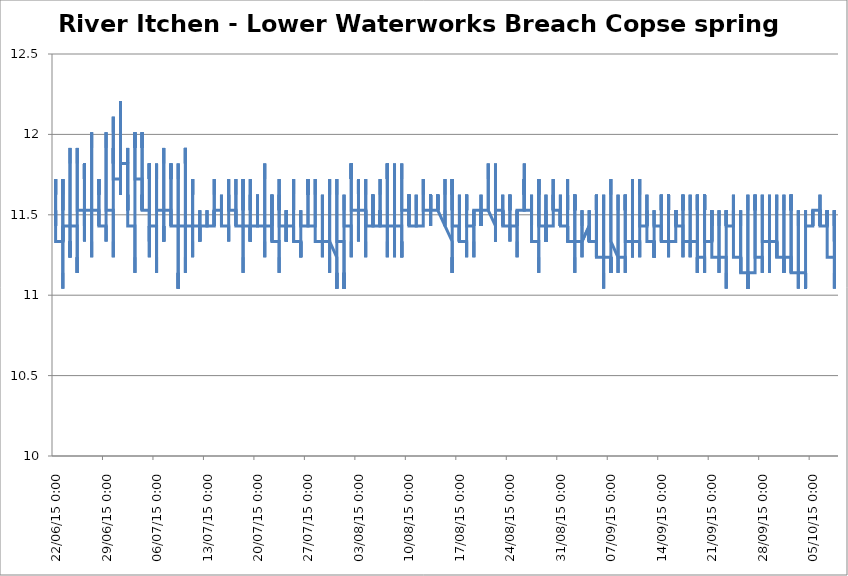
| Category | centigrade |
|---|---|
| 2015-06-22 12:00:00 | 11.431 |
| 2015-06-22 12:15:00 | 11.528 |
| 2015-06-22 12:30:00 | 11.431 |
| 2015-06-22 12:45:00 | 11.528 |
| 2015-06-22 13:00:00 | 11.528 |
| 2015-06-22 13:15:00 | 11.528 |
| 2015-06-22 13:30:00 | 11.625 |
| 2015-06-22 13:45:00 | 11.625 |
| 2015-06-22 14:00:00 | 11.625 |
| 2015-06-22 14:15:00 | 11.722 |
| 2015-06-22 14:30:00 | 11.625 |
| 2015-06-22 14:45:00 | 11.625 |
| 2015-06-22 15:00:00 | 11.625 |
| 2015-06-22 15:15:00 | 11.625 |
| 2015-06-22 15:30:00 | 11.722 |
| 2015-06-22 15:45:00 | 11.722 |
| 2015-06-22 16:00:00 | 11.722 |
| 2015-06-22 16:15:00 | 11.722 |
| 2015-06-22 16:30:00 | 11.722 |
| 2015-06-22 16:45:00 | 11.722 |
| 2015-06-22 17:00:00 | 11.722 |
| 2015-06-22 17:15:00 | 11.722 |
| 2015-06-22 17:30:00 | 11.722 |
| 2015-06-22 17:45:00 | 11.625 |
| 2015-06-22 18:00:00 | 11.625 |
| 2015-06-22 18:15:00 | 11.625 |
| 2015-06-22 18:30:00 | 11.625 |
| 2015-06-22 18:45:00 | 11.625 |
| 2015-06-22 19:00:00 | 11.528 |
| 2015-06-22 19:15:00 | 11.528 |
| 2015-06-22 19:30:00 | 11.528 |
| 2015-06-22 19:45:00 | 11.528 |
| 2015-06-22 20:00:00 | 11.528 |
| 2015-06-22 20:15:00 | 11.528 |
| 2015-06-22 20:30:00 | 11.528 |
| 2015-06-22 20:45:00 | 11.528 |
| 2015-06-22 21:00:00 | 11.528 |
| 2015-06-22 21:15:00 | 11.431 |
| 2015-06-22 21:30:00 | 11.431 |
| 2015-06-22 21:45:00 | 11.431 |
| 2015-06-22 22:00:00 | 11.431 |
| 2015-06-22 22:15:00 | 11.431 |
| 2015-06-22 22:30:00 | 11.431 |
| 2015-06-22 22:45:00 | 11.431 |
| 2015-06-22 23:00:00 | 11.334 |
| 2015-06-22 23:15:00 | 11.334 |
| 2015-06-22 23:30:00 | 11.334 |
| 2015-06-22 23:45:00 | 11.334 |
| 2015-06-23 | 11.334 |
| 2015-06-23 00:15:00 | 11.334 |
| 2015-06-23 00:30:00 | 11.334 |
| 2015-06-23 00:45:00 | 11.431 |
| 2015-06-23 01:00:00 | 11.334 |
| 2015-06-23 01:15:00 | 11.431 |
| 2015-06-23 01:30:00 | 11.334 |
| 2015-06-23 01:45:00 | 11.334 |
| 2015-06-23 02:00:00 | 11.334 |
| 2015-06-23 02:15:00 | 11.334 |
| 2015-06-23 02:30:00 | 11.236 |
| 2015-06-23 02:45:00 | 11.236 |
| 2015-06-23 03:00:00 | 11.236 |
| 2015-06-23 03:15:00 | 11.236 |
| 2015-06-23 03:30:00 | 11.236 |
| 2015-06-23 03:45:00 | 11.236 |
| 2015-06-23 04:00:00 | 11.139 |
| 2015-06-23 04:15:00 | 11.139 |
| 2015-06-23 04:30:00 | 11.139 |
| 2015-06-23 04:45:00 | 11.139 |
| 2015-06-23 05:00:00 | 11.139 |
| 2015-06-23 05:15:00 | 11.139 |
| 2015-06-23 05:30:00 | 11.139 |
| 2015-06-23 05:45:00 | 11.041 |
| 2015-06-23 06:00:00 | 11.041 |
| 2015-06-23 06:15:00 | 11.041 |
| 2015-06-23 06:30:00 | 11.041 |
| 2015-06-23 06:45:00 | 11.041 |
| 2015-06-23 07:00:00 | 11.139 |
| 2015-06-23 07:15:00 | 11.139 |
| 2015-06-23 07:30:00 | 11.139 |
| 2015-06-23 07:45:00 | 11.236 |
| 2015-06-23 08:00:00 | 11.236 |
| 2015-06-23 08:15:00 | 11.236 |
| 2015-06-23 08:30:00 | 11.236 |
| 2015-06-23 08:45:00 | 11.334 |
| 2015-06-23 09:00:00 | 11.334 |
| 2015-06-23 09:15:00 | 11.334 |
| 2015-06-23 09:30:00 | 11.334 |
| 2015-06-23 09:45:00 | 11.431 |
| 2015-06-23 10:00:00 | 11.431 |
| 2015-06-23 10:15:00 | 11.431 |
| 2015-06-23 10:30:00 | 11.431 |
| 2015-06-23 10:45:00 | 11.431 |
| 2015-06-23 11:00:00 | 11.528 |
| 2015-06-23 11:15:00 | 11.528 |
| 2015-06-23 11:30:00 | 11.528 |
| 2015-06-23 11:45:00 | 11.625 |
| 2015-06-23 12:00:00 | 11.625 |
| 2015-06-23 12:15:00 | 11.625 |
| 2015-06-23 12:30:00 | 11.625 |
| 2015-06-23 12:45:00 | 11.625 |
| 2015-06-23 13:00:00 | 11.625 |
| 2015-06-23 13:15:00 | 11.625 |
| 2015-06-23 13:30:00 | 11.625 |
| 2015-06-23 13:45:00 | 11.625 |
| 2015-06-23 14:00:00 | 11.625 |
| 2015-06-23 14:15:00 | 11.625 |
| 2015-06-23 14:30:00 | 11.722 |
| 2015-06-23 14:45:00 | 11.722 |
| 2015-06-23 15:00:00 | 11.722 |
| 2015-06-23 15:15:00 | 11.722 |
| 2015-06-23 15:30:00 | 11.722 |
| 2015-06-23 15:45:00 | 11.722 |
| 2015-06-23 16:00:00 | 11.722 |
| 2015-06-23 16:15:00 | 11.722 |
| 2015-06-23 16:30:00 | 11.722 |
| 2015-06-23 16:45:00 | 11.722 |
| 2015-06-23 17:00:00 | 11.722 |
| 2015-06-23 17:15:00 | 11.722 |
| 2015-06-23 17:30:00 | 11.722 |
| 2015-06-23 17:45:00 | 11.625 |
| 2015-06-23 18:00:00 | 11.722 |
| 2015-06-23 18:15:00 | 11.625 |
| 2015-06-23 18:30:00 | 11.625 |
| 2015-06-23 18:45:00 | 11.625 |
| 2015-06-23 19:00:00 | 11.625 |
| 2015-06-23 19:15:00 | 11.625 |
| 2015-06-23 19:30:00 | 11.625 |
| 2015-06-23 19:45:00 | 11.625 |
| 2015-06-23 20:00:00 | 11.625 |
| 2015-06-23 20:15:00 | 11.625 |
| 2015-06-23 20:30:00 | 11.625 |
| 2015-06-23 20:45:00 | 11.625 |
| 2015-06-23 21:00:00 | 11.528 |
| 2015-06-23 21:15:00 | 11.625 |
| 2015-06-23 21:30:00 | 11.528 |
| 2015-06-23 21:45:00 | 11.528 |
| 2015-06-23 22:00:00 | 11.528 |
| 2015-06-23 22:15:00 | 11.528 |
| 2015-06-23 22:30:00 | 11.528 |
| 2015-06-23 22:45:00 | 11.528 |
| 2015-06-23 23:00:00 | 11.431 |
| 2015-06-23 23:15:00 | 11.431 |
| 2015-06-23 23:30:00 | 11.431 |
| 2015-06-23 23:45:00 | 11.431 |
| 2015-06-24 | 11.431 |
| 2015-06-24 00:15:00 | 11.431 |
| 2015-06-24 00:30:00 | 11.431 |
| 2015-06-24 00:45:00 | 11.431 |
| 2015-06-24 01:00:00 | 11.431 |
| 2015-06-24 01:15:00 | 11.431 |
| 2015-06-24 01:30:00 | 11.431 |
| 2015-06-24 01:45:00 | 11.431 |
| 2015-06-24 02:00:00 | 11.334 |
| 2015-06-24 02:15:00 | 11.334 |
| 2015-06-24 02:30:00 | 11.334 |
| 2015-06-24 02:45:00 | 11.334 |
| 2015-06-24 03:00:00 | 11.334 |
| 2015-06-24 03:15:00 | 11.334 |
| 2015-06-24 03:30:00 | 11.334 |
| 2015-06-24 03:45:00 | 11.334 |
| 2015-06-24 04:00:00 | 11.334 |
| 2015-06-24 04:15:00 | 11.334 |
| 2015-06-24 04:30:00 | 11.236 |
| 2015-06-24 04:45:00 | 11.334 |
| 2015-06-24 05:00:00 | 11.334 |
| 2015-06-24 05:15:00 | 11.236 |
| 2015-06-24 05:30:00 | 11.236 |
| 2015-06-24 05:45:00 | 11.236 |
| 2015-06-24 06:00:00 | 11.334 |
| 2015-06-24 06:15:00 | 11.236 |
| 2015-06-24 06:30:00 | 11.334 |
| 2015-06-24 06:45:00 | 11.334 |
| 2015-06-24 07:00:00 | 11.334 |
| 2015-06-24 07:15:00 | 11.334 |
| 2015-06-24 07:30:00 | 11.334 |
| 2015-06-24 07:45:00 | 11.334 |
| 2015-06-24 08:00:00 | 11.334 |
| 2015-06-24 08:15:00 | 11.334 |
| 2015-06-24 08:30:00 | 11.334 |
| 2015-06-24 08:45:00 | 11.334 |
| 2015-06-24 09:00:00 | 11.334 |
| 2015-06-24 09:15:00 | 11.431 |
| 2015-06-24 09:30:00 | 11.431 |
| 2015-06-24 09:45:00 | 11.431 |
| 2015-06-24 10:00:00 | 11.431 |
| 2015-06-24 10:15:00 | 11.528 |
| 2015-06-24 10:30:00 | 11.528 |
| 2015-06-24 10:45:00 | 11.528 |
| 2015-06-24 11:00:00 | 11.625 |
| 2015-06-24 11:15:00 | 11.625 |
| 2015-06-24 11:30:00 | 11.625 |
| 2015-06-24 11:45:00 | 11.722 |
| 2015-06-24 12:00:00 | 11.722 |
| 2015-06-24 12:15:00 | 11.722 |
| 2015-06-24 12:30:00 | 11.722 |
| 2015-06-24 12:45:00 | 11.819 |
| 2015-06-24 13:00:00 | 11.819 |
| 2015-06-24 13:15:00 | 11.819 |
| 2015-06-24 13:30:00 | 11.916 |
| 2015-06-24 13:45:00 | 11.916 |
| 2015-06-24 14:00:00 | 11.916 |
| 2015-06-24 14:15:00 | 11.916 |
| 2015-06-24 14:30:00 | 11.916 |
| 2015-06-24 14:45:00 | 11.916 |
| 2015-06-24 15:00:00 | 11.916 |
| 2015-06-24 15:15:00 | 11.916 |
| 2015-06-24 15:30:00 | 11.916 |
| 2015-06-24 15:45:00 | 11.916 |
| 2015-06-24 16:00:00 | 11.916 |
| 2015-06-24 16:15:00 | 11.916 |
| 2015-06-24 16:30:00 | 11.916 |
| 2015-06-24 16:45:00 | 11.916 |
| 2015-06-24 17:00:00 | 11.819 |
| 2015-06-24 17:15:00 | 11.819 |
| 2015-06-24 17:30:00 | 11.819 |
| 2015-06-24 17:45:00 | 11.722 |
| 2015-06-24 18:00:00 | 11.722 |
| 2015-06-24 18:15:00 | 11.722 |
| 2015-06-24 18:30:00 | 11.722 |
| 2015-06-24 18:45:00 | 11.722 |
| 2015-06-24 19:00:00 | 11.722 |
| 2015-06-24 19:15:00 | 11.722 |
| 2015-06-24 19:30:00 | 11.722 |
| 2015-06-24 19:45:00 | 11.722 |
| 2015-06-24 20:00:00 | 11.722 |
| 2015-06-24 20:15:00 | 11.722 |
| 2015-06-24 20:30:00 | 11.625 |
| 2015-06-24 20:45:00 | 11.625 |
| 2015-06-24 21:00:00 | 11.625 |
| 2015-06-24 21:15:00 | 11.625 |
| 2015-06-24 21:30:00 | 11.625 |
| 2015-06-24 21:45:00 | 11.625 |
| 2015-06-24 22:00:00 | 11.528 |
| 2015-06-24 22:15:00 | 11.528 |
| 2015-06-24 22:30:00 | 11.528 |
| 2015-06-24 22:45:00 | 11.528 |
| 2015-06-24 23:00:00 | 11.528 |
| 2015-06-24 23:15:00 | 11.528 |
| 2015-06-24 23:30:00 | 11.431 |
| 2015-06-24 23:45:00 | 11.431 |
| 2015-06-25 | 11.431 |
| 2015-06-25 00:15:00 | 11.431 |
| 2015-06-25 00:30:00 | 11.431 |
| 2015-06-25 00:45:00 | 11.431 |
| 2015-06-25 01:00:00 | 11.431 |
| 2015-06-25 01:15:00 | 11.431 |
| 2015-06-25 01:30:00 | 11.431 |
| 2015-06-25 01:45:00 | 11.431 |
| 2015-06-25 02:00:00 | 11.334 |
| 2015-06-25 02:15:00 | 11.334 |
| 2015-06-25 02:30:00 | 11.334 |
| 2015-06-25 02:45:00 | 11.334 |
| 2015-06-25 03:00:00 | 11.334 |
| 2015-06-25 03:15:00 | 11.334 |
| 2015-06-25 03:30:00 | 11.334 |
| 2015-06-25 03:45:00 | 11.334 |
| 2015-06-25 04:00:00 | 11.236 |
| 2015-06-25 04:15:00 | 11.236 |
| 2015-06-25 04:30:00 | 11.236 |
| 2015-06-25 04:45:00 | 11.236 |
| 2015-06-25 05:00:00 | 11.236 |
| 2015-06-25 05:15:00 | 11.236 |
| 2015-06-25 05:30:00 | 11.236 |
| 2015-06-25 05:45:00 | 11.139 |
| 2015-06-25 06:00:00 | 11.236 |
| 2015-06-25 06:15:00 | 11.139 |
| 2015-06-25 06:30:00 | 11.139 |
| 2015-06-25 06:45:00 | 11.139 |
| 2015-06-25 07:00:00 | 11.236 |
| 2015-06-25 07:15:00 | 11.236 |
| 2015-06-25 07:30:00 | 11.236 |
| 2015-06-25 07:45:00 | 11.236 |
| 2015-06-25 08:00:00 | 11.236 |
| 2015-06-25 08:15:00 | 11.236 |
| 2015-06-25 08:30:00 | 11.334 |
| 2015-06-25 08:45:00 | 11.334 |
| 2015-06-25 09:00:00 | 11.334 |
| 2015-06-25 09:15:00 | 11.334 |
| 2015-06-25 09:30:00 | 11.334 |
| 2015-06-25 09:45:00 | 11.431 |
| 2015-06-25 10:00:00 | 11.431 |
| 2015-06-25 10:15:00 | 11.431 |
| 2015-06-25 10:30:00 | 11.528 |
| 2015-06-25 10:45:00 | 11.528 |
| 2015-06-25 11:00:00 | 11.528 |
| 2015-06-25 11:15:00 | 11.625 |
| 2015-06-25 11:30:00 | 11.625 |
| 2015-06-25 11:45:00 | 11.722 |
| 2015-06-25 12:00:00 | 11.722 |
| 2015-06-25 12:15:00 | 11.722 |
| 2015-06-25 12:30:00 | 11.819 |
| 2015-06-25 12:45:00 | 11.819 |
| 2015-06-25 13:00:00 | 11.819 |
| 2015-06-25 13:15:00 | 11.819 |
| 2015-06-25 13:30:00 | 11.819 |
| 2015-06-25 13:45:00 | 11.819 |
| 2015-06-25 14:00:00 | 11.916 |
| 2015-06-25 14:15:00 | 11.916 |
| 2015-06-25 14:30:00 | 11.916 |
| 2015-06-25 14:45:00 | 11.916 |
| 2015-06-25 15:00:00 | 11.916 |
| 2015-06-25 15:15:00 | 11.916 |
| 2015-06-25 15:30:00 | 11.916 |
| 2015-06-25 15:45:00 | 11.916 |
| 2015-06-25 16:00:00 | 11.916 |
| 2015-06-25 16:15:00 | 11.916 |
| 2015-06-25 16:30:00 | 11.916 |
| 2015-06-25 16:45:00 | 11.916 |
| 2015-06-25 17:00:00 | 11.916 |
| 2015-06-25 17:15:00 | 11.916 |
| 2015-06-25 17:30:00 | 11.819 |
| 2015-06-25 17:45:00 | 11.819 |
| 2015-06-25 18:00:00 | 11.819 |
| 2015-06-25 18:15:00 | 11.722 |
| 2015-06-25 18:30:00 | 11.722 |
| 2015-06-25 18:45:00 | 11.722 |
| 2015-06-25 19:00:00 | 11.722 |
| 2015-06-25 19:15:00 | 11.722 |
| 2015-06-25 19:30:00 | 11.722 |
| 2015-06-25 19:45:00 | 11.722 |
| 2015-06-25 20:00:00 | 11.722 |
| 2015-06-25 20:15:00 | 11.722 |
| 2015-06-25 20:30:00 | 11.625 |
| 2015-06-25 20:45:00 | 11.625 |
| 2015-06-25 21:00:00 | 11.625 |
| 2015-06-25 21:15:00 | 11.625 |
| 2015-06-25 21:30:00 | 11.625 |
| 2015-06-25 21:45:00 | 11.625 |
| 2015-06-25 22:00:00 | 11.625 |
| 2015-06-25 22:15:00 | 11.528 |
| 2015-06-25 22:30:00 | 11.528 |
| 2015-06-25 22:45:00 | 11.528 |
| 2015-06-25 23:00:00 | 11.528 |
| 2015-06-25 23:15:00 | 11.528 |
| 2015-06-25 23:30:00 | 11.528 |
| 2015-06-25 23:45:00 | 11.528 |
| 2015-06-26 | 11.528 |
| 2015-06-26 00:15:00 | 11.431 |
| 2015-06-26 00:30:00 | 11.528 |
| 2015-06-26 00:45:00 | 11.431 |
| 2015-06-26 01:00:00 | 11.431 |
| 2015-06-26 01:15:00 | 11.431 |
| 2015-06-26 01:30:00 | 11.431 |
| 2015-06-26 01:45:00 | 11.431 |
| 2015-06-26 02:00:00 | 11.431 |
| 2015-06-26 02:15:00 | 11.431 |
| 2015-06-26 02:30:00 | 11.431 |
| 2015-06-26 02:45:00 | 11.431 |
| 2015-06-26 03:00:00 | 11.334 |
| 2015-06-26 03:15:00 | 11.334 |
| 2015-06-26 03:30:00 | 11.334 |
| 2015-06-26 03:45:00 | 11.334 |
| 2015-06-26 04:00:00 | 11.334 |
| 2015-06-26 04:15:00 | 11.334 |
| 2015-06-26 04:30:00 | 11.334 |
| 2015-06-26 04:45:00 | 11.334 |
| 2015-06-26 05:00:00 | 11.334 |
| 2015-06-26 05:15:00 | 11.334 |
| 2015-06-26 05:30:00 | 11.334 |
| 2015-06-26 05:45:00 | 11.334 |
| 2015-06-26 06:00:00 | 11.334 |
| 2015-06-26 06:15:00 | 11.334 |
| 2015-06-26 06:30:00 | 11.334 |
| 2015-06-26 06:45:00 | 11.334 |
| 2015-06-26 07:00:00 | 11.334 |
| 2015-06-26 07:15:00 | 11.334 |
| 2015-06-26 07:30:00 | 11.334 |
| 2015-06-26 07:45:00 | 11.334 |
| 2015-06-26 08:00:00 | 11.334 |
| 2015-06-26 08:15:00 | 11.431 |
| 2015-06-26 08:30:00 | 11.431 |
| 2015-06-26 08:45:00 | 11.431 |
| 2015-06-26 09:00:00 | 11.431 |
| 2015-06-26 09:15:00 | 11.431 |
| 2015-06-26 09:30:00 | 11.431 |
| 2015-06-26 09:45:00 | 11.431 |
| 2015-06-26 10:00:00 | 11.528 |
| 2015-06-26 10:15:00 | 11.528 |
| 2015-06-26 10:30:00 | 11.528 |
| 2015-06-26 10:45:00 | 11.528 |
| 2015-06-26 11:00:00 | 11.625 |
| 2015-06-26 11:15:00 | 11.625 |
| 2015-06-26 11:30:00 | 11.625 |
| 2015-06-26 11:45:00 | 11.722 |
| 2015-06-26 12:00:00 | 11.722 |
| 2015-06-26 12:15:00 | 11.722 |
| 2015-06-26 12:30:00 | 11.819 |
| 2015-06-26 12:45:00 | 11.819 |
| 2015-06-26 13:00:00 | 11.819 |
| 2015-06-26 13:15:00 | 11.819 |
| 2015-06-26 13:30:00 | 11.722 |
| 2015-06-26 13:45:00 | 11.722 |
| 2015-06-26 14:00:00 | 11.722 |
| 2015-06-26 14:15:00 | 11.722 |
| 2015-06-26 14:30:00 | 11.722 |
| 2015-06-26 14:45:00 | 11.722 |
| 2015-06-26 15:00:00 | 11.722 |
| 2015-06-26 15:15:00 | 11.722 |
| 2015-06-26 15:30:00 | 11.819 |
| 2015-06-26 15:45:00 | 11.819 |
| 2015-06-26 16:00:00 | 11.819 |
| 2015-06-26 16:15:00 | 11.819 |
| 2015-06-26 16:30:00 | 11.819 |
| 2015-06-26 16:45:00 | 11.722 |
| 2015-06-26 17:00:00 | 11.819 |
| 2015-06-26 17:15:00 | 11.819 |
| 2015-06-26 17:30:00 | 11.819 |
| 2015-06-26 17:45:00 | 11.819 |
| 2015-06-26 18:00:00 | 11.722 |
| 2015-06-26 18:15:00 | 11.722 |
| 2015-06-26 18:30:00 | 11.722 |
| 2015-06-26 18:45:00 | 11.722 |
| 2015-06-26 19:00:00 | 11.722 |
| 2015-06-26 19:15:00 | 11.722 |
| 2015-06-26 19:30:00 | 11.722 |
| 2015-06-26 19:45:00 | 11.722 |
| 2015-06-26 20:00:00 | 11.722 |
| 2015-06-26 20:15:00 | 11.722 |
| 2015-06-26 20:30:00 | 11.625 |
| 2015-06-26 20:45:00 | 11.625 |
| 2015-06-26 21:00:00 | 11.625 |
| 2015-06-26 21:15:00 | 11.625 |
| 2015-06-26 21:30:00 | 11.625 |
| 2015-06-26 21:45:00 | 11.625 |
| 2015-06-26 22:00:00 | 11.625 |
| 2015-06-26 22:15:00 | 11.625 |
| 2015-06-26 22:30:00 | 11.528 |
| 2015-06-26 22:45:00 | 11.528 |
| 2015-06-26 23:00:00 | 11.528 |
| 2015-06-26 23:15:00 | 11.528 |
| 2015-06-26 23:30:00 | 11.528 |
| 2015-06-26 23:45:00 | 11.528 |
| 2015-06-27 | 11.528 |
| 2015-06-27 00:15:00 | 11.528 |
| 2015-06-27 00:30:00 | 11.528 |
| 2015-06-27 00:45:00 | 11.528 |
| 2015-06-27 01:00:00 | 11.431 |
| 2015-06-27 01:15:00 | 11.431 |
| 2015-06-27 01:30:00 | 11.431 |
| 2015-06-27 01:45:00 | 11.431 |
| 2015-06-27 02:00:00 | 11.431 |
| 2015-06-27 02:15:00 | 11.431 |
| 2015-06-27 02:30:00 | 11.431 |
| 2015-06-27 02:45:00 | 11.431 |
| 2015-06-27 03:00:00 | 11.431 |
| 2015-06-27 03:15:00 | 11.334 |
| 2015-06-27 03:30:00 | 11.334 |
| 2015-06-27 03:45:00 | 11.334 |
| 2015-06-27 04:00:00 | 11.334 |
| 2015-06-27 04:15:00 | 11.334 |
| 2015-06-27 04:30:00 | 11.236 |
| 2015-06-27 04:45:00 | 11.236 |
| 2015-06-27 05:00:00 | 11.236 |
| 2015-06-27 05:15:00 | 11.236 |
| 2015-06-27 05:30:00 | 11.236 |
| 2015-06-27 05:45:00 | 11.236 |
| 2015-06-27 06:00:00 | 11.236 |
| 2015-06-27 06:15:00 | 11.236 |
| 2015-06-27 06:30:00 | 11.236 |
| 2015-06-27 06:45:00 | 11.236 |
| 2015-06-27 07:00:00 | 11.236 |
| 2015-06-27 07:15:00 | 11.236 |
| 2015-06-27 07:30:00 | 11.236 |
| 2015-06-27 07:45:00 | 11.236 |
| 2015-06-27 08:00:00 | 11.236 |
| 2015-06-27 08:15:00 | 11.236 |
| 2015-06-27 08:30:00 | 11.334 |
| 2015-06-27 08:45:00 | 11.334 |
| 2015-06-27 09:00:00 | 11.334 |
| 2015-06-27 09:15:00 | 11.334 |
| 2015-06-27 09:30:00 | 11.334 |
| 2015-06-27 09:45:00 | 11.431 |
| 2015-06-27 10:00:00 | 11.431 |
| 2015-06-27 10:15:00 | 11.431 |
| 2015-06-27 10:30:00 | 11.528 |
| 2015-06-27 10:45:00 | 11.528 |
| 2015-06-27 11:00:00 | 11.528 |
| 2015-06-27 11:15:00 | 11.625 |
| 2015-06-27 11:30:00 | 11.722 |
| 2015-06-27 11:45:00 | 11.722 |
| 2015-06-27 12:00:00 | 11.722 |
| 2015-06-27 12:15:00 | 11.722 |
| 2015-06-27 12:30:00 | 11.722 |
| 2015-06-27 12:45:00 | 11.819 |
| 2015-06-27 13:00:00 | 11.819 |
| 2015-06-27 13:15:00 | 11.819 |
| 2015-06-27 13:30:00 | 11.819 |
| 2015-06-27 13:45:00 | 11.916 |
| 2015-06-27 14:00:00 | 11.916 |
| 2015-06-27 14:15:00 | 11.916 |
| 2015-06-27 14:30:00 | 11.916 |
| 2015-06-27 14:45:00 | 12.013 |
| 2015-06-27 15:00:00 | 12.013 |
| 2015-06-27 15:15:00 | 12.013 |
| 2015-06-27 15:30:00 | 11.916 |
| 2015-06-27 15:45:00 | 11.916 |
| 2015-06-27 16:00:00 | 11.916 |
| 2015-06-27 16:15:00 | 11.916 |
| 2015-06-27 16:30:00 | 11.916 |
| 2015-06-27 16:45:00 | 11.916 |
| 2015-06-27 17:00:00 | 11.819 |
| 2015-06-27 17:15:00 | 11.819 |
| 2015-06-27 17:30:00 | 11.819 |
| 2015-06-27 17:45:00 | 11.819 |
| 2015-06-27 18:00:00 | 11.819 |
| 2015-06-27 18:15:00 | 11.819 |
| 2015-06-27 18:30:00 | 11.819 |
| 2015-06-27 18:45:00 | 11.819 |
| 2015-06-27 19:00:00 | 11.819 |
| 2015-06-27 19:15:00 | 11.722 |
| 2015-06-27 19:30:00 | 11.722 |
| 2015-06-27 19:45:00 | 11.722 |
| 2015-06-27 20:00:00 | 11.722 |
| 2015-06-27 20:15:00 | 11.722 |
| 2015-06-27 20:30:00 | 11.722 |
| 2015-06-27 20:45:00 | 11.722 |
| 2015-06-27 21:00:00 | 11.722 |
| 2015-06-27 21:15:00 | 11.722 |
| 2015-06-27 21:30:00 | 11.625 |
| 2015-06-27 21:45:00 | 11.625 |
| 2015-06-27 22:00:00 | 11.625 |
| 2015-06-27 22:15:00 | 11.625 |
| 2015-06-27 22:30:00 | 11.625 |
| 2015-06-27 22:45:00 | 11.625 |
| 2015-06-27 23:00:00 | 11.528 |
| 2015-06-27 23:15:00 | 11.528 |
| 2015-06-27 23:30:00 | 11.528 |
| 2015-06-27 23:45:00 | 11.528 |
| 2015-06-28 | 11.528 |
| 2015-06-28 00:15:00 | 11.528 |
| 2015-06-28 00:30:00 | 11.528 |
| 2015-06-28 00:45:00 | 11.528 |
| 2015-06-28 01:00:00 | 11.528 |
| 2015-06-28 01:15:00 | 11.528 |
| 2015-06-28 01:30:00 | 11.528 |
| 2015-06-28 01:45:00 | 11.528 |
| 2015-06-28 02:00:00 | 11.431 |
| 2015-06-28 02:15:00 | 11.431 |
| 2015-06-28 02:30:00 | 11.431 |
| 2015-06-28 02:45:00 | 11.431 |
| 2015-06-28 03:00:00 | 11.431 |
| 2015-06-28 03:15:00 | 11.431 |
| 2015-06-28 03:30:00 | 11.431 |
| 2015-06-28 03:45:00 | 11.431 |
| 2015-06-28 04:00:00 | 11.431 |
| 2015-06-28 04:15:00 | 11.431 |
| 2015-06-28 04:30:00 | 11.431 |
| 2015-06-28 04:45:00 | 11.431 |
| 2015-06-28 05:00:00 | 11.431 |
| 2015-06-28 05:15:00 | 11.431 |
| 2015-06-28 05:30:00 | 11.431 |
| 2015-06-28 05:45:00 | 11.431 |
| 2015-06-28 06:00:00 | 11.431 |
| 2015-06-28 06:15:00 | 11.431 |
| 2015-06-28 06:30:00 | 11.431 |
| 2015-06-28 06:45:00 | 11.431 |
| 2015-06-28 07:00:00 | 11.431 |
| 2015-06-28 07:15:00 | 11.431 |
| 2015-06-28 07:30:00 | 11.528 |
| 2015-06-28 07:45:00 | 11.528 |
| 2015-06-28 08:00:00 | 11.528 |
| 2015-06-28 08:15:00 | 11.528 |
| 2015-06-28 08:30:00 | 11.528 |
| 2015-06-28 08:45:00 | 11.528 |
| 2015-06-28 09:00:00 | 11.528 |
| 2015-06-28 09:15:00 | 11.528 |
| 2015-06-28 09:30:00 | 11.625 |
| 2015-06-28 09:45:00 | 11.625 |
| 2015-06-28 10:00:00 | 11.625 |
| 2015-06-28 10:15:00 | 11.625 |
| 2015-06-28 10:30:00 | 11.625 |
| 2015-06-28 10:45:00 | 11.625 |
| 2015-06-28 11:00:00 | 11.625 |
| 2015-06-28 11:15:00 | 11.625 |
| 2015-06-28 11:30:00 | 11.625 |
| 2015-06-28 11:45:00 | 11.625 |
| 2015-06-28 12:00:00 | 11.625 |
| 2015-06-28 12:15:00 | 11.625 |
| 2015-06-28 12:30:00 | 11.625 |
| 2015-06-28 12:45:00 | 11.625 |
| 2015-06-28 13:00:00 | 11.625 |
| 2015-06-28 13:15:00 | 11.625 |
| 2015-06-28 13:30:00 | 11.625 |
| 2015-06-28 13:45:00 | 11.625 |
| 2015-06-28 14:00:00 | 11.625 |
| 2015-06-28 14:15:00 | 11.625 |
| 2015-06-28 14:30:00 | 11.625 |
| 2015-06-28 14:45:00 | 11.625 |
| 2015-06-28 15:00:00 | 11.625 |
| 2015-06-28 15:15:00 | 11.722 |
| 2015-06-28 15:30:00 | 11.722 |
| 2015-06-28 15:45:00 | 11.722 |
| 2015-06-28 16:00:00 | 11.722 |
| 2015-06-28 16:15:00 | 11.625 |
| 2015-06-28 16:30:00 | 11.625 |
| 2015-06-28 16:45:00 | 11.625 |
| 2015-06-28 17:00:00 | 11.625 |
| 2015-06-28 17:15:00 | 11.625 |
| 2015-06-28 17:30:00 | 11.625 |
| 2015-06-28 17:45:00 | 11.625 |
| 2015-06-28 18:00:00 | 11.625 |
| 2015-06-28 18:15:00 | 11.625 |
| 2015-06-28 18:30:00 | 11.625 |
| 2015-06-28 18:45:00 | 11.722 |
| 2015-06-28 19:00:00 | 11.625 |
| 2015-06-28 19:15:00 | 11.625 |
| 2015-06-28 19:30:00 | 11.625 |
| 2015-06-28 19:45:00 | 11.625 |
| 2015-06-28 20:00:00 | 11.625 |
| 2015-06-28 20:15:00 | 11.625 |
| 2015-06-28 20:30:00 | 11.625 |
| 2015-06-28 20:45:00 | 11.625 |
| 2015-06-28 21:00:00 | 11.625 |
| 2015-06-28 21:15:00 | 11.625 |
| 2015-06-28 21:30:00 | 11.528 |
| 2015-06-28 21:45:00 | 11.528 |
| 2015-06-28 22:00:00 | 11.528 |
| 2015-06-28 22:15:00 | 11.528 |
| 2015-06-28 22:30:00 | 11.528 |
| 2015-06-28 22:45:00 | 11.528 |
| 2015-06-28 23:00:00 | 11.528 |
| 2015-06-28 23:15:00 | 11.528 |
| 2015-06-28 23:30:00 | 11.528 |
| 2015-06-28 23:45:00 | 11.431 |
| 2015-06-29 | 11.431 |
| 2015-06-29 00:15:00 | 11.431 |
| 2015-06-29 00:30:00 | 11.431 |
| 2015-06-29 00:45:00 | 11.431 |
| 2015-06-29 01:00:00 | 11.431 |
| 2015-06-29 01:15:00 | 11.431 |
| 2015-06-29 01:30:00 | 11.431 |
| 2015-06-29 01:45:00 | 11.431 |
| 2015-06-29 02:00:00 | 11.431 |
| 2015-06-29 02:15:00 | 11.431 |
| 2015-06-29 02:30:00 | 11.431 |
| 2015-06-29 02:45:00 | 11.431 |
| 2015-06-29 03:00:00 | 11.431 |
| 2015-06-29 03:15:00 | 11.431 |
| 2015-06-29 03:30:00 | 11.431 |
| 2015-06-29 03:45:00 | 11.431 |
| 2015-06-29 04:00:00 | 11.431 |
| 2015-06-29 04:15:00 | 11.431 |
| 2015-06-29 04:30:00 | 11.334 |
| 2015-06-29 04:45:00 | 11.334 |
| 2015-06-29 05:00:00 | 11.334 |
| 2015-06-29 05:15:00 | 11.334 |
| 2015-06-29 05:30:00 | 11.334 |
| 2015-06-29 05:45:00 | 11.334 |
| 2015-06-29 06:00:00 | 11.334 |
| 2015-06-29 06:15:00 | 11.334 |
| 2015-06-29 06:30:00 | 11.334 |
| 2015-06-29 06:45:00 | 11.334 |
| 2015-06-29 07:00:00 | 11.334 |
| 2015-06-29 07:15:00 | 11.334 |
| 2015-06-29 07:30:00 | 11.334 |
| 2015-06-29 07:45:00 | 11.334 |
| 2015-06-29 08:00:00 | 11.334 |
| 2015-06-29 08:15:00 | 11.334 |
| 2015-06-29 08:30:00 | 11.334 |
| 2015-06-29 08:45:00 | 11.431 |
| 2015-06-29 09:00:00 | 11.431 |
| 2015-06-29 09:15:00 | 11.431 |
| 2015-06-29 09:30:00 | 11.431 |
| 2015-06-29 09:45:00 | 11.528 |
| 2015-06-29 10:00:00 | 11.528 |
| 2015-06-29 10:15:00 | 11.528 |
| 2015-06-29 10:30:00 | 11.528 |
| 2015-06-29 10:45:00 | 11.625 |
| 2015-06-29 11:00:00 | 11.625 |
| 2015-06-29 11:15:00 | 11.625 |
| 2015-06-29 11:30:00 | 11.625 |
| 2015-06-29 11:45:00 | 11.625 |
| 2015-06-29 12:00:00 | 11.722 |
| 2015-06-29 12:15:00 | 11.722 |
| 2015-06-29 12:30:00 | 11.722 |
| 2015-06-29 12:45:00 | 11.722 |
| 2015-06-29 13:00:00 | 11.819 |
| 2015-06-29 13:15:00 | 11.819 |
| 2015-06-29 13:30:00 | 11.819 |
| 2015-06-29 13:45:00 | 11.916 |
| 2015-06-29 14:00:00 | 11.916 |
| 2015-06-29 14:15:00 | 11.916 |
| 2015-06-29 14:30:00 | 12.013 |
| 2015-06-29 14:45:00 | 12.013 |
| 2015-06-29 15:00:00 | 12.013 |
| 2015-06-29 15:15:00 | 12.013 |
| 2015-06-29 15:30:00 | 12.013 |
| 2015-06-29 15:45:00 | 12.013 |
| 2015-06-29 16:00:00 | 12.013 |
| 2015-06-29 16:15:00 | 12.013 |
| 2015-06-29 16:30:00 | 12.013 |
| 2015-06-29 16:45:00 | 11.916 |
| 2015-06-29 17:00:00 | 11.916 |
| 2015-06-29 17:15:00 | 11.916 |
| 2015-06-29 17:30:00 | 11.916 |
| 2015-06-29 17:45:00 | 11.916 |
| 2015-06-29 18:00:00 | 11.819 |
| 2015-06-29 18:15:00 | 11.819 |
| 2015-06-29 18:30:00 | 11.819 |
| 2015-06-29 18:45:00 | 11.722 |
| 2015-06-29 19:00:00 | 11.722 |
| 2015-06-29 19:15:00 | 11.722 |
| 2015-06-29 19:30:00 | 11.722 |
| 2015-06-29 19:45:00 | 11.722 |
| 2015-06-29 20:00:00 | 11.722 |
| 2015-06-29 20:15:00 | 11.722 |
| 2015-06-29 20:30:00 | 11.722 |
| 2015-06-29 20:45:00 | 11.722 |
| 2015-06-29 21:00:00 | 11.722 |
| 2015-06-29 21:15:00 | 11.625 |
| 2015-06-29 21:30:00 | 11.625 |
| 2015-06-29 21:45:00 | 11.625 |
| 2015-06-29 22:00:00 | 11.625 |
| 2015-06-29 22:15:00 | 11.625 |
| 2015-06-29 22:30:00 | 11.625 |
| 2015-06-29 22:45:00 | 11.528 |
| 2015-06-29 23:00:00 | 11.528 |
| 2015-06-29 23:15:00 | 11.528 |
| 2015-06-29 23:30:00 | 11.528 |
| 2015-06-29 23:45:00 | 11.528 |
| 2015-06-30 | 11.528 |
| 2015-06-30 00:15:00 | 11.528 |
| 2015-06-30 00:30:00 | 11.528 |
| 2015-06-30 00:45:00 | 11.431 |
| 2015-06-30 01:00:00 | 11.431 |
| 2015-06-30 01:15:00 | 11.431 |
| 2015-06-30 01:30:00 | 11.431 |
| 2015-06-30 01:45:00 | 11.431 |
| 2015-06-30 02:00:00 | 11.431 |
| 2015-06-30 02:15:00 | 11.431 |
| 2015-06-30 02:30:00 | 11.431 |
| 2015-06-30 02:45:00 | 11.334 |
| 2015-06-30 03:00:00 | 11.334 |
| 2015-06-30 03:15:00 | 11.334 |
| 2015-06-30 03:30:00 | 11.334 |
| 2015-06-30 03:45:00 | 11.334 |
| 2015-06-30 04:00:00 | 11.334 |
| 2015-06-30 04:15:00 | 11.334 |
| 2015-06-30 04:30:00 | 11.236 |
| 2015-06-30 04:45:00 | 11.236 |
| 2015-06-30 05:00:00 | 11.236 |
| 2015-06-30 05:15:00 | 11.236 |
| 2015-06-30 05:30:00 | 11.236 |
| 2015-06-30 05:45:00 | 11.236 |
| 2015-06-30 06:00:00 | 11.236 |
| 2015-06-30 06:15:00 | 11.236 |
| 2015-06-30 06:30:00 | 11.236 |
| 2015-06-30 06:45:00 | 11.236 |
| 2015-06-30 07:00:00 | 11.236 |
| 2015-06-30 07:15:00 | 11.236 |
| 2015-06-30 07:30:00 | 11.236 |
| 2015-06-30 07:45:00 | 11.236 |
| 2015-06-30 08:00:00 | 11.236 |
| 2015-06-30 08:15:00 | 11.236 |
| 2015-06-30 08:30:00 | 11.334 |
| 2015-06-30 08:45:00 | 11.334 |
| 2015-06-30 09:00:00 | 11.334 |
| 2015-06-30 09:15:00 | 11.334 |
| 2015-06-30 09:30:00 | 11.431 |
| 2015-06-30 09:45:00 | 11.431 |
| 2015-06-30 10:00:00 | 11.431 |
| 2015-06-30 10:15:00 | 11.528 |
| 2015-06-30 10:30:00 | 11.528 |
| 2015-06-30 10:45:00 | 11.528 |
| 2015-06-30 11:00:00 | 11.625 |
| 2015-06-30 11:15:00 | 11.625 |
| 2015-06-30 11:30:00 | 11.722 |
| 2015-06-30 11:45:00 | 11.722 |
| 2015-06-30 12:00:00 | 11.819 |
| 2015-06-30 12:15:00 | 11.819 |
| 2015-06-30 12:30:00 | 11.819 |
| 2015-06-30 12:45:00 | 11.916 |
| 2015-06-30 13:00:00 | 11.916 |
| 2015-06-30 13:15:00 | 11.916 |
| 2015-06-30 13:30:00 | 11.916 |
| 2015-06-30 13:45:00 | 12.013 |
| 2015-06-30 14:00:00 | 12.013 |
| 2015-06-30 14:15:00 | 12.013 |
| 2015-06-30 14:30:00 | 12.11 |
| 2015-06-30 14:45:00 | 12.11 |
| 2015-06-30 15:00:00 | 12.11 |
| 2015-06-30 15:15:00 | 12.11 |
| 2015-06-30 15:30:00 | 12.11 |
| 2015-06-30 15:45:00 | 12.11 |
| 2015-06-30 16:00:00 | 12.11 |
| 2015-06-30 16:15:00 | 12.11 |
| 2015-06-30 16:30:00 | 12.11 |
| 2015-06-30 16:45:00 | 12.11 |
| 2015-06-30 17:00:00 | 12.013 |
| 2015-06-30 17:15:00 | 12.013 |
| 2015-06-30 17:30:00 | 12.013 |
| 2015-06-30 17:45:00 | 12.013 |
| 2015-06-30 18:00:00 | 11.916 |
| 2015-06-30 18:15:00 | 11.916 |
| 2015-06-30 18:30:00 | 11.916 |
| 2015-06-30 18:45:00 | 11.916 |
| 2015-06-30 19:00:00 | 11.819 |
| 2015-06-30 19:15:00 | 11.916 |
| 2015-06-30 19:30:00 | 11.819 |
| 2015-06-30 19:45:00 | 11.819 |
| 2015-06-30 20:00:00 | 11.819 |
| 2015-06-30 20:15:00 | 11.819 |
| 2015-06-30 20:30:00 | 11.819 |
| 2015-06-30 20:45:00 | 11.819 |
| 2015-06-30 21:00:00 | 11.819 |
| 2015-06-30 21:15:00 | 11.819 |
| 2015-06-30 21:30:00 | 11.819 |
| 2015-06-30 21:45:00 | 11.819 |
| 2015-06-30 22:00:00 | 11.722 |
| 2015-06-30 22:15:00 | 11.722 |
| 2015-06-30 22:30:00 | 11.722 |
| 2015-06-30 22:45:00 | 11.722 |
| 2015-06-30 23:00:00 | 11.722 |
| 2015-06-30 23:15:00 | 11.722 |
| 2015-06-30 23:30:00 | 11.722 |
| 2015-06-30 23:45:00 | 11.722 |
| 2015-07-01 | 11.722 |
| 2015-07-01 00:15:00 | 11.722 |
| 2015-07-01 00:30:00 | 11.722 |
| 2015-07-01 00:45:00 | 11.722 |
| 2015-07-01 01:00:00 | 11.625 |
| 2015-07-01 01:15:00 | 11.722 |
| 2015-07-01 01:30:00 | 11.625 |
| 2015-07-01 01:45:00 | 11.625 |
| 2015-07-01 02:00:00 | 11.625 |
| 2015-07-01 02:15:00 | 11.625 |
| 2015-07-01 02:30:00 | 11.625 |
| 2015-07-01 02:45:00 | 11.625 |
| 2015-07-01 03:00:00 | 11.625 |
| 2015-07-01 03:15:00 | 11.625 |
| 2015-07-01 03:30:00 | 11.625 |
| 2015-07-01 03:45:00 | 11.625 |
| 2015-07-01 04:00:00 | 11.625 |
| 2015-07-01 04:15:00 | 11.625 |
| 2015-07-01 04:30:00 | 11.625 |
| 2015-07-01 04:45:00 | 11.625 |
| 2015-07-01 05:00:00 | 11.625 |
| 2015-07-01 05:15:00 | 11.625 |
| 2015-07-01 05:30:00 | 11.625 |
| 2015-07-01 05:45:00 | 11.625 |
| 2015-07-01 06:00:00 | 11.625 |
| 2015-07-01 06:15:00 | 11.625 |
| 2015-07-01 06:30:00 | 11.625 |
| 2015-07-01 06:45:00 | 11.625 |
| 2015-07-01 07:00:00 | 11.625 |
| 2015-07-01 07:15:00 | 11.625 |
| 2015-07-01 07:30:00 | 11.722 |
| 2015-07-01 07:45:00 | 11.722 |
| 2015-07-01 08:00:00 | 11.722 |
| 2015-07-01 08:15:00 | 11.722 |
| 2015-07-01 08:30:00 | 11.722 |
| 2015-07-01 08:45:00 | 11.722 |
| 2015-07-01 09:00:00 | 11.722 |
| 2015-07-01 09:15:00 | 11.722 |
| 2015-07-01 09:30:00 | 11.722 |
| 2015-07-01 09:45:00 | 11.819 |
| 2015-07-01 10:00:00 | 11.819 |
| 2015-07-01 10:15:00 | 11.819 |
| 2015-07-01 10:30:00 | 11.819 |
| 2015-07-01 10:45:00 | 11.819 |
| 2015-07-01 11:00:00 | 11.819 |
| 2015-07-01 11:15:00 | 11.916 |
| 2015-07-01 11:30:00 | 11.916 |
| 2015-07-01 11:45:00 | 11.916 |
| 2015-07-01 12:00:00 | 11.916 |
| 2015-07-01 12:15:00 | 11.916 |
| 2015-07-01 12:30:00 | 11.916 |
| 2015-07-01 12:45:00 | 11.916 |
| 2015-07-01 13:00:00 | 12.013 |
| 2015-07-01 13:15:00 | 12.013 |
| 2015-07-01 13:30:00 | 12.11 |
| 2015-07-01 13:45:00 | 12.11 |
| 2015-07-01 14:00:00 | 12.11 |
| 2015-07-01 14:15:00 | 12.207 |
| 2015-07-01 14:30:00 | 12.207 |
| 2015-07-01 14:45:00 | 12.207 |
| 2015-07-01 15:00:00 | 12.207 |
| 2015-07-01 15:15:00 | 12.207 |
| 2015-07-01 15:30:00 | 12.207 |
| 2015-07-01 15:45:00 | 12.11 |
| 2015-07-01 16:00:00 | 12.11 |
| 2015-07-01 16:15:00 | 12.11 |
| 2015-07-01 16:30:00 | 12.11 |
| 2015-07-01 16:45:00 | 12.11 |
| 2015-07-01 17:00:00 | 12.11 |
| 2015-07-01 17:15:00 | 12.11 |
| 2015-07-01 17:30:00 | 12.11 |
| 2015-07-01 17:45:00 | 12.11 |
| 2015-07-01 18:00:00 | 12.013 |
| 2015-07-01 18:15:00 | 12.013 |
| 2015-07-01 18:30:00 | 12.013 |
| 2015-07-01 18:45:00 | 12.013 |
| 2015-07-01 19:00:00 | 12.013 |
| 2015-07-01 19:15:00 | 11.916 |
| 2015-07-01 19:30:00 | 12.013 |
| 2015-07-01 19:45:00 | 11.916 |
| 2015-07-01 20:00:00 | 11.916 |
| 2015-07-01 20:15:00 | 11.916 |
| 2015-07-01 20:30:00 | 11.916 |
| 2015-07-01 20:45:00 | 11.916 |
| 2015-07-01 21:00:00 | 11.916 |
| 2015-07-01 21:15:00 | 11.916 |
| 2015-07-01 21:30:00 | 11.916 |
| 2015-07-01 21:45:00 | 11.819 |
| 2015-07-01 22:00:00 | 11.819 |
| 2015-07-01 22:15:00 | 11.819 |
| 2015-07-01 22:30:00 | 11.916 |
| 2015-07-01 22:45:00 | 11.916 |
| 2015-07-01 23:00:00 | 11.916 |
| 2015-07-01 23:15:00 | 11.819 |
| 2015-07-01 23:30:00 | 11.819 |
| 2015-07-01 23:45:00 | 11.819 |
| 2015-07-02 | 11.819 |
| 2015-07-02 00:15:00 | 11.819 |
| 2015-07-02 00:30:00 | 11.722 |
| 2015-07-02 00:45:00 | 11.722 |
| 2015-07-02 01:00:00 | 11.722 |
| 2015-07-02 01:15:00 | 11.722 |
| 2015-07-02 01:30:00 | 11.625 |
| 2015-07-02 01:45:00 | 11.625 |
| 2015-07-02 02:00:00 | 11.625 |
| 2015-07-02 02:15:00 | 11.625 |
| 2015-07-02 02:30:00 | 11.625 |
| 2015-07-02 02:45:00 | 11.625 |
| 2015-07-02 03:00:00 | 11.625 |
| 2015-07-02 03:15:00 | 11.625 |
| 2015-07-02 03:30:00 | 11.625 |
| 2015-07-02 03:45:00 | 11.625 |
| 2015-07-02 04:00:00 | 11.625 |
| 2015-07-02 04:15:00 | 11.625 |
| 2015-07-02 04:30:00 | 11.625 |
| 2015-07-02 04:45:00 | 11.625 |
| 2015-07-02 05:00:00 | 11.625 |
| 2015-07-02 05:15:00 | 11.625 |
| 2015-07-02 05:30:00 | 11.625 |
| 2015-07-02 05:45:00 | 11.528 |
| 2015-07-02 06:00:00 | 11.528 |
| 2015-07-02 06:15:00 | 11.528 |
| 2015-07-02 06:30:00 | 11.528 |
| 2015-07-02 06:45:00 | 11.625 |
| 2015-07-02 07:00:00 | 11.528 |
| 2015-07-02 07:15:00 | 11.625 |
| 2015-07-02 07:30:00 | 11.625 |
| 2015-07-02 07:45:00 | 11.625 |
| 2015-07-02 08:00:00 | 11.625 |
| 2015-07-02 08:15:00 | 11.625 |
| 2015-07-02 08:30:00 | 11.625 |
| 2015-07-02 08:45:00 | 11.625 |
| 2015-07-02 09:00:00 | 11.625 |
| 2015-07-02 09:15:00 | 11.625 |
| 2015-07-02 09:30:00 | 11.625 |
| 2015-07-02 09:45:00 | 11.625 |
| 2015-07-02 10:00:00 | 11.625 |
| 2015-07-02 10:15:00 | 11.625 |
| 2015-07-02 10:30:00 | 11.625 |
| 2015-07-02 10:45:00 | 11.625 |
| 2015-07-02 11:00:00 | 11.625 |
| 2015-07-02 11:15:00 | 11.722 |
| 2015-07-02 11:30:00 | 11.722 |
| 2015-07-02 11:45:00 | 11.722 |
| 2015-07-02 12:00:00 | 11.722 |
| 2015-07-02 12:15:00 | 11.722 |
| 2015-07-02 12:30:00 | 11.722 |
| 2015-07-02 12:45:00 | 11.722 |
| 2015-07-02 13:00:00 | 11.722 |
| 2015-07-02 13:15:00 | 11.722 |
| 2015-07-02 13:30:00 | 11.722 |
| 2015-07-02 13:45:00 | 11.722 |
| 2015-07-02 14:00:00 | 11.722 |
| 2015-07-02 14:15:00 | 11.819 |
| 2015-07-02 14:30:00 | 11.916 |
| 2015-07-02 14:45:00 | 11.916 |
| 2015-07-02 15:00:00 | 11.916 |
| 2015-07-02 15:15:00 | 11.916 |
| 2015-07-02 15:30:00 | 11.916 |
| 2015-07-02 15:45:00 | 11.819 |
| 2015-07-02 16:00:00 | 11.819 |
| 2015-07-02 16:15:00 | 11.819 |
| 2015-07-02 16:30:00 | 11.819 |
| 2015-07-02 16:45:00 | 11.722 |
| 2015-07-02 17:00:00 | 11.722 |
| 2015-07-02 17:15:00 | 11.722 |
| 2015-07-02 17:30:00 | 11.722 |
| 2015-07-02 17:45:00 | 11.722 |
| 2015-07-02 18:00:00 | 11.722 |
| 2015-07-02 18:15:00 | 11.722 |
| 2015-07-02 18:30:00 | 11.722 |
| 2015-07-02 18:45:00 | 11.722 |
| 2015-07-02 19:00:00 | 11.722 |
| 2015-07-02 19:15:00 | 11.722 |
| 2015-07-02 19:30:00 | 11.722 |
| 2015-07-02 19:45:00 | 11.625 |
| 2015-07-02 20:00:00 | 11.625 |
| 2015-07-02 20:15:00 | 11.625 |
| 2015-07-02 20:30:00 | 11.625 |
| 2015-07-02 20:45:00 | 11.625 |
| 2015-07-02 21:00:00 | 11.625 |
| 2015-07-02 21:15:00 | 11.625 |
| 2015-07-02 21:30:00 | 11.625 |
| 2015-07-02 21:45:00 | 11.625 |
| 2015-07-02 22:00:00 | 11.528 |
| 2015-07-02 22:15:00 | 11.528 |
| 2015-07-02 22:30:00 | 11.528 |
| 2015-07-02 22:45:00 | 11.528 |
| 2015-07-02 23:00:00 | 11.528 |
| 2015-07-02 23:15:00 | 11.528 |
| 2015-07-02 23:30:00 | 11.431 |
| 2015-07-02 23:45:00 | 11.431 |
| 2015-07-03 | 11.431 |
| 2015-07-03 00:15:00 | 11.431 |
| 2015-07-03 00:30:00 | 11.431 |
| 2015-07-03 00:45:00 | 11.431 |
| 2015-07-03 01:00:00 | 11.431 |
| 2015-07-03 01:15:00 | 11.431 |
| 2015-07-03 01:30:00 | 11.334 |
| 2015-07-03 01:45:00 | 11.334 |
| 2015-07-03 02:00:00 | 11.334 |
| 2015-07-03 02:15:00 | 11.334 |
| 2015-07-03 02:30:00 | 11.334 |
| 2015-07-03 02:45:00 | 11.334 |
| 2015-07-03 03:00:00 | 11.236 |
| 2015-07-03 03:15:00 | 11.236 |
| 2015-07-03 03:30:00 | 11.236 |
| 2015-07-03 03:45:00 | 11.236 |
| 2015-07-03 04:00:00 | 11.236 |
| 2015-07-03 04:15:00 | 11.236 |
| 2015-07-03 04:30:00 | 11.139 |
| 2015-07-03 04:45:00 | 11.139 |
| 2015-07-03 05:00:00 | 11.139 |
| 2015-07-03 05:15:00 | 11.139 |
| 2015-07-03 05:30:00 | 11.139 |
| 2015-07-03 05:45:00 | 11.139 |
| 2015-07-03 06:00:00 | 11.139 |
| 2015-07-03 06:15:00 | 11.139 |
| 2015-07-03 06:30:00 | 11.139 |
| 2015-07-03 06:45:00 | 11.139 |
| 2015-07-03 07:00:00 | 11.139 |
| 2015-07-03 07:15:00 | 11.139 |
| 2015-07-03 07:30:00 | 11.139 |
| 2015-07-03 07:45:00 | 11.139 |
| 2015-07-03 08:00:00 | 11.236 |
| 2015-07-03 08:15:00 | 11.236 |
| 2015-07-03 08:30:00 | 11.236 |
| 2015-07-03 08:45:00 | 11.236 |
| 2015-07-03 09:00:00 | 11.334 |
| 2015-07-03 09:15:00 | 11.334 |
| 2015-07-03 09:30:00 | 11.334 |
| 2015-07-03 09:45:00 | 11.431 |
| 2015-07-03 10:00:00 | 11.431 |
| 2015-07-03 10:15:00 | 11.431 |
| 2015-07-03 10:30:00 | 11.528 |
| 2015-07-03 10:45:00 | 11.528 |
| 2015-07-03 11:00:00 | 11.528 |
| 2015-07-03 11:15:00 | 11.625 |
| 2015-07-03 11:30:00 | 11.625 |
| 2015-07-03 11:45:00 | 11.722 |
| 2015-07-03 12:00:00 | 11.722 |
| 2015-07-03 12:15:00 | 11.819 |
| 2015-07-03 12:30:00 | 11.819 |
| 2015-07-03 12:45:00 | 11.819 |
| 2015-07-03 13:00:00 | 11.819 |
| 2015-07-03 13:15:00 | 11.916 |
| 2015-07-03 13:30:00 | 11.916 |
| 2015-07-03 13:45:00 | 11.916 |
| 2015-07-03 14:00:00 | 11.916 |
| 2015-07-03 14:15:00 | 11.916 |
| 2015-07-03 14:30:00 | 11.916 |
| 2015-07-03 14:45:00 | 11.916 |
| 2015-07-03 15:00:00 | 11.916 |
| 2015-07-03 15:15:00 | 11.916 |
| 2015-07-03 15:30:00 | 12.013 |
| 2015-07-03 15:45:00 | 12.013 |
| 2015-07-03 16:00:00 | 12.013 |
| 2015-07-03 16:15:00 | 11.916 |
| 2015-07-03 16:30:00 | 11.916 |
| 2015-07-03 16:45:00 | 11.916 |
| 2015-07-03 17:00:00 | 12.013 |
| 2015-07-03 17:15:00 | 12.013 |
| 2015-07-03 17:30:00 | 12.013 |
| 2015-07-03 17:45:00 | 11.916 |
| 2015-07-03 18:00:00 | 11.916 |
| 2015-07-03 18:15:00 | 11.916 |
| 2015-07-03 18:30:00 | 11.916 |
| 2015-07-03 18:45:00 | 11.916 |
| 2015-07-03 19:00:00 | 11.916 |
| 2015-07-03 19:15:00 | 11.916 |
| 2015-07-03 19:30:00 | 11.916 |
| 2015-07-03 19:45:00 | 11.916 |
| 2015-07-03 20:00:00 | 11.819 |
| 2015-07-03 20:15:00 | 11.819 |
| 2015-07-03 20:30:00 | 11.819 |
| 2015-07-03 20:45:00 | 11.819 |
| 2015-07-03 21:00:00 | 11.819 |
| 2015-07-03 21:15:00 | 11.819 |
| 2015-07-03 21:30:00 | 11.819 |
| 2015-07-03 21:45:00 | 11.722 |
| 2015-07-03 22:00:00 | 11.722 |
| 2015-07-03 22:15:00 | 11.722 |
| 2015-07-03 22:30:00 | 11.722 |
| 2015-07-03 22:45:00 | 11.722 |
| 2015-07-03 23:00:00 | 11.722 |
| 2015-07-03 23:15:00 | 11.722 |
| 2015-07-03 23:30:00 | 11.722 |
| 2015-07-03 23:45:00 | 11.722 |
| 2015-07-04 | 11.722 |
| 2015-07-04 00:15:00 | 11.722 |
| 2015-07-04 00:30:00 | 11.722 |
| 2015-07-04 00:45:00 | 11.722 |
| 2015-07-04 01:00:00 | 11.722 |
| 2015-07-04 01:15:00 | 11.722 |
| 2015-07-04 01:30:00 | 11.722 |
| 2015-07-04 01:45:00 | 11.625 |
| 2015-07-04 02:00:00 | 11.625 |
| 2015-07-04 02:15:00 | 11.625 |
| 2015-07-04 02:30:00 | 11.625 |
| 2015-07-04 02:45:00 | 11.528 |
| 2015-07-04 03:00:00 | 11.625 |
| 2015-07-04 03:15:00 | 11.528 |
| 2015-07-04 03:30:00 | 11.528 |
| 2015-07-04 03:45:00 | 11.528 |
| 2015-07-04 04:00:00 | 11.528 |
| 2015-07-04 04:15:00 | 11.528 |
| 2015-07-04 04:30:00 | 11.528 |
| 2015-07-04 04:45:00 | 11.528 |
| 2015-07-04 05:00:00 | 11.528 |
| 2015-07-04 05:15:00 | 11.528 |
| 2015-07-04 05:30:00 | 11.528 |
| 2015-07-04 05:45:00 | 11.528 |
| 2015-07-04 06:00:00 | 11.528 |
| 2015-07-04 06:15:00 | 11.528 |
| 2015-07-04 06:30:00 | 11.528 |
| 2015-07-04 06:45:00 | 11.528 |
| 2015-07-04 07:00:00 | 11.528 |
| 2015-07-04 07:15:00 | 11.528 |
| 2015-07-04 07:30:00 | 11.528 |
| 2015-07-04 07:45:00 | 11.528 |
| 2015-07-04 08:00:00 | 11.528 |
| 2015-07-04 08:15:00 | 11.528 |
| 2015-07-04 08:30:00 | 11.528 |
| 2015-07-04 08:45:00 | 11.528 |
| 2015-07-04 09:00:00 | 11.528 |
| 2015-07-04 09:15:00 | 11.625 |
| 2015-07-04 09:30:00 | 11.625 |
| 2015-07-04 09:45:00 | 11.625 |
| 2015-07-04 10:00:00 | 11.625 |
| 2015-07-04 10:15:00 | 11.625 |
| 2015-07-04 10:30:00 | 11.625 |
| 2015-07-04 10:45:00 | 11.625 |
| 2015-07-04 11:00:00 | 11.722 |
| 2015-07-04 11:15:00 | 11.722 |
| 2015-07-04 11:30:00 | 11.722 |
| 2015-07-04 11:45:00 | 11.722 |
| 2015-07-04 12:00:00 | 11.722 |
| 2015-07-04 12:15:00 | 11.722 |
| 2015-07-04 12:30:00 | 11.819 |
| 2015-07-04 12:45:00 | 11.819 |
| 2015-07-04 13:00:00 | 11.916 |
| 2015-07-04 13:15:00 | 11.916 |
| 2015-07-04 13:30:00 | 12.013 |
| 2015-07-04 13:45:00 | 12.013 |
| 2015-07-04 14:00:00 | 12.013 |
| 2015-07-04 14:15:00 | 12.013 |
| 2015-07-04 14:30:00 | 12.013 |
| 2015-07-04 14:45:00 | 12.013 |
| 2015-07-04 15:00:00 | 11.916 |
| 2015-07-04 15:15:00 | 12.013 |
| 2015-07-04 15:30:00 | 11.916 |
| 2015-07-04 15:45:00 | 11.916 |
| 2015-07-04 16:00:00 | 11.916 |
| 2015-07-04 16:15:00 | 11.916 |
| 2015-07-04 16:30:00 | 11.916 |
| 2015-07-04 16:45:00 | 11.916 |
| 2015-07-04 17:00:00 | 11.916 |
| 2015-07-04 17:15:00 | 11.916 |
| 2015-07-04 17:30:00 | 11.916 |
| 2015-07-04 17:45:00 | 11.916 |
| 2015-07-04 18:00:00 | 11.819 |
| 2015-07-04 18:15:00 | 11.819 |
| 2015-07-04 18:30:00 | 11.819 |
| 2015-07-04 18:45:00 | 11.819 |
| 2015-07-04 19:00:00 | 11.819 |
| 2015-07-04 19:15:00 | 11.819 |
| 2015-07-04 19:30:00 | 11.819 |
| 2015-07-04 19:45:00 | 11.819 |
| 2015-07-04 20:00:00 | 11.722 |
| 2015-07-04 20:15:00 | 11.722 |
| 2015-07-04 20:30:00 | 11.722 |
| 2015-07-04 20:45:00 | 11.722 |
| 2015-07-04 21:00:00 | 11.722 |
| 2015-07-04 21:15:00 | 11.722 |
| 2015-07-04 21:30:00 | 11.625 |
| 2015-07-04 21:45:00 | 11.625 |
| 2015-07-04 22:00:00 | 11.625 |
| 2015-07-04 22:15:00 | 11.625 |
| 2015-07-04 22:30:00 | 11.625 |
| 2015-07-04 22:45:00 | 11.625 |
| 2015-07-04 23:00:00 | 11.528 |
| 2015-07-04 23:15:00 | 11.528 |
| 2015-07-04 23:30:00 | 11.528 |
| 2015-07-04 23:45:00 | 11.528 |
| 2015-07-05 | 11.528 |
| 2015-07-05 00:15:00 | 11.528 |
| 2015-07-05 00:30:00 | 11.528 |
| 2015-07-05 00:45:00 | 11.528 |
| 2015-07-05 01:00:00 | 11.528 |
| 2015-07-05 01:15:00 | 11.528 |
| 2015-07-05 01:30:00 | 11.431 |
| 2015-07-05 01:45:00 | 11.431 |
| 2015-07-05 02:00:00 | 11.431 |
| 2015-07-05 02:15:00 | 11.431 |
| 2015-07-05 02:30:00 | 11.431 |
| 2015-07-05 02:45:00 | 11.431 |
| 2015-07-05 03:00:00 | 11.431 |
| 2015-07-05 03:15:00 | 11.431 |
| 2015-07-05 03:30:00 | 11.334 |
| 2015-07-05 03:45:00 | 11.431 |
| 2015-07-05 04:00:00 | 11.334 |
| 2015-07-05 04:15:00 | 11.334 |
| 2015-07-05 04:30:00 | 11.334 |
| 2015-07-05 04:45:00 | 11.334 |
| 2015-07-05 05:00:00 | 11.334 |
| 2015-07-05 05:15:00 | 11.334 |
| 2015-07-05 05:30:00 | 11.334 |
| 2015-07-05 05:45:00 | 11.236 |
| 2015-07-05 06:00:00 | 11.334 |
| 2015-07-05 06:15:00 | 11.334 |
| 2015-07-05 06:30:00 | 11.334 |
| 2015-07-05 06:45:00 | 11.334 |
| 2015-07-05 07:00:00 | 11.334 |
| 2015-07-05 07:15:00 | 11.334 |
| 2015-07-05 07:30:00 | 11.334 |
| 2015-07-05 07:45:00 | 11.334 |
| 2015-07-05 08:00:00 | 11.334 |
| 2015-07-05 08:15:00 | 11.334 |
| 2015-07-05 08:30:00 | 11.334 |
| 2015-07-05 08:45:00 | 11.334 |
| 2015-07-05 09:00:00 | 11.334 |
| 2015-07-05 09:15:00 | 11.334 |
| 2015-07-05 09:30:00 | 11.334 |
| 2015-07-05 09:45:00 | 11.334 |
| 2015-07-05 10:00:00 | 11.431 |
| 2015-07-05 10:15:00 | 11.431 |
| 2015-07-05 10:30:00 | 11.431 |
| 2015-07-05 10:45:00 | 11.431 |
| 2015-07-05 11:00:00 | 11.431 |
| 2015-07-05 11:15:00 | 11.528 |
| 2015-07-05 11:30:00 | 11.528 |
| 2015-07-05 11:45:00 | 11.528 |
| 2015-07-05 12:00:00 | 11.528 |
| 2015-07-05 12:15:00 | 11.625 |
| 2015-07-05 12:30:00 | 11.625 |
| 2015-07-05 12:45:00 | 11.625 |
| 2015-07-05 13:00:00 | 11.625 |
| 2015-07-05 13:15:00 | 11.722 |
| 2015-07-05 13:30:00 | 11.722 |
| 2015-07-05 13:45:00 | 11.819 |
| 2015-07-05 14:00:00 | 11.819 |
| 2015-07-05 14:15:00 | 11.819 |
| 2015-07-05 14:30:00 | 11.722 |
| 2015-07-05 14:45:00 | 11.722 |
| 2015-07-05 15:00:00 | 11.722 |
| 2015-07-05 15:15:00 | 11.819 |
| 2015-07-05 15:30:00 | 11.722 |
| 2015-07-05 15:45:00 | 11.722 |
| 2015-07-05 16:00:00 | 11.819 |
| 2015-07-05 16:15:00 | 11.819 |
| 2015-07-05 16:30:00 | 11.819 |
| 2015-07-05 16:45:00 | 11.819 |
| 2015-07-05 17:00:00 | 11.819 |
| 2015-07-05 17:15:00 | 11.819 |
| 2015-07-05 17:30:00 | 11.819 |
| 2015-07-05 17:45:00 | 11.819 |
| 2015-07-05 18:00:00 | 11.722 |
| 2015-07-05 18:15:00 | 11.722 |
| 2015-07-05 18:30:00 | 11.722 |
| 2015-07-05 18:45:00 | 11.722 |
| 2015-07-05 19:00:00 | 11.722 |
| 2015-07-05 19:15:00 | 11.722 |
| 2015-07-05 19:30:00 | 11.625 |
| 2015-07-05 19:45:00 | 11.625 |
| 2015-07-05 20:00:00 | 11.625 |
| 2015-07-05 20:15:00 | 11.625 |
| 2015-07-05 20:30:00 | 11.625 |
| 2015-07-05 20:45:00 | 11.625 |
| 2015-07-05 21:00:00 | 11.625 |
| 2015-07-05 21:15:00 | 11.625 |
| 2015-07-05 21:30:00 | 11.625 |
| 2015-07-05 21:45:00 | 11.528 |
| 2015-07-05 22:00:00 | 11.528 |
| 2015-07-05 22:15:00 | 11.528 |
| 2015-07-05 22:30:00 | 11.528 |
| 2015-07-05 22:45:00 | 11.528 |
| 2015-07-05 23:00:00 | 11.528 |
| 2015-07-05 23:15:00 | 11.528 |
| 2015-07-05 23:30:00 | 11.431 |
| 2015-07-05 23:45:00 | 11.431 |
| 2015-07-06 | 11.431 |
| 2015-07-06 00:15:00 | 11.431 |
| 2015-07-06 00:30:00 | 11.431 |
| 2015-07-06 00:45:00 | 11.431 |
| 2015-07-06 01:00:00 | 11.431 |
| 2015-07-06 01:15:00 | 11.431 |
| 2015-07-06 01:30:00 | 11.431 |
| 2015-07-06 01:45:00 | 11.431 |
| 2015-07-06 02:00:00 | 11.431 |
| 2015-07-06 02:15:00 | 11.334 |
| 2015-07-06 02:30:00 | 11.334 |
| 2015-07-06 02:45:00 | 11.334 |
| 2015-07-06 03:00:00 | 11.334 |
| 2015-07-06 03:15:00 | 11.334 |
| 2015-07-06 03:30:00 | 11.334 |
| 2015-07-06 03:45:00 | 11.334 |
| 2015-07-06 04:00:00 | 11.236 |
| 2015-07-06 04:15:00 | 11.236 |
| 2015-07-06 04:30:00 | 11.236 |
| 2015-07-06 04:45:00 | 11.236 |
| 2015-07-06 05:00:00 | 11.236 |
| 2015-07-06 05:15:00 | 11.236 |
| 2015-07-06 05:30:00 | 11.139 |
| 2015-07-06 05:45:00 | 11.139 |
| 2015-07-06 06:00:00 | 11.139 |
| 2015-07-06 06:15:00 | 11.139 |
| 2015-07-06 06:30:00 | 11.139 |
| 2015-07-06 06:45:00 | 11.139 |
| 2015-07-06 07:00:00 | 11.139 |
| 2015-07-06 07:15:00 | 11.236 |
| 2015-07-06 07:30:00 | 11.236 |
| 2015-07-06 07:45:00 | 11.236 |
| 2015-07-06 08:00:00 | 11.236 |
| 2015-07-06 08:15:00 | 11.236 |
| 2015-07-06 08:30:00 | 11.334 |
| 2015-07-06 08:45:00 | 11.334 |
| 2015-07-06 09:00:00 | 11.334 |
| 2015-07-06 09:15:00 | 11.431 |
| 2015-07-06 09:30:00 | 11.431 |
| 2015-07-06 09:45:00 | 11.431 |
| 2015-07-06 10:00:00 | 11.431 |
| 2015-07-06 10:15:00 | 11.528 |
| 2015-07-06 10:30:00 | 11.528 |
| 2015-07-06 10:45:00 | 11.528 |
| 2015-07-06 11:00:00 | 11.528 |
| 2015-07-06 11:15:00 | 11.625 |
| 2015-07-06 11:30:00 | 11.625 |
| 2015-07-06 11:45:00 | 11.625 |
| 2015-07-06 12:00:00 | 11.625 |
| 2015-07-06 12:15:00 | 11.625 |
| 2015-07-06 12:30:00 | 11.625 |
| 2015-07-06 12:45:00 | 11.625 |
| 2015-07-06 13:00:00 | 11.625 |
| 2015-07-06 13:15:00 | 11.625 |
| 2015-07-06 13:30:00 | 11.722 |
| 2015-07-06 13:45:00 | 11.722 |
| 2015-07-06 14:00:00 | 11.722 |
| 2015-07-06 14:15:00 | 11.722 |
| 2015-07-06 14:30:00 | 11.722 |
| 2015-07-06 14:45:00 | 11.722 |
| 2015-07-06 15:00:00 | 11.722 |
| 2015-07-06 15:15:00 | 11.722 |
| 2015-07-06 15:30:00 | 11.722 |
| 2015-07-06 15:45:00 | 11.722 |
| 2015-07-06 16:00:00 | 11.819 |
| 2015-07-06 16:15:00 | 11.819 |
| 2015-07-06 16:30:00 | 11.819 |
| 2015-07-06 16:45:00 | 11.819 |
| 2015-07-06 17:00:00 | 11.819 |
| 2015-07-06 17:15:00 | 11.819 |
| 2015-07-06 17:30:00 | 11.819 |
| 2015-07-06 17:45:00 | 11.819 |
| 2015-07-06 18:00:00 | 11.722 |
| 2015-07-06 18:15:00 | 11.722 |
| 2015-07-06 18:30:00 | 11.722 |
| 2015-07-06 18:45:00 | 11.722 |
| 2015-07-06 19:00:00 | 11.722 |
| 2015-07-06 19:15:00 | 11.625 |
| 2015-07-06 19:30:00 | 11.625 |
| 2015-07-06 19:45:00 | 11.625 |
| 2015-07-06 20:00:00 | 11.625 |
| 2015-07-06 20:15:00 | 11.625 |
| 2015-07-06 20:30:00 | 11.625 |
| 2015-07-06 20:45:00 | 11.625 |
| 2015-07-06 21:00:00 | 11.625 |
| 2015-07-06 21:15:00 | 11.625 |
| 2015-07-06 21:30:00 | 11.625 |
| 2015-07-06 21:45:00 | 11.625 |
| 2015-07-06 22:00:00 | 11.625 |
| 2015-07-06 22:15:00 | 11.528 |
| 2015-07-06 22:30:00 | 11.528 |
| 2015-07-06 22:45:00 | 11.528 |
| 2015-07-06 23:00:00 | 11.528 |
| 2015-07-06 23:15:00 | 11.528 |
| 2015-07-06 23:30:00 | 11.528 |
| 2015-07-06 23:45:00 | 11.528 |
| 2015-07-07 | 11.528 |
| 2015-07-07 00:15:00 | 11.528 |
| 2015-07-07 00:30:00 | 11.528 |
| 2015-07-07 00:45:00 | 11.528 |
| 2015-07-07 01:00:00 | 11.431 |
| 2015-07-07 01:15:00 | 11.431 |
| 2015-07-07 01:30:00 | 11.431 |
| 2015-07-07 01:45:00 | 11.431 |
| 2015-07-07 02:00:00 | 11.431 |
| 2015-07-07 02:15:00 | 11.431 |
| 2015-07-07 02:30:00 | 11.431 |
| 2015-07-07 02:45:00 | 11.431 |
| 2015-07-07 03:00:00 | 11.431 |
| 2015-07-07 03:15:00 | 11.431 |
| 2015-07-07 03:30:00 | 11.431 |
| 2015-07-07 03:45:00 | 11.431 |
| 2015-07-07 04:00:00 | 11.431 |
| 2015-07-07 04:15:00 | 11.431 |
| 2015-07-07 04:30:00 | 11.431 |
| 2015-07-07 04:45:00 | 11.334 |
| 2015-07-07 05:00:00 | 11.431 |
| 2015-07-07 05:15:00 | 11.431 |
| 2015-07-07 05:30:00 | 11.334 |
| 2015-07-07 05:45:00 | 11.431 |
| 2015-07-07 06:00:00 | 11.431 |
| 2015-07-07 06:15:00 | 11.431 |
| 2015-07-07 06:30:00 | 11.431 |
| 2015-07-07 06:45:00 | 11.431 |
| 2015-07-07 07:00:00 | 11.431 |
| 2015-07-07 07:15:00 | 11.431 |
| 2015-07-07 07:30:00 | 11.431 |
| 2015-07-07 07:45:00 | 11.431 |
| 2015-07-07 08:00:00 | 11.431 |
| 2015-07-07 08:15:00 | 11.431 |
| 2015-07-07 08:30:00 | 11.431 |
| 2015-07-07 08:45:00 | 11.431 |
| 2015-07-07 09:00:00 | 11.528 |
| 2015-07-07 09:15:00 | 11.528 |
| 2015-07-07 09:30:00 | 11.528 |
| 2015-07-07 09:45:00 | 11.528 |
| 2015-07-07 10:00:00 | 11.528 |
| 2015-07-07 10:15:00 | 11.528 |
| 2015-07-07 10:30:00 | 11.528 |
| 2015-07-07 10:45:00 | 11.528 |
| 2015-07-07 11:00:00 | 11.528 |
| 2015-07-07 11:15:00 | 11.625 |
| 2015-07-07 11:30:00 | 11.625 |
| 2015-07-07 11:45:00 | 11.625 |
| 2015-07-07 12:00:00 | 11.722 |
| 2015-07-07 12:15:00 | 11.722 |
| 2015-07-07 12:30:00 | 11.722 |
| 2015-07-07 12:45:00 | 11.722 |
| 2015-07-07 13:00:00 | 11.722 |
| 2015-07-07 13:15:00 | 11.722 |
| 2015-07-07 13:30:00 | 11.819 |
| 2015-07-07 13:45:00 | 11.819 |
| 2015-07-07 14:00:00 | 11.819 |
| 2015-07-07 14:15:00 | 11.819 |
| 2015-07-07 14:30:00 | 11.819 |
| 2015-07-07 14:45:00 | 11.916 |
| 2015-07-07 15:00:00 | 11.819 |
| 2015-07-07 15:15:00 | 11.819 |
| 2015-07-07 15:30:00 | 11.722 |
| 2015-07-07 15:45:00 | 11.722 |
| 2015-07-07 16:00:00 | 11.722 |
| 2015-07-07 16:15:00 | 11.722 |
| 2015-07-07 16:30:00 | 11.722 |
| 2015-07-07 16:45:00 | 11.722 |
| 2015-07-07 17:00:00 | 11.722 |
| 2015-07-07 17:15:00 | 11.722 |
| 2015-07-07 17:30:00 | 11.722 |
| 2015-07-07 17:45:00 | 11.722 |
| 2015-07-07 18:00:00 | 11.722 |
| 2015-07-07 18:15:00 | 11.722 |
| 2015-07-07 18:30:00 | 11.722 |
| 2015-07-07 18:45:00 | 11.625 |
| 2015-07-07 19:00:00 | 11.625 |
| 2015-07-07 19:15:00 | 11.625 |
| 2015-07-07 19:30:00 | 11.625 |
| 2015-07-07 19:45:00 | 11.625 |
| 2015-07-07 20:00:00 | 11.625 |
| 2015-07-07 20:15:00 | 11.625 |
| 2015-07-07 20:30:00 | 11.625 |
| 2015-07-07 20:45:00 | 11.625 |
| 2015-07-07 21:00:00 | 11.625 |
| 2015-07-07 21:15:00 | 11.528 |
| 2015-07-07 21:30:00 | 11.528 |
| 2015-07-07 21:45:00 | 11.528 |
| 2015-07-07 22:00:00 | 11.528 |
| 2015-07-07 22:15:00 | 11.528 |
| 2015-07-07 22:30:00 | 11.528 |
| 2015-07-07 22:45:00 | 11.528 |
| 2015-07-07 23:00:00 | 11.528 |
| 2015-07-07 23:15:00 | 11.528 |
| 2015-07-07 23:30:00 | 11.528 |
| 2015-07-07 23:45:00 | 11.528 |
| 2015-07-08 | 11.528 |
| 2015-07-08 00:15:00 | 11.431 |
| 2015-07-08 00:30:00 | 11.431 |
| 2015-07-08 00:45:00 | 11.431 |
| 2015-07-08 01:00:00 | 11.431 |
| 2015-07-08 01:15:00 | 11.431 |
| 2015-07-08 01:30:00 | 11.431 |
| 2015-07-08 01:45:00 | 11.431 |
| 2015-07-08 02:00:00 | 11.431 |
| 2015-07-08 02:15:00 | 11.431 |
| 2015-07-08 02:30:00 | 11.431 |
| 2015-07-08 02:45:00 | 11.431 |
| 2015-07-08 03:00:00 | 11.431 |
| 2015-07-08 03:15:00 | 11.431 |
| 2015-07-08 03:30:00 | 11.431 |
| 2015-07-08 03:45:00 | 11.431 |
| 2015-07-08 04:00:00 | 11.431 |
| 2015-07-08 04:15:00 | 11.431 |
| 2015-07-08 04:30:00 | 11.431 |
| 2015-07-08 04:45:00 | 11.431 |
| 2015-07-08 05:00:00 | 11.431 |
| 2015-07-08 05:15:00 | 11.431 |
| 2015-07-08 05:30:00 | 11.431 |
| 2015-07-08 05:45:00 | 11.431 |
| 2015-07-08 06:00:00 | 11.431 |
| 2015-07-08 06:15:00 | 11.431 |
| 2015-07-08 06:30:00 | 11.431 |
| 2015-07-08 06:45:00 | 11.431 |
| 2015-07-08 07:00:00 | 11.431 |
| 2015-07-08 07:15:00 | 11.431 |
| 2015-07-08 07:30:00 | 11.431 |
| 2015-07-08 07:45:00 | 11.431 |
| 2015-07-08 08:00:00 | 11.431 |
| 2015-07-08 08:15:00 | 11.431 |
| 2015-07-08 08:30:00 | 11.431 |
| 2015-07-08 08:45:00 | 11.431 |
| 2015-07-08 09:00:00 | 11.431 |
| 2015-07-08 09:15:00 | 11.528 |
| 2015-07-08 09:30:00 | 11.528 |
| 2015-07-08 09:45:00 | 11.528 |
| 2015-07-08 10:00:00 | 11.528 |
| 2015-07-08 10:15:00 | 11.528 |
| 2015-07-08 10:30:00 | 11.528 |
| 2015-07-08 10:45:00 | 11.528 |
| 2015-07-08 11:00:00 | 11.528 |
| 2015-07-08 11:15:00 | 11.528 |
| 2015-07-08 11:30:00 | 11.528 |
| 2015-07-08 11:45:00 | 11.528 |
| 2015-07-08 12:00:00 | 11.625 |
| 2015-07-08 12:15:00 | 11.625 |
| 2015-07-08 12:30:00 | 11.625 |
| 2015-07-08 12:45:00 | 11.625 |
| 2015-07-08 13:00:00 | 11.625 |
| 2015-07-08 13:15:00 | 11.722 |
| 2015-07-08 13:30:00 | 11.722 |
| 2015-07-08 13:45:00 | 11.722 |
| 2015-07-08 14:00:00 | 11.722 |
| 2015-07-08 14:15:00 | 11.722 |
| 2015-07-08 14:30:00 | 11.722 |
| 2015-07-08 14:45:00 | 11.819 |
| 2015-07-08 15:00:00 | 11.722 |
| 2015-07-08 15:15:00 | 11.819 |
| 2015-07-08 15:30:00 | 11.819 |
| 2015-07-08 15:45:00 | 11.819 |
| 2015-07-08 16:00:00 | 11.819 |
| 2015-07-08 16:15:00 | 11.819 |
| 2015-07-08 16:30:00 | 11.722 |
| 2015-07-08 16:45:00 | 11.722 |
| 2015-07-08 17:00:00 | 11.722 |
| 2015-07-08 17:15:00 | 11.722 |
| 2015-07-08 17:30:00 | 11.722 |
| 2015-07-08 17:45:00 | 11.722 |
| 2015-07-08 18:00:00 | 11.722 |
| 2015-07-08 18:15:00 | 11.722 |
| 2015-07-08 18:30:00 | 11.722 |
| 2015-07-08 18:45:00 | 11.722 |
| 2015-07-08 19:00:00 | 11.625 |
| 2015-07-08 19:15:00 | 11.625 |
| 2015-07-08 19:30:00 | 11.625 |
| 2015-07-08 19:45:00 | 11.625 |
| 2015-07-08 20:00:00 | 11.625 |
| 2015-07-08 20:15:00 | 11.625 |
| 2015-07-08 20:30:00 | 11.625 |
| 2015-07-08 20:45:00 | 11.625 |
| 2015-07-08 21:00:00 | 11.625 |
| 2015-07-08 21:15:00 | 11.528 |
| 2015-07-08 21:30:00 | 11.528 |
| 2015-07-08 21:45:00 | 11.528 |
| 2015-07-08 22:00:00 | 11.528 |
| 2015-07-08 22:15:00 | 11.528 |
| 2015-07-08 22:30:00 | 11.528 |
| 2015-07-08 22:45:00 | 11.431 |
| 2015-07-08 23:00:00 | 11.431 |
| 2015-07-08 23:15:00 | 11.431 |
| 2015-07-08 23:30:00 | 11.431 |
| 2015-07-08 23:45:00 | 11.431 |
| 2015-07-09 | 11.431 |
| 2015-07-09 00:15:00 | 11.431 |
| 2015-07-09 00:30:00 | 11.334 |
| 2015-07-09 00:45:00 | 11.334 |
| 2015-07-09 01:00:00 | 11.334 |
| 2015-07-09 01:15:00 | 11.334 |
| 2015-07-09 01:30:00 | 11.334 |
| 2015-07-09 01:45:00 | 11.236 |
| 2015-07-09 02:00:00 | 11.236 |
| 2015-07-09 02:15:00 | 11.236 |
| 2015-07-09 02:30:00 | 11.236 |
| 2015-07-09 02:45:00 | 11.236 |
| 2015-07-09 03:00:00 | 11.236 |
| 2015-07-09 03:15:00 | 11.139 |
| 2015-07-09 03:30:00 | 11.139 |
| 2015-07-09 03:45:00 | 11.139 |
| 2015-07-09 04:00:00 | 11.139 |
| 2015-07-09 04:15:00 | 11.139 |
| 2015-07-09 04:30:00 | 11.139 |
| 2015-07-09 04:45:00 | 11.139 |
| 2015-07-09 05:00:00 | 11.139 |
| 2015-07-09 05:15:00 | 11.041 |
| 2015-07-09 05:30:00 | 11.041 |
| 2015-07-09 05:45:00 | 11.041 |
| 2015-07-09 06:00:00 | 11.041 |
| 2015-07-09 06:15:00 | 11.041 |
| 2015-07-09 06:30:00 | 11.139 |
| 2015-07-09 06:45:00 | 11.041 |
| 2015-07-09 07:00:00 | 11.139 |
| 2015-07-09 07:15:00 | 11.139 |
| 2015-07-09 07:30:00 | 11.139 |
| 2015-07-09 07:45:00 | 11.139 |
| 2015-07-09 08:00:00 | 11.139 |
| 2015-07-09 08:15:00 | 11.139 |
| 2015-07-09 08:30:00 | 11.236 |
| 2015-07-09 08:45:00 | 11.236 |
| 2015-07-09 09:00:00 | 11.236 |
| 2015-07-09 09:15:00 | 11.236 |
| 2015-07-09 09:30:00 | 11.334 |
| 2015-07-09 09:45:00 | 11.334 |
| 2015-07-09 10:00:00 | 11.334 |
| 2015-07-09 10:15:00 | 11.334 |
| 2015-07-09 10:30:00 | 11.431 |
| 2015-07-09 10:45:00 | 11.431 |
| 2015-07-09 11:00:00 | 11.431 |
| 2015-07-09 11:15:00 | 11.431 |
| 2015-07-09 11:30:00 | 11.528 |
| 2015-07-09 11:45:00 | 11.528 |
| 2015-07-09 12:00:00 | 11.528 |
| 2015-07-09 12:15:00 | 11.528 |
| 2015-07-09 12:30:00 | 11.528 |
| 2015-07-09 12:45:00 | 11.625 |
| 2015-07-09 13:00:00 | 11.625 |
| 2015-07-09 13:15:00 | 11.722 |
| 2015-07-09 13:30:00 | 11.722 |
| 2015-07-09 13:45:00 | 11.722 |
| 2015-07-09 14:00:00 | 11.722 |
| 2015-07-09 14:15:00 | 11.722 |
| 2015-07-09 14:30:00 | 11.722 |
| 2015-07-09 14:45:00 | 11.819 |
| 2015-07-09 15:00:00 | 11.819 |
| 2015-07-09 15:15:00 | 11.819 |
| 2015-07-09 15:30:00 | 11.819 |
| 2015-07-09 15:45:00 | 11.819 |
| 2015-07-09 16:00:00 | 11.819 |
| 2015-07-09 16:15:00 | 11.819 |
| 2015-07-09 16:30:00 | 11.819 |
| 2015-07-09 16:45:00 | 11.819 |
| 2015-07-09 17:00:00 | 11.819 |
| 2015-07-09 17:15:00 | 11.819 |
| 2015-07-09 17:30:00 | 11.819 |
| 2015-07-09 17:45:00 | 11.722 |
| 2015-07-09 18:00:00 | 11.722 |
| 2015-07-09 18:15:00 | 11.722 |
| 2015-07-09 18:30:00 | 11.722 |
| 2015-07-09 18:45:00 | 11.722 |
| 2015-07-09 19:00:00 | 11.625 |
| 2015-07-09 19:15:00 | 11.625 |
| 2015-07-09 19:30:00 | 11.625 |
| 2015-07-09 19:45:00 | 11.625 |
| 2015-07-09 20:00:00 | 11.625 |
| 2015-07-09 20:15:00 | 11.625 |
| 2015-07-09 20:30:00 | 11.625 |
| 2015-07-09 20:45:00 | 11.625 |
| 2015-07-09 21:00:00 | 11.625 |
| 2015-07-09 21:15:00 | 11.625 |
| 2015-07-09 21:30:00 | 11.625 |
| 2015-07-09 21:45:00 | 11.625 |
| 2015-07-09 22:00:00 | 11.625 |
| 2015-07-09 22:15:00 | 11.625 |
| 2015-07-09 22:30:00 | 11.528 |
| 2015-07-09 22:45:00 | 11.528 |
| 2015-07-09 23:00:00 | 11.528 |
| 2015-07-09 23:15:00 | 11.528 |
| 2015-07-09 23:30:00 | 11.431 |
| 2015-07-09 23:45:00 | 11.431 |
| 2015-07-10 | 11.431 |
| 2015-07-10 00:15:00 | 11.431 |
| 2015-07-10 00:30:00 | 11.431 |
| 2015-07-10 00:45:00 | 11.431 |
| 2015-07-10 01:00:00 | 11.431 |
| 2015-07-10 01:15:00 | 11.334 |
| 2015-07-10 01:30:00 | 11.334 |
| 2015-07-10 01:45:00 | 11.334 |
| 2015-07-10 02:00:00 | 11.334 |
| 2015-07-10 02:15:00 | 11.334 |
| 2015-07-10 02:30:00 | 11.334 |
| 2015-07-10 02:45:00 | 11.236 |
| 2015-07-10 03:00:00 | 11.236 |
| 2015-07-10 03:15:00 | 11.236 |
| 2015-07-10 03:30:00 | 11.236 |
| 2015-07-10 03:45:00 | 11.236 |
| 2015-07-10 04:00:00 | 11.236 |
| 2015-07-10 04:15:00 | 11.236 |
| 2015-07-10 04:30:00 | 11.236 |
| 2015-07-10 04:45:00 | 11.139 |
| 2015-07-10 05:00:00 | 11.139 |
| 2015-07-10 05:15:00 | 11.139 |
| 2015-07-10 05:30:00 | 11.139 |
| 2015-07-10 05:45:00 | 11.139 |
| 2015-07-10 06:00:00 | 11.139 |
| 2015-07-10 06:15:00 | 11.139 |
| 2015-07-10 06:30:00 | 11.139 |
| 2015-07-10 06:45:00 | 11.139 |
| 2015-07-10 07:00:00 | 11.139 |
| 2015-07-10 07:15:00 | 11.139 |
| 2015-07-10 07:30:00 | 11.236 |
| 2015-07-10 07:45:00 | 11.236 |
| 2015-07-10 08:00:00 | 11.236 |
| 2015-07-10 08:15:00 | 11.236 |
| 2015-07-10 08:30:00 | 11.236 |
| 2015-07-10 08:45:00 | 11.334 |
| 2015-07-10 09:00:00 | 11.334 |
| 2015-07-10 09:15:00 | 11.334 |
| 2015-07-10 09:30:00 | 11.334 |
| 2015-07-10 09:45:00 | 11.334 |
| 2015-07-10 10:00:00 | 11.431 |
| 2015-07-10 10:15:00 | 11.431 |
| 2015-07-10 10:30:00 | 11.528 |
| 2015-07-10 10:45:00 | 11.528 |
| 2015-07-10 11:00:00 | 11.528 |
| 2015-07-10 11:15:00 | 11.528 |
| 2015-07-10 11:30:00 | 11.625 |
| 2015-07-10 11:45:00 | 11.625 |
| 2015-07-10 12:00:00 | 11.625 |
| 2015-07-10 12:15:00 | 11.722 |
| 2015-07-10 12:30:00 | 11.722 |
| 2015-07-10 12:45:00 | 11.819 |
| 2015-07-10 13:00:00 | 11.916 |
| 2015-07-10 13:15:00 | 11.819 |
| 2015-07-10 13:30:00 | 11.916 |
| 2015-07-10 13:45:00 | 11.916 |
| 2015-07-10 14:00:00 | 11.916 |
| 2015-07-10 14:15:00 | 11.916 |
| 2015-07-10 14:30:00 | 11.916 |
| 2015-07-10 14:45:00 | 11.916 |
| 2015-07-10 15:00:00 | 11.916 |
| 2015-07-10 15:15:00 | 11.819 |
| 2015-07-10 15:30:00 | 11.819 |
| 2015-07-10 15:45:00 | 11.819 |
| 2015-07-10 16:00:00 | 11.819 |
| 2015-07-10 16:15:00 | 11.819 |
| 2015-07-10 16:30:00 | 11.819 |
| 2015-07-10 16:45:00 | 11.819 |
| 2015-07-10 17:00:00 | 11.722 |
| 2015-07-10 17:15:00 | 11.722 |
| 2015-07-10 17:30:00 | 11.722 |
| 2015-07-10 17:45:00 | 11.722 |
| 2015-07-10 18:00:00 | 11.722 |
| 2015-07-10 18:15:00 | 11.722 |
| 2015-07-10 18:30:00 | 11.722 |
| 2015-07-10 18:45:00 | 11.625 |
| 2015-07-10 19:00:00 | 11.625 |
| 2015-07-10 19:15:00 | 11.625 |
| 2015-07-10 19:30:00 | 11.625 |
| 2015-07-10 19:45:00 | 11.625 |
| 2015-07-10 20:00:00 | 11.625 |
| 2015-07-10 20:15:00 | 11.625 |
| 2015-07-10 20:30:00 | 11.625 |
| 2015-07-10 20:45:00 | 11.528 |
| 2015-07-10 21:00:00 | 11.528 |
| 2015-07-10 21:15:00 | 11.528 |
| 2015-07-10 21:30:00 | 11.528 |
| 2015-07-10 21:45:00 | 11.528 |
| 2015-07-10 22:00:00 | 11.528 |
| 2015-07-10 22:15:00 | 11.528 |
| 2015-07-10 22:30:00 | 11.528 |
| 2015-07-10 22:45:00 | 11.431 |
| 2015-07-10 23:00:00 | 11.431 |
| 2015-07-10 23:15:00 | 11.431 |
| 2015-07-10 23:30:00 | 11.431 |
| 2015-07-10 23:45:00 | 11.431 |
| 2015-07-11 | 11.431 |
| 2015-07-11 00:15:00 | 11.431 |
| 2015-07-11 00:30:00 | 11.431 |
| 2015-07-11 00:45:00 | 11.431 |
| 2015-07-11 01:00:00 | 11.431 |
| 2015-07-11 01:15:00 | 11.431 |
| 2015-07-11 01:30:00 | 11.334 |
| 2015-07-11 01:45:00 | 11.334 |
| 2015-07-11 02:00:00 | 11.334 |
| 2015-07-11 02:15:00 | 11.334 |
| 2015-07-11 02:30:00 | 11.334 |
| 2015-07-11 02:45:00 | 11.334 |
| 2015-07-11 03:00:00 | 11.334 |
| 2015-07-11 03:15:00 | 11.334 |
| 2015-07-11 03:30:00 | 11.334 |
| 2015-07-11 03:45:00 | 11.334 |
| 2015-07-11 04:00:00 | 11.334 |
| 2015-07-11 04:15:00 | 11.334 |
| 2015-07-11 04:30:00 | 11.236 |
| 2015-07-11 04:45:00 | 11.236 |
| 2015-07-11 05:00:00 | 11.236 |
| 2015-07-11 05:15:00 | 11.236 |
| 2015-07-11 05:30:00 | 11.236 |
| 2015-07-11 05:45:00 | 11.236 |
| 2015-07-11 06:00:00 | 11.236 |
| 2015-07-11 06:15:00 | 11.236 |
| 2015-07-11 06:30:00 | 11.236 |
| 2015-07-11 06:45:00 | 11.236 |
| 2015-07-11 07:00:00 | 11.236 |
| 2015-07-11 07:15:00 | 11.236 |
| 2015-07-11 07:30:00 | 11.236 |
| 2015-07-11 07:45:00 | 11.334 |
| 2015-07-11 08:00:00 | 11.334 |
| 2015-07-11 08:15:00 | 11.334 |
| 2015-07-11 08:30:00 | 11.334 |
| 2015-07-11 08:45:00 | 11.334 |
| 2015-07-11 09:00:00 | 11.334 |
| 2015-07-11 09:15:00 | 11.431 |
| 2015-07-11 09:30:00 | 11.431 |
| 2015-07-11 09:45:00 | 11.431 |
| 2015-07-11 10:00:00 | 11.431 |
| 2015-07-11 10:15:00 | 11.431 |
| 2015-07-11 10:30:00 | 11.431 |
| 2015-07-11 10:45:00 | 11.431 |
| 2015-07-11 11:00:00 | 11.431 |
| 2015-07-11 11:15:00 | 11.431 |
| 2015-07-11 11:30:00 | 11.528 |
| 2015-07-11 11:45:00 | 11.528 |
| 2015-07-11 12:00:00 | 11.528 |
| 2015-07-11 12:15:00 | 11.528 |
| 2015-07-11 12:30:00 | 11.625 |
| 2015-07-11 12:45:00 | 11.625 |
| 2015-07-11 13:00:00 | 11.625 |
| 2015-07-11 13:15:00 | 11.722 |
| 2015-07-11 13:30:00 | 11.722 |
| 2015-07-11 13:45:00 | 11.722 |
| 2015-07-11 14:00:00 | 11.722 |
| 2015-07-11 14:15:00 | 11.722 |
| 2015-07-11 14:30:00 | 11.722 |
| 2015-07-11 14:45:00 | 11.722 |
| 2015-07-11 15:00:00 | 11.722 |
| 2015-07-11 15:15:00 | 11.722 |
| 2015-07-11 15:30:00 | 11.722 |
| 2015-07-11 15:45:00 | 11.722 |
| 2015-07-11 16:00:00 | 11.722 |
| 2015-07-11 16:15:00 | 11.722 |
| 2015-07-11 16:30:00 | 11.722 |
| 2015-07-11 16:45:00 | 11.722 |
| 2015-07-11 17:00:00 | 11.722 |
| 2015-07-11 17:15:00 | 11.625 |
| 2015-07-11 17:30:00 | 11.722 |
| 2015-07-11 17:45:00 | 11.625 |
| 2015-07-11 18:00:00 | 11.625 |
| 2015-07-11 18:15:00 | 11.625 |
| 2015-07-11 18:30:00 | 11.625 |
| 2015-07-11 18:45:00 | 11.625 |
| 2015-07-11 19:00:00 | 11.625 |
| 2015-07-11 19:15:00 | 11.625 |
| 2015-07-11 19:30:00 | 11.625 |
| 2015-07-11 19:45:00 | 11.625 |
| 2015-07-11 20:00:00 | 11.528 |
| 2015-07-11 20:15:00 | 11.528 |
| 2015-07-11 20:30:00 | 11.528 |
| 2015-07-11 20:45:00 | 11.528 |
| 2015-07-11 21:00:00 | 11.528 |
| 2015-07-11 21:15:00 | 11.528 |
| 2015-07-11 21:30:00 | 11.528 |
| 2015-07-11 21:45:00 | 11.528 |
| 2015-07-11 22:00:00 | 11.431 |
| 2015-07-11 22:15:00 | 11.431 |
| 2015-07-11 22:30:00 | 11.431 |
| 2015-07-11 22:45:00 | 11.431 |
| 2015-07-11 23:00:00 | 11.431 |
| 2015-07-11 23:15:00 | 11.431 |
| 2015-07-11 23:30:00 | 11.431 |
| 2015-07-11 23:45:00 | 11.431 |
| 2015-07-12 | 11.431 |
| 2015-07-12 00:15:00 | 11.431 |
| 2015-07-12 00:30:00 | 11.431 |
| 2015-07-12 00:45:00 | 11.431 |
| 2015-07-12 01:00:00 | 11.431 |
| 2015-07-12 01:15:00 | 11.431 |
| 2015-07-12 01:30:00 | 11.431 |
| 2015-07-12 01:45:00 | 11.431 |
| 2015-07-12 02:00:00 | 11.431 |
| 2015-07-12 02:15:00 | 11.431 |
| 2015-07-12 02:30:00 | 11.431 |
| 2015-07-12 02:45:00 | 11.334 |
| 2015-07-12 03:00:00 | 11.334 |
| 2015-07-12 03:15:00 | 11.334 |
| 2015-07-12 03:30:00 | 11.431 |
| 2015-07-12 03:45:00 | 11.431 |
| 2015-07-12 04:00:00 | 11.431 |
| 2015-07-12 04:15:00 | 11.431 |
| 2015-07-12 04:30:00 | 11.334 |
| 2015-07-12 04:45:00 | 11.431 |
| 2015-07-12 05:00:00 | 11.431 |
| 2015-07-12 05:15:00 | 11.431 |
| 2015-07-12 05:30:00 | 11.431 |
| 2015-07-12 05:45:00 | 11.431 |
| 2015-07-12 06:00:00 | 11.431 |
| 2015-07-12 06:15:00 | 11.431 |
| 2015-07-12 06:30:00 | 11.431 |
| 2015-07-12 06:45:00 | 11.431 |
| 2015-07-12 07:00:00 | 11.431 |
| 2015-07-12 07:15:00 | 11.431 |
| 2015-07-12 07:30:00 | 11.431 |
| 2015-07-12 07:45:00 | 11.431 |
| 2015-07-12 08:00:00 | 11.431 |
| 2015-07-12 08:15:00 | 11.431 |
| 2015-07-12 08:30:00 | 11.431 |
| 2015-07-12 08:45:00 | 11.431 |
| 2015-07-12 09:00:00 | 11.431 |
| 2015-07-12 09:15:00 | 11.431 |
| 2015-07-12 09:30:00 | 11.431 |
| 2015-07-12 09:45:00 | 11.431 |
| 2015-07-12 10:00:00 | 11.431 |
| 2015-07-12 10:15:00 | 11.431 |
| 2015-07-12 10:30:00 | 11.431 |
| 2015-07-12 10:45:00 | 11.431 |
| 2015-07-12 11:00:00 | 11.431 |
| 2015-07-12 11:15:00 | 11.431 |
| 2015-07-12 11:30:00 | 11.431 |
| 2015-07-12 11:45:00 | 11.431 |
| 2015-07-12 12:00:00 | 11.528 |
| 2015-07-12 12:15:00 | 11.528 |
| 2015-07-12 12:30:00 | 11.528 |
| 2015-07-12 12:45:00 | 11.528 |
| 2015-07-12 13:00:00 | 11.528 |
| 2015-07-12 13:15:00 | 11.528 |
| 2015-07-12 13:30:00 | 11.528 |
| 2015-07-12 13:45:00 | 11.528 |
| 2015-07-12 14:00:00 | 11.528 |
| 2015-07-12 14:15:00 | 11.528 |
| 2015-07-12 14:30:00 | 11.528 |
| 2015-07-12 14:45:00 | 11.528 |
| 2015-07-12 15:00:00 | 11.528 |
| 2015-07-12 15:15:00 | 11.528 |
| 2015-07-12 15:30:00 | 11.528 |
| 2015-07-12 15:45:00 | 11.528 |
| 2015-07-12 16:00:00 | 11.528 |
| 2015-07-12 16:15:00 | 11.528 |
| 2015-07-12 16:30:00 | 11.528 |
| 2015-07-12 16:45:00 | 11.528 |
| 2015-07-12 17:00:00 | 11.528 |
| 2015-07-12 17:15:00 | 11.528 |
| 2015-07-12 17:30:00 | 11.528 |
| 2015-07-12 17:45:00 | 11.528 |
| 2015-07-12 18:00:00 | 11.528 |
| 2015-07-12 18:15:00 | 11.528 |
| 2015-07-12 18:30:00 | 11.528 |
| 2015-07-12 18:45:00 | 11.528 |
| 2015-07-12 19:00:00 | 11.528 |
| 2015-07-12 19:15:00 | 11.528 |
| 2015-07-12 19:30:00 | 11.528 |
| 2015-07-12 19:45:00 | 11.528 |
| 2015-07-12 20:00:00 | 11.431 |
| 2015-07-12 20:15:00 | 11.431 |
| 2015-07-12 20:30:00 | 11.431 |
| 2015-07-12 20:45:00 | 11.431 |
| 2015-07-12 21:00:00 | 11.431 |
| 2015-07-12 21:15:00 | 11.431 |
| 2015-07-12 21:30:00 | 11.431 |
| 2015-07-12 21:45:00 | 11.431 |
| 2015-07-12 22:00:00 | 11.431 |
| 2015-07-12 22:15:00 | 11.431 |
| 2015-07-12 22:30:00 | 11.431 |
| 2015-07-12 22:45:00 | 11.431 |
| 2015-07-12 23:00:00 | 11.431 |
| 2015-07-12 23:15:00 | 11.431 |
| 2015-07-12 23:30:00 | 11.431 |
| 2015-07-12 23:45:00 | 11.431 |
| 2015-07-13 | 11.431 |
| 2015-07-13 00:15:00 | 11.431 |
| 2015-07-13 00:30:00 | 11.431 |
| 2015-07-13 00:45:00 | 11.431 |
| 2015-07-13 01:00:00 | 11.431 |
| 2015-07-13 01:15:00 | 11.431 |
| 2015-07-13 01:30:00 | 11.431 |
| 2015-07-13 01:45:00 | 11.431 |
| 2015-07-13 02:00:00 | 11.431 |
| 2015-07-13 02:15:00 | 11.431 |
| 2015-07-13 02:30:00 | 11.431 |
| 2015-07-13 02:45:00 | 11.431 |
| 2015-07-13 03:00:00 | 11.431 |
| 2015-07-13 03:15:00 | 11.431 |
| 2015-07-13 03:30:00 | 11.431 |
| 2015-07-13 03:45:00 | 11.431 |
| 2015-07-13 04:00:00 | 11.431 |
| 2015-07-13 04:15:00 | 11.431 |
| 2015-07-13 04:30:00 | 11.431 |
| 2015-07-13 04:45:00 | 11.431 |
| 2015-07-13 05:00:00 | 11.431 |
| 2015-07-13 05:15:00 | 11.431 |
| 2015-07-13 05:30:00 | 11.431 |
| 2015-07-13 05:45:00 | 11.431 |
| 2015-07-13 06:00:00 | 11.431 |
| 2015-07-13 06:15:00 | 11.431 |
| 2015-07-13 06:30:00 | 11.431 |
| 2015-07-13 06:45:00 | 11.431 |
| 2015-07-13 07:00:00 | 11.431 |
| 2015-07-13 07:15:00 | 11.431 |
| 2015-07-13 07:30:00 | 11.431 |
| 2015-07-13 07:45:00 | 11.431 |
| 2015-07-13 08:00:00 | 11.431 |
| 2015-07-13 08:15:00 | 11.431 |
| 2015-07-13 08:30:00 | 11.431 |
| 2015-07-13 08:45:00 | 11.431 |
| 2015-07-13 09:00:00 | 11.431 |
| 2015-07-13 09:15:00 | 11.431 |
| 2015-07-13 09:30:00 | 11.431 |
| 2015-07-13 09:45:00 | 11.431 |
| 2015-07-13 10:00:00 | 11.431 |
| 2015-07-13 10:15:00 | 11.431 |
| 2015-07-13 10:30:00 | 11.431 |
| 2015-07-13 10:45:00 | 11.431 |
| 2015-07-13 11:00:00 | 11.431 |
| 2015-07-13 11:15:00 | 11.528 |
| 2015-07-13 11:30:00 | 11.528 |
| 2015-07-13 11:45:00 | 11.528 |
| 2015-07-13 12:00:00 | 11.528 |
| 2015-07-13 12:15:00 | 11.528 |
| 2015-07-13 12:30:00 | 11.528 |
| 2015-07-13 12:45:00 | 11.528 |
| 2015-07-13 13:00:00 | 11.528 |
| 2015-07-13 13:15:00 | 11.528 |
| 2015-07-13 13:30:00 | 11.528 |
| 2015-07-13 13:45:00 | 11.528 |
| 2015-07-13 14:00:00 | 11.528 |
| 2015-07-13 14:15:00 | 11.528 |
| 2015-07-13 14:30:00 | 11.528 |
| 2015-07-13 14:45:00 | 11.528 |
| 2015-07-13 15:00:00 | 11.528 |
| 2015-07-13 15:15:00 | 11.528 |
| 2015-07-13 15:30:00 | 11.528 |
| 2015-07-13 15:45:00 | 11.528 |
| 2015-07-13 16:00:00 | 11.528 |
| 2015-07-13 16:15:00 | 11.528 |
| 2015-07-13 16:30:00 | 11.528 |
| 2015-07-13 16:45:00 | 11.528 |
| 2015-07-13 17:00:00 | 11.528 |
| 2015-07-13 17:15:00 | 11.528 |
| 2015-07-13 17:30:00 | 11.528 |
| 2015-07-13 17:45:00 | 11.528 |
| 2015-07-13 18:00:00 | 11.528 |
| 2015-07-13 18:15:00 | 11.528 |
| 2015-07-13 18:30:00 | 11.528 |
| 2015-07-13 18:45:00 | 11.528 |
| 2015-07-13 19:00:00 | 11.528 |
| 2015-07-13 19:15:00 | 11.528 |
| 2015-07-13 19:30:00 | 11.528 |
| 2015-07-13 19:45:00 | 11.528 |
| 2015-07-13 20:00:00 | 11.528 |
| 2015-07-13 20:15:00 | 11.528 |
| 2015-07-13 20:30:00 | 11.528 |
| 2015-07-13 20:45:00 | 11.528 |
| 2015-07-13 21:00:00 | 11.528 |
| 2015-07-13 21:15:00 | 11.528 |
| 2015-07-13 21:30:00 | 11.528 |
| 2015-07-13 21:45:00 | 11.528 |
| 2015-07-13 22:00:00 | 11.431 |
| 2015-07-13 22:15:00 | 11.431 |
| 2015-07-13 22:30:00 | 11.431 |
| 2015-07-13 22:45:00 | 11.431 |
| 2015-07-13 23:00:00 | 11.431 |
| 2015-07-13 23:15:00 | 11.431 |
| 2015-07-13 23:30:00 | 11.431 |
| 2015-07-13 23:45:00 | 11.431 |
| 2015-07-14 | 11.431 |
| 2015-07-14 00:15:00 | 11.431 |
| 2015-07-14 00:30:00 | 11.431 |
| 2015-07-14 00:45:00 | 11.431 |
| 2015-07-14 01:00:00 | 11.431 |
| 2015-07-14 01:15:00 | 11.431 |
| 2015-07-14 01:30:00 | 11.431 |
| 2015-07-14 01:45:00 | 11.431 |
| 2015-07-14 02:00:00 | 11.431 |
| 2015-07-14 02:15:00 | 11.431 |
| 2015-07-14 02:30:00 | 11.431 |
| 2015-07-14 02:45:00 | 11.431 |
| 2015-07-14 03:00:00 | 11.431 |
| 2015-07-14 03:15:00 | 11.431 |
| 2015-07-14 03:30:00 | 11.431 |
| 2015-07-14 03:45:00 | 11.431 |
| 2015-07-14 04:00:00 | 11.431 |
| 2015-07-14 04:15:00 | 11.431 |
| 2015-07-14 04:30:00 | 11.431 |
| 2015-07-14 04:45:00 | 11.431 |
| 2015-07-14 05:00:00 | 11.431 |
| 2015-07-14 05:15:00 | 11.431 |
| 2015-07-14 05:30:00 | 11.431 |
| 2015-07-14 05:45:00 | 11.431 |
| 2015-07-14 06:00:00 | 11.431 |
| 2015-07-14 06:15:00 | 11.431 |
| 2015-07-14 06:30:00 | 11.431 |
| 2015-07-14 06:45:00 | 11.431 |
| 2015-07-14 07:00:00 | 11.431 |
| 2015-07-14 07:15:00 | 11.431 |
| 2015-07-14 07:30:00 | 11.431 |
| 2015-07-14 07:45:00 | 11.431 |
| 2015-07-14 08:00:00 | 11.431 |
| 2015-07-14 08:15:00 | 11.431 |
| 2015-07-14 08:30:00 | 11.431 |
| 2015-07-14 08:45:00 | 11.431 |
| 2015-07-14 09:00:00 | 11.431 |
| 2015-07-14 09:15:00 | 11.431 |
| 2015-07-14 09:30:00 | 11.528 |
| 2015-07-14 09:45:00 | 11.431 |
| 2015-07-14 10:00:00 | 11.528 |
| 2015-07-14 10:15:00 | 11.528 |
| 2015-07-14 10:30:00 | 11.528 |
| 2015-07-14 10:45:00 | 11.528 |
| 2015-07-14 11:00:00 | 11.528 |
| 2015-07-14 11:15:00 | 11.528 |
| 2015-07-14 11:30:00 | 11.528 |
| 2015-07-14 11:45:00 | 11.528 |
| 2015-07-14 12:00:00 | 11.528 |
| 2015-07-14 12:15:00 | 11.528 |
| 2015-07-14 12:30:00 | 11.528 |
| 2015-07-14 12:45:00 | 11.528 |
| 2015-07-14 13:00:00 | 11.528 |
| 2015-07-14 13:15:00 | 11.625 |
| 2015-07-14 13:30:00 | 11.625 |
| 2015-07-14 13:45:00 | 11.625 |
| 2015-07-14 14:00:00 | 11.625 |
| 2015-07-14 14:15:00 | 11.625 |
| 2015-07-14 14:30:00 | 11.722 |
| 2015-07-14 14:45:00 | 11.625 |
| 2015-07-14 15:00:00 | 11.625 |
| 2015-07-14 15:15:00 | 11.625 |
| 2015-07-14 15:30:00 | 11.625 |
| 2015-07-14 15:45:00 | 11.625 |
| 2015-07-14 16:00:00 | 11.625 |
| 2015-07-14 16:15:00 | 11.625 |
| 2015-07-14 16:30:00 | 11.625 |
| 2015-07-14 16:45:00 | 11.625 |
| 2015-07-14 17:00:00 | 11.625 |
| 2015-07-14 17:15:00 | 11.625 |
| 2015-07-14 17:30:00 | 11.625 |
| 2015-07-14 17:45:00 | 11.625 |
| 2015-07-14 18:00:00 | 11.625 |
| 2015-07-14 18:15:00 | 11.625 |
| 2015-07-14 18:30:00 | 11.625 |
| 2015-07-14 18:45:00 | 11.528 |
| 2015-07-14 19:00:00 | 11.528 |
| 2015-07-14 19:15:00 | 11.528 |
| 2015-07-14 19:30:00 | 11.528 |
| 2015-07-14 19:45:00 | 11.528 |
| 2015-07-14 20:00:00 | 11.528 |
| 2015-07-14 20:15:00 | 11.528 |
| 2015-07-14 20:30:00 | 11.528 |
| 2015-07-14 20:45:00 | 11.528 |
| 2015-07-14 21:00:00 | 11.528 |
| 2015-07-14 21:15:00 | 11.528 |
| 2015-07-14 21:30:00 | 11.528 |
| 2015-07-14 21:45:00 | 11.528 |
| 2015-07-14 22:00:00 | 11.528 |
| 2015-07-14 22:15:00 | 11.528 |
| 2015-07-14 22:30:00 | 11.528 |
| 2015-07-14 22:45:00 | 11.528 |
| 2015-07-14 23:00:00 | 11.528 |
| 2015-07-14 23:15:00 | 11.528 |
| 2015-07-14 23:30:00 | 11.431 |
| 2015-07-14 23:45:00 | 11.528 |
| 2015-07-15 | 11.528 |
| 2015-07-15 00:15:00 | 11.431 |
| 2015-07-15 00:30:00 | 11.431 |
| 2015-07-15 00:45:00 | 11.431 |
| 2015-07-15 01:00:00 | 11.431 |
| 2015-07-15 01:15:00 | 11.431 |
| 2015-07-15 01:30:00 | 11.431 |
| 2015-07-15 01:45:00 | 11.431 |
| 2015-07-15 02:00:00 | 11.431 |
| 2015-07-15 02:15:00 | 11.431 |
| 2015-07-15 02:30:00 | 11.431 |
| 2015-07-15 02:45:00 | 11.431 |
| 2015-07-15 03:00:00 | 11.431 |
| 2015-07-15 03:15:00 | 11.431 |
| 2015-07-15 03:30:00 | 11.431 |
| 2015-07-15 03:45:00 | 11.431 |
| 2015-07-15 04:00:00 | 11.431 |
| 2015-07-15 04:15:00 | 11.431 |
| 2015-07-15 04:30:00 | 11.431 |
| 2015-07-15 04:45:00 | 11.431 |
| 2015-07-15 05:00:00 | 11.431 |
| 2015-07-15 05:15:00 | 11.431 |
| 2015-07-15 05:30:00 | 11.431 |
| 2015-07-15 05:45:00 | 11.431 |
| 2015-07-15 06:00:00 | 11.431 |
| 2015-07-15 06:15:00 | 11.431 |
| 2015-07-15 06:30:00 | 11.431 |
| 2015-07-15 06:45:00 | 11.431 |
| 2015-07-15 07:00:00 | 11.431 |
| 2015-07-15 07:15:00 | 11.431 |
| 2015-07-15 07:30:00 | 11.431 |
| 2015-07-15 07:45:00 | 11.431 |
| 2015-07-15 08:00:00 | 11.431 |
| 2015-07-15 08:15:00 | 11.431 |
| 2015-07-15 08:30:00 | 11.431 |
| 2015-07-15 08:45:00 | 11.431 |
| 2015-07-15 09:00:00 | 11.528 |
| 2015-07-15 09:15:00 | 11.528 |
| 2015-07-15 09:30:00 | 11.528 |
| 2015-07-15 09:45:00 | 11.528 |
| 2015-07-15 10:00:00 | 11.528 |
| 2015-07-15 10:15:00 | 11.528 |
| 2015-07-15 10:30:00 | 11.528 |
| 2015-07-15 10:45:00 | 11.528 |
| 2015-07-15 11:00:00 | 11.528 |
| 2015-07-15 11:15:00 | 11.528 |
| 2015-07-15 11:30:00 | 11.528 |
| 2015-07-15 11:45:00 | 11.528 |
| 2015-07-15 12:00:00 | 11.528 |
| 2015-07-15 12:15:00 | 11.528 |
| 2015-07-15 12:30:00 | 11.528 |
| 2015-07-15 12:45:00 | 11.528 |
| 2015-07-15 13:00:00 | 11.625 |
| 2015-07-15 13:15:00 | 11.625 |
| 2015-07-15 13:30:00 | 11.625 |
| 2015-07-15 13:45:00 | 11.625 |
| 2015-07-15 14:00:00 | 11.625 |
| 2015-07-15 14:15:00 | 11.625 |
| 2015-07-15 14:30:00 | 11.625 |
| 2015-07-15 14:45:00 | 11.625 |
| 2015-07-15 15:00:00 | 11.625 |
| 2015-07-15 15:15:00 | 11.625 |
| 2015-07-15 15:30:00 | 11.625 |
| 2015-07-15 15:45:00 | 11.625 |
| 2015-07-15 16:00:00 | 11.625 |
| 2015-07-15 16:15:00 | 11.625 |
| 2015-07-15 16:30:00 | 11.625 |
| 2015-07-15 16:45:00 | 11.625 |
| 2015-07-15 17:00:00 | 11.625 |
| 2015-07-15 17:15:00 | 11.625 |
| 2015-07-15 17:30:00 | 11.625 |
| 2015-07-15 17:45:00 | 11.625 |
| 2015-07-15 18:00:00 | 11.625 |
| 2015-07-15 18:15:00 | 11.625 |
| 2015-07-15 18:30:00 | 11.625 |
| 2015-07-15 18:45:00 | 11.528 |
| 2015-07-15 19:00:00 | 11.528 |
| 2015-07-15 19:15:00 | 11.528 |
| 2015-07-15 19:30:00 | 11.528 |
| 2015-07-15 19:45:00 | 11.528 |
| 2015-07-15 20:00:00 | 11.528 |
| 2015-07-15 20:15:00 | 11.528 |
| 2015-07-15 20:30:00 | 11.528 |
| 2015-07-15 20:45:00 | 11.528 |
| 2015-07-15 21:00:00 | 11.528 |
| 2015-07-15 21:15:00 | 11.528 |
| 2015-07-15 21:30:00 | 11.528 |
| 2015-07-15 21:45:00 | 11.528 |
| 2015-07-15 22:00:00 | 11.528 |
| 2015-07-15 22:15:00 | 11.528 |
| 2015-07-15 22:30:00 | 11.431 |
| 2015-07-15 22:45:00 | 11.431 |
| 2015-07-15 23:00:00 | 11.431 |
| 2015-07-15 23:15:00 | 11.431 |
| 2015-07-15 23:30:00 | 11.431 |
| 2015-07-15 23:45:00 | 11.431 |
| 2015-07-16 | 11.431 |
| 2015-07-16 00:15:00 | 11.431 |
| 2015-07-16 00:30:00 | 11.431 |
| 2015-07-16 00:45:00 | 11.431 |
| 2015-07-16 01:00:00 | 11.431 |
| 2015-07-16 01:15:00 | 11.431 |
| 2015-07-16 01:30:00 | 11.431 |
| 2015-07-16 01:45:00 | 11.431 |
| 2015-07-16 02:00:00 | 11.431 |
| 2015-07-16 02:15:00 | 11.431 |
| 2015-07-16 02:30:00 | 11.431 |
| 2015-07-16 02:45:00 | 11.431 |
| 2015-07-16 03:00:00 | 11.431 |
| 2015-07-16 03:15:00 | 11.334 |
| 2015-07-16 03:30:00 | 11.334 |
| 2015-07-16 03:45:00 | 11.334 |
| 2015-07-16 04:00:00 | 11.334 |
| 2015-07-16 04:15:00 | 11.334 |
| 2015-07-16 04:30:00 | 11.334 |
| 2015-07-16 04:45:00 | 11.334 |
| 2015-07-16 05:00:00 | 11.334 |
| 2015-07-16 05:15:00 | 11.334 |
| 2015-07-16 05:30:00 | 11.334 |
| 2015-07-16 05:45:00 | 11.334 |
| 2015-07-16 06:00:00 | 11.334 |
| 2015-07-16 06:15:00 | 11.334 |
| 2015-07-16 06:30:00 | 11.334 |
| 2015-07-16 06:45:00 | 11.334 |
| 2015-07-16 07:00:00 | 11.334 |
| 2015-07-16 07:15:00 | 11.334 |
| 2015-07-16 07:30:00 | 11.334 |
| 2015-07-16 07:45:00 | 11.431 |
| 2015-07-16 08:00:00 | 11.431 |
| 2015-07-16 08:15:00 | 11.431 |
| 2015-07-16 08:30:00 | 11.431 |
| 2015-07-16 08:45:00 | 11.431 |
| 2015-07-16 09:00:00 | 11.431 |
| 2015-07-16 09:15:00 | 11.431 |
| 2015-07-16 09:30:00 | 11.431 |
| 2015-07-16 09:45:00 | 11.431 |
| 2015-07-16 10:00:00 | 11.431 |
| 2015-07-16 10:15:00 | 11.431 |
| 2015-07-16 10:30:00 | 11.431 |
| 2015-07-16 10:45:00 | 11.431 |
| 2015-07-16 11:00:00 | 11.431 |
| 2015-07-16 11:15:00 | 11.528 |
| 2015-07-16 11:30:00 | 11.528 |
| 2015-07-16 11:45:00 | 11.528 |
| 2015-07-16 12:00:00 | 11.528 |
| 2015-07-16 12:15:00 | 11.528 |
| 2015-07-16 12:30:00 | 11.528 |
| 2015-07-16 12:45:00 | 11.528 |
| 2015-07-16 13:00:00 | 11.528 |
| 2015-07-16 13:15:00 | 11.528 |
| 2015-07-16 13:30:00 | 11.528 |
| 2015-07-16 13:45:00 | 11.625 |
| 2015-07-16 14:00:00 | 11.625 |
| 2015-07-16 14:15:00 | 11.722 |
| 2015-07-16 14:30:00 | 11.722 |
| 2015-07-16 14:45:00 | 11.722 |
| 2015-07-16 15:00:00 | 11.722 |
| 2015-07-16 15:15:00 | 11.722 |
| 2015-07-16 15:30:00 | 11.722 |
| 2015-07-16 15:45:00 | 11.625 |
| 2015-07-16 16:00:00 | 11.625 |
| 2015-07-16 16:15:00 | 11.625 |
| 2015-07-16 16:30:00 | 11.625 |
| 2015-07-16 16:45:00 | 11.625 |
| 2015-07-16 17:00:00 | 11.625 |
| 2015-07-16 17:15:00 | 11.625 |
| 2015-07-16 17:30:00 | 11.625 |
| 2015-07-16 17:45:00 | 11.625 |
| 2015-07-16 18:00:00 | 11.625 |
| 2015-07-16 18:15:00 | 11.625 |
| 2015-07-16 18:30:00 | 11.625 |
| 2015-07-16 18:45:00 | 11.625 |
| 2015-07-16 19:00:00 | 11.625 |
| 2015-07-16 19:15:00 | 11.625 |
| 2015-07-16 19:30:00 | 11.625 |
| 2015-07-16 19:45:00 | 11.625 |
| 2015-07-16 20:00:00 | 11.625 |
| 2015-07-16 20:15:00 | 11.625 |
| 2015-07-16 20:30:00 | 11.625 |
| 2015-07-16 20:45:00 | 11.528 |
| 2015-07-16 21:00:00 | 11.528 |
| 2015-07-16 21:15:00 | 11.528 |
| 2015-07-16 21:30:00 | 11.528 |
| 2015-07-16 21:45:00 | 11.625 |
| 2015-07-16 22:00:00 | 11.625 |
| 2015-07-16 22:15:00 | 11.528 |
| 2015-07-16 22:30:00 | 11.528 |
| 2015-07-16 22:45:00 | 11.528 |
| 2015-07-16 23:00:00 | 11.528 |
| 2015-07-16 23:15:00 | 11.528 |
| 2015-07-16 23:30:00 | 11.528 |
| 2015-07-16 23:45:00 | 11.528 |
| 2015-07-17 | 11.528 |
| 2015-07-17 00:15:00 | 11.431 |
| 2015-07-17 00:30:00 | 11.431 |
| 2015-07-17 00:45:00 | 11.431 |
| 2015-07-17 01:00:00 | 11.431 |
| 2015-07-17 01:15:00 | 11.431 |
| 2015-07-17 01:30:00 | 11.431 |
| 2015-07-17 01:45:00 | 11.431 |
| 2015-07-17 02:00:00 | 11.431 |
| 2015-07-17 02:15:00 | 11.431 |
| 2015-07-17 02:30:00 | 11.431 |
| 2015-07-17 02:45:00 | 11.431 |
| 2015-07-17 03:00:00 | 11.431 |
| 2015-07-17 03:15:00 | 11.431 |
| 2015-07-17 03:30:00 | 11.431 |
| 2015-07-17 03:45:00 | 11.431 |
| 2015-07-17 04:00:00 | 11.431 |
| 2015-07-17 04:15:00 | 11.431 |
| 2015-07-17 04:30:00 | 11.431 |
| 2015-07-17 04:45:00 | 11.431 |
| 2015-07-17 05:00:00 | 11.431 |
| 2015-07-17 05:15:00 | 11.431 |
| 2015-07-17 05:30:00 | 11.431 |
| 2015-07-17 05:45:00 | 11.431 |
| 2015-07-17 06:00:00 | 11.431 |
| 2015-07-17 06:15:00 | 11.431 |
| 2015-07-17 06:30:00 | 11.431 |
| 2015-07-17 06:45:00 | 11.431 |
| 2015-07-17 07:00:00 | 11.431 |
| 2015-07-17 07:15:00 | 11.431 |
| 2015-07-17 07:30:00 | 11.431 |
| 2015-07-17 07:45:00 | 11.431 |
| 2015-07-17 08:00:00 | 11.431 |
| 2015-07-17 08:15:00 | 11.431 |
| 2015-07-17 08:30:00 | 11.431 |
| 2015-07-17 08:45:00 | 11.431 |
| 2015-07-17 09:00:00 | 11.431 |
| 2015-07-17 09:15:00 | 11.528 |
| 2015-07-17 09:30:00 | 11.528 |
| 2015-07-17 09:45:00 | 11.528 |
| 2015-07-17 10:00:00 | 11.528 |
| 2015-07-17 10:15:00 | 11.528 |
| 2015-07-17 10:30:00 | 11.528 |
| 2015-07-17 10:45:00 | 11.528 |
| 2015-07-17 11:00:00 | 11.528 |
| 2015-07-17 11:15:00 | 11.625 |
| 2015-07-17 11:30:00 | 11.625 |
| 2015-07-17 11:45:00 | 11.625 |
| 2015-07-17 12:00:00 | 11.625 |
| 2015-07-17 12:15:00 | 11.625 |
| 2015-07-17 12:30:00 | 11.625 |
| 2015-07-17 12:45:00 | 11.722 |
| 2015-07-17 13:00:00 | 11.722 |
| 2015-07-17 13:15:00 | 11.722 |
| 2015-07-17 13:30:00 | 11.722 |
| 2015-07-17 13:45:00 | 11.722 |
| 2015-07-17 14:00:00 | 11.722 |
| 2015-07-17 14:15:00 | 11.722 |
| 2015-07-17 14:30:00 | 11.722 |
| 2015-07-17 14:45:00 | 11.722 |
| 2015-07-17 15:00:00 | 11.722 |
| 2015-07-17 15:15:00 | 11.722 |
| 2015-07-17 15:30:00 | 11.722 |
| 2015-07-17 15:45:00 | 11.722 |
| 2015-07-17 16:00:00 | 11.722 |
| 2015-07-17 16:15:00 | 11.722 |
| 2015-07-17 16:30:00 | 11.722 |
| 2015-07-17 16:45:00 | 11.722 |
| 2015-07-17 17:00:00 | 11.722 |
| 2015-07-17 17:15:00 | 11.722 |
| 2015-07-17 17:30:00 | 11.722 |
| 2015-07-17 17:45:00 | 11.625 |
| 2015-07-17 18:00:00 | 11.625 |
| 2015-07-17 18:15:00 | 11.625 |
| 2015-07-17 18:30:00 | 11.625 |
| 2015-07-17 18:45:00 | 11.625 |
| 2015-07-17 19:00:00 | 11.625 |
| 2015-07-17 19:15:00 | 11.625 |
| 2015-07-17 19:30:00 | 11.625 |
| 2015-07-17 19:45:00 | 11.625 |
| 2015-07-17 20:00:00 | 11.625 |
| 2015-07-17 20:15:00 | 11.528 |
| 2015-07-17 20:30:00 | 11.528 |
| 2015-07-17 20:45:00 | 11.528 |
| 2015-07-17 21:00:00 | 11.528 |
| 2015-07-17 21:15:00 | 11.528 |
| 2015-07-17 21:30:00 | 11.528 |
| 2015-07-17 21:45:00 | 11.528 |
| 2015-07-17 22:00:00 | 11.431 |
| 2015-07-17 22:15:00 | 11.431 |
| 2015-07-17 22:30:00 | 11.431 |
| 2015-07-17 22:45:00 | 11.431 |
| 2015-07-17 23:00:00 | 11.431 |
| 2015-07-17 23:15:00 | 11.431 |
| 2015-07-17 23:30:00 | 11.431 |
| 2015-07-17 23:45:00 | 11.431 |
| 2015-07-18 | 11.431 |
| 2015-07-18 00:15:00 | 11.431 |
| 2015-07-18 00:30:00 | 11.431 |
| 2015-07-18 00:45:00 | 11.431 |
| 2015-07-18 01:00:00 | 11.334 |
| 2015-07-18 01:15:00 | 11.334 |
| 2015-07-18 01:30:00 | 11.334 |
| 2015-07-18 01:45:00 | 11.334 |
| 2015-07-18 02:00:00 | 11.334 |
| 2015-07-18 02:15:00 | 11.334 |
| 2015-07-18 02:30:00 | 11.334 |
| 2015-07-18 02:45:00 | 11.334 |
| 2015-07-18 03:00:00 | 11.334 |
| 2015-07-18 03:15:00 | 11.236 |
| 2015-07-18 03:30:00 | 11.236 |
| 2015-07-18 03:45:00 | 11.236 |
| 2015-07-18 04:00:00 | 11.236 |
| 2015-07-18 04:15:00 | 11.236 |
| 2015-07-18 04:30:00 | 11.236 |
| 2015-07-18 04:45:00 | 11.236 |
| 2015-07-18 05:00:00 | 11.236 |
| 2015-07-18 05:15:00 | 11.236 |
| 2015-07-18 05:30:00 | 11.139 |
| 2015-07-18 05:45:00 | 11.139 |
| 2015-07-18 06:00:00 | 11.139 |
| 2015-07-18 06:15:00 | 11.139 |
| 2015-07-18 06:30:00 | 11.139 |
| 2015-07-18 06:45:00 | 11.139 |
| 2015-07-18 07:00:00 | 11.139 |
| 2015-07-18 07:15:00 | 11.236 |
| 2015-07-18 07:30:00 | 11.236 |
| 2015-07-18 07:45:00 | 11.236 |
| 2015-07-18 08:00:00 | 11.236 |
| 2015-07-18 08:15:00 | 11.236 |
| 2015-07-18 08:30:00 | 11.236 |
| 2015-07-18 08:45:00 | 11.334 |
| 2015-07-18 09:00:00 | 11.334 |
| 2015-07-18 09:15:00 | 11.334 |
| 2015-07-18 09:30:00 | 11.334 |
| 2015-07-18 09:45:00 | 11.334 |
| 2015-07-18 10:00:00 | 11.431 |
| 2015-07-18 10:15:00 | 11.431 |
| 2015-07-18 10:30:00 | 11.431 |
| 2015-07-18 10:45:00 | 11.431 |
| 2015-07-18 11:00:00 | 11.431 |
| 2015-07-18 11:15:00 | 11.528 |
| 2015-07-18 11:30:00 | 11.528 |
| 2015-07-18 11:45:00 | 11.528 |
| 2015-07-18 12:00:00 | 11.528 |
| 2015-07-18 12:15:00 | 11.528 |
| 2015-07-18 12:30:00 | 11.625 |
| 2015-07-18 12:45:00 | 11.625 |
| 2015-07-18 13:00:00 | 11.625 |
| 2015-07-18 13:15:00 | 11.625 |
| 2015-07-18 13:30:00 | 11.722 |
| 2015-07-18 13:45:00 | 11.722 |
| 2015-07-18 14:00:00 | 11.625 |
| 2015-07-18 14:15:00 | 11.625 |
| 2015-07-18 14:30:00 | 11.722 |
| 2015-07-18 14:45:00 | 11.722 |
| 2015-07-18 15:00:00 | 11.722 |
| 2015-07-18 15:15:00 | 11.722 |
| 2015-07-18 15:30:00 | 11.722 |
| 2015-07-18 15:45:00 | 11.722 |
| 2015-07-18 16:00:00 | 11.722 |
| 2015-07-18 16:15:00 | 11.722 |
| 2015-07-18 16:30:00 | 11.625 |
| 2015-07-18 16:45:00 | 11.625 |
| 2015-07-18 17:00:00 | 11.625 |
| 2015-07-18 17:15:00 | 11.625 |
| 2015-07-18 17:30:00 | 11.625 |
| 2015-07-18 17:45:00 | 11.625 |
| 2015-07-18 18:00:00 | 11.625 |
| 2015-07-18 18:15:00 | 11.625 |
| 2015-07-18 18:30:00 | 11.528 |
| 2015-07-18 18:45:00 | 11.625 |
| 2015-07-18 19:00:00 | 11.528 |
| 2015-07-18 19:15:00 | 11.528 |
| 2015-07-18 19:30:00 | 11.528 |
| 2015-07-18 19:45:00 | 11.528 |
| 2015-07-18 20:00:00 | 11.528 |
| 2015-07-18 20:15:00 | 11.528 |
| 2015-07-18 20:30:00 | 11.528 |
| 2015-07-18 20:45:00 | 11.528 |
| 2015-07-18 21:00:00 | 11.528 |
| 2015-07-18 21:15:00 | 11.528 |
| 2015-07-18 21:30:00 | 11.528 |
| 2015-07-18 21:45:00 | 11.431 |
| 2015-07-18 22:00:00 | 11.431 |
| 2015-07-18 22:15:00 | 11.431 |
| 2015-07-18 22:30:00 | 11.431 |
| 2015-07-18 22:45:00 | 11.431 |
| 2015-07-18 23:00:00 | 11.431 |
| 2015-07-18 23:15:00 | 11.431 |
| 2015-07-18 23:30:00 | 11.431 |
| 2015-07-18 23:45:00 | 11.431 |
| 2015-07-19 | 11.431 |
| 2015-07-19 00:15:00 | 11.431 |
| 2015-07-19 00:30:00 | 11.431 |
| 2015-07-19 00:45:00 | 11.431 |
| 2015-07-19 01:00:00 | 11.431 |
| 2015-07-19 01:15:00 | 11.431 |
| 2015-07-19 01:30:00 | 11.431 |
| 2015-07-19 01:45:00 | 11.431 |
| 2015-07-19 02:00:00 | 11.431 |
| 2015-07-19 02:15:00 | 11.431 |
| 2015-07-19 02:30:00 | 11.334 |
| 2015-07-19 02:45:00 | 11.334 |
| 2015-07-19 03:00:00 | 11.334 |
| 2015-07-19 03:15:00 | 11.431 |
| 2015-07-19 03:30:00 | 11.334 |
| 2015-07-19 03:45:00 | 11.334 |
| 2015-07-19 04:00:00 | 11.334 |
| 2015-07-19 04:15:00 | 11.334 |
| 2015-07-19 04:30:00 | 11.334 |
| 2015-07-19 04:45:00 | 11.334 |
| 2015-07-19 05:00:00 | 11.334 |
| 2015-07-19 05:15:00 | 11.334 |
| 2015-07-19 05:30:00 | 11.334 |
| 2015-07-19 05:45:00 | 11.334 |
| 2015-07-19 06:00:00 | 11.334 |
| 2015-07-19 06:15:00 | 11.334 |
| 2015-07-19 06:30:00 | 11.334 |
| 2015-07-19 06:45:00 | 11.334 |
| 2015-07-19 07:00:00 | 11.334 |
| 2015-07-19 07:15:00 | 11.334 |
| 2015-07-19 07:30:00 | 11.431 |
| 2015-07-19 07:45:00 | 11.431 |
| 2015-07-19 08:00:00 | 11.431 |
| 2015-07-19 08:15:00 | 11.334 |
| 2015-07-19 08:30:00 | 11.431 |
| 2015-07-19 08:45:00 | 11.431 |
| 2015-07-19 09:00:00 | 11.431 |
| 2015-07-19 09:15:00 | 11.431 |
| 2015-07-19 09:30:00 | 11.431 |
| 2015-07-19 09:45:00 | 11.431 |
| 2015-07-19 10:00:00 | 11.431 |
| 2015-07-19 10:15:00 | 11.431 |
| 2015-07-19 10:30:00 | 11.528 |
| 2015-07-19 10:45:00 | 11.528 |
| 2015-07-19 11:00:00 | 11.528 |
| 2015-07-19 11:15:00 | 11.528 |
| 2015-07-19 11:30:00 | 11.528 |
| 2015-07-19 11:45:00 | 11.625 |
| 2015-07-19 12:00:00 | 11.625 |
| 2015-07-19 12:15:00 | 11.625 |
| 2015-07-19 12:30:00 | 11.625 |
| 2015-07-19 12:45:00 | 11.625 |
| 2015-07-19 13:00:00 | 11.722 |
| 2015-07-19 13:15:00 | 11.722 |
| 2015-07-19 13:30:00 | 11.722 |
| 2015-07-19 13:45:00 | 11.722 |
| 2015-07-19 14:00:00 | 11.722 |
| 2015-07-19 14:15:00 | 11.722 |
| 2015-07-19 14:30:00 | 11.722 |
| 2015-07-19 14:45:00 | 11.722 |
| 2015-07-19 15:00:00 | 11.722 |
| 2015-07-19 15:15:00 | 11.722 |
| 2015-07-19 15:30:00 | 11.722 |
| 2015-07-19 15:45:00 | 11.722 |
| 2015-07-19 16:00:00 | 11.722 |
| 2015-07-19 16:15:00 | 11.722 |
| 2015-07-19 16:30:00 | 11.722 |
| 2015-07-19 16:45:00 | 11.722 |
| 2015-07-19 17:00:00 | 11.722 |
| 2015-07-19 17:15:00 | 11.722 |
| 2015-07-19 17:30:00 | 11.722 |
| 2015-07-19 17:45:00 | 11.722 |
| 2015-07-19 18:00:00 | 11.722 |
| 2015-07-19 18:15:00 | 11.625 |
| 2015-07-19 18:30:00 | 11.625 |
| 2015-07-19 18:45:00 | 11.625 |
| 2015-07-19 19:00:00 | 11.625 |
| 2015-07-19 19:15:00 | 11.625 |
| 2015-07-19 19:30:00 | 11.625 |
| 2015-07-19 19:45:00 | 11.625 |
| 2015-07-19 20:00:00 | 11.625 |
| 2015-07-19 20:15:00 | 11.625 |
| 2015-07-19 20:30:00 | 11.625 |
| 2015-07-19 20:45:00 | 11.625 |
| 2015-07-19 21:00:00 | 11.528 |
| 2015-07-19 21:15:00 | 11.528 |
| 2015-07-19 21:30:00 | 11.528 |
| 2015-07-19 21:45:00 | 11.528 |
| 2015-07-19 22:00:00 | 11.528 |
| 2015-07-19 22:15:00 | 11.625 |
| 2015-07-19 22:30:00 | 11.528 |
| 2015-07-19 22:45:00 | 11.528 |
| 2015-07-19 23:00:00 | 11.528 |
| 2015-07-19 23:15:00 | 11.528 |
| 2015-07-19 23:30:00 | 11.431 |
| 2015-07-19 23:45:00 | 11.431 |
| 2015-07-20 | 11.431 |
| 2015-07-20 00:15:00 | 11.431 |
| 2015-07-20 00:30:00 | 11.431 |
| 2015-07-20 00:45:00 | 11.431 |
| 2015-07-20 01:00:00 | 11.431 |
| 2015-07-20 01:15:00 | 11.431 |
| 2015-07-20 01:30:00 | 11.431 |
| 2015-07-20 01:45:00 | 11.431 |
| 2015-07-20 02:00:00 | 11.431 |
| 2015-07-20 02:15:00 | 11.431 |
| 2015-07-20 02:30:00 | 11.431 |
| 2015-07-20 02:45:00 | 11.431 |
| 2015-07-20 03:00:00 | 11.431 |
| 2015-07-20 03:15:00 | 11.431 |
| 2015-07-20 03:30:00 | 11.431 |
| 2015-07-20 03:45:00 | 11.431 |
| 2015-07-20 04:00:00 | 11.431 |
| 2015-07-20 04:15:00 | 11.431 |
| 2015-07-20 04:30:00 | 11.431 |
| 2015-07-20 04:45:00 | 11.431 |
| 2015-07-20 05:00:00 | 11.431 |
| 2015-07-20 05:15:00 | 11.431 |
| 2015-07-20 05:30:00 | 11.431 |
| 2015-07-20 05:45:00 | 11.431 |
| 2015-07-20 06:00:00 | 11.431 |
| 2015-07-20 06:15:00 | 11.431 |
| 2015-07-20 06:30:00 | 11.431 |
| 2015-07-20 06:45:00 | 11.431 |
| 2015-07-20 07:00:00 | 11.431 |
| 2015-07-20 07:15:00 | 11.431 |
| 2015-07-20 07:30:00 | 11.431 |
| 2015-07-20 07:45:00 | 11.431 |
| 2015-07-20 08:00:00 | 11.431 |
| 2015-07-20 08:15:00 | 11.431 |
| 2015-07-20 08:30:00 | 11.431 |
| 2015-07-20 08:45:00 | 11.431 |
| 2015-07-20 09:00:00 | 11.431 |
| 2015-07-20 09:15:00 | 11.431 |
| 2015-07-20 09:30:00 | 11.431 |
| 2015-07-20 09:45:00 | 11.431 |
| 2015-07-20 10:00:00 | 11.528 |
| 2015-07-20 10:15:00 | 11.528 |
| 2015-07-20 10:30:00 | 11.528 |
| 2015-07-20 10:45:00 | 11.528 |
| 2015-07-20 11:00:00 | 11.528 |
| 2015-07-20 11:15:00 | 11.528 |
| 2015-07-20 11:30:00 | 11.528 |
| 2015-07-20 11:45:00 | 11.528 |
| 2015-07-20 12:00:00 | 11.528 |
| 2015-07-20 12:15:00 | 11.528 |
| 2015-07-20 12:30:00 | 11.528 |
| 2015-07-20 12:45:00 | 11.528 |
| 2015-07-20 13:00:00 | 11.528 |
| 2015-07-20 13:15:00 | 11.528 |
| 2015-07-20 13:30:00 | 11.528 |
| 2015-07-20 13:45:00 | 11.625 |
| 2015-07-20 14:00:00 | 11.528 |
| 2015-07-20 14:15:00 | 11.625 |
| 2015-07-20 14:30:00 | 11.625 |
| 2015-07-20 14:45:00 | 11.625 |
| 2015-07-20 15:00:00 | 11.625 |
| 2015-07-20 15:15:00 | 11.625 |
| 2015-07-20 15:30:00 | 11.625 |
| 2015-07-20 15:45:00 | 11.625 |
| 2015-07-20 16:00:00 | 11.625 |
| 2015-07-20 16:15:00 | 11.625 |
| 2015-07-20 16:30:00 | 11.625 |
| 2015-07-20 16:45:00 | 11.625 |
| 2015-07-20 17:00:00 | 11.625 |
| 2015-07-20 17:15:00 | 11.625 |
| 2015-07-20 17:30:00 | 11.625 |
| 2015-07-20 17:45:00 | 11.625 |
| 2015-07-20 18:00:00 | 11.625 |
| 2015-07-20 18:15:00 | 11.625 |
| 2015-07-20 18:30:00 | 11.625 |
| 2015-07-20 18:45:00 | 11.625 |
| 2015-07-20 19:00:00 | 11.625 |
| 2015-07-20 19:15:00 | 11.625 |
| 2015-07-20 19:30:00 | 11.625 |
| 2015-07-20 19:45:00 | 11.625 |
| 2015-07-20 20:00:00 | 11.625 |
| 2015-07-20 20:15:00 | 11.528 |
| 2015-07-20 20:30:00 | 11.528 |
| 2015-07-20 20:45:00 | 11.528 |
| 2015-07-20 21:00:00 | 11.528 |
| 2015-07-20 21:15:00 | 11.528 |
| 2015-07-20 21:30:00 | 11.528 |
| 2015-07-20 21:45:00 | 11.528 |
| 2015-07-20 22:00:00 | 11.528 |
| 2015-07-20 22:15:00 | 11.528 |
| 2015-07-20 22:30:00 | 11.528 |
| 2015-07-20 22:45:00 | 11.528 |
| 2015-07-20 23:00:00 | 11.528 |
| 2015-07-20 23:15:00 | 11.528 |
| 2015-07-20 23:30:00 | 11.431 |
| 2015-07-20 23:45:00 | 11.431 |
| 2015-07-21 | 11.431 |
| 2015-07-21 00:15:00 | 11.431 |
| 2015-07-21 00:30:00 | 11.431 |
| 2015-07-21 00:45:00 | 11.431 |
| 2015-07-21 01:00:00 | 11.431 |
| 2015-07-21 01:15:00 | 11.431 |
| 2015-07-21 01:30:00 | 11.431 |
| 2015-07-21 01:45:00 | 11.431 |
| 2015-07-21 02:00:00 | 11.431 |
| 2015-07-21 02:15:00 | 11.334 |
| 2015-07-21 02:30:00 | 11.334 |
| 2015-07-21 02:45:00 | 11.334 |
| 2015-07-21 03:00:00 | 11.334 |
| 2015-07-21 03:15:00 | 11.334 |
| 2015-07-21 03:30:00 | 11.334 |
| 2015-07-21 03:45:00 | 11.334 |
| 2015-07-21 04:00:00 | 11.334 |
| 2015-07-21 04:15:00 | 11.236 |
| 2015-07-21 04:30:00 | 11.236 |
| 2015-07-21 04:45:00 | 11.236 |
| 2015-07-21 05:00:00 | 11.236 |
| 2015-07-21 05:15:00 | 11.236 |
| 2015-07-21 05:30:00 | 11.236 |
| 2015-07-21 05:45:00 | 11.236 |
| 2015-07-21 06:00:00 | 11.236 |
| 2015-07-21 06:15:00 | 11.236 |
| 2015-07-21 06:30:00 | 11.236 |
| 2015-07-21 06:45:00 | 11.236 |
| 2015-07-21 07:00:00 | 11.236 |
| 2015-07-21 07:15:00 | 11.334 |
| 2015-07-21 07:30:00 | 11.334 |
| 2015-07-21 07:45:00 | 11.334 |
| 2015-07-21 08:00:00 | 11.334 |
| 2015-07-21 08:15:00 | 11.334 |
| 2015-07-21 08:30:00 | 11.334 |
| 2015-07-21 08:45:00 | 11.431 |
| 2015-07-21 09:00:00 | 11.431 |
| 2015-07-21 09:15:00 | 11.431 |
| 2015-07-21 09:30:00 | 11.431 |
| 2015-07-21 09:45:00 | 11.431 |
| 2015-07-21 10:00:00 | 11.431 |
| 2015-07-21 10:15:00 | 11.431 |
| 2015-07-21 10:30:00 | 11.528 |
| 2015-07-21 10:45:00 | 11.528 |
| 2015-07-21 11:00:00 | 11.528 |
| 2015-07-21 11:15:00 | 11.528 |
| 2015-07-21 11:30:00 | 11.528 |
| 2015-07-21 11:45:00 | 11.625 |
| 2015-07-21 12:00:00 | 11.625 |
| 2015-07-21 12:15:00 | 11.625 |
| 2015-07-21 12:30:00 | 11.625 |
| 2015-07-21 12:45:00 | 11.722 |
| 2015-07-21 13:00:00 | 11.722 |
| 2015-07-21 13:15:00 | 11.722 |
| 2015-07-21 13:30:00 | 11.722 |
| 2015-07-21 13:45:00 | 11.722 |
| 2015-07-21 14:00:00 | 11.722 |
| 2015-07-21 14:15:00 | 11.819 |
| 2015-07-21 14:30:00 | 11.819 |
| 2015-07-21 14:45:00 | 11.819 |
| 2015-07-21 15:00:00 | 11.819 |
| 2015-07-21 15:15:00 | 11.819 |
| 2015-07-21 15:30:00 | 11.819 |
| 2015-07-21 15:45:00 | 11.819 |
| 2015-07-21 16:00:00 | 11.819 |
| 2015-07-21 16:15:00 | 11.819 |
| 2015-07-21 16:30:00 | 11.819 |
| 2015-07-21 16:45:00 | 11.819 |
| 2015-07-21 17:00:00 | 11.819 |
| 2015-07-21 17:15:00 | 11.819 |
| 2015-07-21 17:30:00 | 11.722 |
| 2015-07-21 17:45:00 | 11.722 |
| 2015-07-21 18:00:00 | 11.722 |
| 2015-07-21 18:15:00 | 11.722 |
| 2015-07-21 18:30:00 | 11.722 |
| 2015-07-21 18:45:00 | 11.722 |
| 2015-07-21 19:00:00 | 11.722 |
| 2015-07-21 19:15:00 | 11.625 |
| 2015-07-21 19:30:00 | 11.625 |
| 2015-07-21 19:45:00 | 11.625 |
| 2015-07-21 20:00:00 | 11.625 |
| 2015-07-21 20:15:00 | 11.625 |
| 2015-07-21 20:30:00 | 11.625 |
| 2015-07-21 20:45:00 | 11.625 |
| 2015-07-21 21:00:00 | 11.625 |
| 2015-07-21 21:15:00 | 11.528 |
| 2015-07-21 21:30:00 | 11.528 |
| 2015-07-21 21:45:00 | 11.528 |
| 2015-07-21 22:00:00 | 11.528 |
| 2015-07-21 22:15:00 | 11.528 |
| 2015-07-21 22:30:00 | 11.528 |
| 2015-07-21 22:45:00 | 11.528 |
| 2015-07-21 23:00:00 | 11.528 |
| 2015-07-21 23:15:00 | 11.431 |
| 2015-07-21 23:30:00 | 11.431 |
| 2015-07-21 23:45:00 | 11.431 |
| 2015-07-22 | 11.431 |
| 2015-07-22 00:15:00 | 11.431 |
| 2015-07-22 00:30:00 | 11.431 |
| 2015-07-22 00:45:00 | 11.431 |
| 2015-07-22 01:00:00 | 11.431 |
| 2015-07-22 01:15:00 | 11.431 |
| 2015-07-22 01:30:00 | 11.431 |
| 2015-07-22 01:45:00 | 11.431 |
| 2015-07-22 02:00:00 | 11.431 |
| 2015-07-22 02:15:00 | 11.431 |
| 2015-07-22 02:30:00 | 11.334 |
| 2015-07-22 02:45:00 | 11.334 |
| 2015-07-22 03:00:00 | 11.334 |
| 2015-07-22 03:15:00 | 11.334 |
| 2015-07-22 03:30:00 | 11.334 |
| 2015-07-22 03:45:00 | 11.334 |
| 2015-07-22 04:00:00 | 11.334 |
| 2015-07-22 04:15:00 | 11.334 |
| 2015-07-22 04:30:00 | 11.334 |
| 2015-07-22 04:45:00 | 11.334 |
| 2015-07-22 05:00:00 | 11.334 |
| 2015-07-22 05:15:00 | 11.334 |
| 2015-07-22 05:30:00 | 11.334 |
| 2015-07-22 05:45:00 | 11.334 |
| 2015-07-22 06:00:00 | 11.334 |
| 2015-07-22 06:15:00 | 11.334 |
| 2015-07-22 06:30:00 | 11.334 |
| 2015-07-22 06:45:00 | 11.334 |
| 2015-07-22 07:00:00 | 11.334 |
| 2015-07-22 07:15:00 | 11.334 |
| 2015-07-22 07:30:00 | 11.334 |
| 2015-07-22 07:45:00 | 11.334 |
| 2015-07-22 08:00:00 | 11.334 |
| 2015-07-22 08:15:00 | 11.431 |
| 2015-07-22 08:30:00 | 11.431 |
| 2015-07-22 08:45:00 | 11.431 |
| 2015-07-22 09:00:00 | 11.431 |
| 2015-07-22 09:15:00 | 11.431 |
| 2015-07-22 09:30:00 | 11.431 |
| 2015-07-22 09:45:00 | 11.528 |
| 2015-07-22 10:00:00 | 11.431 |
| 2015-07-22 10:15:00 | 11.528 |
| 2015-07-22 10:30:00 | 11.528 |
| 2015-07-22 10:45:00 | 11.528 |
| 2015-07-22 11:00:00 | 11.528 |
| 2015-07-22 11:15:00 | 11.528 |
| 2015-07-22 11:30:00 | 11.528 |
| 2015-07-22 11:45:00 | 11.528 |
| 2015-07-22 12:00:00 | 11.528 |
| 2015-07-22 12:15:00 | 11.528 |
| 2015-07-22 12:30:00 | 11.528 |
| 2015-07-22 12:45:00 | 11.625 |
| 2015-07-22 13:00:00 | 11.625 |
| 2015-07-22 13:15:00 | 11.625 |
| 2015-07-22 13:30:00 | 11.528 |
| 2015-07-22 13:45:00 | 11.528 |
| 2015-07-22 14:00:00 | 11.625 |
| 2015-07-22 14:15:00 | 11.625 |
| 2015-07-22 14:30:00 | 11.625 |
| 2015-07-22 14:45:00 | 11.625 |
| 2015-07-22 15:00:00 | 11.625 |
| 2015-07-22 15:15:00 | 11.625 |
| 2015-07-22 15:30:00 | 11.625 |
| 2015-07-22 15:45:00 | 11.625 |
| 2015-07-22 16:00:00 | 11.625 |
| 2015-07-22 16:15:00 | 11.625 |
| 2015-07-22 16:30:00 | 11.625 |
| 2015-07-22 16:45:00 | 11.625 |
| 2015-07-22 17:00:00 | 11.528 |
| 2015-07-22 17:15:00 | 11.528 |
| 2015-07-22 17:30:00 | 11.528 |
| 2015-07-22 17:45:00 | 11.528 |
| 2015-07-22 18:00:00 | 11.528 |
| 2015-07-22 18:15:00 | 11.528 |
| 2015-07-22 18:30:00 | 11.528 |
| 2015-07-22 18:45:00 | 11.528 |
| 2015-07-22 19:00:00 | 11.528 |
| 2015-07-22 19:15:00 | 11.528 |
| 2015-07-22 19:30:00 | 11.528 |
| 2015-07-22 19:45:00 | 11.528 |
| 2015-07-22 20:00:00 | 11.528 |
| 2015-07-22 20:15:00 | 11.528 |
| 2015-07-22 20:30:00 | 11.528 |
| 2015-07-22 20:45:00 | 11.528 |
| 2015-07-22 21:00:00 | 11.528 |
| 2015-07-22 21:15:00 | 11.528 |
| 2015-07-22 21:30:00 | 11.528 |
| 2015-07-22 21:45:00 | 11.431 |
| 2015-07-22 22:00:00 | 11.431 |
| 2015-07-22 22:15:00 | 11.431 |
| 2015-07-22 22:30:00 | 11.431 |
| 2015-07-22 22:45:00 | 11.431 |
| 2015-07-22 23:00:00 | 11.334 |
| 2015-07-22 23:15:00 | 11.334 |
| 2015-07-22 23:30:00 | 11.334 |
| 2015-07-22 23:45:00 | 11.334 |
| 2015-07-23 | 11.334 |
| 2015-07-23 00:15:00 | 11.334 |
| 2015-07-23 00:30:00 | 11.334 |
| 2015-07-23 00:45:00 | 11.334 |
| 2015-07-23 01:00:00 | 11.334 |
| 2015-07-23 01:15:00 | 11.236 |
| 2015-07-23 01:30:00 | 11.236 |
| 2015-07-23 01:45:00 | 11.236 |
| 2015-07-23 02:00:00 | 11.236 |
| 2015-07-23 02:15:00 | 11.236 |
| 2015-07-23 02:30:00 | 11.236 |
| 2015-07-23 02:45:00 | 11.236 |
| 2015-07-23 03:00:00 | 11.236 |
| 2015-07-23 03:15:00 | 11.236 |
| 2015-07-23 03:30:00 | 11.236 |
| 2015-07-23 03:45:00 | 11.236 |
| 2015-07-23 04:00:00 | 11.236 |
| 2015-07-23 04:15:00 | 11.139 |
| 2015-07-23 04:30:00 | 11.139 |
| 2015-07-23 04:45:00 | 11.139 |
| 2015-07-23 05:00:00 | 11.139 |
| 2015-07-23 05:15:00 | 11.139 |
| 2015-07-23 05:30:00 | 11.139 |
| 2015-07-23 05:45:00 | 11.139 |
| 2015-07-23 06:00:00 | 11.139 |
| 2015-07-23 06:15:00 | 11.139 |
| 2015-07-23 06:30:00 | 11.139 |
| 2015-07-23 06:45:00 | 11.139 |
| 2015-07-23 07:00:00 | 11.236 |
| 2015-07-23 07:15:00 | 11.236 |
| 2015-07-23 07:30:00 | 11.236 |
| 2015-07-23 07:45:00 | 11.236 |
| 2015-07-23 08:00:00 | 11.236 |
| 2015-07-23 08:15:00 | 11.334 |
| 2015-07-23 08:30:00 | 11.334 |
| 2015-07-23 08:45:00 | 11.334 |
| 2015-07-23 09:00:00 | 11.334 |
| 2015-07-23 09:15:00 | 11.334 |
| 2015-07-23 09:30:00 | 11.334 |
| 2015-07-23 09:45:00 | 11.431 |
| 2015-07-23 10:00:00 | 11.431 |
| 2015-07-23 10:15:00 | 11.431 |
| 2015-07-23 10:30:00 | 11.431 |
| 2015-07-23 10:45:00 | 11.431 |
| 2015-07-23 11:00:00 | 11.528 |
| 2015-07-23 11:15:00 | 11.528 |
| 2015-07-23 11:30:00 | 11.528 |
| 2015-07-23 11:45:00 | 11.528 |
| 2015-07-23 12:00:00 | 11.528 |
| 2015-07-23 12:15:00 | 11.528 |
| 2015-07-23 12:30:00 | 11.528 |
| 2015-07-23 12:45:00 | 11.625 |
| 2015-07-23 13:00:00 | 11.528 |
| 2015-07-23 13:15:00 | 11.625 |
| 2015-07-23 13:30:00 | 11.625 |
| 2015-07-23 13:45:00 | 11.625 |
| 2015-07-23 14:00:00 | 11.625 |
| 2015-07-23 14:15:00 | 11.625 |
| 2015-07-23 14:30:00 | 11.722 |
| 2015-07-23 14:45:00 | 11.722 |
| 2015-07-23 15:00:00 | 11.722 |
| 2015-07-23 15:15:00 | 11.722 |
| 2015-07-23 15:30:00 | 11.625 |
| 2015-07-23 15:45:00 | 11.625 |
| 2015-07-23 16:00:00 | 11.625 |
| 2015-07-23 16:15:00 | 11.625 |
| 2015-07-23 16:30:00 | 11.625 |
| 2015-07-23 16:45:00 | 11.625 |
| 2015-07-23 17:00:00 | 11.625 |
| 2015-07-23 17:15:00 | 11.625 |
| 2015-07-23 17:30:00 | 11.625 |
| 2015-07-23 17:45:00 | 11.625 |
| 2015-07-23 18:00:00 | 11.625 |
| 2015-07-23 18:15:00 | 11.625 |
| 2015-07-23 18:30:00 | 11.625 |
| 2015-07-23 18:45:00 | 11.625 |
| 2015-07-23 19:00:00 | 11.625 |
| 2015-07-23 19:15:00 | 11.625 |
| 2015-07-23 19:30:00 | 11.625 |
| 2015-07-23 19:45:00 | 11.528 |
| 2015-07-23 20:00:00 | 11.528 |
| 2015-07-23 20:15:00 | 11.528 |
| 2015-07-23 20:30:00 | 11.528 |
| 2015-07-23 20:45:00 | 11.528 |
| 2015-07-23 21:00:00 | 11.528 |
| 2015-07-23 21:15:00 | 11.528 |
| 2015-07-23 21:30:00 | 11.528 |
| 2015-07-23 21:45:00 | 11.528 |
| 2015-07-23 22:00:00 | 11.528 |
| 2015-07-23 22:15:00 | 11.431 |
| 2015-07-23 22:30:00 | 11.431 |
| 2015-07-23 22:45:00 | 11.431 |
| 2015-07-23 23:00:00 | 11.431 |
| 2015-07-23 23:15:00 | 11.431 |
| 2015-07-23 23:30:00 | 11.431 |
| 2015-07-23 23:45:00 | 11.431 |
| 2015-07-24 | 11.431 |
| 2015-07-24 00:15:00 | 11.431 |
| 2015-07-24 00:30:00 | 11.431 |
| 2015-07-24 00:45:00 | 11.431 |
| 2015-07-24 01:00:00 | 11.431 |
| 2015-07-24 01:15:00 | 11.431 |
| 2015-07-24 01:30:00 | 11.431 |
| 2015-07-24 01:45:00 | 11.431 |
| 2015-07-24 02:00:00 | 11.431 |
| 2015-07-24 02:15:00 | 11.431 |
| 2015-07-24 02:30:00 | 11.431 |
| 2015-07-24 02:45:00 | 11.431 |
| 2015-07-24 03:00:00 | 11.431 |
| 2015-07-24 03:15:00 | 11.431 |
| 2015-07-24 03:30:00 | 11.431 |
| 2015-07-24 03:45:00 | 11.431 |
| 2015-07-24 04:00:00 | 11.334 |
| 2015-07-24 04:15:00 | 11.334 |
| 2015-07-24 04:30:00 | 11.431 |
| 2015-07-24 04:45:00 | 11.334 |
| 2015-07-24 05:00:00 | 11.334 |
| 2015-07-24 05:15:00 | 11.334 |
| 2015-07-24 05:30:00 | 11.334 |
| 2015-07-24 05:45:00 | 11.431 |
| 2015-07-24 06:00:00 | 11.334 |
| 2015-07-24 06:15:00 | 11.334 |
| 2015-07-24 06:30:00 | 11.334 |
| 2015-07-24 06:45:00 | 11.334 |
| 2015-07-24 07:00:00 | 11.431 |
| 2015-07-24 07:15:00 | 11.431 |
| 2015-07-24 07:30:00 | 11.334 |
| 2015-07-24 07:45:00 | 11.431 |
| 2015-07-24 08:00:00 | 11.431 |
| 2015-07-24 08:15:00 | 11.431 |
| 2015-07-24 08:30:00 | 11.431 |
| 2015-07-24 08:45:00 | 11.431 |
| 2015-07-24 09:00:00 | 11.431 |
| 2015-07-24 09:15:00 | 11.431 |
| 2015-07-24 09:30:00 | 11.431 |
| 2015-07-24 09:45:00 | 11.431 |
| 2015-07-24 10:00:00 | 11.431 |
| 2015-07-24 10:15:00 | 11.431 |
| 2015-07-24 10:30:00 | 11.431 |
| 2015-07-24 10:45:00 | 11.431 |
| 2015-07-24 11:00:00 | 11.431 |
| 2015-07-24 11:15:00 | 11.431 |
| 2015-07-24 11:30:00 | 11.431 |
| 2015-07-24 11:45:00 | 11.431 |
| 2015-07-24 12:00:00 | 11.431 |
| 2015-07-24 12:15:00 | 11.431 |
| 2015-07-24 12:30:00 | 11.431 |
| 2015-07-24 12:45:00 | 11.431 |
| 2015-07-24 13:00:00 | 11.431 |
| 2015-07-24 13:15:00 | 11.431 |
| 2015-07-24 13:30:00 | 11.431 |
| 2015-07-24 13:45:00 | 11.431 |
| 2015-07-24 14:00:00 | 11.431 |
| 2015-07-24 14:15:00 | 11.431 |
| 2015-07-24 14:30:00 | 11.431 |
| 2015-07-24 14:45:00 | 11.431 |
| 2015-07-24 15:00:00 | 11.431 |
| 2015-07-24 15:15:00 | 11.431 |
| 2015-07-24 15:30:00 | 11.431 |
| 2015-07-24 15:45:00 | 11.431 |
| 2015-07-24 16:00:00 | 11.431 |
| 2015-07-24 16:15:00 | 11.431 |
| 2015-07-24 16:30:00 | 11.528 |
| 2015-07-24 16:45:00 | 11.528 |
| 2015-07-24 17:00:00 | 11.528 |
| 2015-07-24 17:15:00 | 11.528 |
| 2015-07-24 17:30:00 | 11.528 |
| 2015-07-24 17:45:00 | 11.431 |
| 2015-07-24 18:00:00 | 11.431 |
| 2015-07-24 18:15:00 | 11.431 |
| 2015-07-24 18:30:00 | 11.431 |
| 2015-07-24 18:45:00 | 11.528 |
| 2015-07-24 19:00:00 | 11.431 |
| 2015-07-24 19:15:00 | 11.528 |
| 2015-07-24 19:30:00 | 11.528 |
| 2015-07-24 19:45:00 | 11.528 |
| 2015-07-24 20:00:00 | 11.431 |
| 2015-07-24 20:15:00 | 11.431 |
| 2015-07-24 20:30:00 | 11.431 |
| 2015-07-24 20:45:00 | 11.431 |
| 2015-07-24 21:00:00 | 11.431 |
| 2015-07-24 21:15:00 | 11.431 |
| 2015-07-24 21:30:00 | 11.431 |
| 2015-07-24 21:45:00 | 11.431 |
| 2015-07-24 22:00:00 | 11.431 |
| 2015-07-24 22:15:00 | 11.431 |
| 2015-07-24 22:30:00 | 11.431 |
| 2015-07-24 22:45:00 | 11.431 |
| 2015-07-24 23:00:00 | 11.431 |
| 2015-07-24 23:15:00 | 11.431 |
| 2015-07-24 23:30:00 | 11.431 |
| 2015-07-24 23:45:00 | 11.431 |
| 2015-07-25 | 11.431 |
| 2015-07-25 00:15:00 | 11.431 |
| 2015-07-25 00:30:00 | 11.431 |
| 2015-07-25 00:45:00 | 11.431 |
| 2015-07-25 01:00:00 | 11.431 |
| 2015-07-25 01:15:00 | 11.431 |
| 2015-07-25 01:30:00 | 11.431 |
| 2015-07-25 01:45:00 | 11.431 |
| 2015-07-25 02:00:00 | 11.431 |
| 2015-07-25 02:15:00 | 11.431 |
| 2015-07-25 02:30:00 | 11.431 |
| 2015-07-25 02:45:00 | 11.334 |
| 2015-07-25 03:00:00 | 11.334 |
| 2015-07-25 03:15:00 | 11.334 |
| 2015-07-25 03:30:00 | 11.334 |
| 2015-07-25 03:45:00 | 11.334 |
| 2015-07-25 04:00:00 | 11.334 |
| 2015-07-25 04:15:00 | 11.334 |
| 2015-07-25 04:30:00 | 11.334 |
| 2015-07-25 04:45:00 | 11.334 |
| 2015-07-25 05:00:00 | 11.334 |
| 2015-07-25 05:15:00 | 11.334 |
| 2015-07-25 05:30:00 | 11.334 |
| 2015-07-25 05:45:00 | 11.334 |
| 2015-07-25 06:00:00 | 11.334 |
| 2015-07-25 06:15:00 | 11.334 |
| 2015-07-25 06:30:00 | 11.334 |
| 2015-07-25 06:45:00 | 11.334 |
| 2015-07-25 07:00:00 | 11.334 |
| 2015-07-25 07:15:00 | 11.334 |
| 2015-07-25 07:30:00 | 11.334 |
| 2015-07-25 07:45:00 | 11.334 |
| 2015-07-25 08:00:00 | 11.334 |
| 2015-07-25 08:15:00 | 11.334 |
| 2015-07-25 08:30:00 | 11.334 |
| 2015-07-25 08:45:00 | 11.334 |
| 2015-07-25 09:00:00 | 11.431 |
| 2015-07-25 09:15:00 | 11.431 |
| 2015-07-25 09:30:00 | 11.431 |
| 2015-07-25 09:45:00 | 11.431 |
| 2015-07-25 10:00:00 | 11.431 |
| 2015-07-25 10:15:00 | 11.431 |
| 2015-07-25 10:30:00 | 11.431 |
| 2015-07-25 10:45:00 | 11.431 |
| 2015-07-25 11:00:00 | 11.528 |
| 2015-07-25 11:15:00 | 11.528 |
| 2015-07-25 11:30:00 | 11.528 |
| 2015-07-25 11:45:00 | 11.528 |
| 2015-07-25 12:00:00 | 11.528 |
| 2015-07-25 12:15:00 | 11.528 |
| 2015-07-25 12:30:00 | 11.528 |
| 2015-07-25 12:45:00 | 11.528 |
| 2015-07-25 13:00:00 | 11.528 |
| 2015-07-25 13:15:00 | 11.528 |
| 2015-07-25 13:30:00 | 11.625 |
| 2015-07-25 13:45:00 | 11.625 |
| 2015-07-25 14:00:00 | 11.625 |
| 2015-07-25 14:15:00 | 11.625 |
| 2015-07-25 14:30:00 | 11.625 |
| 2015-07-25 14:45:00 | 11.625 |
| 2015-07-25 15:00:00 | 11.625 |
| 2015-07-25 15:15:00 | 11.722 |
| 2015-07-25 15:30:00 | 11.625 |
| 2015-07-25 15:45:00 | 11.625 |
| 2015-07-25 16:00:00 | 11.722 |
| 2015-07-25 16:15:00 | 11.722 |
| 2015-07-25 16:30:00 | 11.722 |
| 2015-07-25 16:45:00 | 11.722 |
| 2015-07-25 17:00:00 | 11.722 |
| 2015-07-25 17:15:00 | 11.625 |
| 2015-07-25 17:30:00 | 11.625 |
| 2015-07-25 17:45:00 | 11.625 |
| 2015-07-25 18:00:00 | 11.625 |
| 2015-07-25 18:15:00 | 11.625 |
| 2015-07-25 18:30:00 | 11.625 |
| 2015-07-25 18:45:00 | 11.625 |
| 2015-07-25 19:00:00 | 11.528 |
| 2015-07-25 19:15:00 | 11.625 |
| 2015-07-25 19:30:00 | 11.528 |
| 2015-07-25 19:45:00 | 11.528 |
| 2015-07-25 20:00:00 | 11.528 |
| 2015-07-25 20:15:00 | 11.528 |
| 2015-07-25 20:30:00 | 11.528 |
| 2015-07-25 20:45:00 | 11.528 |
| 2015-07-25 21:00:00 | 11.528 |
| 2015-07-25 21:15:00 | 11.431 |
| 2015-07-25 21:30:00 | 11.431 |
| 2015-07-25 21:45:00 | 11.431 |
| 2015-07-25 22:00:00 | 11.431 |
| 2015-07-25 22:15:00 | 11.431 |
| 2015-07-25 22:30:00 | 11.431 |
| 2015-07-25 22:45:00 | 11.431 |
| 2015-07-25 23:00:00 | 11.431 |
| 2015-07-25 23:15:00 | 11.431 |
| 2015-07-25 23:30:00 | 11.334 |
| 2015-07-25 23:45:00 | 11.334 |
| 2015-07-26 | 11.334 |
| 2015-07-26 00:15:00 | 11.334 |
| 2015-07-26 00:30:00 | 11.334 |
| 2015-07-26 00:45:00 | 11.334 |
| 2015-07-26 01:00:00 | 11.334 |
| 2015-07-26 01:15:00 | 11.334 |
| 2015-07-26 01:30:00 | 11.334 |
| 2015-07-26 01:45:00 | 11.334 |
| 2015-07-26 02:00:00 | 11.334 |
| 2015-07-26 02:15:00 | 11.236 |
| 2015-07-26 02:30:00 | 11.236 |
| 2015-07-26 02:45:00 | 11.236 |
| 2015-07-26 03:00:00 | 11.236 |
| 2015-07-26 03:15:00 | 11.236 |
| 2015-07-26 03:30:00 | 11.236 |
| 2015-07-26 03:45:00 | 11.236 |
| 2015-07-26 04:00:00 | 11.236 |
| 2015-07-26 04:15:00 | 11.236 |
| 2015-07-26 04:30:00 | 11.236 |
| 2015-07-26 04:45:00 | 11.236 |
| 2015-07-26 05:00:00 | 11.334 |
| 2015-07-26 05:15:00 | 11.236 |
| 2015-07-26 05:30:00 | 11.334 |
| 2015-07-26 05:45:00 | 11.334 |
| 2015-07-26 06:00:00 | 11.334 |
| 2015-07-26 06:15:00 | 11.334 |
| 2015-07-26 06:30:00 | 11.334 |
| 2015-07-26 06:45:00 | 11.334 |
| 2015-07-26 07:00:00 | 11.334 |
| 2015-07-26 07:15:00 | 11.334 |
| 2015-07-26 07:30:00 | 11.334 |
| 2015-07-26 07:45:00 | 11.334 |
| 2015-07-26 08:00:00 | 11.334 |
| 2015-07-26 08:15:00 | 11.334 |
| 2015-07-26 08:30:00 | 11.334 |
| 2015-07-26 08:45:00 | 11.334 |
| 2015-07-26 09:00:00 | 11.334 |
| 2015-07-26 09:15:00 | 11.334 |
| 2015-07-26 09:30:00 | 11.334 |
| 2015-07-26 09:45:00 | 11.431 |
| 2015-07-26 10:00:00 | 11.431 |
| 2015-07-26 10:15:00 | 11.431 |
| 2015-07-26 10:30:00 | 11.431 |
| 2015-07-26 10:45:00 | 11.431 |
| 2015-07-26 11:00:00 | 11.431 |
| 2015-07-26 11:15:00 | 11.431 |
| 2015-07-26 11:30:00 | 11.431 |
| 2015-07-26 11:45:00 | 11.431 |
| 2015-07-26 12:00:00 | 11.431 |
| 2015-07-26 12:15:00 | 11.431 |
| 2015-07-26 12:30:00 | 11.431 |
| 2015-07-26 12:45:00 | 11.431 |
| 2015-07-26 13:00:00 | 11.431 |
| 2015-07-26 13:15:00 | 11.431 |
| 2015-07-26 13:30:00 | 11.431 |
| 2015-07-26 13:45:00 | 11.431 |
| 2015-07-26 14:00:00 | 11.431 |
| 2015-07-26 14:15:00 | 11.431 |
| 2015-07-26 14:30:00 | 11.431 |
| 2015-07-26 14:45:00 | 11.431 |
| 2015-07-26 15:00:00 | 11.431 |
| 2015-07-26 15:15:00 | 11.431 |
| 2015-07-26 15:30:00 | 11.431 |
| 2015-07-26 15:45:00 | 11.431 |
| 2015-07-26 16:00:00 | 11.431 |
| 2015-07-26 16:15:00 | 11.528 |
| 2015-07-26 16:30:00 | 11.528 |
| 2015-07-26 16:45:00 | 11.528 |
| 2015-07-26 17:00:00 | 11.528 |
| 2015-07-26 17:15:00 | 11.528 |
| 2015-07-26 17:30:00 | 11.528 |
| 2015-07-26 17:45:00 | 11.528 |
| 2015-07-26 18:00:00 | 11.528 |
| 2015-07-26 18:15:00 | 11.528 |
| 2015-07-26 18:30:00 | 11.528 |
| 2015-07-26 18:45:00 | 11.528 |
| 2015-07-26 19:00:00 | 11.528 |
| 2015-07-26 19:15:00 | 11.528 |
| 2015-07-26 19:30:00 | 11.528 |
| 2015-07-26 19:45:00 | 11.528 |
| 2015-07-26 20:00:00 | 11.528 |
| 2015-07-26 20:15:00 | 11.528 |
| 2015-07-26 20:30:00 | 11.528 |
| 2015-07-26 20:45:00 | 11.528 |
| 2015-07-26 21:00:00 | 11.528 |
| 2015-07-26 21:15:00 | 11.431 |
| 2015-07-26 21:30:00 | 11.431 |
| 2015-07-26 21:45:00 | 11.431 |
| 2015-07-26 22:00:00 | 11.431 |
| 2015-07-26 22:15:00 | 11.431 |
| 2015-07-26 22:30:00 | 11.431 |
| 2015-07-26 22:45:00 | 11.431 |
| 2015-07-26 23:00:00 | 11.431 |
| 2015-07-26 23:15:00 | 11.431 |
| 2015-07-26 23:30:00 | 11.431 |
| 2015-07-26 23:45:00 | 11.431 |
| 2015-07-27 | 11.431 |
| 2015-07-27 00:15:00 | 11.431 |
| 2015-07-27 00:30:00 | 11.431 |
| 2015-07-27 00:45:00 | 11.431 |
| 2015-07-27 01:00:00 | 11.431 |
| 2015-07-27 01:15:00 | 11.431 |
| 2015-07-27 01:30:00 | 11.431 |
| 2015-07-27 01:45:00 | 11.431 |
| 2015-07-27 02:00:00 | 11.431 |
| 2015-07-27 02:15:00 | 11.431 |
| 2015-07-27 02:30:00 | 11.431 |
| 2015-07-27 02:45:00 | 11.431 |
| 2015-07-27 03:00:00 | 11.431 |
| 2015-07-27 03:15:00 | 11.431 |
| 2015-07-27 03:30:00 | 11.431 |
| 2015-07-27 03:45:00 | 11.431 |
| 2015-07-27 04:00:00 | 11.431 |
| 2015-07-27 04:15:00 | 11.431 |
| 2015-07-27 04:30:00 | 11.431 |
| 2015-07-27 04:45:00 | 11.431 |
| 2015-07-27 05:00:00 | 11.431 |
| 2015-07-27 05:15:00 | 11.431 |
| 2015-07-27 05:30:00 | 11.431 |
| 2015-07-27 05:45:00 | 11.431 |
| 2015-07-27 06:00:00 | 11.431 |
| 2015-07-27 06:15:00 | 11.431 |
| 2015-07-27 06:30:00 | 11.431 |
| 2015-07-27 06:45:00 | 11.431 |
| 2015-07-27 07:00:00 | 11.431 |
| 2015-07-27 07:15:00 | 11.431 |
| 2015-07-27 07:30:00 | 11.431 |
| 2015-07-27 07:45:00 | 11.431 |
| 2015-07-27 08:00:00 | 11.431 |
| 2015-07-27 08:15:00 | 11.431 |
| 2015-07-27 08:30:00 | 11.431 |
| 2015-07-27 08:45:00 | 11.431 |
| 2015-07-27 09:00:00 | 11.431 |
| 2015-07-27 09:15:00 | 11.431 |
| 2015-07-27 09:30:00 | 11.431 |
| 2015-07-27 09:45:00 | 11.528 |
| 2015-07-27 10:00:00 | 11.528 |
| 2015-07-27 10:15:00 | 11.528 |
| 2015-07-27 10:30:00 | 11.528 |
| 2015-07-27 10:45:00 | 11.528 |
| 2015-07-27 11:00:00 | 11.528 |
| 2015-07-27 11:15:00 | 11.528 |
| 2015-07-27 11:30:00 | 11.528 |
| 2015-07-27 11:45:00 | 11.528 |
| 2015-07-27 12:00:00 | 11.625 |
| 2015-07-27 12:15:00 | 11.625 |
| 2015-07-27 12:30:00 | 11.625 |
| 2015-07-27 12:45:00 | 11.625 |
| 2015-07-27 13:00:00 | 11.625 |
| 2015-07-27 13:15:00 | 11.625 |
| 2015-07-27 13:30:00 | 11.722 |
| 2015-07-27 13:45:00 | 11.722 |
| 2015-07-27 14:00:00 | 11.625 |
| 2015-07-27 14:15:00 | 11.722 |
| 2015-07-27 14:30:00 | 11.625 |
| 2015-07-27 14:45:00 | 11.625 |
| 2015-07-27 15:00:00 | 11.722 |
| 2015-07-27 15:15:00 | 11.722 |
| 2015-07-27 15:30:00 | 11.625 |
| 2015-07-27 15:45:00 | 11.722 |
| 2015-07-27 16:00:00 | 11.625 |
| 2015-07-27 16:15:00 | 11.625 |
| 2015-07-27 16:30:00 | 11.625 |
| 2015-07-27 16:45:00 | 11.625 |
| 2015-07-27 17:00:00 | 11.625 |
| 2015-07-27 17:15:00 | 11.625 |
| 2015-07-27 17:30:00 | 11.625 |
| 2015-07-27 17:45:00 | 11.625 |
| 2015-07-27 18:00:00 | 11.625 |
| 2015-07-27 18:15:00 | 11.625 |
| 2015-07-27 18:30:00 | 11.625 |
| 2015-07-27 18:45:00 | 11.625 |
| 2015-07-27 19:00:00 | 11.625 |
| 2015-07-27 19:15:00 | 11.625 |
| 2015-07-27 19:30:00 | 11.528 |
| 2015-07-27 19:45:00 | 11.528 |
| 2015-07-27 20:00:00 | 11.528 |
| 2015-07-27 20:15:00 | 11.528 |
| 2015-07-27 20:30:00 | 11.528 |
| 2015-07-27 20:45:00 | 11.528 |
| 2015-07-27 21:00:00 | 11.528 |
| 2015-07-27 21:15:00 | 11.528 |
| 2015-07-27 21:30:00 | 11.528 |
| 2015-07-27 21:45:00 | 11.528 |
| 2015-07-27 22:00:00 | 11.528 |
| 2015-07-27 22:15:00 | 11.431 |
| 2015-07-27 22:30:00 | 11.431 |
| 2015-07-27 22:45:00 | 11.431 |
| 2015-07-27 23:00:00 | 11.431 |
| 2015-07-27 23:15:00 | 11.431 |
| 2015-07-27 23:30:00 | 11.431 |
| 2015-07-27 23:45:00 | 11.431 |
| 2015-07-28 | 11.431 |
| 2015-07-28 00:15:00 | 11.431 |
| 2015-07-28 00:30:00 | 11.431 |
| 2015-07-28 00:45:00 | 11.431 |
| 2015-07-28 01:00:00 | 11.431 |
| 2015-07-28 01:15:00 | 11.431 |
| 2015-07-28 01:30:00 | 11.431 |
| 2015-07-28 01:45:00 | 11.431 |
| 2015-07-28 02:00:00 | 11.431 |
| 2015-07-28 02:15:00 | 11.431 |
| 2015-07-28 02:30:00 | 11.431 |
| 2015-07-28 02:45:00 | 11.431 |
| 2015-07-28 03:00:00 | 11.431 |
| 2015-07-28 03:15:00 | 11.431 |
| 2015-07-28 03:30:00 | 11.431 |
| 2015-07-28 03:45:00 | 11.431 |
| 2015-07-28 04:00:00 | 11.431 |
| 2015-07-28 04:15:00 | 11.431 |
| 2015-07-28 04:30:00 | 11.431 |
| 2015-07-28 04:45:00 | 11.431 |
| 2015-07-28 05:00:00 | 11.431 |
| 2015-07-28 05:15:00 | 11.431 |
| 2015-07-28 05:30:00 | 11.431 |
| 2015-07-28 05:45:00 | 11.431 |
| 2015-07-28 06:00:00 | 11.431 |
| 2015-07-28 06:15:00 | 11.431 |
| 2015-07-28 06:30:00 | 11.431 |
| 2015-07-28 06:45:00 | 11.431 |
| 2015-07-28 07:00:00 | 11.431 |
| 2015-07-28 07:15:00 | 11.431 |
| 2015-07-28 07:30:00 | 11.431 |
| 2015-07-28 07:45:00 | 11.431 |
| 2015-07-28 08:00:00 | 11.431 |
| 2015-07-28 08:15:00 | 11.431 |
| 2015-07-28 08:30:00 | 11.431 |
| 2015-07-28 08:45:00 | 11.431 |
| 2015-07-28 09:00:00 | 11.431 |
| 2015-07-28 09:15:00 | 11.431 |
| 2015-07-28 09:30:00 | 11.431 |
| 2015-07-28 09:45:00 | 11.431 |
| 2015-07-28 10:00:00 | 11.431 |
| 2015-07-28 10:15:00 | 11.431 |
| 2015-07-28 10:30:00 | 11.528 |
| 2015-07-28 10:45:00 | 11.528 |
| 2015-07-28 11:00:00 | 11.528 |
| 2015-07-28 11:15:00 | 11.528 |
| 2015-07-28 11:30:00 | 11.528 |
| 2015-07-28 11:45:00 | 11.528 |
| 2015-07-28 12:00:00 | 11.528 |
| 2015-07-28 12:15:00 | 11.528 |
| 2015-07-28 12:30:00 | 11.528 |
| 2015-07-28 12:45:00 | 11.528 |
| 2015-07-28 13:00:00 | 11.528 |
| 2015-07-28 13:15:00 | 11.528 |
| 2015-07-28 13:30:00 | 11.528 |
| 2015-07-28 13:45:00 | 11.625 |
| 2015-07-28 14:00:00 | 11.625 |
| 2015-07-28 14:15:00 | 11.625 |
| 2015-07-28 14:30:00 | 11.625 |
| 2015-07-28 14:45:00 | 11.625 |
| 2015-07-28 15:00:00 | 11.625 |
| 2015-07-28 15:15:00 | 11.625 |
| 2015-07-28 15:30:00 | 11.625 |
| 2015-07-28 15:45:00 | 11.625 |
| 2015-07-28 16:00:00 | 11.625 |
| 2015-07-28 16:15:00 | 11.625 |
| 2015-07-28 16:30:00 | 11.722 |
| 2015-07-28 16:45:00 | 11.625 |
| 2015-07-28 17:00:00 | 11.625 |
| 2015-07-28 17:15:00 | 11.625 |
| 2015-07-28 17:30:00 | 11.625 |
| 2015-07-28 17:45:00 | 11.625 |
| 2015-07-28 18:00:00 | 11.625 |
| 2015-07-28 18:15:00 | 11.625 |
| 2015-07-28 18:30:00 | 11.625 |
| 2015-07-28 18:45:00 | 11.625 |
| 2015-07-28 19:00:00 | 11.625 |
| 2015-07-28 19:15:00 | 11.528 |
| 2015-07-28 19:30:00 | 11.528 |
| 2015-07-28 19:45:00 | 11.528 |
| 2015-07-28 20:00:00 | 11.528 |
| 2015-07-28 20:15:00 | 11.528 |
| 2015-07-28 20:30:00 | 11.528 |
| 2015-07-28 20:45:00 | 11.528 |
| 2015-07-28 21:00:00 | 11.528 |
| 2015-07-28 21:15:00 | 11.528 |
| 2015-07-28 21:30:00 | 11.431 |
| 2015-07-28 21:45:00 | 11.431 |
| 2015-07-28 22:00:00 | 11.431 |
| 2015-07-28 22:15:00 | 11.431 |
| 2015-07-28 22:30:00 | 11.431 |
| 2015-07-28 22:45:00 | 11.431 |
| 2015-07-28 23:00:00 | 11.334 |
| 2015-07-28 23:15:00 | 11.334 |
| 2015-07-28 23:30:00 | 11.334 |
| 2015-07-28 23:45:00 | 11.334 |
| 2015-07-29 | 11.334 |
| 2015-07-29 00:15:00 | 11.334 |
| 2015-07-29 00:30:00 | 11.334 |
| 2015-07-29 00:45:00 | 11.236 |
| 2015-07-29 01:00:00 | 11.236 |
| 2015-07-29 01:15:00 | 11.236 |
| 2015-07-29 01:30:00 | 11.236 |
| 2015-07-29 01:45:00 | 11.236 |
| 2015-07-29 02:00:00 | 11.236 |
| 2015-07-29 02:15:00 | 11.236 |
| 2015-07-29 02:30:00 | 11.236 |
| 2015-07-29 02:45:00 | 11.236 |
| 2015-07-29 03:00:00 | 11.236 |
| 2015-07-29 03:15:00 | 11.236 |
| 2015-07-29 03:30:00 | 11.236 |
| 2015-07-29 03:45:00 | 11.236 |
| 2015-07-29 04:00:00 | 11.236 |
| 2015-07-29 04:15:00 | 11.236 |
| 2015-07-29 04:30:00 | 11.236 |
| 2015-07-29 04:45:00 | 11.236 |
| 2015-07-29 05:00:00 | 11.236 |
| 2015-07-29 05:15:00 | 11.236 |
| 2015-07-29 05:30:00 | 11.236 |
| 2015-07-29 05:45:00 | 11.236 |
| 2015-07-29 06:00:00 | 11.236 |
| 2015-07-29 06:15:00 | 11.236 |
| 2015-07-29 06:30:00 | 11.236 |
| 2015-07-29 06:45:00 | 11.236 |
| 2015-07-29 07:00:00 | 11.236 |
| 2015-07-29 07:15:00 | 11.236 |
| 2015-07-29 07:30:00 | 11.236 |
| 2015-07-29 07:45:00 | 11.236 |
| 2015-07-29 08:00:00 | 11.236 |
| 2015-07-29 08:15:00 | 11.236 |
| 2015-07-29 08:30:00 | 11.334 |
| 2015-07-29 08:45:00 | 11.334 |
| 2015-07-29 09:00:00 | 11.334 |
| 2015-07-29 09:15:00 | 11.334 |
| 2015-07-29 09:30:00 | 11.334 |
| 2015-07-29 09:45:00 | 11.334 |
| 2015-07-29 10:00:00 | 11.431 |
| 2015-07-29 10:15:00 | 11.431 |
| 2015-07-29 10:30:00 | 11.431 |
| 2015-07-29 10:45:00 | 11.431 |
| 2015-07-29 11:00:00 | 11.528 |
| 2015-07-29 11:15:00 | 11.528 |
| 2015-07-29 11:30:00 | 11.528 |
| 2015-07-29 11:45:00 | 11.528 |
| 2015-07-29 12:00:00 | 11.528 |
| 2015-07-29 12:15:00 | 11.528 |
| 2015-07-29 12:30:00 | 11.528 |
| 2015-07-29 12:45:00 | 11.528 |
| 2015-07-29 13:00:00 | 11.528 |
| 2015-07-29 13:15:00 | 11.528 |
| 2015-07-29 13:30:00 | 11.528 |
| 2015-07-29 13:45:00 | 11.528 |
| 2015-07-29 14:00:00 | 11.528 |
| 2015-07-29 14:15:00 | 11.528 |
| 2015-07-29 14:30:00 | 11.528 |
| 2015-07-29 14:45:00 | 11.528 |
| 2015-07-29 15:00:00 | 11.625 |
| 2015-07-29 15:15:00 | 11.625 |
| 2015-07-29 15:30:00 | 11.625 |
| 2015-07-29 15:45:00 | 11.528 |
| 2015-07-29 16:00:00 | 11.528 |
| 2015-07-29 16:15:00 | 11.528 |
| 2015-07-29 16:30:00 | 11.528 |
| 2015-07-29 16:45:00 | 11.528 |
| 2015-07-29 17:00:00 | 11.528 |
| 2015-07-29 17:15:00 | 11.528 |
| 2015-07-29 17:30:00 | 11.528 |
| 2015-07-29 17:45:00 | 11.528 |
| 2015-07-29 18:00:00 | 11.528 |
| 2015-07-29 18:15:00 | 11.528 |
| 2015-07-29 18:30:00 | 11.528 |
| 2015-07-29 18:45:00 | 11.528 |
| 2015-07-29 19:00:00 | 11.528 |
| 2015-07-29 19:15:00 | 11.528 |
| 2015-07-29 19:30:00 | 11.528 |
| 2015-07-29 19:45:00 | 11.528 |
| 2015-07-29 20:00:00 | 11.528 |
| 2015-07-29 20:15:00 | 11.528 |
| 2015-07-29 20:30:00 | 11.431 |
| 2015-07-29 20:45:00 | 11.431 |
| 2015-07-29 21:00:00 | 11.431 |
| 2015-07-29 21:15:00 | 11.431 |
| 2015-07-29 21:30:00 | 11.431 |
| 2015-07-29 21:45:00 | 11.431 |
| 2015-07-29 22:00:00 | 11.431 |
| 2015-07-29 22:15:00 | 11.431 |
| 2015-07-29 22:30:00 | 11.431 |
| 2015-07-29 22:45:00 | 11.334 |
| 2015-07-29 23:00:00 | 11.334 |
| 2015-07-29 23:15:00 | 11.334 |
| 2015-07-29 23:30:00 | 11.334 |
| 2015-07-29 23:45:00 | 11.334 |
| 2015-07-30 | 11.334 |
| 2015-07-30 00:15:00 | 11.334 |
| 2015-07-30 00:30:00 | 11.236 |
| 2015-07-30 00:45:00 | 11.236 |
| 2015-07-30 01:00:00 | 11.236 |
| 2015-07-30 01:15:00 | 11.236 |
| 2015-07-30 01:30:00 | 11.236 |
| 2015-07-30 01:45:00 | 11.236 |
| 2015-07-30 02:00:00 | 11.236 |
| 2015-07-30 02:15:00 | 11.236 |
| 2015-07-30 02:30:00 | 11.236 |
| 2015-07-30 02:45:00 | 11.139 |
| 2015-07-30 03:00:00 | 11.139 |
| 2015-07-30 03:15:00 | 11.139 |
| 2015-07-30 03:30:00 | 11.139 |
| 2015-07-30 03:45:00 | 11.139 |
| 2015-07-30 04:00:00 | 11.139 |
| 2015-07-30 04:15:00 | 11.139 |
| 2015-07-30 04:30:00 | 11.139 |
| 2015-07-30 04:45:00 | 11.139 |
| 2015-07-30 05:00:00 | 11.139 |
| 2015-07-30 05:15:00 | 11.139 |
| 2015-07-30 05:30:00 | 11.139 |
| 2015-07-30 05:45:00 | 11.139 |
| 2015-07-30 06:00:00 | 11.139 |
| 2015-07-30 06:15:00 | 11.139 |
| 2015-07-30 06:30:00 | 11.139 |
| 2015-07-30 06:45:00 | 11.139 |
| 2015-07-30 07:00:00 | 11.139 |
| 2015-07-30 07:15:00 | 11.139 |
| 2015-07-30 07:30:00 | 11.139 |
| 2015-07-30 07:45:00 | 11.139 |
| 2015-07-30 08:00:00 | 11.236 |
| 2015-07-30 08:15:00 | 11.236 |
| 2015-07-30 08:30:00 | 11.236 |
| 2015-07-30 08:45:00 | 11.236 |
| 2015-07-30 09:00:00 | 11.236 |
| 2015-07-30 09:15:00 | 11.334 |
| 2015-07-30 09:30:00 | 11.334 |
| 2015-07-30 09:45:00 | 11.334 |
| 2015-07-30 10:00:00 | 11.334 |
| 2015-07-30 10:15:00 | 11.334 |
| 2015-07-30 10:30:00 | 11.431 |
| 2015-07-30 10:45:00 | 11.431 |
| 2015-07-30 11:00:00 | 11.431 |
| 2015-07-30 11:15:00 | 11.431 |
| 2015-07-30 11:30:00 | 11.528 |
| 2015-07-30 11:45:00 | 11.528 |
| 2015-07-30 12:00:00 | 11.528 |
| 2015-07-30 12:15:00 | 11.528 |
| 2015-07-30 12:30:00 | 11.528 |
| 2015-07-30 12:45:00 | 11.528 |
| 2015-07-30 13:00:00 | 11.528 |
| 2015-07-30 13:15:00 | 11.625 |
| 2015-07-30 13:30:00 | 11.625 |
| 2015-07-30 13:45:00 | 11.625 |
| 2015-07-30 14:00:00 | 11.625 |
| 2015-07-30 14:15:00 | 11.625 |
| 2015-07-30 14:30:00 | 11.625 |
| 2015-07-30 14:45:00 | 11.625 |
| 2015-07-30 15:00:00 | 11.625 |
| 2015-07-30 15:15:00 | 11.625 |
| 2015-07-30 15:30:00 | 11.625 |
| 2015-07-30 15:45:00 | 11.722 |
| 2015-07-30 16:00:00 | 11.722 |
| 2015-07-30 16:15:00 | 11.722 |
| 2015-07-30 16:30:00 | 11.722 |
| 2015-07-30 16:45:00 | 11.722 |
| 2015-07-30 17:00:00 | 11.625 |
| 2015-07-30 17:15:00 | 11.625 |
| 2015-07-30 17:30:00 | 11.625 |
| 2015-07-30 17:45:00 | 11.625 |
| 2015-07-30 18:00:00 | 11.625 |
| 2015-07-30 18:15:00 | 11.625 |
| 2015-07-30 18:30:00 | 11.625 |
| 2015-07-30 18:45:00 | 11.528 |
| 2015-07-30 19:00:00 | 11.528 |
| 2015-07-30 19:15:00 | 11.528 |
| 2015-07-30 19:30:00 | 11.528 |
| 2015-07-30 19:45:00 | 11.528 |
| 2015-07-30 20:00:00 | 11.528 |
| 2015-07-30 20:15:00 | 11.528 |
| 2015-07-30 20:30:00 | 11.528 |
| 2015-07-30 20:45:00 | 11.528 |
| 2015-07-30 21:00:00 | 11.528 |
| 2015-07-30 21:15:00 | 11.431 |
| 2015-07-30 21:30:00 | 11.431 |
| 2015-07-30 21:45:00 | 11.431 |
| 2015-07-30 22:00:00 | 11.431 |
| 2015-07-30 22:15:00 | 11.431 |
| 2015-07-30 22:30:00 | 11.334 |
| 2015-07-30 22:45:00 | 11.334 |
| 2015-07-30 23:00:00 | 11.334 |
| 2015-07-30 23:15:00 | 11.334 |
| 2015-07-30 23:30:00 | 11.334 |
| 2015-07-30 23:45:00 | 11.334 |
| 2015-07-31 | 11.236 |
| 2015-07-31 00:15:00 | 11.236 |
| 2015-07-31 00:30:00 | 11.236 |
| 2015-07-31 00:45:00 | 11.236 |
| 2015-07-31 01:00:00 | 11.236 |
| 2015-07-31 01:15:00 | 11.236 |
| 2015-07-31 01:30:00 | 11.236 |
| 2015-07-31 01:45:00 | 11.139 |
| 2015-07-31 02:00:00 | 11.139 |
| 2015-07-31 02:15:00 | 11.139 |
| 2015-07-31 02:30:00 | 11.139 |
| 2015-07-31 02:45:00 | 11.139 |
| 2015-07-31 03:00:00 | 11.139 |
| 2015-07-31 03:15:00 | 11.139 |
| 2015-07-31 03:30:00 | 11.139 |
| 2015-07-31 03:45:00 | 11.139 |
| 2015-07-31 04:00:00 | 11.139 |
| 2015-07-31 04:15:00 | 11.139 |
| 2015-07-31 04:30:00 | 11.139 |
| 2015-07-31 04:45:00 | 11.139 |
| 2015-07-31 05:00:00 | 11.139 |
| 2015-07-31 05:15:00 | 11.139 |
| 2015-07-31 05:30:00 | 11.041 |
| 2015-07-31 05:45:00 | 11.041 |
| 2015-07-31 06:00:00 | 11.041 |
| 2015-07-31 06:15:00 | 11.041 |
| 2015-07-31 06:30:00 | 11.139 |
| 2015-07-31 06:45:00 | 11.041 |
| 2015-07-31 07:00:00 | 11.139 |
| 2015-07-31 07:15:00 | 11.139 |
| 2015-07-31 07:30:00 | 11.139 |
| 2015-07-31 07:45:00 | 11.139 |
| 2015-07-31 08:00:00 | 11.139 |
| 2015-07-31 08:15:00 | 11.236 |
| 2015-07-31 08:30:00 | 11.236 |
| 2015-07-31 08:45:00 | 11.236 |
| 2015-07-31 09:00:00 | 11.236 |
| 2015-07-31 09:15:00 | 11.334 |
| 2015-07-31 09:30:00 | 11.334 |
| 2015-07-31 09:45:00 | 11.334 |
| 2015-07-31 10:00:00 | 11.334 |
| 2015-07-31 10:15:00 | 11.431 |
| 2015-07-31 10:30:00 | 11.431 |
| 2015-07-31 10:45:00 | 11.431 |
| 2015-07-31 11:00:00 | 11.431 |
| 2015-07-31 11:15:00 | 11.528 |
| 2015-07-31 11:30:00 | 11.528 |
| 2015-07-31 11:45:00 | 11.528 |
| 2015-07-31 12:00:00 | 11.528 |
| 2015-07-31 12:15:00 | 11.528 |
| 2015-07-31 12:30:00 | 11.528 |
| 2015-07-31 12:45:00 | 11.528 |
| 2015-07-31 13:00:00 | 11.528 |
| 2015-07-31 13:15:00 | 11.625 |
| 2015-07-31 13:30:00 | 11.625 |
| 2015-07-31 13:45:00 | 11.625 |
| 2015-07-31 14:00:00 | 11.625 |
| 2015-07-31 14:15:00 | 11.625 |
| 2015-07-31 14:30:00 | 11.625 |
| 2015-07-31 14:45:00 | 11.625 |
| 2015-07-31 15:00:00 | 11.625 |
| 2015-07-31 15:15:00 | 11.625 |
| 2015-07-31 15:30:00 | 11.722 |
| 2015-07-31 15:45:00 | 11.722 |
| 2015-07-31 16:00:00 | 11.722 |
| 2015-07-31 16:15:00 | 11.722 |
| 2015-07-31 16:30:00 | 11.722 |
| 2015-07-31 16:45:00 | 11.722 |
| 2015-07-31 17:00:00 | 11.722 |
| 2015-07-31 17:15:00 | 11.625 |
| 2015-07-31 17:30:00 | 11.625 |
| 2015-07-31 17:45:00 | 11.625 |
| 2015-07-31 18:00:00 | 11.625 |
| 2015-07-31 18:15:00 | 11.625 |
| 2015-07-31 18:30:00 | 11.625 |
| 2015-07-31 18:45:00 | 11.625 |
| 2015-07-31 19:00:00 | 11.625 |
| 2015-07-31 19:15:00 | 11.625 |
| 2015-07-31 19:30:00 | 11.528 |
| 2015-07-31 19:45:00 | 11.528 |
| 2015-07-31 20:00:00 | 11.528 |
| 2015-07-31 20:15:00 | 11.528 |
| 2015-07-31 20:30:00 | 11.528 |
| 2015-07-31 20:45:00 | 11.528 |
| 2015-07-31 21:00:00 | 11.528 |
| 2015-07-31 21:15:00 | 11.431 |
| 2015-07-31 21:30:00 | 11.431 |
| 2015-07-31 21:45:00 | 11.431 |
| 2015-07-31 22:00:00 | 11.431 |
| 2015-07-31 22:15:00 | 11.431 |
| 2015-07-31 22:30:00 | 11.431 |
| 2015-07-31 22:45:00 | 11.334 |
| 2015-07-31 23:00:00 | 11.334 |
| 2015-07-31 23:15:00 | 11.334 |
| 2015-07-31 23:30:00 | 11.334 |
| 2015-07-31 23:45:00 | 11.334 |
| 2015-08-01 | 11.334 |
| 2015-08-01 00:15:00 | 11.236 |
| 2015-08-01 00:30:00 | 11.236 |
| 2015-08-01 00:45:00 | 11.236 |
| 2015-08-01 01:00:00 | 11.236 |
| 2015-08-01 01:15:00 | 11.236 |
| 2015-08-01 01:30:00 | 11.236 |
| 2015-08-01 01:45:00 | 11.236 |
| 2015-08-01 02:00:00 | 11.139 |
| 2015-08-01 02:15:00 | 11.139 |
| 2015-08-01 02:30:00 | 11.139 |
| 2015-08-01 02:45:00 | 11.139 |
| 2015-08-01 03:00:00 | 11.139 |
| 2015-08-01 03:15:00 | 11.139 |
| 2015-08-01 03:30:00 | 11.139 |
| 2015-08-01 03:45:00 | 11.139 |
| 2015-08-01 04:00:00 | 11.139 |
| 2015-08-01 04:15:00 | 11.139 |
| 2015-08-01 04:30:00 | 11.139 |
| 2015-08-01 04:45:00 | 11.139 |
| 2015-08-01 05:00:00 | 11.139 |
| 2015-08-01 05:15:00 | 11.041 |
| 2015-08-01 05:30:00 | 11.139 |
| 2015-08-01 05:45:00 | 11.041 |
| 2015-08-01 06:00:00 | 11.139 |
| 2015-08-01 06:15:00 | 11.041 |
| 2015-08-01 06:30:00 | 11.041 |
| 2015-08-01 06:45:00 | 11.041 |
| 2015-08-01 07:00:00 | 11.139 |
| 2015-08-01 07:15:00 | 11.139 |
| 2015-08-01 07:30:00 | 11.139 |
| 2015-08-01 07:45:00 | 11.139 |
| 2015-08-01 08:00:00 | 11.236 |
| 2015-08-01 08:15:00 | 11.236 |
| 2015-08-01 08:30:00 | 11.236 |
| 2015-08-01 08:45:00 | 11.236 |
| 2015-08-01 09:00:00 | 11.236 |
| 2015-08-01 09:15:00 | 11.334 |
| 2015-08-01 09:30:00 | 11.334 |
| 2015-08-01 09:45:00 | 11.334 |
| 2015-08-01 10:00:00 | 11.334 |
| 2015-08-01 10:15:00 | 11.431 |
| 2015-08-01 10:30:00 | 11.431 |
| 2015-08-01 10:45:00 | 11.431 |
| 2015-08-01 11:00:00 | 11.431 |
| 2015-08-01 11:15:00 | 11.431 |
| 2015-08-01 11:30:00 | 11.528 |
| 2015-08-01 11:45:00 | 11.528 |
| 2015-08-01 12:00:00 | 11.528 |
| 2015-08-01 12:15:00 | 11.528 |
| 2015-08-01 12:30:00 | 11.625 |
| 2015-08-01 12:45:00 | 11.625 |
| 2015-08-01 13:00:00 | 11.625 |
| 2015-08-01 13:15:00 | 11.625 |
| 2015-08-01 13:30:00 | 11.625 |
| 2015-08-01 13:45:00 | 11.625 |
| 2015-08-01 14:00:00 | 11.625 |
| 2015-08-01 14:15:00 | 11.625 |
| 2015-08-01 14:30:00 | 11.625 |
| 2015-08-01 14:45:00 | 11.625 |
| 2015-08-01 15:00:00 | 11.625 |
| 2015-08-01 15:15:00 | 11.625 |
| 2015-08-01 15:30:00 | 11.625 |
| 2015-08-01 15:45:00 | 11.625 |
| 2015-08-01 16:00:00 | 11.625 |
| 2015-08-01 16:15:00 | 11.625 |
| 2015-08-01 16:30:00 | 11.625 |
| 2015-08-01 16:45:00 | 11.625 |
| 2015-08-01 17:00:00 | 11.625 |
| 2015-08-01 17:15:00 | 11.625 |
| 2015-08-01 17:30:00 | 11.625 |
| 2015-08-01 17:45:00 | 11.625 |
| 2015-08-01 18:00:00 | 11.625 |
| 2015-08-01 18:15:00 | 11.625 |
| 2015-08-01 18:30:00 | 11.625 |
| 2015-08-01 18:45:00 | 11.625 |
| 2015-08-01 19:00:00 | 11.625 |
| 2015-08-01 19:15:00 | 11.528 |
| 2015-08-01 19:30:00 | 11.528 |
| 2015-08-01 19:45:00 | 11.528 |
| 2015-08-01 20:00:00 | 11.528 |
| 2015-08-01 20:15:00 | 11.528 |
| 2015-08-01 20:30:00 | 11.528 |
| 2015-08-01 20:45:00 | 11.528 |
| 2015-08-01 21:00:00 | 11.528 |
| 2015-08-01 21:15:00 | 11.528 |
| 2015-08-01 21:30:00 | 11.528 |
| 2015-08-01 21:45:00 | 11.528 |
| 2015-08-01 22:00:00 | 11.431 |
| 2015-08-01 22:15:00 | 11.431 |
| 2015-08-01 22:30:00 | 11.431 |
| 2015-08-01 22:45:00 | 11.431 |
| 2015-08-01 23:00:00 | 11.431 |
| 2015-08-01 23:15:00 | 11.431 |
| 2015-08-01 23:30:00 | 11.431 |
| 2015-08-01 23:45:00 | 11.431 |
| 2015-08-02 | 11.431 |
| 2015-08-02 00:15:00 | 11.334 |
| 2015-08-02 00:30:00 | 11.334 |
| 2015-08-02 00:45:00 | 11.334 |
| 2015-08-02 01:00:00 | 11.334 |
| 2015-08-02 01:15:00 | 11.334 |
| 2015-08-02 01:30:00 | 11.334 |
| 2015-08-02 01:45:00 | 11.334 |
| 2015-08-02 02:00:00 | 11.334 |
| 2015-08-02 02:15:00 | 11.334 |
| 2015-08-02 02:30:00 | 11.334 |
| 2015-08-02 02:45:00 | 11.236 |
| 2015-08-02 03:00:00 | 11.236 |
| 2015-08-02 03:15:00 | 11.236 |
| 2015-08-02 03:30:00 | 11.236 |
| 2015-08-02 03:45:00 | 11.236 |
| 2015-08-02 04:00:00 | 11.236 |
| 2015-08-02 04:15:00 | 11.236 |
| 2015-08-02 04:30:00 | 11.236 |
| 2015-08-02 04:45:00 | 11.236 |
| 2015-08-02 05:00:00 | 11.236 |
| 2015-08-02 05:15:00 | 11.236 |
| 2015-08-02 05:30:00 | 11.236 |
| 2015-08-02 05:45:00 | 11.236 |
| 2015-08-02 06:00:00 | 11.236 |
| 2015-08-02 06:15:00 | 11.236 |
| 2015-08-02 06:30:00 | 11.236 |
| 2015-08-02 06:45:00 | 11.236 |
| 2015-08-02 07:00:00 | 11.236 |
| 2015-08-02 07:15:00 | 11.236 |
| 2015-08-02 07:30:00 | 11.334 |
| 2015-08-02 07:45:00 | 11.334 |
| 2015-08-02 08:00:00 | 11.334 |
| 2015-08-02 08:15:00 | 11.334 |
| 2015-08-02 08:30:00 | 11.334 |
| 2015-08-02 08:45:00 | 11.334 |
| 2015-08-02 09:00:00 | 11.431 |
| 2015-08-02 09:15:00 | 11.431 |
| 2015-08-02 09:30:00 | 11.431 |
| 2015-08-02 09:45:00 | 11.431 |
| 2015-08-02 10:00:00 | 11.431 |
| 2015-08-02 10:15:00 | 11.431 |
| 2015-08-02 10:30:00 | 11.528 |
| 2015-08-02 10:45:00 | 11.528 |
| 2015-08-02 11:00:00 | 11.528 |
| 2015-08-02 11:15:00 | 11.528 |
| 2015-08-02 11:30:00 | 11.528 |
| 2015-08-02 11:45:00 | 11.528 |
| 2015-08-02 12:00:00 | 11.625 |
| 2015-08-02 12:15:00 | 11.625 |
| 2015-08-02 12:30:00 | 11.625 |
| 2015-08-02 12:45:00 | 11.625 |
| 2015-08-02 13:00:00 | 11.625 |
| 2015-08-02 13:15:00 | 11.625 |
| 2015-08-02 13:30:00 | 11.722 |
| 2015-08-02 13:45:00 | 11.722 |
| 2015-08-02 14:00:00 | 11.722 |
| 2015-08-02 14:15:00 | 11.722 |
| 2015-08-02 14:30:00 | 11.722 |
| 2015-08-02 14:45:00 | 11.722 |
| 2015-08-02 15:00:00 | 11.722 |
| 2015-08-02 15:15:00 | 11.819 |
| 2015-08-02 15:30:00 | 11.722 |
| 2015-08-02 15:45:00 | 11.819 |
| 2015-08-02 16:00:00 | 11.819 |
| 2015-08-02 16:15:00 | 11.722 |
| 2015-08-02 16:30:00 | 11.819 |
| 2015-08-02 16:45:00 | 11.722 |
| 2015-08-02 17:00:00 | 11.722 |
| 2015-08-02 17:15:00 | 11.722 |
| 2015-08-02 17:30:00 | 11.722 |
| 2015-08-02 17:45:00 | 11.722 |
| 2015-08-02 18:00:00 | 11.722 |
| 2015-08-02 18:15:00 | 11.722 |
| 2015-08-02 18:30:00 | 11.625 |
| 2015-08-02 18:45:00 | 11.625 |
| 2015-08-02 19:00:00 | 11.625 |
| 2015-08-02 19:15:00 | 11.625 |
| 2015-08-02 19:30:00 | 11.625 |
| 2015-08-02 19:45:00 | 11.625 |
| 2015-08-02 20:00:00 | 11.625 |
| 2015-08-02 20:15:00 | 11.625 |
| 2015-08-02 20:30:00 | 11.625 |
| 2015-08-02 20:45:00 | 11.625 |
| 2015-08-02 21:00:00 | 11.528 |
| 2015-08-02 21:15:00 | 11.528 |
| 2015-08-02 21:30:00 | 11.528 |
| 2015-08-02 21:45:00 | 11.528 |
| 2015-08-02 22:00:00 | 11.528 |
| 2015-08-02 22:15:00 | 11.528 |
| 2015-08-02 22:30:00 | 11.528 |
| 2015-08-02 22:45:00 | 11.528 |
| 2015-08-02 23:00:00 | 11.528 |
| 2015-08-02 23:15:00 | 11.528 |
| 2015-08-02 23:30:00 | 11.528 |
| 2015-08-02 23:45:00 | 11.528 |
| 2015-08-03 | 11.528 |
| 2015-08-03 00:15:00 | 11.431 |
| 2015-08-03 00:30:00 | 11.431 |
| 2015-08-03 00:45:00 | 11.431 |
| 2015-08-03 01:00:00 | 11.431 |
| 2015-08-03 01:15:00 | 11.431 |
| 2015-08-03 01:30:00 | 11.431 |
| 2015-08-03 01:45:00 | 11.431 |
| 2015-08-03 02:00:00 | 11.431 |
| 2015-08-03 02:15:00 | 11.431 |
| 2015-08-03 02:30:00 | 11.431 |
| 2015-08-03 02:45:00 | 11.431 |
| 2015-08-03 03:00:00 | 11.431 |
| 2015-08-03 03:15:00 | 11.334 |
| 2015-08-03 03:30:00 | 11.334 |
| 2015-08-03 03:45:00 | 11.334 |
| 2015-08-03 04:00:00 | 11.334 |
| 2015-08-03 04:15:00 | 11.334 |
| 2015-08-03 04:30:00 | 11.334 |
| 2015-08-03 04:45:00 | 11.334 |
| 2015-08-03 05:00:00 | 11.334 |
| 2015-08-03 05:15:00 | 11.334 |
| 2015-08-03 05:30:00 | 11.334 |
| 2015-08-03 05:45:00 | 11.334 |
| 2015-08-03 06:00:00 | 11.431 |
| 2015-08-03 06:15:00 | 11.431 |
| 2015-08-03 06:30:00 | 11.431 |
| 2015-08-03 06:45:00 | 11.431 |
| 2015-08-03 07:00:00 | 11.431 |
| 2015-08-03 07:15:00 | 11.431 |
| 2015-08-03 07:30:00 | 11.431 |
| 2015-08-03 07:45:00 | 11.431 |
| 2015-08-03 08:00:00 | 11.431 |
| 2015-08-03 08:15:00 | 11.431 |
| 2015-08-03 08:30:00 | 11.528 |
| 2015-08-03 08:45:00 | 11.528 |
| 2015-08-03 09:00:00 | 11.528 |
| 2015-08-03 09:15:00 | 11.528 |
| 2015-08-03 09:30:00 | 11.528 |
| 2015-08-03 09:45:00 | 11.528 |
| 2015-08-03 10:00:00 | 11.528 |
| 2015-08-03 10:15:00 | 11.528 |
| 2015-08-03 10:30:00 | 11.528 |
| 2015-08-03 10:45:00 | 11.528 |
| 2015-08-03 11:00:00 | 11.528 |
| 2015-08-03 11:15:00 | 11.625 |
| 2015-08-03 11:30:00 | 11.625 |
| 2015-08-03 11:45:00 | 11.625 |
| 2015-08-03 12:00:00 | 11.625 |
| 2015-08-03 12:15:00 | 11.625 |
| 2015-08-03 12:30:00 | 11.625 |
| 2015-08-03 12:45:00 | 11.625 |
| 2015-08-03 13:00:00 | 11.625 |
| 2015-08-03 13:15:00 | 11.625 |
| 2015-08-03 13:30:00 | 11.722 |
| 2015-08-03 13:45:00 | 11.722 |
| 2015-08-03 14:00:00 | 11.722 |
| 2015-08-03 14:15:00 | 11.722 |
| 2015-08-03 14:30:00 | 11.722 |
| 2015-08-03 14:45:00 | 11.722 |
| 2015-08-03 15:00:00 | 11.722 |
| 2015-08-03 15:15:00 | 11.722 |
| 2015-08-03 15:30:00 | 11.722 |
| 2015-08-03 15:45:00 | 11.722 |
| 2015-08-03 16:00:00 | 11.722 |
| 2015-08-03 16:15:00 | 11.722 |
| 2015-08-03 16:30:00 | 11.722 |
| 2015-08-03 16:45:00 | 11.722 |
| 2015-08-03 17:00:00 | 11.722 |
| 2015-08-03 17:15:00 | 11.722 |
| 2015-08-03 17:30:00 | 11.722 |
| 2015-08-03 17:45:00 | 11.722 |
| 2015-08-03 18:00:00 | 11.722 |
| 2015-08-03 18:15:00 | 11.625 |
| 2015-08-03 18:30:00 | 11.722 |
| 2015-08-03 18:45:00 | 11.625 |
| 2015-08-03 19:00:00 | 11.625 |
| 2015-08-03 19:15:00 | 11.625 |
| 2015-08-03 19:30:00 | 11.625 |
| 2015-08-03 19:45:00 | 11.625 |
| 2015-08-03 20:00:00 | 11.625 |
| 2015-08-03 20:15:00 | 11.625 |
| 2015-08-03 20:30:00 | 11.625 |
| 2015-08-03 20:45:00 | 11.625 |
| 2015-08-03 21:00:00 | 11.625 |
| 2015-08-03 21:15:00 | 11.625 |
| 2015-08-03 21:30:00 | 11.625 |
| 2015-08-03 21:45:00 | 11.528 |
| 2015-08-03 22:00:00 | 11.528 |
| 2015-08-03 22:15:00 | 11.528 |
| 2015-08-03 22:30:00 | 11.528 |
| 2015-08-03 22:45:00 | 11.528 |
| 2015-08-03 23:00:00 | 11.528 |
| 2015-08-03 23:15:00 | 11.528 |
| 2015-08-03 23:30:00 | 11.528 |
| 2015-08-03 23:45:00 | 11.528 |
| 2015-08-04 | 11.528 |
| 2015-08-04 00:15:00 | 11.528 |
| 2015-08-04 00:30:00 | 11.528 |
| 2015-08-04 00:45:00 | 11.528 |
| 2015-08-04 01:00:00 | 11.431 |
| 2015-08-04 01:15:00 | 11.528 |
| 2015-08-04 01:30:00 | 11.431 |
| 2015-08-04 01:45:00 | 11.431 |
| 2015-08-04 02:00:00 | 11.431 |
| 2015-08-04 02:15:00 | 11.431 |
| 2015-08-04 02:30:00 | 11.431 |
| 2015-08-04 02:45:00 | 11.431 |
| 2015-08-04 03:00:00 | 11.431 |
| 2015-08-04 03:15:00 | 11.431 |
| 2015-08-04 03:30:00 | 11.431 |
| 2015-08-04 03:45:00 | 11.334 |
| 2015-08-04 04:00:00 | 11.334 |
| 2015-08-04 04:15:00 | 11.334 |
| 2015-08-04 04:30:00 | 11.334 |
| 2015-08-04 04:45:00 | 11.334 |
| 2015-08-04 05:00:00 | 11.334 |
| 2015-08-04 05:15:00 | 11.334 |
| 2015-08-04 05:30:00 | 11.236 |
| 2015-08-04 05:45:00 | 11.236 |
| 2015-08-04 06:00:00 | 11.236 |
| 2015-08-04 06:15:00 | 11.236 |
| 2015-08-04 06:30:00 | 11.236 |
| 2015-08-04 06:45:00 | 11.236 |
| 2015-08-04 07:00:00 | 11.236 |
| 2015-08-04 07:15:00 | 11.334 |
| 2015-08-04 07:30:00 | 11.334 |
| 2015-08-04 07:45:00 | 11.334 |
| 2015-08-04 08:00:00 | 11.334 |
| 2015-08-04 08:15:00 | 11.334 |
| 2015-08-04 08:30:00 | 11.334 |
| 2015-08-04 08:45:00 | 11.334 |
| 2015-08-04 09:00:00 | 11.431 |
| 2015-08-04 09:15:00 | 11.431 |
| 2015-08-04 09:30:00 | 11.431 |
| 2015-08-04 09:45:00 | 11.431 |
| 2015-08-04 10:00:00 | 11.431 |
| 2015-08-04 10:15:00 | 11.431 |
| 2015-08-04 10:30:00 | 11.528 |
| 2015-08-04 10:45:00 | 11.528 |
| 2015-08-04 11:00:00 | 11.528 |
| 2015-08-04 11:15:00 | 11.528 |
| 2015-08-04 11:30:00 | 11.528 |
| 2015-08-04 11:45:00 | 11.528 |
| 2015-08-04 12:00:00 | 11.528 |
| 2015-08-04 12:15:00 | 11.528 |
| 2015-08-04 12:30:00 | 11.625 |
| 2015-08-04 12:45:00 | 11.625 |
| 2015-08-04 13:00:00 | 11.625 |
| 2015-08-04 13:15:00 | 11.625 |
| 2015-08-04 13:30:00 | 11.625 |
| 2015-08-04 13:45:00 | 11.625 |
| 2015-08-04 14:00:00 | 11.625 |
| 2015-08-04 14:15:00 | 11.625 |
| 2015-08-04 14:30:00 | 11.625 |
| 2015-08-04 14:45:00 | 11.625 |
| 2015-08-04 15:00:00 | 11.625 |
| 2015-08-04 15:15:00 | 11.722 |
| 2015-08-04 15:30:00 | 11.722 |
| 2015-08-04 15:45:00 | 11.722 |
| 2015-08-04 16:00:00 | 11.722 |
| 2015-08-04 16:15:00 | 11.722 |
| 2015-08-04 16:30:00 | 11.722 |
| 2015-08-04 16:45:00 | 11.722 |
| 2015-08-04 17:00:00 | 11.722 |
| 2015-08-04 17:15:00 | 11.625 |
| 2015-08-04 17:30:00 | 11.625 |
| 2015-08-04 17:45:00 | 11.625 |
| 2015-08-04 18:00:00 | 11.625 |
| 2015-08-04 18:15:00 | 11.625 |
| 2015-08-04 18:30:00 | 11.625 |
| 2015-08-04 18:45:00 | 11.625 |
| 2015-08-04 19:00:00 | 11.625 |
| 2015-08-04 19:15:00 | 11.625 |
| 2015-08-04 19:30:00 | 11.625 |
| 2015-08-04 19:45:00 | 11.625 |
| 2015-08-04 20:00:00 | 11.625 |
| 2015-08-04 20:15:00 | 11.528 |
| 2015-08-04 20:30:00 | 11.528 |
| 2015-08-04 20:45:00 | 11.528 |
| 2015-08-04 21:00:00 | 11.528 |
| 2015-08-04 21:15:00 | 11.528 |
| 2015-08-04 21:30:00 | 11.528 |
| 2015-08-04 21:45:00 | 11.528 |
| 2015-08-04 22:00:00 | 11.528 |
| 2015-08-04 22:15:00 | 11.528 |
| 2015-08-04 22:30:00 | 11.431 |
| 2015-08-04 22:45:00 | 11.431 |
| 2015-08-04 23:00:00 | 11.431 |
| 2015-08-04 23:15:00 | 11.431 |
| 2015-08-04 23:30:00 | 11.431 |
| 2015-08-04 23:45:00 | 11.431 |
| 2015-08-05 | 11.431 |
| 2015-08-05 00:15:00 | 11.431 |
| 2015-08-05 00:30:00 | 11.431 |
| 2015-08-05 00:45:00 | 11.431 |
| 2015-08-05 01:00:00 | 11.431 |
| 2015-08-05 01:15:00 | 11.431 |
| 2015-08-05 01:30:00 | 11.431 |
| 2015-08-05 01:45:00 | 11.431 |
| 2015-08-05 02:00:00 | 11.431 |
| 2015-08-05 02:15:00 | 11.431 |
| 2015-08-05 02:30:00 | 11.431 |
| 2015-08-05 02:45:00 | 11.431 |
| 2015-08-05 03:00:00 | 11.431 |
| 2015-08-05 03:15:00 | 11.431 |
| 2015-08-05 03:30:00 | 11.431 |
| 2015-08-05 03:45:00 | 11.431 |
| 2015-08-05 04:00:00 | 11.431 |
| 2015-08-05 04:15:00 | 11.431 |
| 2015-08-05 04:30:00 | 11.431 |
| 2015-08-05 04:45:00 | 11.431 |
| 2015-08-05 05:00:00 | 11.431 |
| 2015-08-05 05:15:00 | 11.431 |
| 2015-08-05 05:30:00 | 11.431 |
| 2015-08-05 05:45:00 | 11.431 |
| 2015-08-05 06:00:00 | 11.431 |
| 2015-08-05 06:15:00 | 11.431 |
| 2015-08-05 06:30:00 | 11.431 |
| 2015-08-05 06:45:00 | 11.431 |
| 2015-08-05 07:00:00 | 11.431 |
| 2015-08-05 07:15:00 | 11.431 |
| 2015-08-05 07:30:00 | 11.431 |
| 2015-08-05 07:45:00 | 11.431 |
| 2015-08-05 08:00:00 | 11.431 |
| 2015-08-05 08:15:00 | 11.431 |
| 2015-08-05 08:30:00 | 11.431 |
| 2015-08-05 08:45:00 | 11.431 |
| 2015-08-05 09:00:00 | 11.431 |
| 2015-08-05 09:15:00 | 11.431 |
| 2015-08-05 09:30:00 | 11.528 |
| 2015-08-05 09:45:00 | 11.528 |
| 2015-08-05 10:00:00 | 11.528 |
| 2015-08-05 10:15:00 | 11.528 |
| 2015-08-05 10:30:00 | 11.528 |
| 2015-08-05 10:45:00 | 11.528 |
| 2015-08-05 11:00:00 | 11.528 |
| 2015-08-05 11:15:00 | 11.528 |
| 2015-08-05 11:30:00 | 11.528 |
| 2015-08-05 11:45:00 | 11.528 |
| 2015-08-05 12:00:00 | 11.528 |
| 2015-08-05 12:15:00 | 11.528 |
| 2015-08-05 12:30:00 | 11.528 |
| 2015-08-05 12:45:00 | 11.625 |
| 2015-08-05 13:00:00 | 11.625 |
| 2015-08-05 13:15:00 | 11.625 |
| 2015-08-05 13:30:00 | 11.625 |
| 2015-08-05 13:45:00 | 11.625 |
| 2015-08-05 14:00:00 | 11.625 |
| 2015-08-05 14:15:00 | 11.625 |
| 2015-08-05 14:30:00 | 11.625 |
| 2015-08-05 14:45:00 | 11.625 |
| 2015-08-05 15:00:00 | 11.625 |
| 2015-08-05 15:15:00 | 11.625 |
| 2015-08-05 15:30:00 | 11.625 |
| 2015-08-05 15:45:00 | 11.528 |
| 2015-08-05 16:00:00 | 11.625 |
| 2015-08-05 16:15:00 | 11.625 |
| 2015-08-05 16:30:00 | 11.625 |
| 2015-08-05 16:45:00 | 11.528 |
| 2015-08-05 17:00:00 | 11.625 |
| 2015-08-05 17:15:00 | 11.528 |
| 2015-08-05 17:30:00 | 11.528 |
| 2015-08-05 17:45:00 | 11.528 |
| 2015-08-05 18:00:00 | 11.528 |
| 2015-08-05 18:15:00 | 11.528 |
| 2015-08-05 18:30:00 | 11.528 |
| 2015-08-05 18:45:00 | 11.528 |
| 2015-08-05 19:00:00 | 11.528 |
| 2015-08-05 19:15:00 | 11.528 |
| 2015-08-05 19:30:00 | 11.528 |
| 2015-08-05 19:45:00 | 11.528 |
| 2015-08-05 20:00:00 | 11.528 |
| 2015-08-05 20:15:00 | 11.528 |
| 2015-08-05 20:30:00 | 11.528 |
| 2015-08-05 20:45:00 | 11.528 |
| 2015-08-05 21:00:00 | 11.528 |
| 2015-08-05 21:15:00 | 11.528 |
| 2015-08-05 21:30:00 | 11.528 |
| 2015-08-05 21:45:00 | 11.528 |
| 2015-08-05 22:00:00 | 11.528 |
| 2015-08-05 22:15:00 | 11.528 |
| 2015-08-05 22:30:00 | 11.528 |
| 2015-08-05 22:45:00 | 11.431 |
| 2015-08-05 23:00:00 | 11.528 |
| 2015-08-05 23:15:00 | 11.431 |
| 2015-08-05 23:30:00 | 11.431 |
| 2015-08-05 23:45:00 | 11.431 |
| 2015-08-06 | 11.431 |
| 2015-08-06 00:15:00 | 11.431 |
| 2015-08-06 00:30:00 | 11.431 |
| 2015-08-06 00:45:00 | 11.431 |
| 2015-08-06 01:00:00 | 11.431 |
| 2015-08-06 01:15:00 | 11.431 |
| 2015-08-06 01:30:00 | 11.431 |
| 2015-08-06 01:45:00 | 11.431 |
| 2015-08-06 02:00:00 | 11.431 |
| 2015-08-06 02:15:00 | 11.431 |
| 2015-08-06 02:30:00 | 11.431 |
| 2015-08-06 02:45:00 | 11.431 |
| 2015-08-06 03:00:00 | 11.431 |
| 2015-08-06 03:15:00 | 11.431 |
| 2015-08-06 03:30:00 | 11.431 |
| 2015-08-06 03:45:00 | 11.431 |
| 2015-08-06 04:00:00 | 11.431 |
| 2015-08-06 04:15:00 | 11.431 |
| 2015-08-06 04:30:00 | 11.431 |
| 2015-08-06 04:45:00 | 11.431 |
| 2015-08-06 05:00:00 | 11.431 |
| 2015-08-06 05:15:00 | 11.431 |
| 2015-08-06 05:30:00 | 11.431 |
| 2015-08-06 05:45:00 | 11.528 |
| 2015-08-06 06:00:00 | 11.431 |
| 2015-08-06 06:15:00 | 11.528 |
| 2015-08-06 06:30:00 | 11.431 |
| 2015-08-06 06:45:00 | 11.431 |
| 2015-08-06 07:00:00 | 11.431 |
| 2015-08-06 07:15:00 | 11.528 |
| 2015-08-06 07:30:00 | 11.528 |
| 2015-08-06 07:45:00 | 11.528 |
| 2015-08-06 08:00:00 | 11.528 |
| 2015-08-06 08:15:00 | 11.528 |
| 2015-08-06 08:30:00 | 11.528 |
| 2015-08-06 08:45:00 | 11.528 |
| 2015-08-06 09:00:00 | 11.528 |
| 2015-08-06 09:15:00 | 11.528 |
| 2015-08-06 09:30:00 | 11.528 |
| 2015-08-06 09:45:00 | 11.528 |
| 2015-08-06 10:00:00 | 11.528 |
| 2015-08-06 10:15:00 | 11.528 |
| 2015-08-06 10:30:00 | 11.528 |
| 2015-08-06 10:45:00 | 11.528 |
| 2015-08-06 11:00:00 | 11.528 |
| 2015-08-06 11:15:00 | 11.625 |
| 2015-08-06 11:30:00 | 11.625 |
| 2015-08-06 11:45:00 | 11.625 |
| 2015-08-06 12:00:00 | 11.625 |
| 2015-08-06 12:15:00 | 11.625 |
| 2015-08-06 12:30:00 | 11.625 |
| 2015-08-06 12:45:00 | 11.625 |
| 2015-08-06 13:00:00 | 11.625 |
| 2015-08-06 13:15:00 | 11.625 |
| 2015-08-06 13:30:00 | 11.625 |
| 2015-08-06 13:45:00 | 11.625 |
| 2015-08-06 14:00:00 | 11.625 |
| 2015-08-06 14:15:00 | 11.722 |
| 2015-08-06 14:30:00 | 11.722 |
| 2015-08-06 14:45:00 | 11.722 |
| 2015-08-06 15:00:00 | 11.722 |
| 2015-08-06 15:15:00 | 11.722 |
| 2015-08-06 15:30:00 | 11.722 |
| 2015-08-06 15:45:00 | 11.722 |
| 2015-08-06 16:00:00 | 11.722 |
| 2015-08-06 16:15:00 | 11.722 |
| 2015-08-06 16:30:00 | 11.722 |
| 2015-08-06 16:45:00 | 11.722 |
| 2015-08-06 17:00:00 | 11.722 |
| 2015-08-06 17:15:00 | 11.722 |
| 2015-08-06 17:30:00 | 11.722 |
| 2015-08-06 17:45:00 | 11.722 |
| 2015-08-06 18:00:00 | 11.722 |
| 2015-08-06 18:15:00 | 11.722 |
| 2015-08-06 18:30:00 | 11.722 |
| 2015-08-06 18:45:00 | 11.625 |
| 2015-08-06 19:00:00 | 11.625 |
| 2015-08-06 19:15:00 | 11.625 |
| 2015-08-06 19:30:00 | 11.625 |
| 2015-08-06 19:45:00 | 11.625 |
| 2015-08-06 20:00:00 | 11.625 |
| 2015-08-06 20:15:00 | 11.625 |
| 2015-08-06 20:30:00 | 11.625 |
| 2015-08-06 20:45:00 | 11.625 |
| 2015-08-06 21:00:00 | 11.625 |
| 2015-08-06 21:15:00 | 11.528 |
| 2015-08-06 21:30:00 | 11.528 |
| 2015-08-06 21:45:00 | 11.528 |
| 2015-08-06 22:00:00 | 11.528 |
| 2015-08-06 22:15:00 | 11.528 |
| 2015-08-06 22:30:00 | 11.528 |
| 2015-08-06 22:45:00 | 11.528 |
| 2015-08-06 23:00:00 | 11.431 |
| 2015-08-06 23:15:00 | 11.431 |
| 2015-08-06 23:30:00 | 11.431 |
| 2015-08-06 23:45:00 | 11.431 |
| 2015-08-07 | 11.431 |
| 2015-08-07 00:15:00 | 11.431 |
| 2015-08-07 00:30:00 | 11.431 |
| 2015-08-07 00:45:00 | 11.431 |
| 2015-08-07 01:00:00 | 11.431 |
| 2015-08-07 01:15:00 | 11.431 |
| 2015-08-07 01:30:00 | 11.334 |
| 2015-08-07 01:45:00 | 11.334 |
| 2015-08-07 02:00:00 | 11.334 |
| 2015-08-07 02:15:00 | 11.334 |
| 2015-08-07 02:30:00 | 11.334 |
| 2015-08-07 02:45:00 | 11.334 |
| 2015-08-07 03:00:00 | 11.334 |
| 2015-08-07 03:15:00 | 11.334 |
| 2015-08-07 03:30:00 | 11.334 |
| 2015-08-07 03:45:00 | 11.236 |
| 2015-08-07 04:00:00 | 11.236 |
| 2015-08-07 04:15:00 | 11.236 |
| 2015-08-07 04:30:00 | 11.236 |
| 2015-08-07 04:45:00 | 11.236 |
| 2015-08-07 05:00:00 | 11.236 |
| 2015-08-07 05:15:00 | 11.236 |
| 2015-08-07 05:30:00 | 11.236 |
| 2015-08-07 05:45:00 | 11.236 |
| 2015-08-07 06:00:00 | 11.236 |
| 2015-08-07 06:15:00 | 11.236 |
| 2015-08-07 06:30:00 | 11.236 |
| 2015-08-07 06:45:00 | 11.236 |
| 2015-08-07 07:00:00 | 11.236 |
| 2015-08-07 07:15:00 | 11.236 |
| 2015-08-07 07:30:00 | 11.334 |
| 2015-08-07 07:45:00 | 11.334 |
| 2015-08-07 08:00:00 | 11.334 |
| 2015-08-07 08:15:00 | 11.334 |
| 2015-08-07 08:30:00 | 11.334 |
| 2015-08-07 08:45:00 | 11.334 |
| 2015-08-07 09:00:00 | 11.334 |
| 2015-08-07 09:15:00 | 11.334 |
| 2015-08-07 09:30:00 | 11.431 |
| 2015-08-07 09:45:00 | 11.431 |
| 2015-08-07 10:00:00 | 11.431 |
| 2015-08-07 10:15:00 | 11.431 |
| 2015-08-07 10:30:00 | 11.431 |
| 2015-08-07 10:45:00 | 11.431 |
| 2015-08-07 11:00:00 | 11.528 |
| 2015-08-07 11:15:00 | 11.528 |
| 2015-08-07 11:30:00 | 11.528 |
| 2015-08-07 11:45:00 | 11.528 |
| 2015-08-07 12:00:00 | 11.625 |
| 2015-08-07 12:15:00 | 11.625 |
| 2015-08-07 12:30:00 | 11.625 |
| 2015-08-07 12:45:00 | 11.625 |
| 2015-08-07 13:00:00 | 11.625 |
| 2015-08-07 13:15:00 | 11.625 |
| 2015-08-07 13:30:00 | 11.722 |
| 2015-08-07 13:45:00 | 11.722 |
| 2015-08-07 14:00:00 | 11.722 |
| 2015-08-07 14:15:00 | 11.722 |
| 2015-08-07 14:30:00 | 11.722 |
| 2015-08-07 14:45:00 | 11.819 |
| 2015-08-07 15:00:00 | 11.819 |
| 2015-08-07 15:15:00 | 11.722 |
| 2015-08-07 15:30:00 | 11.722 |
| 2015-08-07 15:45:00 | 11.722 |
| 2015-08-07 16:00:00 | 11.722 |
| 2015-08-07 16:15:00 | 11.722 |
| 2015-08-07 16:30:00 | 11.819 |
| 2015-08-07 16:45:00 | 11.819 |
| 2015-08-07 17:00:00 | 11.819 |
| 2015-08-07 17:15:00 | 11.722 |
| 2015-08-07 17:30:00 | 11.722 |
| 2015-08-07 17:45:00 | 11.722 |
| 2015-08-07 18:00:00 | 11.722 |
| 2015-08-07 18:15:00 | 11.722 |
| 2015-08-07 18:30:00 | 11.722 |
| 2015-08-07 18:45:00 | 11.722 |
| 2015-08-07 19:00:00 | 11.625 |
| 2015-08-07 19:15:00 | 11.625 |
| 2015-08-07 19:30:00 | 11.625 |
| 2015-08-07 19:45:00 | 11.625 |
| 2015-08-07 20:00:00 | 11.625 |
| 2015-08-07 20:15:00 | 11.625 |
| 2015-08-07 20:30:00 | 11.625 |
| 2015-08-07 20:45:00 | 11.625 |
| 2015-08-07 21:00:00 | 11.625 |
| 2015-08-07 21:15:00 | 11.528 |
| 2015-08-07 21:30:00 | 11.528 |
| 2015-08-07 21:45:00 | 11.528 |
| 2015-08-07 22:00:00 | 11.528 |
| 2015-08-07 22:15:00 | 11.528 |
| 2015-08-07 22:30:00 | 11.528 |
| 2015-08-07 22:45:00 | 11.528 |
| 2015-08-07 23:00:00 | 11.528 |
| 2015-08-07 23:15:00 | 11.528 |
| 2015-08-07 23:30:00 | 11.431 |
| 2015-08-07 23:45:00 | 11.431 |
| 2015-08-08 | 11.431 |
| 2015-08-08 00:15:00 | 11.431 |
| 2015-08-08 00:30:00 | 11.431 |
| 2015-08-08 00:45:00 | 11.431 |
| 2015-08-08 01:00:00 | 11.431 |
| 2015-08-08 01:15:00 | 11.431 |
| 2015-08-08 01:30:00 | 11.431 |
| 2015-08-08 01:45:00 | 11.334 |
| 2015-08-08 02:00:00 | 11.334 |
| 2015-08-08 02:15:00 | 11.334 |
| 2015-08-08 02:30:00 | 11.334 |
| 2015-08-08 02:45:00 | 11.334 |
| 2015-08-08 03:00:00 | 11.334 |
| 2015-08-08 03:15:00 | 11.334 |
| 2015-08-08 03:30:00 | 11.334 |
| 2015-08-08 03:45:00 | 11.334 |
| 2015-08-08 04:00:00 | 11.334 |
| 2015-08-08 04:15:00 | 11.236 |
| 2015-08-08 04:30:00 | 11.236 |
| 2015-08-08 04:45:00 | 11.236 |
| 2015-08-08 05:00:00 | 11.236 |
| 2015-08-08 05:15:00 | 11.236 |
| 2015-08-08 05:30:00 | 11.236 |
| 2015-08-08 05:45:00 | 11.236 |
| 2015-08-08 06:00:00 | 11.236 |
| 2015-08-08 06:15:00 | 11.236 |
| 2015-08-08 06:30:00 | 11.236 |
| 2015-08-08 06:45:00 | 11.236 |
| 2015-08-08 07:00:00 | 11.236 |
| 2015-08-08 07:15:00 | 11.236 |
| 2015-08-08 07:30:00 | 11.236 |
| 2015-08-08 07:45:00 | 11.334 |
| 2015-08-08 08:00:00 | 11.334 |
| 2015-08-08 08:15:00 | 11.334 |
| 2015-08-08 08:30:00 | 11.334 |
| 2015-08-08 08:45:00 | 11.334 |
| 2015-08-08 09:00:00 | 11.431 |
| 2015-08-08 09:15:00 | 11.431 |
| 2015-08-08 09:30:00 | 11.431 |
| 2015-08-08 09:45:00 | 11.431 |
| 2015-08-08 10:00:00 | 11.431 |
| 2015-08-08 10:15:00 | 11.431 |
| 2015-08-08 10:30:00 | 11.431 |
| 2015-08-08 10:45:00 | 11.528 |
| 2015-08-08 11:00:00 | 11.528 |
| 2015-08-08 11:15:00 | 11.528 |
| 2015-08-08 11:30:00 | 11.528 |
| 2015-08-08 11:45:00 | 11.528 |
| 2015-08-08 12:00:00 | 11.625 |
| 2015-08-08 12:15:00 | 11.625 |
| 2015-08-08 12:30:00 | 11.625 |
| 2015-08-08 12:45:00 | 11.722 |
| 2015-08-08 13:00:00 | 11.722 |
| 2015-08-08 13:15:00 | 11.722 |
| 2015-08-08 13:30:00 | 11.722 |
| 2015-08-08 13:45:00 | 11.722 |
| 2015-08-08 14:00:00 | 11.722 |
| 2015-08-08 14:15:00 | 11.722 |
| 2015-08-08 14:30:00 | 11.722 |
| 2015-08-08 14:45:00 | 11.819 |
| 2015-08-08 15:00:00 | 11.819 |
| 2015-08-08 15:15:00 | 11.819 |
| 2015-08-08 15:30:00 | 11.819 |
| 2015-08-08 15:45:00 | 11.819 |
| 2015-08-08 16:00:00 | 11.819 |
| 2015-08-08 16:15:00 | 11.819 |
| 2015-08-08 16:30:00 | 11.819 |
| 2015-08-08 16:45:00 | 11.819 |
| 2015-08-08 17:00:00 | 11.819 |
| 2015-08-08 17:15:00 | 11.819 |
| 2015-08-08 17:30:00 | 11.722 |
| 2015-08-08 17:45:00 | 11.722 |
| 2015-08-08 18:00:00 | 11.722 |
| 2015-08-08 18:15:00 | 11.722 |
| 2015-08-08 18:30:00 | 11.722 |
| 2015-08-08 18:45:00 | 11.722 |
| 2015-08-08 19:00:00 | 11.722 |
| 2015-08-08 19:15:00 | 11.722 |
| 2015-08-08 19:30:00 | 11.625 |
| 2015-08-08 19:45:00 | 11.625 |
| 2015-08-08 20:00:00 | 11.625 |
| 2015-08-08 20:15:00 | 11.625 |
| 2015-08-08 20:30:00 | 11.625 |
| 2015-08-08 20:45:00 | 11.625 |
| 2015-08-08 21:00:00 | 11.625 |
| 2015-08-08 21:15:00 | 11.625 |
| 2015-08-08 21:30:00 | 11.528 |
| 2015-08-08 21:45:00 | 11.528 |
| 2015-08-08 22:00:00 | 11.528 |
| 2015-08-08 22:15:00 | 11.528 |
| 2015-08-08 22:30:00 | 11.528 |
| 2015-08-08 22:45:00 | 11.528 |
| 2015-08-08 23:00:00 | 11.528 |
| 2015-08-08 23:15:00 | 11.431 |
| 2015-08-08 23:30:00 | 11.431 |
| 2015-08-08 23:45:00 | 11.431 |
| 2015-08-09 | 11.431 |
| 2015-08-09 00:15:00 | 11.431 |
| 2015-08-09 00:30:00 | 11.431 |
| 2015-08-09 00:45:00 | 11.431 |
| 2015-08-09 01:00:00 | 11.334 |
| 2015-08-09 01:15:00 | 11.334 |
| 2015-08-09 01:30:00 | 11.334 |
| 2015-08-09 01:45:00 | 11.334 |
| 2015-08-09 02:00:00 | 11.334 |
| 2015-08-09 02:15:00 | 11.334 |
| 2015-08-09 02:30:00 | 11.334 |
| 2015-08-09 02:45:00 | 11.334 |
| 2015-08-09 03:00:00 | 11.236 |
| 2015-08-09 03:15:00 | 11.334 |
| 2015-08-09 03:30:00 | 11.236 |
| 2015-08-09 03:45:00 | 11.236 |
| 2015-08-09 04:00:00 | 11.236 |
| 2015-08-09 04:15:00 | 11.236 |
| 2015-08-09 04:30:00 | 11.236 |
| 2015-08-09 04:45:00 | 11.236 |
| 2015-08-09 05:00:00 | 11.236 |
| 2015-08-09 05:15:00 | 11.236 |
| 2015-08-09 05:30:00 | 11.236 |
| 2015-08-09 05:45:00 | 11.236 |
| 2015-08-09 06:00:00 | 11.236 |
| 2015-08-09 06:15:00 | 11.236 |
| 2015-08-09 06:30:00 | 11.236 |
| 2015-08-09 06:45:00 | 11.236 |
| 2015-08-09 07:00:00 | 11.236 |
| 2015-08-09 07:15:00 | 11.236 |
| 2015-08-09 07:30:00 | 11.236 |
| 2015-08-09 07:45:00 | 11.236 |
| 2015-08-09 08:00:00 | 11.236 |
| 2015-08-09 08:15:00 | 11.236 |
| 2015-08-09 08:30:00 | 11.334 |
| 2015-08-09 08:45:00 | 11.334 |
| 2015-08-09 09:00:00 | 11.334 |
| 2015-08-09 09:15:00 | 11.431 |
| 2015-08-09 09:30:00 | 11.431 |
| 2015-08-09 09:45:00 | 11.431 |
| 2015-08-09 10:00:00 | 11.431 |
| 2015-08-09 10:15:00 | 11.431 |
| 2015-08-09 10:30:00 | 11.431 |
| 2015-08-09 10:45:00 | 11.528 |
| 2015-08-09 11:00:00 | 11.528 |
| 2015-08-09 11:15:00 | 11.528 |
| 2015-08-09 11:30:00 | 11.528 |
| 2015-08-09 11:45:00 | 11.625 |
| 2015-08-09 12:00:00 | 11.625 |
| 2015-08-09 12:15:00 | 11.625 |
| 2015-08-09 12:30:00 | 11.625 |
| 2015-08-09 12:45:00 | 11.625 |
| 2015-08-09 13:00:00 | 11.625 |
| 2015-08-09 13:15:00 | 11.722 |
| 2015-08-09 13:30:00 | 11.722 |
| 2015-08-09 13:45:00 | 11.722 |
| 2015-08-09 14:00:00 | 11.722 |
| 2015-08-09 14:15:00 | 11.722 |
| 2015-08-09 14:30:00 | 11.722 |
| 2015-08-09 14:45:00 | 11.819 |
| 2015-08-09 15:00:00 | 11.819 |
| 2015-08-09 15:15:00 | 11.819 |
| 2015-08-09 15:30:00 | 11.819 |
| 2015-08-09 15:45:00 | 11.722 |
| 2015-08-09 16:00:00 | 11.722 |
| 2015-08-09 16:15:00 | 11.722 |
| 2015-08-09 16:30:00 | 11.722 |
| 2015-08-09 16:45:00 | 11.722 |
| 2015-08-09 17:00:00 | 11.722 |
| 2015-08-09 17:15:00 | 11.722 |
| 2015-08-09 17:30:00 | 11.722 |
| 2015-08-09 17:45:00 | 11.722 |
| 2015-08-09 18:00:00 | 11.722 |
| 2015-08-09 18:15:00 | 11.722 |
| 2015-08-09 18:30:00 | 11.722 |
| 2015-08-09 18:45:00 | 11.722 |
| 2015-08-09 19:00:00 | 11.722 |
| 2015-08-09 19:15:00 | 11.722 |
| 2015-08-09 19:30:00 | 11.625 |
| 2015-08-09 19:45:00 | 11.625 |
| 2015-08-09 20:00:00 | 11.625 |
| 2015-08-09 20:15:00 | 11.625 |
| 2015-08-09 20:30:00 | 11.625 |
| 2015-08-09 20:45:00 | 11.625 |
| 2015-08-09 21:00:00 | 11.625 |
| 2015-08-09 21:15:00 | 11.625 |
| 2015-08-09 21:30:00 | 11.625 |
| 2015-08-09 21:45:00 | 11.625 |
| 2015-08-09 22:00:00 | 11.625 |
| 2015-08-09 22:15:00 | 11.528 |
| 2015-08-09 22:30:00 | 11.528 |
| 2015-08-09 22:45:00 | 11.528 |
| 2015-08-09 23:00:00 | 11.528 |
| 2015-08-09 23:15:00 | 11.528 |
| 2015-08-09 23:30:00 | 11.528 |
| 2015-08-09 23:45:00 | 11.528 |
| 2015-08-10 | 11.528 |
| 2015-08-10 00:15:00 | 11.528 |
| 2015-08-10 00:30:00 | 11.528 |
| 2015-08-10 00:45:00 | 11.528 |
| 2015-08-10 01:00:00 | 11.528 |
| 2015-08-10 01:15:00 | 11.528 |
| 2015-08-10 01:30:00 | 11.528 |
| 2015-08-10 01:45:00 | 11.528 |
| 2015-08-10 02:00:00 | 11.528 |
| 2015-08-10 02:15:00 | 11.528 |
| 2015-08-10 02:30:00 | 11.528 |
| 2015-08-10 02:45:00 | 11.528 |
| 2015-08-10 03:00:00 | 11.528 |
| 2015-08-10 03:15:00 | 11.528 |
| 2015-08-10 03:30:00 | 11.528 |
| 2015-08-10 03:45:00 | 11.528 |
| 2015-08-10 04:00:00 | 11.528 |
| 2015-08-10 04:15:00 | 11.528 |
| 2015-08-10 04:30:00 | 11.528 |
| 2015-08-10 04:45:00 | 11.528 |
| 2015-08-10 05:00:00 | 11.528 |
| 2015-08-10 05:15:00 | 11.528 |
| 2015-08-10 05:30:00 | 11.528 |
| 2015-08-10 05:45:00 | 11.528 |
| 2015-08-10 06:00:00 | 11.528 |
| 2015-08-10 06:15:00 | 11.528 |
| 2015-08-10 06:30:00 | 11.528 |
| 2015-08-10 06:45:00 | 11.528 |
| 2015-08-10 07:00:00 | 11.528 |
| 2015-08-10 07:15:00 | 11.528 |
| 2015-08-10 07:30:00 | 11.528 |
| 2015-08-10 07:45:00 | 11.528 |
| 2015-08-10 08:00:00 | 11.528 |
| 2015-08-10 08:15:00 | 11.528 |
| 2015-08-10 08:30:00 | 11.528 |
| 2015-08-10 08:45:00 | 11.528 |
| 2015-08-10 09:00:00 | 11.528 |
| 2015-08-10 09:15:00 | 11.528 |
| 2015-08-10 09:30:00 | 11.528 |
| 2015-08-10 09:45:00 | 11.528 |
| 2015-08-10 10:00:00 | 11.528 |
| 2015-08-10 10:15:00 | 11.528 |
| 2015-08-10 10:30:00 | 11.528 |
| 2015-08-10 10:45:00 | 11.528 |
| 2015-08-10 11:00:00 | 11.528 |
| 2015-08-10 11:15:00 | 11.528 |
| 2015-08-10 11:30:00 | 11.528 |
| 2015-08-10 11:45:00 | 11.528 |
| 2015-08-10 12:00:00 | 11.528 |
| 2015-08-10 12:15:00 | 11.528 |
| 2015-08-10 12:30:00 | 11.528 |
| 2015-08-10 12:45:00 | 11.528 |
| 2015-08-10 13:00:00 | 11.528 |
| 2015-08-10 13:15:00 | 11.528 |
| 2015-08-10 13:30:00 | 11.625 |
| 2015-08-10 13:45:00 | 11.528 |
| 2015-08-10 14:00:00 | 11.528 |
| 2015-08-10 14:15:00 | 11.625 |
| 2015-08-10 14:30:00 | 11.625 |
| 2015-08-10 14:45:00 | 11.625 |
| 2015-08-10 15:00:00 | 11.625 |
| 2015-08-10 15:15:00 | 11.625 |
| 2015-08-10 15:30:00 | 11.528 |
| 2015-08-10 15:45:00 | 11.625 |
| 2015-08-10 16:00:00 | 11.625 |
| 2015-08-10 16:15:00 | 11.625 |
| 2015-08-10 16:30:00 | 11.625 |
| 2015-08-10 16:45:00 | 11.625 |
| 2015-08-10 17:00:00 | 11.625 |
| 2015-08-10 17:15:00 | 11.625 |
| 2015-08-10 17:30:00 | 11.625 |
| 2015-08-10 17:45:00 | 11.625 |
| 2015-08-10 18:00:00 | 11.625 |
| 2015-08-10 18:15:00 | 11.625 |
| 2015-08-10 18:30:00 | 11.625 |
| 2015-08-10 18:45:00 | 11.625 |
| 2015-08-10 19:00:00 | 11.625 |
| 2015-08-10 19:15:00 | 11.625 |
| 2015-08-10 19:30:00 | 11.528 |
| 2015-08-10 19:45:00 | 11.625 |
| 2015-08-10 20:00:00 | 11.625 |
| 2015-08-10 20:15:00 | 11.528 |
| 2015-08-10 20:30:00 | 11.528 |
| 2015-08-10 20:45:00 | 11.528 |
| 2015-08-10 21:00:00 | 11.528 |
| 2015-08-10 21:15:00 | 11.528 |
| 2015-08-10 21:30:00 | 11.528 |
| 2015-08-10 21:45:00 | 11.528 |
| 2015-08-10 22:00:00 | 11.528 |
| 2015-08-10 22:15:00 | 11.528 |
| 2015-08-10 22:30:00 | 11.528 |
| 2015-08-10 22:45:00 | 11.528 |
| 2015-08-10 23:00:00 | 11.528 |
| 2015-08-10 23:15:00 | 11.431 |
| 2015-08-10 23:30:00 | 11.528 |
| 2015-08-10 23:45:00 | 11.431 |
| 2015-08-11 | 11.431 |
| 2015-08-11 00:15:00 | 11.431 |
| 2015-08-11 00:30:00 | 11.431 |
| 2015-08-11 00:45:00 | 11.431 |
| 2015-08-11 01:00:00 | 11.431 |
| 2015-08-11 01:15:00 | 11.431 |
| 2015-08-11 01:30:00 | 11.431 |
| 2015-08-11 01:45:00 | 11.431 |
| 2015-08-11 02:00:00 | 11.431 |
| 2015-08-11 02:15:00 | 11.431 |
| 2015-08-11 02:30:00 | 11.431 |
| 2015-08-11 02:45:00 | 11.431 |
| 2015-08-11 03:00:00 | 11.431 |
| 2015-08-11 03:15:00 | 11.431 |
| 2015-08-11 03:30:00 | 11.431 |
| 2015-08-11 03:45:00 | 11.431 |
| 2015-08-11 04:00:00 | 11.431 |
| 2015-08-11 04:15:00 | 11.431 |
| 2015-08-11 04:30:00 | 11.431 |
| 2015-08-11 04:45:00 | 11.431 |
| 2015-08-11 05:00:00 | 11.431 |
| 2015-08-11 05:15:00 | 11.431 |
| 2015-08-11 05:30:00 | 11.431 |
| 2015-08-11 05:45:00 | 11.431 |
| 2015-08-11 06:00:00 | 11.431 |
| 2015-08-11 06:15:00 | 11.431 |
| 2015-08-11 06:30:00 | 11.431 |
| 2015-08-11 06:45:00 | 11.431 |
| 2015-08-11 07:00:00 | 11.431 |
| 2015-08-11 07:15:00 | 11.431 |
| 2015-08-11 07:30:00 | 11.431 |
| 2015-08-11 07:45:00 | 11.431 |
| 2015-08-11 08:00:00 | 11.431 |
| 2015-08-11 08:15:00 | 11.431 |
| 2015-08-11 08:30:00 | 11.431 |
| 2015-08-11 08:45:00 | 11.431 |
| 2015-08-11 09:00:00 | 11.431 |
| 2015-08-11 09:15:00 | 11.431 |
| 2015-08-11 09:30:00 | 11.431 |
| 2015-08-11 09:45:00 | 11.431 |
| 2015-08-11 10:00:00 | 11.528 |
| 2015-08-11 10:15:00 | 11.528 |
| 2015-08-11 10:30:00 | 11.528 |
| 2015-08-11 10:45:00 | 11.528 |
| 2015-08-11 11:00:00 | 11.528 |
| 2015-08-11 11:15:00 | 11.528 |
| 2015-08-11 11:30:00 | 11.528 |
| 2015-08-11 11:45:00 | 11.528 |
| 2015-08-11 12:00:00 | 11.528 |
| 2015-08-11 12:15:00 | 11.528 |
| 2015-08-11 12:30:00 | 11.625 |
| 2015-08-11 12:45:00 | 11.625 |
| 2015-08-11 13:00:00 | 11.625 |
| 2015-08-11 13:15:00 | 11.625 |
| 2015-08-11 13:30:00 | 11.625 |
| 2015-08-11 13:45:00 | 11.625 |
| 2015-08-11 14:00:00 | 11.625 |
| 2015-08-11 14:15:00 | 11.625 |
| 2015-08-11 14:30:00 | 11.625 |
| 2015-08-11 14:45:00 | 11.625 |
| 2015-08-11 15:00:00 | 11.625 |
| 2015-08-11 15:15:00 | 11.625 |
| 2015-08-11 15:30:00 | 11.625 |
| 2015-08-11 15:45:00 | 11.625 |
| 2015-08-11 16:00:00 | 11.625 |
| 2015-08-11 16:15:00 | 11.625 |
| 2015-08-11 16:30:00 | 11.625 |
| 2015-08-11 16:45:00 | 11.625 |
| 2015-08-11 17:00:00 | 11.625 |
| 2015-08-11 17:15:00 | 11.625 |
| 2015-08-11 17:30:00 | 11.625 |
| 2015-08-11 17:45:00 | 11.625 |
| 2015-08-11 18:00:00 | 11.625 |
| 2015-08-11 18:15:00 | 11.625 |
| 2015-08-11 18:30:00 | 11.528 |
| 2015-08-11 18:45:00 | 11.528 |
| 2015-08-11 19:00:00 | 11.528 |
| 2015-08-11 19:15:00 | 11.528 |
| 2015-08-11 19:30:00 | 11.528 |
| 2015-08-11 19:45:00 | 11.528 |
| 2015-08-11 20:00:00 | 11.528 |
| 2015-08-11 20:15:00 | 11.528 |
| 2015-08-11 20:30:00 | 11.528 |
| 2015-08-11 20:45:00 | 11.528 |
| 2015-08-11 21:00:00 | 11.528 |
| 2015-08-11 21:15:00 | 11.528 |
| 2015-08-11 21:30:00 | 11.528 |
| 2015-08-11 21:45:00 | 11.528 |
| 2015-08-11 22:00:00 | 11.528 |
| 2015-08-11 22:15:00 | 11.528 |
| 2015-08-11 22:30:00 | 11.528 |
| 2015-08-11 22:45:00 | 11.528 |
| 2015-08-11 23:00:00 | 11.528 |
| 2015-08-11 23:15:00 | 11.528 |
| 2015-08-11 23:30:00 | 11.528 |
| 2015-08-11 23:45:00 | 11.431 |
| 2015-08-12 | 11.431 |
| 2015-08-12 00:15:00 | 11.431 |
| 2015-08-12 00:30:00 | 11.431 |
| 2015-08-12 00:45:00 | 11.431 |
| 2015-08-12 01:00:00 | 11.431 |
| 2015-08-12 01:15:00 | 11.431 |
| 2015-08-12 01:30:00 | 11.431 |
| 2015-08-12 01:45:00 | 11.431 |
| 2015-08-12 02:00:00 | 11.431 |
| 2015-08-12 02:15:00 | 11.431 |
| 2015-08-12 02:30:00 | 11.431 |
| 2015-08-12 02:45:00 | 11.431 |
| 2015-08-12 03:00:00 | 11.431 |
| 2015-08-12 03:15:00 | 11.431 |
| 2015-08-12 03:30:00 | 11.431 |
| 2015-08-12 03:45:00 | 11.431 |
| 2015-08-12 04:00:00 | 11.431 |
| 2015-08-12 04:15:00 | 11.431 |
| 2015-08-12 04:30:00 | 11.431 |
| 2015-08-12 04:45:00 | 11.431 |
| 2015-08-12 05:00:00 | 11.431 |
| 2015-08-12 05:15:00 | 11.431 |
| 2015-08-12 05:30:00 | 11.431 |
| 2015-08-12 05:45:00 | 11.431 |
| 2015-08-12 06:00:00 | 11.431 |
| 2015-08-12 06:15:00 | 11.431 |
| 2015-08-12 06:30:00 | 11.431 |
| 2015-08-12 06:45:00 | 11.431 |
| 2015-08-12 07:00:00 | 11.431 |
| 2015-08-12 07:15:00 | 11.431 |
| 2015-08-12 07:30:00 | 11.431 |
| 2015-08-12 07:45:00 | 11.431 |
| 2015-08-12 08:00:00 | 11.431 |
| 2015-08-12 08:15:00 | 11.431 |
| 2015-08-12 08:30:00 | 11.431 |
| 2015-08-12 08:45:00 | 11.431 |
| 2015-08-12 09:00:00 | 11.528 |
| 2015-08-12 09:15:00 | 11.528 |
| 2015-08-12 09:30:00 | 11.528 |
| 2015-08-12 09:45:00 | 11.528 |
| 2015-08-12 10:00:00 | 11.528 |
| 2015-08-12 10:15:00 | 11.528 |
| 2015-08-12 10:30:00 | 11.528 |
| 2015-08-12 10:45:00 | 11.528 |
| 2015-08-12 11:00:00 | 11.528 |
| 2015-08-12 11:15:00 | 11.528 |
| 2015-08-12 11:30:00 | 11.625 |
| 2015-08-12 11:45:00 | 11.625 |
| 2015-08-12 12:00:00 | 11.625 |
| 2015-08-12 12:15:00 | 11.625 |
| 2015-08-12 12:30:00 | 11.625 |
| 2015-08-12 12:45:00 | 11.625 |
| 2015-08-12 13:00:00 | 11.722 |
| 2015-08-12 13:15:00 | 11.722 |
| 2015-08-12 13:30:00 | 11.722 |
| 2015-08-12 13:45:00 | 11.722 |
| 2015-08-12 14:00:00 | 11.722 |
| 2015-08-12 14:15:00 | 11.722 |
| 2015-08-12 14:30:00 | 11.722 |
| 2015-08-12 14:45:00 | 11.722 |
| 2015-08-12 15:00:00 | 11.722 |
| 2015-08-12 15:15:00 | 11.722 |
| 2015-08-12 15:30:00 | 11.722 |
| 2015-08-12 15:45:00 | 11.722 |
| 2015-08-12 16:00:00 | 11.722 |
| 2015-08-12 16:15:00 | 11.722 |
| 2015-08-12 16:30:00 | 11.722 |
| 2015-08-12 16:45:00 | 11.722 |
| 2015-08-12 17:00:00 | 11.722 |
| 2015-08-12 17:15:00 | 11.722 |
| 2015-08-12 17:30:00 | 11.722 |
| 2015-08-12 17:45:00 | 11.722 |
| 2015-08-12 18:00:00 | 11.722 |
| 2015-08-12 18:15:00 | 11.722 |
| 2015-08-12 18:30:00 | 11.722 |
| 2015-08-12 18:45:00 | 11.722 |
| 2015-08-12 19:00:00 | 11.625 |
| 2015-08-12 19:15:00 | 11.625 |
| 2015-08-12 19:30:00 | 11.625 |
| 2015-08-12 19:45:00 | 11.625 |
| 2015-08-12 20:00:00 | 11.625 |
| 2015-08-12 20:15:00 | 11.625 |
| 2015-08-12 20:30:00 | 11.625 |
| 2015-08-12 20:45:00 | 11.625 |
| 2015-08-12 21:00:00 | 11.625 |
| 2015-08-12 21:15:00 | 11.625 |
| 2015-08-12 21:30:00 | 11.528 |
| 2015-08-12 21:45:00 | 11.528 |
| 2015-08-12 22:00:00 | 11.528 |
| 2015-08-12 22:15:00 | 11.528 |
| 2015-08-12 22:30:00 | 11.528 |
| 2015-08-12 22:45:00 | 11.528 |
| 2015-08-12 23:00:00 | 11.528 |
| 2015-08-12 23:15:00 | 11.528 |
| 2015-08-12 23:30:00 | 11.528 |
| 2015-08-12 23:45:00 | 11.528 |
| 2015-08-13 | 11.528 |
| 2015-08-13 00:15:00 | 11.528 |
| 2015-08-13 00:30:00 | 11.528 |
| 2015-08-13 00:45:00 | 11.528 |
| 2015-08-13 01:00:00 | 11.528 |
| 2015-08-13 01:15:00 | 11.528 |
| 2015-08-13 01:30:00 | 11.528 |
| 2015-08-13 01:45:00 | 11.528 |
| 2015-08-13 02:00:00 | 11.528 |
| 2015-08-13 02:15:00 | 11.528 |
| 2015-08-13 02:30:00 | 11.528 |
| 2015-08-13 02:45:00 | 11.528 |
| 2015-08-13 03:00:00 | 11.528 |
| 2015-08-13 03:15:00 | 11.431 |
| 2015-08-13 03:30:00 | 11.431 |
| 2015-08-13 03:45:00 | 11.528 |
| 2015-08-13 04:00:00 | 11.431 |
| 2015-08-13 04:15:00 | 11.528 |
| 2015-08-13 04:30:00 | 11.528 |
| 2015-08-13 04:45:00 | 11.528 |
| 2015-08-13 05:00:00 | 11.528 |
| 2015-08-13 05:15:00 | 11.528 |
| 2015-08-13 05:30:00 | 11.528 |
| 2015-08-13 05:45:00 | 11.528 |
| 2015-08-13 06:00:00 | 11.528 |
| 2015-08-13 06:15:00 | 11.528 |
| 2015-08-13 06:30:00 | 11.528 |
| 2015-08-13 06:45:00 | 11.528 |
| 2015-08-13 07:00:00 | 11.528 |
| 2015-08-13 07:15:00 | 11.528 |
| 2015-08-13 07:30:00 | 11.528 |
| 2015-08-13 07:45:00 | 11.528 |
| 2015-08-13 08:00:00 | 11.528 |
| 2015-08-13 08:15:00 | 11.528 |
| 2015-08-13 08:30:00 | 11.528 |
| 2015-08-13 08:45:00 | 11.528 |
| 2015-08-13 09:00:00 | 11.528 |
| 2015-08-13 09:15:00 | 11.528 |
| 2015-08-13 09:30:00 | 11.528 |
| 2015-08-13 09:45:00 | 11.528 |
| 2015-08-13 10:00:00 | 11.528 |
| 2015-08-13 10:15:00 | 11.528 |
| 2015-08-13 10:30:00 | 11.528 |
| 2015-08-13 10:45:00 | 11.528 |
| 2015-08-13 11:00:00 | 11.528 |
| 2015-08-13 11:15:00 | 11.528 |
| 2015-08-13 11:30:00 | 11.528 |
| 2015-08-13 11:45:00 | 11.528 |
| 2015-08-13 12:00:00 | 11.528 |
| 2015-08-13 12:15:00 | 11.625 |
| 2015-08-13 12:30:00 | 11.528 |
| 2015-08-13 12:45:00 | 11.625 |
| 2015-08-13 13:00:00 | 11.528 |
| 2015-08-13 13:15:00 | 11.528 |
| 2015-08-13 13:30:00 | 11.625 |
| 2015-08-13 13:45:00 | 11.625 |
| 2015-08-13 14:00:00 | 11.625 |
| 2015-08-13 14:15:00 | 11.625 |
| 2015-08-13 14:30:00 | 11.625 |
| 2015-08-13 14:45:00 | 11.625 |
| 2015-08-13 15:00:00 | 11.625 |
| 2015-08-13 15:15:00 | 11.625 |
| 2015-08-13 15:30:00 | 11.625 |
| 2015-08-13 15:45:00 | 11.625 |
| 2015-08-13 16:00:00 | 11.625 |
| 2015-08-13 16:15:00 | 11.625 |
| 2015-08-13 16:30:00 | 11.625 |
| 2015-08-13 16:45:00 | 11.625 |
| 2015-08-13 17:00:00 | 11.625 |
| 2015-08-13 17:15:00 | 11.625 |
| 2015-08-13 17:30:00 | 11.625 |
| 2015-08-13 17:45:00 | 11.625 |
| 2015-08-13 18:00:00 | 11.625 |
| 2015-08-13 18:15:00 | 11.625 |
| 2015-08-13 18:30:00 | 11.625 |
| 2015-08-13 18:45:00 | 11.625 |
| 2015-08-13 19:00:00 | 11.625 |
| 2015-08-13 19:15:00 | 11.625 |
| 2015-08-13 19:30:00 | 11.625 |
| 2015-08-13 19:45:00 | 11.625 |
| 2015-08-13 20:00:00 | 11.625 |
| 2015-08-13 20:15:00 | 11.625 |
| 2015-08-13 20:30:00 | 11.625 |
| 2015-08-13 20:45:00 | 11.625 |
| 2015-08-13 21:00:00 | 11.625 |
| 2015-08-13 21:15:00 | 11.625 |
| 2015-08-13 21:30:00 | 11.528 |
| 2015-08-13 21:45:00 | 11.625 |
| 2015-08-13 22:00:00 | 11.625 |
| 2015-08-13 22:15:00 | 11.625 |
| 2015-08-13 22:30:00 | 11.528 |
| 2015-08-13 22:45:00 | 11.528 |
| 2015-08-13 23:00:00 | 11.528 |
| 2015-08-13 23:15:00 | 11.528 |
| 2015-08-13 23:30:00 | 11.528 |
| 2015-08-13 23:45:00 | 11.528 |
| 2015-08-14 | 11.528 |
| 2015-08-14 00:15:00 | 11.528 |
| 2015-08-14 00:30:00 | 11.528 |
| 2015-08-14 00:45:00 | 11.528 |
| 2015-08-14 01:00:00 | 11.528 |
| 2015-08-14 01:15:00 | 11.528 |
| 2015-08-14 01:30:00 | 11.528 |
| 2015-08-14 01:45:00 | 11.528 |
| 2015-08-14 02:00:00 | 11.528 |
| 2015-08-14 02:15:00 | 11.528 |
| 2015-08-14 02:30:00 | 11.528 |
| 2015-08-14 02:45:00 | 11.528 |
| 2015-08-14 03:00:00 | 11.528 |
| 2015-08-14 03:15:00 | 11.625 |
| 2015-08-14 03:30:00 | 11.625 |
| 2015-08-14 03:45:00 | 11.625 |
| 2015-08-14 04:00:00 | 11.625 |
| 2015-08-14 04:15:00 | 11.625 |
| 2015-08-14 04:30:00 | 11.625 |
| 2015-08-14 04:45:00 | 11.625 |
| 2015-08-14 05:00:00 | 11.528 |
| 2015-08-14 05:15:00 | 11.528 |
| 2015-08-14 05:30:00 | 11.528 |
| 2015-08-14 05:45:00 | 11.528 |
| 2015-08-14 06:00:00 | 11.528 |
| 2015-08-14 06:15:00 | 11.528 |
| 2015-08-14 06:30:00 | 11.528 |
| 2015-08-14 06:45:00 | 11.528 |
| 2015-08-14 07:00:00 | 11.528 |
| 2015-08-14 07:15:00 | 11.528 |
| 2015-08-14 07:30:00 | 11.528 |
| 2015-08-14 07:45:00 | 11.528 |
| 2015-08-14 08:00:00 | 11.528 |
| 2015-08-14 08:15:00 | 11.528 |
| 2015-08-14 08:30:00 | 11.528 |
| 2015-08-14 08:45:00 | 11.528 |
| 2015-08-14 09:00:00 | 11.528 |
| 2015-08-14 09:15:00 | 11.528 |
| 2015-08-14 09:30:00 | 11.528 |
| 2015-08-14 09:45:00 | 11.528 |
| 2015-08-14 10:00:00 | 11.528 |
| 2015-08-14 10:15:00 | 11.528 |
| 2015-08-14 10:30:00 | 11.528 |
| 2015-08-14 10:45:00 | 11.528 |
| 2015-08-14 11:00:00 | 11.528 |
| 2015-08-14 11:15:00 | 11.528 |
| 2015-08-14 11:30:00 | 11.528 |
| 2015-08-14 11:45:00 | 11.528 |
| 2015-08-14 12:00:00 | 11.528 |
| 2015-08-14 12:15:00 | 11.528 |
| 2015-08-14 12:30:00 | 11.528 |
| 2015-08-14 12:45:00 | 11.528 |
| 2015-08-14 13:00:00 | 11.528 |
| 2015-08-14 13:15:00 | 11.528 |
| 2015-08-14 13:30:00 | 11.528 |
| 2015-08-14 13:45:00 | 11.528 |
| 2015-08-14 14:00:00 | 11.528 |
| 2015-08-14 14:15:00 | 11.528 |
| 2015-08-14 14:30:00 | 11.625 |
| 2015-08-14 14:45:00 | 11.528 |
| 2015-08-14 15:00:00 | 11.528 |
| 2015-08-14 15:15:00 | 11.528 |
| 2015-08-14 15:30:00 | 11.528 |
| 2015-08-14 15:45:00 | 11.625 |
| 2015-08-14 16:00:00 | 11.625 |
| 2015-08-14 16:15:00 | 11.528 |
| 2015-08-14 16:30:00 | 11.528 |
| 2015-08-14 16:45:00 | 11.528 |
| 2015-08-14 17:00:00 | 11.528 |
| 2015-08-14 17:15:00 | 11.528 |
| 2015-08-14 17:30:00 | 11.528 |
| 2015-08-14 17:45:00 | 11.528 |
| 2015-08-14 18:00:00 | 11.528 |
| 2015-08-14 18:15:00 | 11.528 |
| 2015-08-14 18:30:00 | 11.528 |
| 2015-08-14 18:45:00 | 11.528 |
| 2015-08-14 19:00:00 | 11.528 |
| 2015-08-14 19:15:00 | 11.528 |
| 2015-08-14 19:30:00 | 11.528 |
| 2015-08-14 19:45:00 | 11.528 |
| 2015-08-14 20:00:00 | 11.528 |
| 2015-08-14 20:15:00 | 11.528 |
| 2015-08-14 20:30:00 | 11.528 |
| 2015-08-14 20:45:00 | 11.528 |
| 2015-08-14 21:00:00 | 11.528 |
| 2015-08-14 21:15:00 | 11.528 |
| 2015-08-14 21:30:00 | 11.528 |
| 2015-08-14 21:45:00 | 11.528 |
| 2015-08-14 22:00:00 | 11.528 |
| 2015-08-14 22:15:00 | 11.528 |
| 2015-08-14 22:30:00 | 11.528 |
| 2015-08-14 22:45:00 | 11.528 |
| 2015-08-14 23:00:00 | 11.528 |
| 2015-08-14 23:15:00 | 11.528 |
| 2015-08-14 23:30:00 | 11.528 |
| 2015-08-14 23:45:00 | 11.528 |
| 2015-08-15 | 11.431 |
| 2015-08-15 00:15:00 | 11.431 |
| 2015-08-15 00:30:00 | 11.431 |
| 2015-08-15 00:45:00 | 11.431 |
| 2015-08-15 01:00:00 | 11.431 |
| 2015-08-15 01:15:00 | 11.431 |
| 2015-08-15 01:30:00 | 11.431 |
| 2015-08-15 01:45:00 | 11.431 |
| 2015-08-15 02:00:00 | 11.431 |
| 2015-08-15 02:15:00 | 11.431 |
| 2015-08-15 02:30:00 | 11.431 |
| 2015-08-15 02:45:00 | 11.431 |
| 2015-08-15 03:00:00 | 11.431 |
| 2015-08-15 03:15:00 | 11.431 |
| 2015-08-15 03:30:00 | 11.431 |
| 2015-08-15 03:45:00 | 11.431 |
| 2015-08-15 04:00:00 | 11.431 |
| 2015-08-15 04:15:00 | 11.431 |
| 2015-08-15 04:30:00 | 11.431 |
| 2015-08-15 04:45:00 | 11.431 |
| 2015-08-15 05:00:00 | 11.431 |
| 2015-08-15 05:15:00 | 11.431 |
| 2015-08-15 05:30:00 | 11.431 |
| 2015-08-15 05:45:00 | 11.431 |
| 2015-08-15 06:00:00 | 11.431 |
| 2015-08-15 06:15:00 | 11.431 |
| 2015-08-15 06:30:00 | 11.431 |
| 2015-08-15 06:45:00 | 11.431 |
| 2015-08-15 07:00:00 | 11.431 |
| 2015-08-15 07:15:00 | 11.431 |
| 2015-08-15 07:30:00 | 11.431 |
| 2015-08-15 07:45:00 | 11.431 |
| 2015-08-15 08:00:00 | 11.431 |
| 2015-08-15 08:15:00 | 11.431 |
| 2015-08-15 08:30:00 | 11.431 |
| 2015-08-15 08:45:00 | 11.431 |
| 2015-08-15 09:00:00 | 11.431 |
| 2015-08-15 09:15:00 | 11.431 |
| 2015-08-15 09:30:00 | 11.431 |
| 2015-08-15 09:45:00 | 11.431 |
| 2015-08-15 10:00:00 | 11.431 |
| 2015-08-15 10:15:00 | 11.431 |
| 2015-08-15 10:30:00 | 11.431 |
| 2015-08-15 10:45:00 | 11.528 |
| 2015-08-15 11:00:00 | 11.528 |
| 2015-08-15 11:15:00 | 11.528 |
| 2015-08-15 11:30:00 | 11.528 |
| 2015-08-15 11:45:00 | 11.528 |
| 2015-08-15 12:00:00 | 11.528 |
| 2015-08-15 12:15:00 | 11.625 |
| 2015-08-15 12:30:00 | 11.625 |
| 2015-08-15 12:45:00 | 11.625 |
| 2015-08-15 13:00:00 | 11.625 |
| 2015-08-15 13:15:00 | 11.625 |
| 2015-08-15 13:30:00 | 11.625 |
| 2015-08-15 13:45:00 | 11.625 |
| 2015-08-15 14:00:00 | 11.625 |
| 2015-08-15 14:15:00 | 11.625 |
| 2015-08-15 14:30:00 | 11.625 |
| 2015-08-15 14:45:00 | 11.625 |
| 2015-08-15 15:00:00 | 11.625 |
| 2015-08-15 15:15:00 | 11.625 |
| 2015-08-15 15:30:00 | 11.625 |
| 2015-08-15 15:45:00 | 11.625 |
| 2015-08-15 16:00:00 | 11.625 |
| 2015-08-15 16:15:00 | 11.722 |
| 2015-08-15 16:30:00 | 11.722 |
| 2015-08-15 16:45:00 | 11.625 |
| 2015-08-15 17:00:00 | 11.625 |
| 2015-08-15 17:15:00 | 11.625 |
| 2015-08-15 17:30:00 | 11.625 |
| 2015-08-15 17:45:00 | 11.625 |
| 2015-08-15 18:00:00 | 11.625 |
| 2015-08-15 18:15:00 | 11.625 |
| 2015-08-15 18:30:00 | 11.625 |
| 2015-08-15 18:45:00 | 11.625 |
| 2015-08-15 19:00:00 | 11.625 |
| 2015-08-15 19:15:00 | 11.625 |
| 2015-08-15 19:30:00 | 11.625 |
| 2015-08-15 19:45:00 | 11.528 |
| 2015-08-15 20:00:00 | 11.528 |
| 2015-08-15 20:15:00 | 11.528 |
| 2015-08-15 20:30:00 | 11.528 |
| 2015-08-15 20:45:00 | 11.528 |
| 2015-08-15 21:00:00 | 11.528 |
| 2015-08-15 21:15:00 | 11.528 |
| 2015-08-15 21:30:00 | 11.528 |
| 2015-08-15 21:45:00 | 11.528 |
| 2015-08-15 22:00:00 | 11.431 |
| 2015-08-15 22:15:00 | 11.431 |
| 2015-08-15 22:30:00 | 11.431 |
| 2015-08-15 22:45:00 | 11.431 |
| 2015-08-15 23:00:00 | 11.431 |
| 2015-08-15 23:15:00 | 11.431 |
| 2015-08-15 23:30:00 | 11.431 |
| 2015-08-15 23:45:00 | 11.431 |
| 2015-08-16 | 11.334 |
| 2015-08-16 00:15:00 | 11.334 |
| 2015-08-16 00:30:00 | 11.334 |
| 2015-08-16 00:45:00 | 11.334 |
| 2015-08-16 01:00:00 | 11.334 |
| 2015-08-16 01:15:00 | 11.334 |
| 2015-08-16 01:30:00 | 11.334 |
| 2015-08-16 01:45:00 | 11.236 |
| 2015-08-16 02:00:00 | 11.236 |
| 2015-08-16 02:15:00 | 11.236 |
| 2015-08-16 02:30:00 | 11.236 |
| 2015-08-16 02:45:00 | 11.236 |
| 2015-08-16 03:00:00 | 11.236 |
| 2015-08-16 03:15:00 | 11.236 |
| 2015-08-16 03:30:00 | 11.236 |
| 2015-08-16 03:45:00 | 11.236 |
| 2015-08-16 04:00:00 | 11.236 |
| 2015-08-16 04:15:00 | 11.236 |
| 2015-08-16 04:30:00 | 11.236 |
| 2015-08-16 04:45:00 | 11.236 |
| 2015-08-16 05:00:00 | 11.139 |
| 2015-08-16 05:15:00 | 11.236 |
| 2015-08-16 05:30:00 | 11.236 |
| 2015-08-16 05:45:00 | 11.139 |
| 2015-08-16 06:00:00 | 11.139 |
| 2015-08-16 06:15:00 | 11.139 |
| 2015-08-16 06:30:00 | 11.139 |
| 2015-08-16 06:45:00 | 11.139 |
| 2015-08-16 07:00:00 | 11.139 |
| 2015-08-16 07:15:00 | 11.139 |
| 2015-08-16 07:30:00 | 11.139 |
| 2015-08-16 07:45:00 | 11.236 |
| 2015-08-16 08:00:00 | 11.236 |
| 2015-08-16 08:15:00 | 11.236 |
| 2015-08-16 08:30:00 | 11.236 |
| 2015-08-16 08:45:00 | 11.236 |
| 2015-08-16 09:00:00 | 11.334 |
| 2015-08-16 09:15:00 | 11.334 |
| 2015-08-16 09:30:00 | 11.334 |
| 2015-08-16 09:45:00 | 11.334 |
| 2015-08-16 10:00:00 | 11.431 |
| 2015-08-16 10:15:00 | 11.431 |
| 2015-08-16 10:30:00 | 11.431 |
| 2015-08-16 10:45:00 | 11.431 |
| 2015-08-16 11:00:00 | 11.431 |
| 2015-08-16 11:15:00 | 11.528 |
| 2015-08-16 11:30:00 | 11.528 |
| 2015-08-16 11:45:00 | 11.528 |
| 2015-08-16 12:00:00 | 11.528 |
| 2015-08-16 12:15:00 | 11.528 |
| 2015-08-16 12:30:00 | 11.528 |
| 2015-08-16 12:45:00 | 11.625 |
| 2015-08-16 13:00:00 | 11.625 |
| 2015-08-16 13:15:00 | 11.625 |
| 2015-08-16 13:30:00 | 11.625 |
| 2015-08-16 13:45:00 | 11.625 |
| 2015-08-16 14:00:00 | 11.722 |
| 2015-08-16 14:15:00 | 11.722 |
| 2015-08-16 14:30:00 | 11.722 |
| 2015-08-16 14:45:00 | 11.625 |
| 2015-08-16 15:00:00 | 11.625 |
| 2015-08-16 15:15:00 | 11.625 |
| 2015-08-16 15:30:00 | 11.625 |
| 2015-08-16 15:45:00 | 11.722 |
| 2015-08-16 16:00:00 | 11.625 |
| 2015-08-16 16:15:00 | 11.722 |
| 2015-08-16 16:30:00 | 11.625 |
| 2015-08-16 16:45:00 | 11.625 |
| 2015-08-16 17:00:00 | 11.625 |
| 2015-08-16 17:15:00 | 11.625 |
| 2015-08-16 17:30:00 | 11.625 |
| 2015-08-16 17:45:00 | 11.625 |
| 2015-08-16 18:00:00 | 11.625 |
| 2015-08-16 18:15:00 | 11.625 |
| 2015-08-16 18:30:00 | 11.625 |
| 2015-08-16 18:45:00 | 11.625 |
| 2015-08-16 19:00:00 | 11.625 |
| 2015-08-16 19:15:00 | 11.625 |
| 2015-08-16 19:30:00 | 11.528 |
| 2015-08-16 19:45:00 | 11.625 |
| 2015-08-16 20:00:00 | 11.528 |
| 2015-08-16 20:15:00 | 11.528 |
| 2015-08-16 20:30:00 | 11.528 |
| 2015-08-16 20:45:00 | 11.528 |
| 2015-08-16 21:00:00 | 11.528 |
| 2015-08-16 21:15:00 | 11.528 |
| 2015-08-16 21:30:00 | 11.528 |
| 2015-08-16 21:45:00 | 11.528 |
| 2015-08-16 22:00:00 | 11.528 |
| 2015-08-16 22:15:00 | 11.431 |
| 2015-08-16 22:30:00 | 11.431 |
| 2015-08-16 22:45:00 | 11.431 |
| 2015-08-16 23:00:00 | 11.431 |
| 2015-08-16 23:15:00 | 11.431 |
| 2015-08-16 23:30:00 | 11.431 |
| 2015-08-16 23:45:00 | 11.431 |
| 2015-08-17 | 11.431 |
| 2015-08-17 00:15:00 | 11.431 |
| 2015-08-17 00:30:00 | 11.431 |
| 2015-08-17 00:45:00 | 11.431 |
| 2015-08-17 01:00:00 | 11.431 |
| 2015-08-17 01:15:00 | 11.431 |
| 2015-08-17 01:30:00 | 11.334 |
| 2015-08-17 01:45:00 | 11.431 |
| 2015-08-17 02:00:00 | 11.431 |
| 2015-08-17 02:15:00 | 11.334 |
| 2015-08-17 02:30:00 | 11.334 |
| 2015-08-17 02:45:00 | 11.431 |
| 2015-08-17 03:00:00 | 11.431 |
| 2015-08-17 03:15:00 | 11.431 |
| 2015-08-17 03:30:00 | 11.431 |
| 2015-08-17 03:45:00 | 11.431 |
| 2015-08-17 04:00:00 | 11.334 |
| 2015-08-17 04:15:00 | 11.431 |
| 2015-08-17 04:30:00 | 11.431 |
| 2015-08-17 04:45:00 | 11.334 |
| 2015-08-17 05:00:00 | 11.431 |
| 2015-08-17 05:15:00 | 11.431 |
| 2015-08-17 05:30:00 | 11.334 |
| 2015-08-17 05:45:00 | 11.334 |
| 2015-08-17 06:00:00 | 11.334 |
| 2015-08-17 06:15:00 | 11.334 |
| 2015-08-17 06:30:00 | 11.334 |
| 2015-08-17 06:45:00 | 11.334 |
| 2015-08-17 07:00:00 | 11.334 |
| 2015-08-17 07:15:00 | 11.334 |
| 2015-08-17 07:30:00 | 11.334 |
| 2015-08-17 07:45:00 | 11.334 |
| 2015-08-17 08:00:00 | 11.334 |
| 2015-08-17 08:15:00 | 11.334 |
| 2015-08-17 08:30:00 | 11.431 |
| 2015-08-17 08:45:00 | 11.431 |
| 2015-08-17 09:00:00 | 11.431 |
| 2015-08-17 09:15:00 | 11.431 |
| 2015-08-17 09:30:00 | 11.431 |
| 2015-08-17 09:45:00 | 11.431 |
| 2015-08-17 10:00:00 | 11.431 |
| 2015-08-17 10:15:00 | 11.528 |
| 2015-08-17 10:30:00 | 11.528 |
| 2015-08-17 10:45:00 | 11.528 |
| 2015-08-17 11:00:00 | 11.528 |
| 2015-08-17 11:15:00 | 11.528 |
| 2015-08-17 11:30:00 | 11.528 |
| 2015-08-17 11:45:00 | 11.528 |
| 2015-08-17 12:00:00 | 11.625 |
| 2015-08-17 12:15:00 | 11.625 |
| 2015-08-17 12:30:00 | 11.625 |
| 2015-08-17 12:45:00 | 11.625 |
| 2015-08-17 13:00:00 | 11.625 |
| 2015-08-17 13:15:00 | 11.625 |
| 2015-08-17 13:30:00 | 11.625 |
| 2015-08-17 13:45:00 | 11.625 |
| 2015-08-17 14:00:00 | 11.625 |
| 2015-08-17 14:15:00 | 11.625 |
| 2015-08-17 14:30:00 | 11.625 |
| 2015-08-17 14:45:00 | 11.625 |
| 2015-08-17 15:00:00 | 11.625 |
| 2015-08-17 15:15:00 | 11.625 |
| 2015-08-17 15:30:00 | 11.625 |
| 2015-08-17 15:45:00 | 11.625 |
| 2015-08-17 16:00:00 | 11.625 |
| 2015-08-17 16:15:00 | 11.625 |
| 2015-08-17 16:30:00 | 11.625 |
| 2015-08-17 16:45:00 | 11.625 |
| 2015-08-17 17:00:00 | 11.625 |
| 2015-08-17 17:15:00 | 11.625 |
| 2015-08-17 17:30:00 | 11.625 |
| 2015-08-17 17:45:00 | 11.625 |
| 2015-08-17 18:00:00 | 11.625 |
| 2015-08-17 18:15:00 | 11.625 |
| 2015-08-17 18:30:00 | 11.625 |
| 2015-08-17 18:45:00 | 11.625 |
| 2015-08-17 19:00:00 | 11.625 |
| 2015-08-17 19:15:00 | 11.625 |
| 2015-08-17 19:30:00 | 11.528 |
| 2015-08-17 19:45:00 | 11.528 |
| 2015-08-17 20:00:00 | 11.528 |
| 2015-08-17 20:15:00 | 11.528 |
| 2015-08-17 20:30:00 | 11.528 |
| 2015-08-17 20:45:00 | 11.528 |
| 2015-08-17 21:00:00 | 11.528 |
| 2015-08-17 21:15:00 | 11.528 |
| 2015-08-17 21:30:00 | 11.528 |
| 2015-08-17 21:45:00 | 11.528 |
| 2015-08-17 22:00:00 | 11.431 |
| 2015-08-17 22:15:00 | 11.431 |
| 2015-08-17 22:30:00 | 11.431 |
| 2015-08-17 22:45:00 | 11.431 |
| 2015-08-17 23:00:00 | 11.431 |
| 2015-08-17 23:15:00 | 11.431 |
| 2015-08-17 23:30:00 | 11.431 |
| 2015-08-17 23:45:00 | 11.334 |
| 2015-08-18 | 11.334 |
| 2015-08-18 00:15:00 | 11.334 |
| 2015-08-18 00:30:00 | 11.334 |
| 2015-08-18 00:45:00 | 11.334 |
| 2015-08-18 01:00:00 | 11.334 |
| 2015-08-18 01:15:00 | 11.334 |
| 2015-08-18 01:30:00 | 11.334 |
| 2015-08-18 01:45:00 | 11.334 |
| 2015-08-18 02:00:00 | 11.334 |
| 2015-08-18 02:15:00 | 11.334 |
| 2015-08-18 02:30:00 | 11.334 |
| 2015-08-18 02:45:00 | 11.334 |
| 2015-08-18 03:00:00 | 11.334 |
| 2015-08-18 03:15:00 | 11.334 |
| 2015-08-18 03:30:00 | 11.334 |
| 2015-08-18 03:45:00 | 11.334 |
| 2015-08-18 04:00:00 | 11.334 |
| 2015-08-18 04:15:00 | 11.334 |
| 2015-08-18 04:30:00 | 11.334 |
| 2015-08-18 04:45:00 | 11.334 |
| 2015-08-18 05:00:00 | 11.236 |
| 2015-08-18 05:15:00 | 11.236 |
| 2015-08-18 05:30:00 | 11.236 |
| 2015-08-18 05:45:00 | 11.236 |
| 2015-08-18 06:00:00 | 11.236 |
| 2015-08-18 06:15:00 | 11.236 |
| 2015-08-18 06:30:00 | 11.236 |
| 2015-08-18 06:45:00 | 11.236 |
| 2015-08-18 07:00:00 | 11.236 |
| 2015-08-18 07:15:00 | 11.236 |
| 2015-08-18 07:30:00 | 11.236 |
| 2015-08-18 07:45:00 | 11.334 |
| 2015-08-18 08:00:00 | 11.334 |
| 2015-08-18 08:15:00 | 11.334 |
| 2015-08-18 08:30:00 | 11.334 |
| 2015-08-18 08:45:00 | 11.334 |
| 2015-08-18 09:00:00 | 11.334 |
| 2015-08-18 09:15:00 | 11.334 |
| 2015-08-18 09:30:00 | 11.334 |
| 2015-08-18 09:45:00 | 11.431 |
| 2015-08-18 10:00:00 | 11.431 |
| 2015-08-18 10:15:00 | 11.431 |
| 2015-08-18 10:30:00 | 11.431 |
| 2015-08-18 10:45:00 | 11.431 |
| 2015-08-18 11:00:00 | 11.431 |
| 2015-08-18 11:15:00 | 11.431 |
| 2015-08-18 11:30:00 | 11.431 |
| 2015-08-18 11:45:00 | 11.528 |
| 2015-08-18 12:00:00 | 11.528 |
| 2015-08-18 12:15:00 | 11.528 |
| 2015-08-18 12:30:00 | 11.528 |
| 2015-08-18 12:45:00 | 11.528 |
| 2015-08-18 13:00:00 | 11.528 |
| 2015-08-18 13:15:00 | 11.528 |
| 2015-08-18 13:30:00 | 11.528 |
| 2015-08-18 13:45:00 | 11.528 |
| 2015-08-18 14:00:00 | 11.528 |
| 2015-08-18 14:15:00 | 11.528 |
| 2015-08-18 14:30:00 | 11.625 |
| 2015-08-18 14:45:00 | 11.625 |
| 2015-08-18 15:00:00 | 11.625 |
| 2015-08-18 15:15:00 | 11.528 |
| 2015-08-18 15:30:00 | 11.528 |
| 2015-08-18 15:45:00 | 11.528 |
| 2015-08-18 16:00:00 | 11.625 |
| 2015-08-18 16:15:00 | 11.625 |
| 2015-08-18 16:30:00 | 11.528 |
| 2015-08-18 16:45:00 | 11.528 |
| 2015-08-18 17:00:00 | 11.528 |
| 2015-08-18 17:15:00 | 11.528 |
| 2015-08-18 17:30:00 | 11.528 |
| 2015-08-18 17:45:00 | 11.528 |
| 2015-08-18 18:00:00 | 11.528 |
| 2015-08-18 18:15:00 | 11.528 |
| 2015-08-18 18:30:00 | 11.528 |
| 2015-08-18 18:45:00 | 11.528 |
| 2015-08-18 19:00:00 | 11.528 |
| 2015-08-18 19:15:00 | 11.528 |
| 2015-08-18 19:30:00 | 11.528 |
| 2015-08-18 19:45:00 | 11.528 |
| 2015-08-18 20:00:00 | 11.528 |
| 2015-08-18 20:15:00 | 11.528 |
| 2015-08-18 20:30:00 | 11.528 |
| 2015-08-18 20:45:00 | 11.528 |
| 2015-08-18 21:00:00 | 11.528 |
| 2015-08-18 21:15:00 | 11.528 |
| 2015-08-18 21:30:00 | 11.528 |
| 2015-08-18 21:45:00 | 11.528 |
| 2015-08-18 22:00:00 | 11.431 |
| 2015-08-18 22:15:00 | 11.431 |
| 2015-08-18 22:30:00 | 11.431 |
| 2015-08-18 22:45:00 | 11.431 |
| 2015-08-18 23:00:00 | 11.431 |
| 2015-08-18 23:15:00 | 11.431 |
| 2015-08-18 23:30:00 | 11.431 |
| 2015-08-18 23:45:00 | 11.431 |
| 2015-08-19 | 11.431 |
| 2015-08-19 00:15:00 | 11.431 |
| 2015-08-19 00:30:00 | 11.431 |
| 2015-08-19 00:45:00 | 11.431 |
| 2015-08-19 01:00:00 | 11.431 |
| 2015-08-19 01:15:00 | 11.431 |
| 2015-08-19 01:30:00 | 11.431 |
| 2015-08-19 01:45:00 | 11.431 |
| 2015-08-19 02:00:00 | 11.431 |
| 2015-08-19 02:15:00 | 11.431 |
| 2015-08-19 02:30:00 | 11.431 |
| 2015-08-19 02:45:00 | 11.431 |
| 2015-08-19 03:00:00 | 11.431 |
| 2015-08-19 03:15:00 | 11.334 |
| 2015-08-19 03:30:00 | 11.334 |
| 2015-08-19 03:45:00 | 11.334 |
| 2015-08-19 04:00:00 | 11.334 |
| 2015-08-19 04:15:00 | 11.334 |
| 2015-08-19 04:30:00 | 11.334 |
| 2015-08-19 04:45:00 | 11.334 |
| 2015-08-19 05:00:00 | 11.334 |
| 2015-08-19 05:15:00 | 11.334 |
| 2015-08-19 05:30:00 | 11.334 |
| 2015-08-19 05:45:00 | 11.334 |
| 2015-08-19 06:00:00 | 11.334 |
| 2015-08-19 06:15:00 | 11.236 |
| 2015-08-19 06:30:00 | 11.236 |
| 2015-08-19 06:45:00 | 11.236 |
| 2015-08-19 07:00:00 | 11.236 |
| 2015-08-19 07:15:00 | 11.236 |
| 2015-08-19 07:30:00 | 11.236 |
| 2015-08-19 07:45:00 | 11.236 |
| 2015-08-19 08:00:00 | 11.334 |
| 2015-08-19 08:15:00 | 11.334 |
| 2015-08-19 08:30:00 | 11.334 |
| 2015-08-19 08:45:00 | 11.334 |
| 2015-08-19 09:00:00 | 11.334 |
| 2015-08-19 09:15:00 | 11.431 |
| 2015-08-19 09:30:00 | 11.431 |
| 2015-08-19 09:45:00 | 11.431 |
| 2015-08-19 10:00:00 | 11.431 |
| 2015-08-19 10:15:00 | 11.431 |
| 2015-08-19 10:30:00 | 11.431 |
| 2015-08-19 10:45:00 | 11.431 |
| 2015-08-19 11:00:00 | 11.431 |
| 2015-08-19 11:15:00 | 11.528 |
| 2015-08-19 11:30:00 | 11.528 |
| 2015-08-19 11:45:00 | 11.528 |
| 2015-08-19 12:00:00 | 11.528 |
| 2015-08-19 12:15:00 | 11.528 |
| 2015-08-19 12:30:00 | 11.528 |
| 2015-08-19 12:45:00 | 11.528 |
| 2015-08-19 13:00:00 | 11.528 |
| 2015-08-19 13:15:00 | 11.528 |
| 2015-08-19 13:30:00 | 11.528 |
| 2015-08-19 13:45:00 | 11.528 |
| 2015-08-19 14:00:00 | 11.528 |
| 2015-08-19 14:15:00 | 11.528 |
| 2015-08-19 14:30:00 | 11.528 |
| 2015-08-19 14:45:00 | 11.528 |
| 2015-08-19 15:00:00 | 11.528 |
| 2015-08-19 15:15:00 | 11.528 |
| 2015-08-19 15:30:00 | 11.528 |
| 2015-08-19 15:45:00 | 11.528 |
| 2015-08-19 16:00:00 | 11.528 |
| 2015-08-19 16:15:00 | 11.528 |
| 2015-08-19 16:30:00 | 11.528 |
| 2015-08-19 16:45:00 | 11.528 |
| 2015-08-19 17:00:00 | 11.528 |
| 2015-08-19 17:15:00 | 11.528 |
| 2015-08-19 17:30:00 | 11.528 |
| 2015-08-19 17:45:00 | 11.528 |
| 2015-08-19 18:00:00 | 11.528 |
| 2015-08-19 18:15:00 | 11.528 |
| 2015-08-19 18:30:00 | 11.528 |
| 2015-08-19 18:45:00 | 11.528 |
| 2015-08-19 19:00:00 | 11.528 |
| 2015-08-19 19:15:00 | 11.528 |
| 2015-08-19 19:30:00 | 11.528 |
| 2015-08-19 19:45:00 | 11.528 |
| 2015-08-19 20:00:00 | 11.528 |
| 2015-08-19 20:15:00 | 11.528 |
| 2015-08-19 20:30:00 | 11.528 |
| 2015-08-19 20:45:00 | 11.528 |
| 2015-08-19 21:00:00 | 11.528 |
| 2015-08-19 21:15:00 | 11.528 |
| 2015-08-19 21:30:00 | 11.528 |
| 2015-08-19 21:45:00 | 11.528 |
| 2015-08-19 22:00:00 | 11.528 |
| 2015-08-19 22:15:00 | 11.528 |
| 2015-08-19 22:30:00 | 11.528 |
| 2015-08-19 22:45:00 | 11.528 |
| 2015-08-19 23:00:00 | 11.528 |
| 2015-08-19 23:15:00 | 11.528 |
| 2015-08-19 23:30:00 | 11.431 |
| 2015-08-19 23:45:00 | 11.528 |
| 2015-08-20 | 11.528 |
| 2015-08-20 00:15:00 | 11.528 |
| 2015-08-20 00:30:00 | 11.528 |
| 2015-08-20 00:45:00 | 11.528 |
| 2015-08-20 01:00:00 | 11.528 |
| 2015-08-20 01:15:00 | 11.528 |
| 2015-08-20 01:30:00 | 11.528 |
| 2015-08-20 01:45:00 | 11.528 |
| 2015-08-20 02:00:00 | 11.528 |
| 2015-08-20 02:15:00 | 11.528 |
| 2015-08-20 02:30:00 | 11.528 |
| 2015-08-20 02:45:00 | 11.528 |
| 2015-08-20 03:00:00 | 11.528 |
| 2015-08-20 03:15:00 | 11.528 |
| 2015-08-20 03:30:00 | 11.528 |
| 2015-08-20 03:45:00 | 11.528 |
| 2015-08-20 04:00:00 | 11.431 |
| 2015-08-20 04:15:00 | 11.431 |
| 2015-08-20 04:30:00 | 11.528 |
| 2015-08-20 04:45:00 | 11.528 |
| 2015-08-20 05:00:00 | 11.528 |
| 2015-08-20 05:15:00 | 11.528 |
| 2015-08-20 05:30:00 | 11.431 |
| 2015-08-20 05:45:00 | 11.528 |
| 2015-08-20 06:00:00 | 11.431 |
| 2015-08-20 06:15:00 | 11.431 |
| 2015-08-20 06:30:00 | 11.431 |
| 2015-08-20 06:45:00 | 11.431 |
| 2015-08-20 07:00:00 | 11.431 |
| 2015-08-20 07:15:00 | 11.431 |
| 2015-08-20 07:30:00 | 11.431 |
| 2015-08-20 07:45:00 | 11.431 |
| 2015-08-20 08:00:00 | 11.528 |
| 2015-08-20 08:15:00 | 11.431 |
| 2015-08-20 08:30:00 | 11.528 |
| 2015-08-20 08:45:00 | 11.528 |
| 2015-08-20 09:00:00 | 11.528 |
| 2015-08-20 09:15:00 | 11.528 |
| 2015-08-20 09:30:00 | 11.528 |
| 2015-08-20 09:45:00 | 11.528 |
| 2015-08-20 10:00:00 | 11.528 |
| 2015-08-20 10:15:00 | 11.528 |
| 2015-08-20 10:30:00 | 11.528 |
| 2015-08-20 10:45:00 | 11.528 |
| 2015-08-20 11:00:00 | 11.528 |
| 2015-08-20 11:15:00 | 11.528 |
| 2015-08-20 11:30:00 | 11.528 |
| 2015-08-20 11:45:00 | 11.528 |
| 2015-08-20 12:00:00 | 11.528 |
| 2015-08-20 12:15:00 | 11.528 |
| 2015-08-20 12:30:00 | 11.625 |
| 2015-08-20 12:45:00 | 11.625 |
| 2015-08-20 13:00:00 | 11.625 |
| 2015-08-20 13:15:00 | 11.625 |
| 2015-08-20 13:30:00 | 11.625 |
| 2015-08-20 13:45:00 | 11.625 |
| 2015-08-20 14:00:00 | 11.625 |
| 2015-08-20 14:15:00 | 11.625 |
| 2015-08-20 14:30:00 | 11.625 |
| 2015-08-20 14:45:00 | 11.625 |
| 2015-08-20 15:00:00 | 11.625 |
| 2015-08-20 15:15:00 | 11.625 |
| 2015-08-20 15:30:00 | 11.625 |
| 2015-08-20 15:45:00 | 11.625 |
| 2015-08-20 16:00:00 | 11.625 |
| 2015-08-20 16:15:00 | 11.625 |
| 2015-08-20 16:30:00 | 11.625 |
| 2015-08-20 16:45:00 | 11.625 |
| 2015-08-20 17:00:00 | 11.625 |
| 2015-08-20 17:15:00 | 11.625 |
| 2015-08-20 17:30:00 | 11.625 |
| 2015-08-20 17:45:00 | 11.625 |
| 2015-08-20 18:00:00 | 11.625 |
| 2015-08-20 18:15:00 | 11.625 |
| 2015-08-20 18:30:00 | 11.625 |
| 2015-08-20 18:45:00 | 11.625 |
| 2015-08-20 19:00:00 | 11.625 |
| 2015-08-20 19:15:00 | 11.528 |
| 2015-08-20 19:30:00 | 11.528 |
| 2015-08-20 19:45:00 | 11.528 |
| 2015-08-20 20:00:00 | 11.528 |
| 2015-08-20 20:15:00 | 11.528 |
| 2015-08-20 20:30:00 | 11.528 |
| 2015-08-20 20:45:00 | 11.528 |
| 2015-08-20 21:00:00 | 11.528 |
| 2015-08-20 21:15:00 | 11.528 |
| 2015-08-20 21:30:00 | 11.528 |
| 2015-08-20 21:45:00 | 11.528 |
| 2015-08-20 22:00:00 | 11.528 |
| 2015-08-20 22:15:00 | 11.528 |
| 2015-08-20 22:30:00 | 11.528 |
| 2015-08-20 22:45:00 | 11.528 |
| 2015-08-20 23:00:00 | 11.528 |
| 2015-08-20 23:15:00 | 11.528 |
| 2015-08-20 23:30:00 | 11.528 |
| 2015-08-20 23:45:00 | 11.528 |
| 2015-08-21 | 11.528 |
| 2015-08-21 00:15:00 | 11.528 |
| 2015-08-21 00:30:00 | 11.528 |
| 2015-08-21 00:45:00 | 11.528 |
| 2015-08-21 01:00:00 | 11.528 |
| 2015-08-21 01:15:00 | 11.528 |
| 2015-08-21 01:30:00 | 11.528 |
| 2015-08-21 01:45:00 | 11.528 |
| 2015-08-21 02:00:00 | 11.528 |
| 2015-08-21 02:15:00 | 11.528 |
| 2015-08-21 02:30:00 | 11.528 |
| 2015-08-21 02:45:00 | 11.528 |
| 2015-08-21 03:00:00 | 11.528 |
| 2015-08-21 03:15:00 | 11.528 |
| 2015-08-21 03:30:00 | 11.528 |
| 2015-08-21 03:45:00 | 11.528 |
| 2015-08-21 04:00:00 | 11.528 |
| 2015-08-21 04:15:00 | 11.528 |
| 2015-08-21 04:30:00 | 11.528 |
| 2015-08-21 04:45:00 | 11.528 |
| 2015-08-21 05:00:00 | 11.528 |
| 2015-08-21 05:15:00 | 11.528 |
| 2015-08-21 05:30:00 | 11.528 |
| 2015-08-21 05:45:00 | 11.528 |
| 2015-08-21 06:00:00 | 11.528 |
| 2015-08-21 06:15:00 | 11.528 |
| 2015-08-21 06:30:00 | 11.528 |
| 2015-08-21 06:45:00 | 11.528 |
| 2015-08-21 07:00:00 | 11.528 |
| 2015-08-21 07:15:00 | 11.528 |
| 2015-08-21 07:30:00 | 11.528 |
| 2015-08-21 07:45:00 | 11.528 |
| 2015-08-21 08:00:00 | 11.528 |
| 2015-08-21 08:15:00 | 11.528 |
| 2015-08-21 08:30:00 | 11.528 |
| 2015-08-21 08:45:00 | 11.528 |
| 2015-08-21 09:00:00 | 11.528 |
| 2015-08-21 09:15:00 | 11.528 |
| 2015-08-21 09:30:00 | 11.528 |
| 2015-08-21 09:45:00 | 11.528 |
| 2015-08-21 10:00:00 | 11.528 |
| 2015-08-21 10:15:00 | 11.528 |
| 2015-08-21 10:30:00 | 11.528 |
| 2015-08-21 10:45:00 | 11.528 |
| 2015-08-21 11:00:00 | 11.625 |
| 2015-08-21 11:15:00 | 11.625 |
| 2015-08-21 11:30:00 | 11.625 |
| 2015-08-21 11:45:00 | 11.625 |
| 2015-08-21 12:00:00 | 11.625 |
| 2015-08-21 12:15:00 | 11.625 |
| 2015-08-21 12:30:00 | 11.625 |
| 2015-08-21 12:45:00 | 11.722 |
| 2015-08-21 13:00:00 | 11.722 |
| 2015-08-21 13:15:00 | 11.722 |
| 2015-08-21 13:30:00 | 11.722 |
| 2015-08-21 13:45:00 | 11.722 |
| 2015-08-21 14:00:00 | 11.722 |
| 2015-08-21 14:15:00 | 11.722 |
| 2015-08-21 14:30:00 | 11.722 |
| 2015-08-21 14:45:00 | 11.819 |
| 2015-08-21 15:00:00 | 11.819 |
| 2015-08-21 15:15:00 | 11.819 |
| 2015-08-21 15:30:00 | 11.819 |
| 2015-08-21 15:45:00 | 11.819 |
| 2015-08-21 16:00:00 | 11.819 |
| 2015-08-21 16:15:00 | 11.819 |
| 2015-08-21 16:30:00 | 11.819 |
| 2015-08-21 16:45:00 | 11.819 |
| 2015-08-21 17:00:00 | 11.819 |
| 2015-08-21 17:15:00 | 11.722 |
| 2015-08-21 17:30:00 | 11.722 |
| 2015-08-21 17:45:00 | 11.722 |
| 2015-08-21 18:00:00 | 11.722 |
| 2015-08-21 18:15:00 | 11.722 |
| 2015-08-21 18:30:00 | 11.722 |
| 2015-08-21 18:45:00 | 11.722 |
| 2015-08-21 19:00:00 | 11.722 |
| 2015-08-21 19:15:00 | 11.722 |
| 2015-08-21 19:30:00 | 11.722 |
| 2015-08-21 19:45:00 | 11.722 |
| 2015-08-21 20:00:00 | 11.625 |
| 2015-08-21 20:15:00 | 11.625 |
| 2015-08-21 20:30:00 | 11.625 |
| 2015-08-21 20:45:00 | 11.625 |
| 2015-08-21 21:00:00 | 11.625 |
| 2015-08-21 21:15:00 | 11.625 |
| 2015-08-21 21:30:00 | 11.528 |
| 2015-08-21 21:45:00 | 11.528 |
| 2015-08-21 22:00:00 | 11.528 |
| 2015-08-21 22:15:00 | 11.528 |
| 2015-08-21 22:30:00 | 11.528 |
| 2015-08-21 22:45:00 | 11.528 |
| 2015-08-21 23:00:00 | 11.528 |
| 2015-08-21 23:15:00 | 11.528 |
| 2015-08-21 23:30:00 | 11.528 |
| 2015-08-21 23:45:00 | 11.528 |
| 2015-08-22 | 11.431 |
| 2015-08-22 00:15:00 | 11.431 |
| 2015-08-22 00:30:00 | 11.431 |
| 2015-08-22 00:45:00 | 11.431 |
| 2015-08-22 01:00:00 | 11.431 |
| 2015-08-22 01:15:00 | 11.431 |
| 2015-08-22 01:30:00 | 11.431 |
| 2015-08-22 01:45:00 | 11.431 |
| 2015-08-22 02:00:00 | 11.431 |
| 2015-08-22 02:15:00 | 11.431 |
| 2015-08-22 02:30:00 | 11.431 |
| 2015-08-22 02:45:00 | 11.431 |
| 2015-08-22 03:00:00 | 11.431 |
| 2015-08-22 03:15:00 | 11.431 |
| 2015-08-22 03:30:00 | 11.334 |
| 2015-08-22 03:45:00 | 11.334 |
| 2015-08-22 04:00:00 | 11.334 |
| 2015-08-22 04:15:00 | 11.334 |
| 2015-08-22 04:30:00 | 11.334 |
| 2015-08-22 04:45:00 | 11.334 |
| 2015-08-22 05:00:00 | 11.431 |
| 2015-08-22 05:15:00 | 11.334 |
| 2015-08-22 05:30:00 | 11.431 |
| 2015-08-22 05:45:00 | 11.431 |
| 2015-08-22 06:00:00 | 11.431 |
| 2015-08-22 06:15:00 | 11.431 |
| 2015-08-22 06:30:00 | 11.431 |
| 2015-08-22 06:45:00 | 11.431 |
| 2015-08-22 07:00:00 | 11.334 |
| 2015-08-22 07:15:00 | 11.334 |
| 2015-08-22 07:30:00 | 11.334 |
| 2015-08-22 07:45:00 | 11.431 |
| 2015-08-22 08:00:00 | 11.431 |
| 2015-08-22 08:15:00 | 11.431 |
| 2015-08-22 08:30:00 | 11.431 |
| 2015-08-22 08:45:00 | 11.431 |
| 2015-08-22 09:00:00 | 11.431 |
| 2015-08-22 09:15:00 | 11.431 |
| 2015-08-22 09:30:00 | 11.431 |
| 2015-08-22 09:45:00 | 11.431 |
| 2015-08-22 10:00:00 | 11.528 |
| 2015-08-22 10:15:00 | 11.528 |
| 2015-08-22 10:30:00 | 11.528 |
| 2015-08-22 10:45:00 | 11.528 |
| 2015-08-22 11:00:00 | 11.528 |
| 2015-08-22 11:15:00 | 11.528 |
| 2015-08-22 11:30:00 | 11.625 |
| 2015-08-22 11:45:00 | 11.625 |
| 2015-08-22 12:00:00 | 11.625 |
| 2015-08-22 12:15:00 | 11.625 |
| 2015-08-22 12:30:00 | 11.722 |
| 2015-08-22 12:45:00 | 11.722 |
| 2015-08-22 13:00:00 | 11.722 |
| 2015-08-22 13:15:00 | 11.722 |
| 2015-08-22 13:30:00 | 11.722 |
| 2015-08-22 13:45:00 | 11.722 |
| 2015-08-22 14:00:00 | 11.819 |
| 2015-08-22 14:15:00 | 11.819 |
| 2015-08-22 14:30:00 | 11.819 |
| 2015-08-22 14:45:00 | 11.819 |
| 2015-08-22 15:00:00 | 11.819 |
| 2015-08-22 15:15:00 | 11.819 |
| 2015-08-22 15:30:00 | 11.819 |
| 2015-08-22 15:45:00 | 11.819 |
| 2015-08-22 16:00:00 | 11.819 |
| 2015-08-22 16:15:00 | 11.819 |
| 2015-08-22 16:30:00 | 11.819 |
| 2015-08-22 16:45:00 | 11.819 |
| 2015-08-22 17:00:00 | 11.722 |
| 2015-08-22 17:15:00 | 11.722 |
| 2015-08-22 17:30:00 | 11.722 |
| 2015-08-22 17:45:00 | 11.722 |
| 2015-08-22 18:00:00 | 11.722 |
| 2015-08-22 18:15:00 | 11.722 |
| 2015-08-22 18:30:00 | 11.722 |
| 2015-08-22 18:45:00 | 11.722 |
| 2015-08-22 19:00:00 | 11.722 |
| 2015-08-22 19:15:00 | 11.722 |
| 2015-08-22 19:30:00 | 11.722 |
| 2015-08-22 19:45:00 | 11.625 |
| 2015-08-22 20:00:00 | 11.625 |
| 2015-08-22 20:15:00 | 11.625 |
| 2015-08-22 20:30:00 | 11.625 |
| 2015-08-22 20:45:00 | 11.625 |
| 2015-08-22 21:00:00 | 11.625 |
| 2015-08-22 21:15:00 | 11.625 |
| 2015-08-22 21:30:00 | 11.625 |
| 2015-08-22 21:45:00 | 11.625 |
| 2015-08-22 22:00:00 | 11.625 |
| 2015-08-22 22:15:00 | 11.625 |
| 2015-08-22 22:30:00 | 11.625 |
| 2015-08-22 22:45:00 | 11.625 |
| 2015-08-22 23:00:00 | 11.625 |
| 2015-08-22 23:15:00 | 11.528 |
| 2015-08-22 23:30:00 | 11.528 |
| 2015-08-22 23:45:00 | 11.528 |
| 2015-08-23 | 11.528 |
| 2015-08-23 00:15:00 | 11.528 |
| 2015-08-23 00:30:00 | 11.528 |
| 2015-08-23 00:45:00 | 11.528 |
| 2015-08-23 01:00:00 | 11.528 |
| 2015-08-23 01:15:00 | 11.528 |
| 2015-08-23 01:30:00 | 11.528 |
| 2015-08-23 01:45:00 | 11.528 |
| 2015-08-23 02:00:00 | 11.528 |
| 2015-08-23 02:15:00 | 11.528 |
| 2015-08-23 02:30:00 | 11.528 |
| 2015-08-23 02:45:00 | 11.528 |
| 2015-08-23 03:00:00 | 11.528 |
| 2015-08-23 03:15:00 | 11.528 |
| 2015-08-23 03:30:00 | 11.528 |
| 2015-08-23 03:45:00 | 11.528 |
| 2015-08-23 04:00:00 | 11.528 |
| 2015-08-23 04:15:00 | 11.431 |
| 2015-08-23 04:30:00 | 11.431 |
| 2015-08-23 04:45:00 | 11.431 |
| 2015-08-23 05:00:00 | 11.431 |
| 2015-08-23 05:15:00 | 11.528 |
| 2015-08-23 05:30:00 | 11.431 |
| 2015-08-23 05:45:00 | 11.431 |
| 2015-08-23 06:00:00 | 11.431 |
| 2015-08-23 06:15:00 | 11.431 |
| 2015-08-23 06:30:00 | 11.431 |
| 2015-08-23 06:45:00 | 11.431 |
| 2015-08-23 07:00:00 | 11.431 |
| 2015-08-23 07:15:00 | 11.431 |
| 2015-08-23 07:30:00 | 11.431 |
| 2015-08-23 07:45:00 | 11.431 |
| 2015-08-23 08:00:00 | 11.431 |
| 2015-08-23 08:15:00 | 11.431 |
| 2015-08-23 08:30:00 | 11.528 |
| 2015-08-23 08:45:00 | 11.528 |
| 2015-08-23 09:00:00 | 11.528 |
| 2015-08-23 09:15:00 | 11.431 |
| 2015-08-23 09:30:00 | 11.528 |
| 2015-08-23 09:45:00 | 11.528 |
| 2015-08-23 10:00:00 | 11.528 |
| 2015-08-23 10:15:00 | 11.528 |
| 2015-08-23 10:30:00 | 11.528 |
| 2015-08-23 10:45:00 | 11.528 |
| 2015-08-23 11:00:00 | 11.528 |
| 2015-08-23 11:15:00 | 11.528 |
| 2015-08-23 11:30:00 | 11.528 |
| 2015-08-23 11:45:00 | 11.528 |
| 2015-08-23 12:00:00 | 11.528 |
| 2015-08-23 12:15:00 | 11.528 |
| 2015-08-23 12:30:00 | 11.528 |
| 2015-08-23 12:45:00 | 11.528 |
| 2015-08-23 13:00:00 | 11.528 |
| 2015-08-23 13:15:00 | 11.625 |
| 2015-08-23 13:30:00 | 11.625 |
| 2015-08-23 13:45:00 | 11.625 |
| 2015-08-23 14:00:00 | 11.625 |
| 2015-08-23 14:15:00 | 11.625 |
| 2015-08-23 14:30:00 | 11.625 |
| 2015-08-23 14:45:00 | 11.625 |
| 2015-08-23 15:00:00 | 11.625 |
| 2015-08-23 15:15:00 | 11.625 |
| 2015-08-23 15:30:00 | 11.625 |
| 2015-08-23 15:45:00 | 11.625 |
| 2015-08-23 16:00:00 | 11.625 |
| 2015-08-23 16:15:00 | 11.625 |
| 2015-08-23 16:30:00 | 11.625 |
| 2015-08-23 16:45:00 | 11.625 |
| 2015-08-23 17:00:00 | 11.625 |
| 2015-08-23 17:15:00 | 11.625 |
| 2015-08-23 17:30:00 | 11.625 |
| 2015-08-23 17:45:00 | 11.625 |
| 2015-08-23 18:00:00 | 11.625 |
| 2015-08-23 18:15:00 | 11.625 |
| 2015-08-23 18:30:00 | 11.625 |
| 2015-08-23 18:45:00 | 11.625 |
| 2015-08-23 19:00:00 | 11.625 |
| 2015-08-23 19:15:00 | 11.625 |
| 2015-08-23 19:30:00 | 11.625 |
| 2015-08-23 19:45:00 | 11.528 |
| 2015-08-23 20:00:00 | 11.528 |
| 2015-08-23 20:15:00 | 11.528 |
| 2015-08-23 20:30:00 | 11.528 |
| 2015-08-23 20:45:00 | 11.528 |
| 2015-08-23 21:00:00 | 11.528 |
| 2015-08-23 21:15:00 | 11.528 |
| 2015-08-23 21:30:00 | 11.528 |
| 2015-08-23 21:45:00 | 11.528 |
| 2015-08-23 22:00:00 | 11.431 |
| 2015-08-23 22:15:00 | 11.431 |
| 2015-08-23 22:30:00 | 11.431 |
| 2015-08-23 22:45:00 | 11.431 |
| 2015-08-23 23:00:00 | 11.431 |
| 2015-08-23 23:15:00 | 11.431 |
| 2015-08-23 23:30:00 | 11.431 |
| 2015-08-23 23:45:00 | 11.431 |
| 2015-08-24 | 11.431 |
| 2015-08-24 00:15:00 | 11.334 |
| 2015-08-24 00:30:00 | 11.334 |
| 2015-08-24 00:45:00 | 11.334 |
| 2015-08-24 01:00:00 | 11.334 |
| 2015-08-24 01:15:00 | 11.334 |
| 2015-08-24 01:30:00 | 11.334 |
| 2015-08-24 01:45:00 | 11.334 |
| 2015-08-24 02:00:00 | 11.334 |
| 2015-08-24 02:15:00 | 11.431 |
| 2015-08-24 02:30:00 | 11.431 |
| 2015-08-24 02:45:00 | 11.431 |
| 2015-08-24 03:00:00 | 11.431 |
| 2015-08-24 03:15:00 | 11.431 |
| 2015-08-24 03:30:00 | 11.431 |
| 2015-08-24 03:45:00 | 11.431 |
| 2015-08-24 04:00:00 | 11.431 |
| 2015-08-24 04:15:00 | 11.431 |
| 2015-08-24 04:30:00 | 11.431 |
| 2015-08-24 04:45:00 | 11.431 |
| 2015-08-24 05:00:00 | 11.431 |
| 2015-08-24 05:15:00 | 11.431 |
| 2015-08-24 05:30:00 | 11.431 |
| 2015-08-24 05:45:00 | 11.431 |
| 2015-08-24 06:00:00 | 11.431 |
| 2015-08-24 06:15:00 | 11.431 |
| 2015-08-24 06:30:00 | 11.431 |
| 2015-08-24 06:45:00 | 11.431 |
| 2015-08-24 07:00:00 | 11.431 |
| 2015-08-24 07:15:00 | 11.431 |
| 2015-08-24 07:30:00 | 11.431 |
| 2015-08-24 07:45:00 | 11.431 |
| 2015-08-24 08:00:00 | 11.431 |
| 2015-08-24 08:15:00 | 11.431 |
| 2015-08-24 08:30:00 | 11.431 |
| 2015-08-24 08:45:00 | 11.431 |
| 2015-08-24 09:00:00 | 11.431 |
| 2015-08-24 09:15:00 | 11.431 |
| 2015-08-24 09:30:00 | 11.528 |
| 2015-08-24 09:45:00 | 11.528 |
| 2015-08-24 10:00:00 | 11.528 |
| 2015-08-24 10:15:00 | 11.528 |
| 2015-08-24 10:30:00 | 11.528 |
| 2015-08-24 10:45:00 | 11.528 |
| 2015-08-24 11:00:00 | 11.528 |
| 2015-08-24 11:15:00 | 11.528 |
| 2015-08-24 11:30:00 | 11.528 |
| 2015-08-24 11:45:00 | 11.528 |
| 2015-08-24 12:00:00 | 11.528 |
| 2015-08-24 12:15:00 | 11.528 |
| 2015-08-24 12:30:00 | 11.528 |
| 2015-08-24 12:45:00 | 11.528 |
| 2015-08-24 13:00:00 | 11.528 |
| 2015-08-24 13:15:00 | 11.528 |
| 2015-08-24 13:30:00 | 11.528 |
| 2015-08-24 13:45:00 | 11.528 |
| 2015-08-24 14:00:00 | 11.528 |
| 2015-08-24 14:15:00 | 11.528 |
| 2015-08-24 14:30:00 | 11.528 |
| 2015-08-24 14:45:00 | 11.625 |
| 2015-08-24 15:00:00 | 11.625 |
| 2015-08-24 15:15:00 | 11.625 |
| 2015-08-24 15:30:00 | 11.528 |
| 2015-08-24 15:45:00 | 11.528 |
| 2015-08-24 16:00:00 | 11.528 |
| 2015-08-24 16:15:00 | 11.625 |
| 2015-08-24 16:30:00 | 11.625 |
| 2015-08-24 16:45:00 | 11.625 |
| 2015-08-24 17:00:00 | 11.528 |
| 2015-08-24 17:15:00 | 11.528 |
| 2015-08-24 17:30:00 | 11.528 |
| 2015-08-24 17:45:00 | 11.528 |
| 2015-08-24 18:00:00 | 11.528 |
| 2015-08-24 18:15:00 | 11.528 |
| 2015-08-24 18:30:00 | 11.528 |
| 2015-08-24 18:45:00 | 11.528 |
| 2015-08-24 19:00:00 | 11.528 |
| 2015-08-24 19:15:00 | 11.528 |
| 2015-08-24 19:30:00 | 11.528 |
| 2015-08-24 19:45:00 | 11.528 |
| 2015-08-24 20:00:00 | 11.528 |
| 2015-08-24 20:15:00 | 11.528 |
| 2015-08-24 20:30:00 | 11.528 |
| 2015-08-24 20:45:00 | 11.528 |
| 2015-08-24 21:00:00 | 11.528 |
| 2015-08-24 21:15:00 | 11.528 |
| 2015-08-24 21:30:00 | 11.528 |
| 2015-08-24 21:45:00 | 11.431 |
| 2015-08-24 22:00:00 | 11.431 |
| 2015-08-24 22:15:00 | 11.431 |
| 2015-08-24 22:30:00 | 11.431 |
| 2015-08-24 22:45:00 | 11.431 |
| 2015-08-24 23:00:00 | 11.431 |
| 2015-08-24 23:15:00 | 11.431 |
| 2015-08-24 23:30:00 | 11.431 |
| 2015-08-24 23:45:00 | 11.431 |
| 2015-08-25 | 11.431 |
| 2015-08-25 00:15:00 | 11.431 |
| 2015-08-25 00:30:00 | 11.431 |
| 2015-08-25 00:45:00 | 11.431 |
| 2015-08-25 01:00:00 | 11.431 |
| 2015-08-25 01:15:00 | 11.431 |
| 2015-08-25 01:30:00 | 11.431 |
| 2015-08-25 01:45:00 | 11.431 |
| 2015-08-25 02:00:00 | 11.431 |
| 2015-08-25 02:15:00 | 11.431 |
| 2015-08-25 02:30:00 | 11.431 |
| 2015-08-25 02:45:00 | 11.431 |
| 2015-08-25 03:00:00 | 11.334 |
| 2015-08-25 03:15:00 | 11.334 |
| 2015-08-25 03:30:00 | 11.334 |
| 2015-08-25 03:45:00 | 11.334 |
| 2015-08-25 04:00:00 | 11.334 |
| 2015-08-25 04:15:00 | 11.334 |
| 2015-08-25 04:30:00 | 11.334 |
| 2015-08-25 04:45:00 | 11.334 |
| 2015-08-25 05:00:00 | 11.334 |
| 2015-08-25 05:15:00 | 11.334 |
| 2015-08-25 05:30:00 | 11.236 |
| 2015-08-25 05:45:00 | 11.236 |
| 2015-08-25 06:00:00 | 11.236 |
| 2015-08-25 06:15:00 | 11.236 |
| 2015-08-25 06:30:00 | 11.236 |
| 2015-08-25 06:45:00 | 11.236 |
| 2015-08-25 07:00:00 | 11.236 |
| 2015-08-25 07:15:00 | 11.236 |
| 2015-08-25 07:30:00 | 11.236 |
| 2015-08-25 07:45:00 | 11.334 |
| 2015-08-25 08:00:00 | 11.334 |
| 2015-08-25 08:15:00 | 11.334 |
| 2015-08-25 08:30:00 | 11.334 |
| 2015-08-25 08:45:00 | 11.334 |
| 2015-08-25 09:00:00 | 11.334 |
| 2015-08-25 09:15:00 | 11.431 |
| 2015-08-25 09:30:00 | 11.431 |
| 2015-08-25 09:45:00 | 11.431 |
| 2015-08-25 10:00:00 | 11.431 |
| 2015-08-25 10:15:00 | 11.431 |
| 2015-08-25 10:30:00 | 11.431 |
| 2015-08-25 10:45:00 | 11.431 |
| 2015-08-25 11:00:00 | 11.431 |
| 2015-08-25 11:15:00 | 11.431 |
| 2015-08-25 11:30:00 | 11.431 |
| 2015-08-25 11:45:00 | 11.431 |
| 2015-08-25 12:00:00 | 11.528 |
| 2015-08-25 12:15:00 | 11.528 |
| 2015-08-25 12:30:00 | 11.528 |
| 2015-08-25 12:45:00 | 11.528 |
| 2015-08-25 13:00:00 | 11.528 |
| 2015-08-25 13:15:00 | 11.528 |
| 2015-08-25 13:30:00 | 11.528 |
| 2015-08-25 13:45:00 | 11.528 |
| 2015-08-25 14:00:00 | 11.528 |
| 2015-08-25 14:15:00 | 11.528 |
| 2015-08-25 14:30:00 | 11.528 |
| 2015-08-25 14:45:00 | 11.528 |
| 2015-08-25 15:00:00 | 11.528 |
| 2015-08-25 15:15:00 | 11.528 |
| 2015-08-25 15:30:00 | 11.528 |
| 2015-08-25 15:45:00 | 11.528 |
| 2015-08-25 16:00:00 | 11.528 |
| 2015-08-25 16:15:00 | 11.528 |
| 2015-08-25 16:30:00 | 11.528 |
| 2015-08-25 16:45:00 | 11.528 |
| 2015-08-25 17:00:00 | 11.528 |
| 2015-08-25 17:15:00 | 11.528 |
| 2015-08-25 17:30:00 | 11.528 |
| 2015-08-25 17:45:00 | 11.528 |
| 2015-08-25 18:00:00 | 11.528 |
| 2015-08-25 18:15:00 | 11.528 |
| 2015-08-25 18:30:00 | 11.528 |
| 2015-08-25 18:45:00 | 11.528 |
| 2015-08-25 19:00:00 | 11.528 |
| 2015-08-25 19:15:00 | 11.528 |
| 2015-08-25 19:30:00 | 11.528 |
| 2015-08-25 19:45:00 | 11.528 |
| 2015-08-25 20:00:00 | 11.528 |
| 2015-08-25 20:15:00 | 11.528 |
| 2015-08-25 20:30:00 | 11.528 |
| 2015-08-25 20:45:00 | 11.528 |
| 2015-08-25 21:00:00 | 11.528 |
| 2015-08-25 21:15:00 | 11.528 |
| 2015-08-25 21:30:00 | 11.528 |
| 2015-08-25 21:45:00 | 11.528 |
| 2015-08-25 22:00:00 | 11.528 |
| 2015-08-25 22:15:00 | 11.528 |
| 2015-08-25 22:30:00 | 11.528 |
| 2015-08-25 22:45:00 | 11.528 |
| 2015-08-25 23:00:00 | 11.528 |
| 2015-08-25 23:15:00 | 11.431 |
| 2015-08-25 23:30:00 | 11.528 |
| 2015-08-25 23:45:00 | 11.528 |
| 2015-08-26 | 11.528 |
| 2015-08-26 00:15:00 | 11.528 |
| 2015-08-26 00:30:00 | 11.528 |
| 2015-08-26 00:45:00 | 11.528 |
| 2015-08-26 01:00:00 | 11.528 |
| 2015-08-26 01:15:00 | 11.528 |
| 2015-08-26 01:30:00 | 11.528 |
| 2015-08-26 01:45:00 | 11.528 |
| 2015-08-26 02:00:00 | 11.528 |
| 2015-08-26 02:15:00 | 11.528 |
| 2015-08-26 02:30:00 | 11.528 |
| 2015-08-26 02:45:00 | 11.528 |
| 2015-08-26 03:00:00 | 11.528 |
| 2015-08-26 03:15:00 | 11.528 |
| 2015-08-26 03:30:00 | 11.528 |
| 2015-08-26 03:45:00 | 11.528 |
| 2015-08-26 04:00:00 | 11.528 |
| 2015-08-26 04:15:00 | 11.528 |
| 2015-08-26 04:30:00 | 11.528 |
| 2015-08-26 04:45:00 | 11.528 |
| 2015-08-26 05:00:00 | 11.528 |
| 2015-08-26 05:15:00 | 11.528 |
| 2015-08-26 05:30:00 | 11.528 |
| 2015-08-26 05:45:00 | 11.528 |
| 2015-08-26 06:00:00 | 11.528 |
| 2015-08-26 06:15:00 | 11.528 |
| 2015-08-26 06:30:00 | 11.528 |
| 2015-08-26 06:45:00 | 11.528 |
| 2015-08-26 07:00:00 | 11.528 |
| 2015-08-26 07:15:00 | 11.528 |
| 2015-08-26 07:30:00 | 11.625 |
| 2015-08-26 07:45:00 | 11.625 |
| 2015-08-26 08:00:00 | 11.625 |
| 2015-08-26 08:15:00 | 11.625 |
| 2015-08-26 08:30:00 | 11.528 |
| 2015-08-26 08:45:00 | 11.528 |
| 2015-08-26 09:00:00 | 11.528 |
| 2015-08-26 09:15:00 | 11.528 |
| 2015-08-26 09:30:00 | 11.528 |
| 2015-08-26 09:45:00 | 11.528 |
| 2015-08-26 10:00:00 | 11.528 |
| 2015-08-26 10:15:00 | 11.528 |
| 2015-08-26 10:30:00 | 11.528 |
| 2015-08-26 10:45:00 | 11.625 |
| 2015-08-26 11:00:00 | 11.722 |
| 2015-08-26 11:15:00 | 11.722 |
| 2015-08-26 11:30:00 | 11.625 |
| 2015-08-26 11:45:00 | 11.722 |
| 2015-08-26 12:00:00 | 11.819 |
| 2015-08-26 12:15:00 | 11.819 |
| 2015-08-26 12:30:00 | 11.722 |
| 2015-08-26 12:45:00 | 11.722 |
| 2015-08-26 13:00:00 | 11.625 |
| 2015-08-26 13:15:00 | 11.625 |
| 2015-08-26 13:30:00 | 11.625 |
| 2015-08-26 13:45:00 | 11.625 |
| 2015-08-26 14:00:00 | 11.625 |
| 2015-08-26 14:15:00 | 11.625 |
| 2015-08-26 14:30:00 | 11.722 |
| 2015-08-26 14:45:00 | 11.625 |
| 2015-08-26 15:00:00 | 11.722 |
| 2015-08-26 15:15:00 | 11.722 |
| 2015-08-26 15:30:00 | 11.722 |
| 2015-08-26 15:45:00 | 11.722 |
| 2015-08-26 16:00:00 | 11.722 |
| 2015-08-26 16:15:00 | 11.722 |
| 2015-08-26 16:30:00 | 11.625 |
| 2015-08-26 16:45:00 | 11.722 |
| 2015-08-26 17:00:00 | 11.722 |
| 2015-08-26 17:15:00 | 11.722 |
| 2015-08-26 17:30:00 | 11.722 |
| 2015-08-26 17:45:00 | 11.625 |
| 2015-08-26 18:00:00 | 11.625 |
| 2015-08-26 18:15:00 | 11.625 |
| 2015-08-26 18:30:00 | 11.625 |
| 2015-08-26 18:45:00 | 11.625 |
| 2015-08-26 19:00:00 | 11.625 |
| 2015-08-26 19:15:00 | 11.625 |
| 2015-08-26 19:30:00 | 11.625 |
| 2015-08-26 19:45:00 | 11.625 |
| 2015-08-26 20:00:00 | 11.625 |
| 2015-08-26 20:15:00 | 11.625 |
| 2015-08-26 20:30:00 | 11.528 |
| 2015-08-26 20:45:00 | 11.528 |
| 2015-08-26 21:00:00 | 11.528 |
| 2015-08-26 21:15:00 | 11.528 |
| 2015-08-26 21:30:00 | 11.528 |
| 2015-08-26 21:45:00 | 11.528 |
| 2015-08-26 22:00:00 | 11.528 |
| 2015-08-26 22:15:00 | 11.528 |
| 2015-08-26 22:30:00 | 11.528 |
| 2015-08-26 22:45:00 | 11.528 |
| 2015-08-26 23:00:00 | 11.528 |
| 2015-08-26 23:15:00 | 11.528 |
| 2015-08-26 23:30:00 | 11.528 |
| 2015-08-26 23:45:00 | 11.528 |
| 2015-08-27 | 11.528 |
| 2015-08-27 00:15:00 | 11.431 |
| 2015-08-27 00:30:00 | 11.431 |
| 2015-08-27 00:45:00 | 11.431 |
| 2015-08-27 01:00:00 | 11.431 |
| 2015-08-27 01:15:00 | 11.431 |
| 2015-08-27 01:30:00 | 11.431 |
| 2015-08-27 01:45:00 | 11.431 |
| 2015-08-27 02:00:00 | 11.431 |
| 2015-08-27 02:15:00 | 11.431 |
| 2015-08-27 02:30:00 | 11.431 |
| 2015-08-27 02:45:00 | 11.431 |
| 2015-08-27 03:00:00 | 11.431 |
| 2015-08-27 03:15:00 | 11.431 |
| 2015-08-27 03:30:00 | 11.431 |
| 2015-08-27 03:45:00 | 11.431 |
| 2015-08-27 04:00:00 | 11.431 |
| 2015-08-27 04:15:00 | 11.431 |
| 2015-08-27 04:30:00 | 11.431 |
| 2015-08-27 04:45:00 | 11.431 |
| 2015-08-27 05:00:00 | 11.431 |
| 2015-08-27 05:15:00 | 11.431 |
| 2015-08-27 05:30:00 | 11.431 |
| 2015-08-27 05:45:00 | 11.431 |
| 2015-08-27 06:00:00 | 11.431 |
| 2015-08-27 06:15:00 | 11.431 |
| 2015-08-27 06:30:00 | 11.431 |
| 2015-08-27 06:45:00 | 11.431 |
| 2015-08-27 07:00:00 | 11.431 |
| 2015-08-27 07:15:00 | 11.431 |
| 2015-08-27 07:30:00 | 11.431 |
| 2015-08-27 07:45:00 | 11.431 |
| 2015-08-27 08:00:00 | 11.431 |
| 2015-08-27 08:15:00 | 11.431 |
| 2015-08-27 08:30:00 | 11.431 |
| 2015-08-27 08:45:00 | 11.431 |
| 2015-08-27 09:00:00 | 11.431 |
| 2015-08-27 09:15:00 | 11.431 |
| 2015-08-27 09:30:00 | 11.431 |
| 2015-08-27 09:45:00 | 11.431 |
| 2015-08-27 10:00:00 | 11.431 |
| 2015-08-27 10:15:00 | 11.431 |
| 2015-08-27 10:30:00 | 11.528 |
| 2015-08-27 10:45:00 | 11.528 |
| 2015-08-27 11:00:00 | 11.528 |
| 2015-08-27 11:15:00 | 11.528 |
| 2015-08-27 11:30:00 | 11.528 |
| 2015-08-27 11:45:00 | 11.528 |
| 2015-08-27 12:00:00 | 11.528 |
| 2015-08-27 12:15:00 | 11.528 |
| 2015-08-27 12:30:00 | 11.528 |
| 2015-08-27 12:45:00 | 11.528 |
| 2015-08-27 13:00:00 | 11.528 |
| 2015-08-27 13:15:00 | 11.528 |
| 2015-08-27 13:30:00 | 11.528 |
| 2015-08-27 13:45:00 | 11.625 |
| 2015-08-27 14:00:00 | 11.625 |
| 2015-08-27 14:15:00 | 11.625 |
| 2015-08-27 14:30:00 | 11.625 |
| 2015-08-27 14:45:00 | 11.625 |
| 2015-08-27 15:00:00 | 11.625 |
| 2015-08-27 15:15:00 | 11.625 |
| 2015-08-27 15:30:00 | 11.625 |
| 2015-08-27 15:45:00 | 11.625 |
| 2015-08-27 16:00:00 | 11.625 |
| 2015-08-27 16:15:00 | 11.625 |
| 2015-08-27 16:30:00 | 11.625 |
| 2015-08-27 16:45:00 | 11.625 |
| 2015-08-27 17:00:00 | 11.625 |
| 2015-08-27 17:15:00 | 11.625 |
| 2015-08-27 17:30:00 | 11.625 |
| 2015-08-27 17:45:00 | 11.625 |
| 2015-08-27 18:00:00 | 11.625 |
| 2015-08-27 18:15:00 | 11.625 |
| 2015-08-27 18:30:00 | 11.625 |
| 2015-08-27 18:45:00 | 11.625 |
| 2015-08-27 19:00:00 | 11.528 |
| 2015-08-27 19:15:00 | 11.528 |
| 2015-08-27 19:30:00 | 11.528 |
| 2015-08-27 19:45:00 | 11.528 |
| 2015-08-27 20:00:00 | 11.528 |
| 2015-08-27 20:15:00 | 11.528 |
| 2015-08-27 20:30:00 | 11.528 |
| 2015-08-27 20:45:00 | 11.528 |
| 2015-08-27 21:00:00 | 11.528 |
| 2015-08-27 21:15:00 | 11.528 |
| 2015-08-27 21:30:00 | 11.431 |
| 2015-08-27 21:45:00 | 11.431 |
| 2015-08-27 22:00:00 | 11.431 |
| 2015-08-27 22:15:00 | 11.431 |
| 2015-08-27 22:30:00 | 11.431 |
| 2015-08-27 22:45:00 | 11.431 |
| 2015-08-27 23:00:00 | 11.431 |
| 2015-08-27 23:15:00 | 11.431 |
| 2015-08-27 23:30:00 | 11.334 |
| 2015-08-27 23:45:00 | 11.334 |
| 2015-08-28 | 11.334 |
| 2015-08-28 00:15:00 | 11.334 |
| 2015-08-28 00:30:00 | 11.334 |
| 2015-08-28 00:45:00 | 11.334 |
| 2015-08-28 01:00:00 | 11.334 |
| 2015-08-28 01:15:00 | 11.334 |
| 2015-08-28 01:30:00 | 11.334 |
| 2015-08-28 01:45:00 | 11.334 |
| 2015-08-28 02:00:00 | 11.334 |
| 2015-08-28 02:15:00 | 11.334 |
| 2015-08-28 02:30:00 | 11.236 |
| 2015-08-28 02:45:00 | 11.236 |
| 2015-08-28 03:00:00 | 11.236 |
| 2015-08-28 03:15:00 | 11.236 |
| 2015-08-28 03:30:00 | 11.236 |
| 2015-08-28 03:45:00 | 11.236 |
| 2015-08-28 04:00:00 | 11.236 |
| 2015-08-28 04:15:00 | 11.236 |
| 2015-08-28 04:30:00 | 11.236 |
| 2015-08-28 04:45:00 | 11.236 |
| 2015-08-28 05:00:00 | 11.236 |
| 2015-08-28 05:15:00 | 11.236 |
| 2015-08-28 05:30:00 | 11.236 |
| 2015-08-28 05:45:00 | 11.139 |
| 2015-08-28 06:00:00 | 11.236 |
| 2015-08-28 06:15:00 | 11.236 |
| 2015-08-28 06:30:00 | 11.236 |
| 2015-08-28 06:45:00 | 11.236 |
| 2015-08-28 07:00:00 | 11.236 |
| 2015-08-28 07:15:00 | 11.236 |
| 2015-08-28 07:30:00 | 11.236 |
| 2015-08-28 07:45:00 | 11.236 |
| 2015-08-28 08:00:00 | 11.236 |
| 2015-08-28 08:15:00 | 11.236 |
| 2015-08-28 08:30:00 | 11.236 |
| 2015-08-28 08:45:00 | 11.334 |
| 2015-08-28 09:00:00 | 11.334 |
| 2015-08-28 09:15:00 | 11.334 |
| 2015-08-28 09:30:00 | 11.334 |
| 2015-08-28 09:45:00 | 11.334 |
| 2015-08-28 10:00:00 | 11.431 |
| 2015-08-28 10:15:00 | 11.431 |
| 2015-08-28 10:30:00 | 11.431 |
| 2015-08-28 10:45:00 | 11.431 |
| 2015-08-28 11:00:00 | 11.431 |
| 2015-08-28 11:15:00 | 11.431 |
| 2015-08-28 11:30:00 | 11.528 |
| 2015-08-28 11:45:00 | 11.528 |
| 2015-08-28 12:00:00 | 11.528 |
| 2015-08-28 12:15:00 | 11.528 |
| 2015-08-28 12:30:00 | 11.528 |
| 2015-08-28 12:45:00 | 11.625 |
| 2015-08-28 13:00:00 | 11.625 |
| 2015-08-28 13:15:00 | 11.625 |
| 2015-08-28 13:30:00 | 11.625 |
| 2015-08-28 13:45:00 | 11.625 |
| 2015-08-28 14:00:00 | 11.625 |
| 2015-08-28 14:15:00 | 11.625 |
| 2015-08-28 14:30:00 | 11.625 |
| 2015-08-28 14:45:00 | 11.625 |
| 2015-08-28 15:00:00 | 11.722 |
| 2015-08-28 15:15:00 | 11.625 |
| 2015-08-28 15:30:00 | 11.722 |
| 2015-08-28 15:45:00 | 11.625 |
| 2015-08-28 16:00:00 | 11.722 |
| 2015-08-28 16:15:00 | 11.625 |
| 2015-08-28 16:30:00 | 11.625 |
| 2015-08-28 16:45:00 | 11.625 |
| 2015-08-28 17:00:00 | 11.625 |
| 2015-08-28 17:15:00 | 11.625 |
| 2015-08-28 17:30:00 | 11.625 |
| 2015-08-28 17:45:00 | 11.625 |
| 2015-08-28 18:00:00 | 11.625 |
| 2015-08-28 18:15:00 | 11.625 |
| 2015-08-28 18:30:00 | 11.625 |
| 2015-08-28 18:45:00 | 11.625 |
| 2015-08-28 19:00:00 | 11.528 |
| 2015-08-28 19:15:00 | 11.625 |
| 2015-08-28 19:30:00 | 11.528 |
| 2015-08-28 19:45:00 | 11.528 |
| 2015-08-28 20:00:00 | 11.528 |
| 2015-08-28 20:15:00 | 11.528 |
| 2015-08-28 20:30:00 | 11.528 |
| 2015-08-28 20:45:00 | 11.528 |
| 2015-08-28 21:00:00 | 11.528 |
| 2015-08-28 21:15:00 | 11.528 |
| 2015-08-28 21:30:00 | 11.431 |
| 2015-08-28 21:45:00 | 11.528 |
| 2015-08-28 22:00:00 | 11.431 |
| 2015-08-28 22:15:00 | 11.431 |
| 2015-08-28 22:30:00 | 11.431 |
| 2015-08-28 22:45:00 | 11.431 |
| 2015-08-28 23:00:00 | 11.431 |
| 2015-08-28 23:15:00 | 11.431 |
| 2015-08-28 23:30:00 | 11.431 |
| 2015-08-28 23:45:00 | 11.431 |
| 2015-08-29 | 11.431 |
| 2015-08-29 00:15:00 | 11.431 |
| 2015-08-29 00:30:00 | 11.431 |
| 2015-08-29 00:45:00 | 11.431 |
| 2015-08-29 01:00:00 | 11.431 |
| 2015-08-29 01:15:00 | 11.431 |
| 2015-08-29 01:30:00 | 11.431 |
| 2015-08-29 01:45:00 | 11.431 |
| 2015-08-29 02:00:00 | 11.431 |
| 2015-08-29 02:15:00 | 11.431 |
| 2015-08-29 02:30:00 | 11.334 |
| 2015-08-29 02:45:00 | 11.431 |
| 2015-08-29 03:00:00 | 11.334 |
| 2015-08-29 03:15:00 | 11.334 |
| 2015-08-29 03:30:00 | 11.334 |
| 2015-08-29 03:45:00 | 11.431 |
| 2015-08-29 04:00:00 | 11.431 |
| 2015-08-29 04:15:00 | 11.334 |
| 2015-08-29 04:30:00 | 11.431 |
| 2015-08-29 04:45:00 | 11.431 |
| 2015-08-29 05:00:00 | 11.334 |
| 2015-08-29 05:15:00 | 11.334 |
| 2015-08-29 05:30:00 | 11.334 |
| 2015-08-29 05:45:00 | 11.334 |
| 2015-08-29 06:00:00 | 11.334 |
| 2015-08-29 06:15:00 | 11.431 |
| 2015-08-29 06:30:00 | 11.334 |
| 2015-08-29 06:45:00 | 11.431 |
| 2015-08-29 07:00:00 | 11.334 |
| 2015-08-29 07:15:00 | 11.334 |
| 2015-08-29 07:30:00 | 11.334 |
| 2015-08-29 07:45:00 | 11.431 |
| 2015-08-29 08:00:00 | 11.431 |
| 2015-08-29 08:15:00 | 11.431 |
| 2015-08-29 08:30:00 | 11.431 |
| 2015-08-29 08:45:00 | 11.431 |
| 2015-08-29 09:00:00 | 11.431 |
| 2015-08-29 09:15:00 | 11.431 |
| 2015-08-29 09:30:00 | 11.431 |
| 2015-08-29 09:45:00 | 11.431 |
| 2015-08-29 10:00:00 | 11.528 |
| 2015-08-29 10:15:00 | 11.528 |
| 2015-08-29 10:30:00 | 11.528 |
| 2015-08-29 10:45:00 | 11.528 |
| 2015-08-29 11:00:00 | 11.528 |
| 2015-08-29 11:15:00 | 11.528 |
| 2015-08-29 11:30:00 | 11.528 |
| 2015-08-29 11:45:00 | 11.625 |
| 2015-08-29 12:00:00 | 11.625 |
| 2015-08-29 12:15:00 | 11.625 |
| 2015-08-29 12:30:00 | 11.625 |
| 2015-08-29 12:45:00 | 11.625 |
| 2015-08-29 13:00:00 | 11.625 |
| 2015-08-29 13:15:00 | 11.625 |
| 2015-08-29 13:30:00 | 11.625 |
| 2015-08-29 13:45:00 | 11.625 |
| 2015-08-29 14:00:00 | 11.625 |
| 2015-08-29 14:15:00 | 11.625 |
| 2015-08-29 14:30:00 | 11.625 |
| 2015-08-29 14:45:00 | 11.625 |
| 2015-08-29 15:00:00 | 11.625 |
| 2015-08-29 15:15:00 | 11.625 |
| 2015-08-29 15:30:00 | 11.625 |
| 2015-08-29 15:45:00 | 11.625 |
| 2015-08-29 16:00:00 | 11.625 |
| 2015-08-29 16:15:00 | 11.625 |
| 2015-08-29 16:30:00 | 11.625 |
| 2015-08-29 16:45:00 | 11.625 |
| 2015-08-29 17:00:00 | 11.625 |
| 2015-08-29 17:15:00 | 11.625 |
| 2015-08-29 17:30:00 | 11.625 |
| 2015-08-29 17:45:00 | 11.625 |
| 2015-08-29 18:00:00 | 11.528 |
| 2015-08-29 18:15:00 | 11.528 |
| 2015-08-29 18:30:00 | 11.528 |
| 2015-08-29 18:45:00 | 11.528 |
| 2015-08-29 19:00:00 | 11.528 |
| 2015-08-29 19:15:00 | 11.528 |
| 2015-08-29 19:30:00 | 11.528 |
| 2015-08-29 19:45:00 | 11.528 |
| 2015-08-29 20:00:00 | 11.528 |
| 2015-08-29 20:15:00 | 11.528 |
| 2015-08-29 20:30:00 | 11.528 |
| 2015-08-29 20:45:00 | 11.528 |
| 2015-08-29 21:00:00 | 11.528 |
| 2015-08-29 21:15:00 | 11.528 |
| 2015-08-29 21:30:00 | 11.528 |
| 2015-08-29 21:45:00 | 11.528 |
| 2015-08-29 22:00:00 | 11.528 |
| 2015-08-29 22:15:00 | 11.528 |
| 2015-08-29 22:30:00 | 11.528 |
| 2015-08-29 22:45:00 | 11.431 |
| 2015-08-29 23:00:00 | 11.431 |
| 2015-08-29 23:15:00 | 11.528 |
| 2015-08-29 23:30:00 | 11.528 |
| 2015-08-29 23:45:00 | 11.431 |
| 2015-08-30 | 11.431 |
| 2015-08-30 00:15:00 | 11.431 |
| 2015-08-30 00:30:00 | 11.431 |
| 2015-08-30 00:45:00 | 11.431 |
| 2015-08-30 01:00:00 | 11.431 |
| 2015-08-30 01:15:00 | 11.431 |
| 2015-08-30 01:30:00 | 11.431 |
| 2015-08-30 01:45:00 | 11.431 |
| 2015-08-30 02:00:00 | 11.431 |
| 2015-08-30 02:15:00 | 11.431 |
| 2015-08-30 02:30:00 | 11.431 |
| 2015-08-30 02:45:00 | 11.431 |
| 2015-08-30 03:00:00 | 11.431 |
| 2015-08-30 03:15:00 | 11.431 |
| 2015-08-30 03:30:00 | 11.431 |
| 2015-08-30 03:45:00 | 11.431 |
| 2015-08-30 04:00:00 | 11.431 |
| 2015-08-30 04:15:00 | 11.431 |
| 2015-08-30 04:30:00 | 11.431 |
| 2015-08-30 04:45:00 | 11.431 |
| 2015-08-30 05:00:00 | 11.431 |
| 2015-08-30 05:15:00 | 11.431 |
| 2015-08-30 05:30:00 | 11.431 |
| 2015-08-30 05:45:00 | 11.431 |
| 2015-08-30 06:00:00 | 11.431 |
| 2015-08-30 06:15:00 | 11.431 |
| 2015-08-30 06:30:00 | 11.431 |
| 2015-08-30 06:45:00 | 11.431 |
| 2015-08-30 07:00:00 | 11.431 |
| 2015-08-30 07:15:00 | 11.431 |
| 2015-08-30 07:30:00 | 11.431 |
| 2015-08-30 07:45:00 | 11.431 |
| 2015-08-30 08:00:00 | 11.431 |
| 2015-08-30 08:15:00 | 11.431 |
| 2015-08-30 08:30:00 | 11.431 |
| 2015-08-30 08:45:00 | 11.528 |
| 2015-08-30 09:00:00 | 11.528 |
| 2015-08-30 09:15:00 | 11.528 |
| 2015-08-30 09:30:00 | 11.528 |
| 2015-08-30 09:45:00 | 11.528 |
| 2015-08-30 10:00:00 | 11.528 |
| 2015-08-30 10:15:00 | 11.528 |
| 2015-08-30 10:30:00 | 11.528 |
| 2015-08-30 10:45:00 | 11.528 |
| 2015-08-30 11:00:00 | 11.528 |
| 2015-08-30 11:15:00 | 11.528 |
| 2015-08-30 11:30:00 | 11.625 |
| 2015-08-30 11:45:00 | 11.625 |
| 2015-08-30 12:00:00 | 11.625 |
| 2015-08-30 12:15:00 | 11.625 |
| 2015-08-30 12:30:00 | 11.625 |
| 2015-08-30 12:45:00 | 11.625 |
| 2015-08-30 13:00:00 | 11.625 |
| 2015-08-30 13:15:00 | 11.625 |
| 2015-08-30 13:30:00 | 11.625 |
| 2015-08-30 13:45:00 | 11.625 |
| 2015-08-30 14:00:00 | 11.625 |
| 2015-08-30 14:15:00 | 11.625 |
| 2015-08-30 14:30:00 | 11.625 |
| 2015-08-30 14:45:00 | 11.722 |
| 2015-08-30 15:00:00 | 11.625 |
| 2015-08-30 15:15:00 | 11.625 |
| 2015-08-30 15:30:00 | 11.625 |
| 2015-08-30 15:45:00 | 11.625 |
| 2015-08-30 16:00:00 | 11.625 |
| 2015-08-30 16:15:00 | 11.625 |
| 2015-08-30 16:30:00 | 11.625 |
| 2015-08-30 16:45:00 | 11.625 |
| 2015-08-30 17:00:00 | 11.625 |
| 2015-08-30 17:15:00 | 11.625 |
| 2015-08-30 17:30:00 | 11.625 |
| 2015-08-30 17:45:00 | 11.625 |
| 2015-08-30 18:00:00 | 11.625 |
| 2015-08-30 18:15:00 | 11.625 |
| 2015-08-30 18:30:00 | 11.625 |
| 2015-08-30 18:45:00 | 11.625 |
| 2015-08-30 19:00:00 | 11.625 |
| 2015-08-30 19:15:00 | 11.625 |
| 2015-08-30 19:30:00 | 11.528 |
| 2015-08-30 19:45:00 | 11.625 |
| 2015-08-30 20:00:00 | 11.625 |
| 2015-08-30 20:15:00 | 11.528 |
| 2015-08-30 20:30:00 | 11.528 |
| 2015-08-30 20:45:00 | 11.528 |
| 2015-08-30 21:00:00 | 11.528 |
| 2015-08-30 21:15:00 | 11.528 |
| 2015-08-30 21:30:00 | 11.528 |
| 2015-08-30 21:45:00 | 11.528 |
| 2015-08-30 22:00:00 | 11.528 |
| 2015-08-30 22:15:00 | 11.528 |
| 2015-08-30 22:30:00 | 11.528 |
| 2015-08-30 22:45:00 | 11.528 |
| 2015-08-30 23:00:00 | 11.528 |
| 2015-08-30 23:15:00 | 11.528 |
| 2015-08-30 23:30:00 | 11.528 |
| 2015-08-30 23:45:00 | 11.528 |
| 2015-08-31 | 11.528 |
| 2015-08-31 00:15:00 | 11.528 |
| 2015-08-31 00:30:00 | 11.528 |
| 2015-08-31 00:45:00 | 11.528 |
| 2015-08-31 01:00:00 | 11.431 |
| 2015-08-31 01:15:00 | 11.431 |
| 2015-08-31 01:30:00 | 11.528 |
| 2015-08-31 01:45:00 | 11.528 |
| 2015-08-31 02:00:00 | 11.528 |
| 2015-08-31 02:15:00 | 11.431 |
| 2015-08-31 02:30:00 | 11.431 |
| 2015-08-31 02:45:00 | 11.431 |
| 2015-08-31 03:00:00 | 11.431 |
| 2015-08-31 03:15:00 | 11.528 |
| 2015-08-31 03:30:00 | 11.431 |
| 2015-08-31 03:45:00 | 11.431 |
| 2015-08-31 04:00:00 | 11.431 |
| 2015-08-31 04:15:00 | 11.431 |
| 2015-08-31 04:30:00 | 11.431 |
| 2015-08-31 04:45:00 | 11.431 |
| 2015-08-31 05:00:00 | 11.528 |
| 2015-08-31 05:15:00 | 11.431 |
| 2015-08-31 05:30:00 | 11.431 |
| 2015-08-31 05:45:00 | 11.528 |
| 2015-08-31 06:00:00 | 11.528 |
| 2015-08-31 06:15:00 | 11.528 |
| 2015-08-31 06:30:00 | 11.528 |
| 2015-08-31 06:45:00 | 11.528 |
| 2015-08-31 07:00:00 | 11.528 |
| 2015-08-31 07:15:00 | 11.528 |
| 2015-08-31 07:30:00 | 11.528 |
| 2015-08-31 07:45:00 | 11.625 |
| 2015-08-31 08:00:00 | 11.528 |
| 2015-08-31 08:15:00 | 11.528 |
| 2015-08-31 08:30:00 | 11.528 |
| 2015-08-31 08:45:00 | 11.528 |
| 2015-08-31 09:00:00 | 11.528 |
| 2015-08-31 09:15:00 | 11.528 |
| 2015-08-31 09:30:00 | 11.528 |
| 2015-08-31 09:45:00 | 11.528 |
| 2015-08-31 10:00:00 | 11.528 |
| 2015-08-31 10:15:00 | 11.528 |
| 2015-08-31 10:30:00 | 11.528 |
| 2015-08-31 10:45:00 | 11.528 |
| 2015-08-31 11:00:00 | 11.528 |
| 2015-08-31 11:15:00 | 11.528 |
| 2015-08-31 11:30:00 | 11.528 |
| 2015-08-31 11:45:00 | 11.528 |
| 2015-08-31 12:00:00 | 11.528 |
| 2015-08-31 12:15:00 | 11.528 |
| 2015-08-31 12:30:00 | 11.528 |
| 2015-08-31 12:45:00 | 11.528 |
| 2015-08-31 13:00:00 | 11.528 |
| 2015-08-31 13:15:00 | 11.528 |
| 2015-08-31 13:30:00 | 11.528 |
| 2015-08-31 13:45:00 | 11.528 |
| 2015-08-31 14:00:00 | 11.528 |
| 2015-08-31 14:15:00 | 11.528 |
| 2015-08-31 14:30:00 | 11.528 |
| 2015-08-31 14:45:00 | 11.528 |
| 2015-08-31 15:00:00 | 11.528 |
| 2015-08-31 15:15:00 | 11.528 |
| 2015-08-31 15:30:00 | 11.528 |
| 2015-08-31 15:45:00 | 11.528 |
| 2015-08-31 16:00:00 | 11.528 |
| 2015-08-31 16:15:00 | 11.528 |
| 2015-08-31 16:30:00 | 11.528 |
| 2015-08-31 16:45:00 | 11.528 |
| 2015-08-31 17:00:00 | 11.528 |
| 2015-08-31 17:15:00 | 11.528 |
| 2015-08-31 17:30:00 | 11.528 |
| 2015-08-31 17:45:00 | 11.528 |
| 2015-08-31 18:00:00 | 11.528 |
| 2015-08-31 18:15:00 | 11.528 |
| 2015-08-31 18:30:00 | 11.528 |
| 2015-08-31 18:45:00 | 11.528 |
| 2015-08-31 19:00:00 | 11.528 |
| 2015-08-31 19:15:00 | 11.528 |
| 2015-08-31 19:30:00 | 11.528 |
| 2015-08-31 19:45:00 | 11.528 |
| 2015-08-31 20:00:00 | 11.528 |
| 2015-08-31 20:15:00 | 11.528 |
| 2015-08-31 20:30:00 | 11.528 |
| 2015-08-31 20:45:00 | 11.528 |
| 2015-08-31 21:00:00 | 11.528 |
| 2015-08-31 21:15:00 | 11.528 |
| 2015-08-31 21:30:00 | 11.528 |
| 2015-08-31 21:45:00 | 11.431 |
| 2015-08-31 22:00:00 | 11.431 |
| 2015-08-31 22:15:00 | 11.431 |
| 2015-08-31 22:30:00 | 11.431 |
| 2015-08-31 22:45:00 | 11.431 |
| 2015-08-31 23:00:00 | 11.431 |
| 2015-08-31 23:15:00 | 11.431 |
| 2015-08-31 23:30:00 | 11.431 |
| 2015-08-31 23:45:00 | 11.431 |
| 2015-09-01 | 11.431 |
| 2015-09-01 00:15:00 | 11.431 |
| 2015-09-01 00:30:00 | 11.431 |
| 2015-09-01 00:45:00 | 11.431 |
| 2015-09-01 01:00:00 | 11.431 |
| 2015-09-01 01:15:00 | 11.431 |
| 2015-09-01 01:30:00 | 11.431 |
| 2015-09-01 01:45:00 | 11.431 |
| 2015-09-01 02:00:00 | 11.431 |
| 2015-09-01 02:15:00 | 11.431 |
| 2015-09-01 02:30:00 | 11.431 |
| 2015-09-01 02:45:00 | 11.431 |
| 2015-09-01 03:00:00 | 11.431 |
| 2015-09-01 03:15:00 | 11.431 |
| 2015-09-01 03:30:00 | 11.431 |
| 2015-09-01 03:45:00 | 11.431 |
| 2015-09-01 04:00:00 | 11.431 |
| 2015-09-01 04:15:00 | 11.431 |
| 2015-09-01 04:30:00 | 11.431 |
| 2015-09-01 04:45:00 | 11.431 |
| 2015-09-01 05:00:00 | 11.431 |
| 2015-09-01 05:15:00 | 11.334 |
| 2015-09-01 05:30:00 | 11.431 |
| 2015-09-01 05:45:00 | 11.334 |
| 2015-09-01 06:00:00 | 11.334 |
| 2015-09-01 06:15:00 | 11.334 |
| 2015-09-01 06:30:00 | 11.334 |
| 2015-09-01 06:45:00 | 11.334 |
| 2015-09-01 07:00:00 | 11.334 |
| 2015-09-01 07:15:00 | 11.334 |
| 2015-09-01 07:30:00 | 11.334 |
| 2015-09-01 07:45:00 | 11.334 |
| 2015-09-01 08:00:00 | 11.334 |
| 2015-09-01 08:15:00 | 11.334 |
| 2015-09-01 08:30:00 | 11.334 |
| 2015-09-01 08:45:00 | 11.431 |
| 2015-09-01 09:00:00 | 11.431 |
| 2015-09-01 09:15:00 | 11.431 |
| 2015-09-01 09:30:00 | 11.431 |
| 2015-09-01 09:45:00 | 11.431 |
| 2015-09-01 10:00:00 | 11.431 |
| 2015-09-01 10:15:00 | 11.431 |
| 2015-09-01 10:30:00 | 11.431 |
| 2015-09-01 10:45:00 | 11.431 |
| 2015-09-01 11:00:00 | 11.528 |
| 2015-09-01 11:15:00 | 11.528 |
| 2015-09-01 11:30:00 | 11.528 |
| 2015-09-01 11:45:00 | 11.528 |
| 2015-09-01 12:00:00 | 11.528 |
| 2015-09-01 12:15:00 | 11.528 |
| 2015-09-01 12:30:00 | 11.528 |
| 2015-09-01 12:45:00 | 11.528 |
| 2015-09-01 13:00:00 | 11.625 |
| 2015-09-01 13:15:00 | 11.625 |
| 2015-09-01 13:30:00 | 11.528 |
| 2015-09-01 13:45:00 | 11.625 |
| 2015-09-01 14:00:00 | 11.625 |
| 2015-09-01 14:15:00 | 11.625 |
| 2015-09-01 14:30:00 | 11.625 |
| 2015-09-01 14:45:00 | 11.625 |
| 2015-09-01 15:00:00 | 11.625 |
| 2015-09-01 15:15:00 | 11.625 |
| 2015-09-01 15:30:00 | 11.722 |
| 2015-09-01 15:45:00 | 11.625 |
| 2015-09-01 16:00:00 | 11.625 |
| 2015-09-01 16:15:00 | 11.625 |
| 2015-09-01 16:30:00 | 11.625 |
| 2015-09-01 16:45:00 | 11.625 |
| 2015-09-01 17:00:00 | 11.625 |
| 2015-09-01 17:15:00 | 11.625 |
| 2015-09-01 17:30:00 | 11.625 |
| 2015-09-01 17:45:00 | 11.625 |
| 2015-09-01 18:00:00 | 11.625 |
| 2015-09-01 18:15:00 | 11.625 |
| 2015-09-01 18:30:00 | 11.625 |
| 2015-09-01 18:45:00 | 11.625 |
| 2015-09-01 19:00:00 | 11.625 |
| 2015-09-01 19:15:00 | 11.625 |
| 2015-09-01 19:30:00 | 11.528 |
| 2015-09-01 19:45:00 | 11.528 |
| 2015-09-01 20:00:00 | 11.528 |
| 2015-09-01 20:15:00 | 11.528 |
| 2015-09-01 20:30:00 | 11.528 |
| 2015-09-01 20:45:00 | 11.528 |
| 2015-09-01 21:00:00 | 11.528 |
| 2015-09-01 21:15:00 | 11.431 |
| 2015-09-01 21:30:00 | 11.431 |
| 2015-09-01 21:45:00 | 11.431 |
| 2015-09-01 22:00:00 | 11.431 |
| 2015-09-01 22:15:00 | 11.431 |
| 2015-09-01 22:30:00 | 11.431 |
| 2015-09-01 22:45:00 | 11.431 |
| 2015-09-01 23:00:00 | 11.334 |
| 2015-09-01 23:15:00 | 11.334 |
| 2015-09-01 23:30:00 | 11.334 |
| 2015-09-01 23:45:00 | 11.334 |
| 2015-09-02 | 11.334 |
| 2015-09-02 00:15:00 | 11.334 |
| 2015-09-02 00:30:00 | 11.334 |
| 2015-09-02 00:45:00 | 11.334 |
| 2015-09-02 01:00:00 | 11.334 |
| 2015-09-02 01:15:00 | 11.236 |
| 2015-09-02 01:30:00 | 11.236 |
| 2015-09-02 01:45:00 | 11.236 |
| 2015-09-02 02:00:00 | 11.236 |
| 2015-09-02 02:15:00 | 11.236 |
| 2015-09-02 02:30:00 | 11.236 |
| 2015-09-02 02:45:00 | 11.236 |
| 2015-09-02 03:00:00 | 11.236 |
| 2015-09-02 03:15:00 | 11.236 |
| 2015-09-02 03:30:00 | 11.236 |
| 2015-09-02 03:45:00 | 11.236 |
| 2015-09-02 04:00:00 | 11.236 |
| 2015-09-02 04:15:00 | 11.236 |
| 2015-09-02 04:30:00 | 11.236 |
| 2015-09-02 04:45:00 | 11.236 |
| 2015-09-02 05:00:00 | 11.236 |
| 2015-09-02 05:15:00 | 11.236 |
| 2015-09-02 05:30:00 | 11.236 |
| 2015-09-02 05:45:00 | 11.236 |
| 2015-09-02 06:00:00 | 11.236 |
| 2015-09-02 06:15:00 | 11.236 |
| 2015-09-02 06:30:00 | 11.139 |
| 2015-09-02 06:45:00 | 11.139 |
| 2015-09-02 07:00:00 | 11.139 |
| 2015-09-02 07:15:00 | 11.139 |
| 2015-09-02 07:30:00 | 11.139 |
| 2015-09-02 07:45:00 | 11.236 |
| 2015-09-02 08:00:00 | 11.236 |
| 2015-09-02 08:15:00 | 11.236 |
| 2015-09-02 08:30:00 | 11.236 |
| 2015-09-02 08:45:00 | 11.236 |
| 2015-09-02 09:00:00 | 11.236 |
| 2015-09-02 09:15:00 | 11.334 |
| 2015-09-02 09:30:00 | 11.334 |
| 2015-09-02 09:45:00 | 11.334 |
| 2015-09-02 10:00:00 | 11.334 |
| 2015-09-02 10:15:00 | 11.431 |
| 2015-09-02 10:30:00 | 11.431 |
| 2015-09-02 10:45:00 | 11.431 |
| 2015-09-02 11:00:00 | 11.431 |
| 2015-09-02 11:15:00 | 11.431 |
| 2015-09-02 11:30:00 | 11.431 |
| 2015-09-02 11:45:00 | 11.528 |
| 2015-09-02 12:00:00 | 11.528 |
| 2015-09-02 12:15:00 | 11.528 |
| 2015-09-02 12:30:00 | 11.528 |
| 2015-09-02 12:45:00 | 11.528 |
| 2015-09-02 13:00:00 | 11.528 |
| 2015-09-02 13:15:00 | 11.528 |
| 2015-09-02 13:30:00 | 11.528 |
| 2015-09-02 13:45:00 | 11.528 |
| 2015-09-02 14:00:00 | 11.528 |
| 2015-09-02 14:15:00 | 11.528 |
| 2015-09-02 14:30:00 | 11.528 |
| 2015-09-02 14:45:00 | 11.528 |
| 2015-09-02 15:00:00 | 11.528 |
| 2015-09-02 15:15:00 | 11.528 |
| 2015-09-02 15:30:00 | 11.528 |
| 2015-09-02 15:45:00 | 11.625 |
| 2015-09-02 16:00:00 | 11.528 |
| 2015-09-02 16:15:00 | 11.625 |
| 2015-09-02 16:30:00 | 11.625 |
| 2015-09-02 16:45:00 | 11.625 |
| 2015-09-02 17:00:00 | 11.625 |
| 2015-09-02 17:15:00 | 11.528 |
| 2015-09-02 17:30:00 | 11.625 |
| 2015-09-02 17:45:00 | 11.528 |
| 2015-09-02 18:00:00 | 11.528 |
| 2015-09-02 18:15:00 | 11.528 |
| 2015-09-02 18:30:00 | 11.528 |
| 2015-09-02 18:45:00 | 11.528 |
| 2015-09-02 19:00:00 | 11.528 |
| 2015-09-02 19:15:00 | 11.528 |
| 2015-09-02 19:30:00 | 11.528 |
| 2015-09-02 19:45:00 | 11.528 |
| 2015-09-02 20:00:00 | 11.528 |
| 2015-09-02 20:15:00 | 11.528 |
| 2015-09-02 20:30:00 | 11.528 |
| 2015-09-02 20:45:00 | 11.431 |
| 2015-09-02 21:00:00 | 11.431 |
| 2015-09-02 21:15:00 | 11.431 |
| 2015-09-02 21:30:00 | 11.431 |
| 2015-09-02 21:45:00 | 11.431 |
| 2015-09-02 22:00:00 | 11.431 |
| 2015-09-02 22:15:00 | 11.334 |
| 2015-09-02 22:30:00 | 11.334 |
| 2015-09-02 22:45:00 | 11.334 |
| 2015-09-02 23:00:00 | 11.334 |
| 2015-09-02 23:15:00 | 11.334 |
| 2015-09-02 23:30:00 | 11.334 |
| 2015-09-02 23:45:00 | 11.334 |
| 2015-09-03 | 11.334 |
| 2015-09-03 00:15:00 | 11.334 |
| 2015-09-03 00:30:00 | 11.334 |
| 2015-09-03 00:45:00 | 11.334 |
| 2015-09-03 01:00:00 | 11.334 |
| 2015-09-03 01:15:00 | 11.334 |
| 2015-09-03 01:30:00 | 11.334 |
| 2015-09-03 01:45:00 | 11.334 |
| 2015-09-03 02:00:00 | 11.334 |
| 2015-09-03 02:15:00 | 11.334 |
| 2015-09-03 02:30:00 | 11.334 |
| 2015-09-03 02:45:00 | 11.334 |
| 2015-09-03 03:00:00 | 11.334 |
| 2015-09-03 03:15:00 | 11.334 |
| 2015-09-03 03:30:00 | 11.334 |
| 2015-09-03 03:45:00 | 11.334 |
| 2015-09-03 04:00:00 | 11.334 |
| 2015-09-03 04:15:00 | 11.334 |
| 2015-09-03 04:30:00 | 11.334 |
| 2015-09-03 04:45:00 | 11.334 |
| 2015-09-03 05:00:00 | 11.334 |
| 2015-09-03 05:15:00 | 11.334 |
| 2015-09-03 05:30:00 | 11.334 |
| 2015-09-03 05:45:00 | 11.236 |
| 2015-09-03 06:00:00 | 11.236 |
| 2015-09-03 06:15:00 | 11.236 |
| 2015-09-03 06:30:00 | 11.236 |
| 2015-09-03 06:45:00 | 11.236 |
| 2015-09-03 07:00:00 | 11.236 |
| 2015-09-03 07:15:00 | 11.236 |
| 2015-09-03 07:30:00 | 11.236 |
| 2015-09-03 07:45:00 | 11.236 |
| 2015-09-03 08:00:00 | 11.334 |
| 2015-09-03 08:15:00 | 11.334 |
| 2015-09-03 08:30:00 | 11.334 |
| 2015-09-03 08:45:00 | 11.334 |
| 2015-09-03 09:00:00 | 11.334 |
| 2015-09-03 09:15:00 | 11.334 |
| 2015-09-03 09:30:00 | 11.334 |
| 2015-09-03 09:45:00 | 11.431 |
| 2015-09-03 10:00:00 | 11.431 |
| 2015-09-03 10:15:00 | 11.431 |
| 2015-09-03 10:30:00 | 11.431 |
| 2015-09-03 10:45:00 | 11.431 |
| 2015-09-03 11:00:00 | 11.431 |
| 2015-09-03 11:15:00 | 11.431 |
| 2015-09-03 11:30:00 | 11.431 |
| 2015-09-03 11:45:00 | 11.431 |
| 2015-09-03 12:00:00 | 11.528 |
| 2015-09-03 12:15:00 | 11.528 |
| 2015-09-03 12:30:00 | 11.528 |
| 2015-09-03 12:45:00 | 11.528 |
| 2015-09-03 13:00:00 | 11.528 |
| 2015-09-03 13:15:00 | 11.528 |
| 2015-09-03 13:30:00 | 11.528 |
| 2015-09-03 13:45:00 | 11.528 |
| 2015-09-03 14:00:00 | 11.528 |
| 2015-09-03 14:15:00 | 11.528 |
| 2015-09-03 14:30:00 | 11.528 |
| 2015-09-03 14:45:00 | 11.528 |
| 2015-09-03 15:00:00 | 11.528 |
| 2015-09-03 15:15:00 | 11.528 |
| 2015-09-03 15:30:00 | 11.528 |
| 2015-09-03 15:45:00 | 11.528 |
| 2015-09-03 16:00:00 | 11.528 |
| 2015-09-03 16:15:00 | 11.528 |
| 2015-09-03 16:30:00 | 11.528 |
| 2015-09-03 16:45:00 | 11.528 |
| 2015-09-03 17:00:00 | 11.528 |
| 2015-09-03 17:15:00 | 11.528 |
| 2015-09-03 17:30:00 | 11.528 |
| 2015-09-03 17:45:00 | 11.528 |
| 2015-09-03 18:00:00 | 11.528 |
| 2015-09-03 18:15:00 | 11.528 |
| 2015-09-03 18:30:00 | 11.528 |
| 2015-09-03 18:45:00 | 11.528 |
| 2015-09-03 19:00:00 | 11.528 |
| 2015-09-03 19:15:00 | 11.528 |
| 2015-09-03 19:30:00 | 11.431 |
| 2015-09-03 19:45:00 | 11.431 |
| 2015-09-03 20:00:00 | 11.431 |
| 2015-09-03 20:15:00 | 11.431 |
| 2015-09-03 20:30:00 | 11.431 |
| 2015-09-03 20:45:00 | 11.431 |
| 2015-09-03 21:00:00 | 11.431 |
| 2015-09-03 21:15:00 | 11.431 |
| 2015-09-03 21:30:00 | 11.431 |
| 2015-09-03 21:45:00 | 11.431 |
| 2015-09-03 22:00:00 | 11.431 |
| 2015-09-03 22:15:00 | 11.431 |
| 2015-09-03 22:30:00 | 11.431 |
| 2015-09-03 22:45:00 | 11.431 |
| 2015-09-03 23:00:00 | 11.431 |
| 2015-09-03 23:15:00 | 11.431 |
| 2015-09-03 23:30:00 | 11.431 |
| 2015-09-03 23:45:00 | 11.334 |
| 2015-09-04 | 11.431 |
| 2015-09-04 00:15:00 | 11.334 |
| 2015-09-04 00:30:00 | 11.334 |
| 2015-09-04 00:45:00 | 11.334 |
| 2015-09-04 01:00:00 | 11.431 |
| 2015-09-04 01:15:00 | 11.334 |
| 2015-09-04 01:30:00 | 11.334 |
| 2015-09-04 01:45:00 | 11.334 |
| 2015-09-04 02:00:00 | 11.334 |
| 2015-09-04 02:15:00 | 11.334 |
| 2015-09-04 02:30:00 | 11.334 |
| 2015-09-04 02:45:00 | 11.334 |
| 2015-09-04 03:00:00 | 11.334 |
| 2015-09-04 03:15:00 | 11.334 |
| 2015-09-04 03:30:00 | 11.334 |
| 2015-09-04 03:45:00 | 11.334 |
| 2015-09-04 04:00:00 | 11.334 |
| 2015-09-04 04:15:00 | 11.334 |
| 2015-09-04 04:30:00 | 11.334 |
| 2015-09-04 04:45:00 | 11.334 |
| 2015-09-04 05:00:00 | 11.334 |
| 2015-09-04 05:15:00 | 11.334 |
| 2015-09-04 05:30:00 | 11.334 |
| 2015-09-04 05:45:00 | 11.334 |
| 2015-09-04 06:00:00 | 11.334 |
| 2015-09-04 06:15:00 | 11.334 |
| 2015-09-04 06:30:00 | 11.334 |
| 2015-09-04 06:45:00 | 11.334 |
| 2015-09-04 07:00:00 | 11.334 |
| 2015-09-04 07:15:00 | 11.334 |
| 2015-09-04 07:30:00 | 11.334 |
| 2015-09-04 07:45:00 | 11.334 |
| 2015-09-04 08:00:00 | 11.334 |
| 2015-09-04 08:15:00 | 11.334 |
| 2015-09-04 08:30:00 | 11.334 |
| 2015-09-04 08:45:00 | 11.334 |
| 2015-09-04 09:00:00 | 11.334 |
| 2015-09-04 09:15:00 | 11.431 |
| 2015-09-04 09:30:00 | 11.431 |
| 2015-09-04 09:45:00 | 11.431 |
| 2015-09-04 10:00:00 | 11.431 |
| 2015-09-04 10:15:00 | 11.431 |
| 2015-09-04 10:30:00 | 11.431 |
| 2015-09-04 10:45:00 | 11.431 |
| 2015-09-04 11:00:00 | 11.431 |
| 2015-09-04 11:15:00 | 11.431 |
| 2015-09-04 11:30:00 | 11.528 |
| 2015-09-04 11:45:00 | 11.528 |
| 2015-09-04 12:00:00 | 11.528 |
| 2015-09-04 12:15:00 | 11.528 |
| 2015-09-04 12:30:00 | 11.528 |
| 2015-09-04 12:45:00 | 11.528 |
| 2015-09-04 13:00:00 | 11.528 |
| 2015-09-04 13:15:00 | 11.528 |
| 2015-09-04 13:30:00 | 11.528 |
| 2015-09-04 13:45:00 | 11.528 |
| 2015-09-04 14:00:00 | 11.528 |
| 2015-09-04 14:15:00 | 11.528 |
| 2015-09-04 14:30:00 | 11.528 |
| 2015-09-04 14:45:00 | 11.528 |
| 2015-09-04 15:00:00 | 11.528 |
| 2015-09-04 15:15:00 | 11.528 |
| 2015-09-04 15:30:00 | 11.528 |
| 2015-09-04 15:45:00 | 11.528 |
| 2015-09-04 16:00:00 | 11.528 |
| 2015-09-04 16:15:00 | 11.528 |
| 2015-09-04 16:30:00 | 11.528 |
| 2015-09-04 16:45:00 | 11.528 |
| 2015-09-04 17:00:00 | 11.528 |
| 2015-09-04 17:15:00 | 11.528 |
| 2015-09-04 17:30:00 | 11.528 |
| 2015-09-04 17:45:00 | 11.528 |
| 2015-09-04 18:00:00 | 11.528 |
| 2015-09-04 18:15:00 | 11.528 |
| 2015-09-04 18:30:00 | 11.528 |
| 2015-09-04 18:45:00 | 11.528 |
| 2015-09-04 19:00:00 | 11.528 |
| 2015-09-04 19:15:00 | 11.528 |
| 2015-09-04 19:30:00 | 11.431 |
| 2015-09-04 19:45:00 | 11.431 |
| 2015-09-04 20:00:00 | 11.431 |
| 2015-09-04 20:15:00 | 11.431 |
| 2015-09-04 20:30:00 | 11.431 |
| 2015-09-04 20:45:00 | 11.431 |
| 2015-09-04 21:00:00 | 11.431 |
| 2015-09-04 21:15:00 | 11.431 |
| 2015-09-04 21:30:00 | 11.431 |
| 2015-09-04 21:45:00 | 11.431 |
| 2015-09-04 22:00:00 | 11.431 |
| 2015-09-04 22:15:00 | 11.431 |
| 2015-09-04 22:30:00 | 11.334 |
| 2015-09-04 22:45:00 | 11.431 |
| 2015-09-04 23:00:00 | 11.334 |
| 2015-09-04 23:15:00 | 11.334 |
| 2015-09-04 23:30:00 | 11.334 |
| 2015-09-04 23:45:00 | 11.334 |
| 2015-09-05 | 11.334 |
| 2015-09-05 00:15:00 | 11.334 |
| 2015-09-05 00:30:00 | 11.334 |
| 2015-09-05 00:45:00 | 11.334 |
| 2015-09-05 01:00:00 | 11.334 |
| 2015-09-05 01:15:00 | 11.334 |
| 2015-09-05 01:30:00 | 11.334 |
| 2015-09-05 01:45:00 | 11.236 |
| 2015-09-05 02:00:00 | 11.236 |
| 2015-09-05 02:15:00 | 11.236 |
| 2015-09-05 02:30:00 | 11.236 |
| 2015-09-05 02:45:00 | 11.236 |
| 2015-09-05 03:00:00 | 11.236 |
| 2015-09-05 03:15:00 | 11.236 |
| 2015-09-05 03:30:00 | 11.236 |
| 2015-09-05 03:45:00 | 11.236 |
| 2015-09-05 04:00:00 | 11.236 |
| 2015-09-05 04:15:00 | 11.236 |
| 2015-09-05 04:30:00 | 11.236 |
| 2015-09-05 04:45:00 | 11.236 |
| 2015-09-05 05:00:00 | 11.236 |
| 2015-09-05 05:15:00 | 11.334 |
| 2015-09-05 05:30:00 | 11.334 |
| 2015-09-05 05:45:00 | 11.334 |
| 2015-09-05 06:00:00 | 11.334 |
| 2015-09-05 06:15:00 | 11.334 |
| 2015-09-05 06:30:00 | 11.334 |
| 2015-09-05 06:45:00 | 11.334 |
| 2015-09-05 07:00:00 | 11.334 |
| 2015-09-05 07:15:00 | 11.334 |
| 2015-09-05 07:30:00 | 11.334 |
| 2015-09-05 07:45:00 | 11.334 |
| 2015-09-05 08:00:00 | 11.334 |
| 2015-09-05 08:15:00 | 11.334 |
| 2015-09-05 08:30:00 | 11.334 |
| 2015-09-05 08:45:00 | 11.431 |
| 2015-09-05 09:00:00 | 11.431 |
| 2015-09-05 09:15:00 | 11.431 |
| 2015-09-05 09:30:00 | 11.431 |
| 2015-09-05 09:45:00 | 11.431 |
| 2015-09-05 10:00:00 | 11.431 |
| 2015-09-05 10:15:00 | 11.431 |
| 2015-09-05 10:30:00 | 11.431 |
| 2015-09-05 10:45:00 | 11.431 |
| 2015-09-05 11:00:00 | 11.431 |
| 2015-09-05 11:15:00 | 11.431 |
| 2015-09-05 11:30:00 | 11.431 |
| 2015-09-05 11:45:00 | 11.528 |
| 2015-09-05 12:00:00 | 11.528 |
| 2015-09-05 12:15:00 | 11.528 |
| 2015-09-05 12:30:00 | 11.528 |
| 2015-09-05 12:45:00 | 11.528 |
| 2015-09-05 13:00:00 | 11.528 |
| 2015-09-05 13:15:00 | 11.528 |
| 2015-09-05 13:30:00 | 11.528 |
| 2015-09-05 13:45:00 | 11.528 |
| 2015-09-05 14:00:00 | 11.528 |
| 2015-09-05 14:15:00 | 11.528 |
| 2015-09-05 14:30:00 | 11.528 |
| 2015-09-05 14:45:00 | 11.528 |
| 2015-09-05 15:00:00 | 11.625 |
| 2015-09-05 15:15:00 | 11.528 |
| 2015-09-05 15:30:00 | 11.625 |
| 2015-09-05 15:45:00 | 11.528 |
| 2015-09-05 16:00:00 | 11.528 |
| 2015-09-05 16:15:00 | 11.528 |
| 2015-09-05 16:30:00 | 11.528 |
| 2015-09-05 16:45:00 | 11.528 |
| 2015-09-05 17:00:00 | 11.528 |
| 2015-09-05 17:15:00 | 11.528 |
| 2015-09-05 17:30:00 | 11.528 |
| 2015-09-05 17:45:00 | 11.528 |
| 2015-09-05 18:00:00 | 11.528 |
| 2015-09-05 18:15:00 | 11.528 |
| 2015-09-05 18:30:00 | 11.528 |
| 2015-09-05 18:45:00 | 11.528 |
| 2015-09-05 19:00:00 | 11.528 |
| 2015-09-05 19:15:00 | 11.528 |
| 2015-09-05 19:30:00 | 11.431 |
| 2015-09-05 19:45:00 | 11.431 |
| 2015-09-05 20:00:00 | 11.431 |
| 2015-09-05 20:15:00 | 11.431 |
| 2015-09-05 20:30:00 | 11.431 |
| 2015-09-05 20:45:00 | 11.431 |
| 2015-09-05 21:00:00 | 11.431 |
| 2015-09-05 21:15:00 | 11.334 |
| 2015-09-05 21:30:00 | 11.334 |
| 2015-09-05 21:45:00 | 11.334 |
| 2015-09-05 22:00:00 | 11.334 |
| 2015-09-05 22:15:00 | 11.334 |
| 2015-09-05 22:30:00 | 11.334 |
| 2015-09-05 22:45:00 | 11.236 |
| 2015-09-05 23:00:00 | 11.236 |
| 2015-09-05 23:15:00 | 11.236 |
| 2015-09-05 23:30:00 | 11.236 |
| 2015-09-05 23:45:00 | 11.236 |
| 2015-09-06 | 11.236 |
| 2015-09-06 00:15:00 | 11.236 |
| 2015-09-06 00:30:00 | 11.236 |
| 2015-09-06 00:45:00 | 11.236 |
| 2015-09-06 01:00:00 | 11.139 |
| 2015-09-06 01:15:00 | 11.139 |
| 2015-09-06 01:30:00 | 11.139 |
| 2015-09-06 01:45:00 | 11.139 |
| 2015-09-06 02:00:00 | 11.139 |
| 2015-09-06 02:15:00 | 11.139 |
| 2015-09-06 02:30:00 | 11.139 |
| 2015-09-06 02:45:00 | 11.139 |
| 2015-09-06 03:00:00 | 11.139 |
| 2015-09-06 03:15:00 | 11.139 |
| 2015-09-06 03:30:00 | 11.139 |
| 2015-09-06 03:45:00 | 11.139 |
| 2015-09-06 04:00:00 | 11.139 |
| 2015-09-06 04:15:00 | 11.139 |
| 2015-09-06 04:30:00 | 11.139 |
| 2015-09-06 04:45:00 | 11.139 |
| 2015-09-06 05:00:00 | 11.139 |
| 2015-09-06 05:15:00 | 11.139 |
| 2015-09-06 05:30:00 | 11.139 |
| 2015-09-06 05:45:00 | 11.139 |
| 2015-09-06 06:00:00 | 11.139 |
| 2015-09-06 06:15:00 | 11.139 |
| 2015-09-06 06:30:00 | 11.139 |
| 2015-09-06 06:45:00 | 11.041 |
| 2015-09-06 07:00:00 | 11.041 |
| 2015-09-06 07:15:00 | 11.041 |
| 2015-09-06 07:30:00 | 11.139 |
| 2015-09-06 07:45:00 | 11.139 |
| 2015-09-06 08:00:00 | 11.139 |
| 2015-09-06 08:15:00 | 11.139 |
| 2015-09-06 08:30:00 | 11.139 |
| 2015-09-06 08:45:00 | 11.139 |
| 2015-09-06 09:00:00 | 11.236 |
| 2015-09-06 09:15:00 | 11.236 |
| 2015-09-06 09:30:00 | 11.236 |
| 2015-09-06 09:45:00 | 11.236 |
| 2015-09-06 10:00:00 | 11.334 |
| 2015-09-06 10:15:00 | 11.334 |
| 2015-09-06 10:30:00 | 11.334 |
| 2015-09-06 10:45:00 | 11.334 |
| 2015-09-06 11:00:00 | 11.334 |
| 2015-09-06 11:15:00 | 11.431 |
| 2015-09-06 11:30:00 | 11.431 |
| 2015-09-06 11:45:00 | 11.431 |
| 2015-09-06 12:00:00 | 11.431 |
| 2015-09-06 12:15:00 | 11.528 |
| 2015-09-06 12:30:00 | 11.528 |
| 2015-09-06 12:45:00 | 11.528 |
| 2015-09-06 13:00:00 | 11.528 |
| 2015-09-06 13:15:00 | 11.528 |
| 2015-09-06 13:30:00 | 11.528 |
| 2015-09-06 13:45:00 | 11.625 |
| 2015-09-06 14:00:00 | 11.625 |
| 2015-09-06 14:15:00 | 11.625 |
| 2015-09-06 14:30:00 | 11.625 |
| 2015-09-06 14:45:00 | 11.625 |
| 2015-09-06 15:00:00 | 11.625 |
| 2015-09-06 15:15:00 | 11.625 |
| 2015-09-06 15:30:00 | 11.625 |
| 2015-09-06 15:45:00 | 11.625 |
| 2015-09-06 16:00:00 | 11.625 |
| 2015-09-06 16:15:00 | 11.625 |
| 2015-09-06 16:30:00 | 11.625 |
| 2015-09-06 16:45:00 | 11.625 |
| 2015-09-06 17:00:00 | 11.625 |
| 2015-09-06 17:15:00 | 11.625 |
| 2015-09-06 17:30:00 | 11.625 |
| 2015-09-06 17:45:00 | 11.625 |
| 2015-09-06 18:00:00 | 11.625 |
| 2015-09-06 18:15:00 | 11.528 |
| 2015-09-06 18:30:00 | 11.528 |
| 2015-09-06 18:45:00 | 11.528 |
| 2015-09-06 19:00:00 | 11.528 |
| 2015-09-06 19:15:00 | 11.528 |
| 2015-09-06 19:30:00 | 11.528 |
| 2015-09-06 19:45:00 | 11.528 |
| 2015-09-06 20:00:00 | 11.528 |
| 2015-09-06 20:15:00 | 11.431 |
| 2015-09-06 20:30:00 | 11.431 |
| 2015-09-06 20:45:00 | 11.431 |
| 2015-09-06 21:00:00 | 11.431 |
| 2015-09-06 21:15:00 | 11.431 |
| 2015-09-06 21:30:00 | 11.431 |
| 2015-09-06 21:45:00 | 11.334 |
| 2015-09-06 22:00:00 | 11.334 |
| 2015-09-06 22:15:00 | 11.334 |
| 2015-09-06 22:30:00 | 11.334 |
| 2015-09-06 22:45:00 | 11.334 |
| 2015-09-06 23:00:00 | 11.334 |
| 2015-09-06 23:15:00 | 11.334 |
| 2015-09-06 23:30:00 | 11.236 |
| 2015-09-06 23:45:00 | 11.236 |
| 2015-09-07 | 11.236 |
| 2015-09-07 00:15:00 | 11.236 |
| 2015-09-07 00:30:00 | 11.236 |
| 2015-09-07 00:45:00 | 11.236 |
| 2015-09-07 01:00:00 | 11.236 |
| 2015-09-07 01:15:00 | 11.236 |
| 2015-09-07 01:30:00 | 11.236 |
| 2015-09-07 01:45:00 | 11.236 |
| 2015-09-07 02:00:00 | 11.139 |
| 2015-09-07 02:15:00 | 11.236 |
| 2015-09-07 02:30:00 | 11.236 |
| 2015-09-07 02:45:00 | 11.139 |
| 2015-09-07 03:00:00 | 11.139 |
| 2015-09-07 03:15:00 | 11.236 |
| 2015-09-07 03:30:00 | 11.139 |
| 2015-09-07 03:45:00 | 11.139 |
| 2015-09-07 04:00:00 | 11.139 |
| 2015-09-07 04:15:00 | 11.139 |
| 2015-09-07 04:30:00 | 11.139 |
| 2015-09-07 04:45:00 | 11.139 |
| 2015-09-07 05:00:00 | 11.139 |
| 2015-09-07 05:15:00 | 11.139 |
| 2015-09-07 05:30:00 | 11.139 |
| 2015-09-07 05:45:00 | 11.139 |
| 2015-09-07 06:00:00 | 11.139 |
| 2015-09-07 06:15:00 | 11.139 |
| 2015-09-07 06:30:00 | 11.139 |
| 2015-09-07 06:45:00 | 11.139 |
| 2015-09-07 07:00:00 | 11.139 |
| 2015-09-07 07:15:00 | 11.139 |
| 2015-09-07 07:30:00 | 11.139 |
| 2015-09-07 07:45:00 | 11.139 |
| 2015-09-07 08:00:00 | 11.139 |
| 2015-09-07 08:15:00 | 11.139 |
| 2015-09-07 08:30:00 | 11.139 |
| 2015-09-07 08:45:00 | 11.139 |
| 2015-09-07 09:00:00 | 11.236 |
| 2015-09-07 09:15:00 | 11.236 |
| 2015-09-07 09:30:00 | 11.236 |
| 2015-09-07 09:45:00 | 11.236 |
| 2015-09-07 10:00:00 | 11.334 |
| 2015-09-07 10:15:00 | 11.334 |
| 2015-09-07 10:30:00 | 11.334 |
| 2015-09-07 10:45:00 | 11.431 |
| 2015-09-07 11:00:00 | 11.431 |
| 2015-09-07 11:15:00 | 11.431 |
| 2015-09-07 11:30:00 | 11.431 |
| 2015-09-07 11:45:00 | 11.431 |
| 2015-09-07 12:00:00 | 11.528 |
| 2015-09-07 12:15:00 | 11.528 |
| 2015-09-07 12:30:00 | 11.528 |
| 2015-09-07 12:45:00 | 11.528 |
| 2015-09-07 13:00:00 | 11.625 |
| 2015-09-07 13:15:00 | 11.625 |
| 2015-09-07 13:30:00 | 11.625 |
| 2015-09-07 13:45:00 | 11.625 |
| 2015-09-07 14:00:00 | 11.625 |
| 2015-09-07 14:15:00 | 11.625 |
| 2015-09-07 14:30:00 | 11.625 |
| 2015-09-07 14:45:00 | 11.625 |
| 2015-09-07 15:00:00 | 11.722 |
| 2015-09-07 15:15:00 | 11.722 |
| 2015-09-07 15:30:00 | 11.722 |
| 2015-09-07 15:45:00 | 11.625 |
| 2015-09-07 16:00:00 | 11.625 |
| 2015-09-07 16:15:00 | 11.625 |
| 2015-09-07 16:30:00 | 11.625 |
| 2015-09-07 16:45:00 | 11.625 |
| 2015-09-07 17:00:00 | 11.625 |
| 2015-09-07 17:15:00 | 11.625 |
| 2015-09-07 17:30:00 | 11.625 |
| 2015-09-07 17:45:00 | 11.625 |
| 2015-09-07 18:00:00 | 11.625 |
| 2015-09-07 18:15:00 | 11.625 |
| 2015-09-07 18:30:00 | 11.625 |
| 2015-09-07 18:45:00 | 11.625 |
| 2015-09-07 19:00:00 | 11.528 |
| 2015-09-07 19:15:00 | 11.528 |
| 2015-09-07 19:30:00 | 11.528 |
| 2015-09-07 19:45:00 | 11.528 |
| 2015-09-07 20:00:00 | 11.528 |
| 2015-09-07 20:15:00 | 11.528 |
| 2015-09-07 20:30:00 | 11.528 |
| 2015-09-07 20:45:00 | 11.431 |
| 2015-09-07 21:00:00 | 11.431 |
| 2015-09-07 21:15:00 | 11.431 |
| 2015-09-07 21:30:00 | 11.431 |
| 2015-09-07 21:45:00 | 11.431 |
| 2015-09-07 22:00:00 | 11.431 |
| 2015-09-07 22:15:00 | 11.334 |
| 2015-09-07 22:30:00 | 11.334 |
| 2015-09-07 22:45:00 | 11.334 |
| 2015-09-07 23:00:00 | 11.334 |
| 2015-09-07 23:15:00 | 11.334 |
| 2015-09-07 23:30:00 | 11.334 |
| 2015-09-07 23:45:00 | 11.334 |
| 2015-09-08 | 11.236 |
| 2015-09-08 00:15:00 | 11.236 |
| 2015-09-08 00:30:00 | 11.236 |
| 2015-09-08 00:45:00 | 11.236 |
| 2015-09-08 01:00:00 | 11.236 |
| 2015-09-08 01:15:00 | 11.236 |
| 2015-09-08 01:30:00 | 11.236 |
| 2015-09-08 01:45:00 | 11.236 |
| 2015-09-08 02:00:00 | 11.236 |
| 2015-09-08 02:15:00 | 11.236 |
| 2015-09-08 02:30:00 | 11.236 |
| 2015-09-08 02:45:00 | 11.236 |
| 2015-09-08 03:00:00 | 11.236 |
| 2015-09-08 03:15:00 | 11.236 |
| 2015-09-08 03:30:00 | 11.236 |
| 2015-09-08 03:45:00 | 11.139 |
| 2015-09-08 04:00:00 | 11.139 |
| 2015-09-08 04:15:00 | 11.139 |
| 2015-09-08 04:30:00 | 11.139 |
| 2015-09-08 04:45:00 | 11.139 |
| 2015-09-08 05:00:00 | 11.139 |
| 2015-09-08 05:15:00 | 11.139 |
| 2015-09-08 05:30:00 | 11.139 |
| 2015-09-08 05:45:00 | 11.139 |
| 2015-09-08 06:00:00 | 11.139 |
| 2015-09-08 06:15:00 | 11.139 |
| 2015-09-08 06:30:00 | 11.139 |
| 2015-09-08 06:45:00 | 11.139 |
| 2015-09-08 07:00:00 | 11.139 |
| 2015-09-08 07:15:00 | 11.236 |
| 2015-09-08 07:30:00 | 11.236 |
| 2015-09-08 07:45:00 | 11.236 |
| 2015-09-08 08:00:00 | 11.236 |
| 2015-09-08 08:15:00 | 11.236 |
| 2015-09-08 08:30:00 | 11.236 |
| 2015-09-08 08:45:00 | 11.334 |
| 2015-09-08 09:00:00 | 11.334 |
| 2015-09-08 09:15:00 | 11.334 |
| 2015-09-08 09:30:00 | 11.334 |
| 2015-09-08 09:45:00 | 11.334 |
| 2015-09-08 10:00:00 | 11.431 |
| 2015-09-08 10:15:00 | 11.431 |
| 2015-09-08 10:30:00 | 11.431 |
| 2015-09-08 10:45:00 | 11.431 |
| 2015-09-08 11:00:00 | 11.431 |
| 2015-09-08 11:15:00 | 11.431 |
| 2015-09-08 11:30:00 | 11.431 |
| 2015-09-08 11:45:00 | 11.528 |
| 2015-09-08 12:00:00 | 11.528 |
| 2015-09-08 12:15:00 | 11.528 |
| 2015-09-08 12:30:00 | 11.528 |
| 2015-09-08 12:45:00 | 11.528 |
| 2015-09-08 13:00:00 | 11.528 |
| 2015-09-08 13:15:00 | 11.625 |
| 2015-09-08 13:30:00 | 11.625 |
| 2015-09-08 13:45:00 | 11.625 |
| 2015-09-08 14:00:00 | 11.625 |
| 2015-09-08 14:15:00 | 11.625 |
| 2015-09-08 14:30:00 | 11.625 |
| 2015-09-08 14:45:00 | 11.625 |
| 2015-09-08 15:00:00 | 11.625 |
| 2015-09-08 15:15:00 | 11.625 |
| 2015-09-08 15:30:00 | 11.625 |
| 2015-09-08 15:45:00 | 11.625 |
| 2015-09-08 16:00:00 | 11.625 |
| 2015-09-08 16:15:00 | 11.625 |
| 2015-09-08 16:30:00 | 11.625 |
| 2015-09-08 16:45:00 | 11.625 |
| 2015-09-08 17:00:00 | 11.625 |
| 2015-09-08 17:15:00 | 11.625 |
| 2015-09-08 17:30:00 | 11.625 |
| 2015-09-08 17:45:00 | 11.625 |
| 2015-09-08 18:00:00 | 11.625 |
| 2015-09-08 18:15:00 | 11.625 |
| 2015-09-08 18:30:00 | 11.528 |
| 2015-09-08 18:45:00 | 11.528 |
| 2015-09-08 19:00:00 | 11.528 |
| 2015-09-08 19:15:00 | 11.528 |
| 2015-09-08 19:30:00 | 11.528 |
| 2015-09-08 19:45:00 | 11.528 |
| 2015-09-08 20:00:00 | 11.528 |
| 2015-09-08 20:15:00 | 11.528 |
| 2015-09-08 20:30:00 | 11.528 |
| 2015-09-08 20:45:00 | 11.431 |
| 2015-09-08 21:00:00 | 11.431 |
| 2015-09-08 21:15:00 | 11.431 |
| 2015-09-08 21:30:00 | 11.431 |
| 2015-09-08 21:45:00 | 11.431 |
| 2015-09-08 22:00:00 | 11.431 |
| 2015-09-08 22:15:00 | 11.334 |
| 2015-09-08 22:30:00 | 11.334 |
| 2015-09-08 22:45:00 | 11.334 |
| 2015-09-08 23:00:00 | 11.334 |
| 2015-09-08 23:15:00 | 11.334 |
| 2015-09-08 23:30:00 | 11.334 |
| 2015-09-08 23:45:00 | 11.236 |
| 2015-09-09 | 11.236 |
| 2015-09-09 00:15:00 | 11.236 |
| 2015-09-09 00:30:00 | 11.236 |
| 2015-09-09 00:45:00 | 11.236 |
| 2015-09-09 01:00:00 | 11.236 |
| 2015-09-09 01:15:00 | 11.236 |
| 2015-09-09 01:30:00 | 11.236 |
| 2015-09-09 01:45:00 | 11.236 |
| 2015-09-09 02:00:00 | 11.236 |
| 2015-09-09 02:15:00 | 11.236 |
| 2015-09-09 02:30:00 | 11.236 |
| 2015-09-09 02:45:00 | 11.139 |
| 2015-09-09 03:00:00 | 11.139 |
| 2015-09-09 03:15:00 | 11.139 |
| 2015-09-09 03:30:00 | 11.139 |
| 2015-09-09 03:45:00 | 11.139 |
| 2015-09-09 04:00:00 | 11.139 |
| 2015-09-09 04:15:00 | 11.139 |
| 2015-09-09 04:30:00 | 11.139 |
| 2015-09-09 04:45:00 | 11.139 |
| 2015-09-09 05:00:00 | 11.236 |
| 2015-09-09 05:15:00 | 11.236 |
| 2015-09-09 05:30:00 | 11.236 |
| 2015-09-09 05:45:00 | 11.236 |
| 2015-09-09 06:00:00 | 11.236 |
| 2015-09-09 06:15:00 | 11.236 |
| 2015-09-09 06:30:00 | 11.236 |
| 2015-09-09 06:45:00 | 11.236 |
| 2015-09-09 07:00:00 | 11.334 |
| 2015-09-09 07:15:00 | 11.334 |
| 2015-09-09 07:30:00 | 11.334 |
| 2015-09-09 07:45:00 | 11.334 |
| 2015-09-09 08:00:00 | 11.334 |
| 2015-09-09 08:15:00 | 11.334 |
| 2015-09-09 08:30:00 | 11.334 |
| 2015-09-09 08:45:00 | 11.334 |
| 2015-09-09 09:00:00 | 11.431 |
| 2015-09-09 09:15:00 | 11.431 |
| 2015-09-09 09:30:00 | 11.431 |
| 2015-09-09 09:45:00 | 11.431 |
| 2015-09-09 10:00:00 | 11.431 |
| 2015-09-09 10:15:00 | 11.431 |
| 2015-09-09 10:30:00 | 11.431 |
| 2015-09-09 10:45:00 | 11.431 |
| 2015-09-09 11:00:00 | 11.431 |
| 2015-09-09 11:15:00 | 11.431 |
| 2015-09-09 11:30:00 | 11.528 |
| 2015-09-09 11:45:00 | 11.528 |
| 2015-09-09 12:00:00 | 11.528 |
| 2015-09-09 12:15:00 | 11.528 |
| 2015-09-09 12:30:00 | 11.528 |
| 2015-09-09 12:45:00 | 11.528 |
| 2015-09-09 13:00:00 | 11.528 |
| 2015-09-09 13:15:00 | 11.528 |
| 2015-09-09 13:30:00 | 11.528 |
| 2015-09-09 13:45:00 | 11.528 |
| 2015-09-09 14:00:00 | 11.625 |
| 2015-09-09 14:15:00 | 11.528 |
| 2015-09-09 14:30:00 | 11.625 |
| 2015-09-09 14:45:00 | 11.625 |
| 2015-09-09 15:00:00 | 11.625 |
| 2015-09-09 15:15:00 | 11.625 |
| 2015-09-09 15:30:00 | 11.625 |
| 2015-09-09 15:45:00 | 11.625 |
| 2015-09-09 16:00:00 | 11.625 |
| 2015-09-09 16:15:00 | 11.625 |
| 2015-09-09 16:30:00 | 11.625 |
| 2015-09-09 16:45:00 | 11.625 |
| 2015-09-09 17:00:00 | 11.625 |
| 2015-09-09 17:15:00 | 11.625 |
| 2015-09-09 17:30:00 | 11.625 |
| 2015-09-09 17:45:00 | 11.625 |
| 2015-09-09 18:00:00 | 11.528 |
| 2015-09-09 18:15:00 | 11.528 |
| 2015-09-09 18:30:00 | 11.528 |
| 2015-09-09 18:45:00 | 11.528 |
| 2015-09-09 19:00:00 | 11.528 |
| 2015-09-09 19:15:00 | 11.528 |
| 2015-09-09 19:30:00 | 11.528 |
| 2015-09-09 19:45:00 | 11.528 |
| 2015-09-09 20:00:00 | 11.528 |
| 2015-09-09 20:15:00 | 11.431 |
| 2015-09-09 20:30:00 | 11.431 |
| 2015-09-09 20:45:00 | 11.431 |
| 2015-09-09 21:00:00 | 11.431 |
| 2015-09-09 21:15:00 | 11.431 |
| 2015-09-09 21:30:00 | 11.431 |
| 2015-09-09 21:45:00 | 11.431 |
| 2015-09-09 22:00:00 | 11.431 |
| 2015-09-09 22:15:00 | 11.431 |
| 2015-09-09 22:30:00 | 11.334 |
| 2015-09-09 22:45:00 | 11.334 |
| 2015-09-09 23:00:00 | 11.334 |
| 2015-09-09 23:15:00 | 11.334 |
| 2015-09-09 23:30:00 | 11.334 |
| 2015-09-09 23:45:00 | 11.334 |
| 2015-09-10 | 11.334 |
| 2015-09-10 00:15:00 | 11.334 |
| 2015-09-10 00:30:00 | 11.334 |
| 2015-09-10 00:45:00 | 11.334 |
| 2015-09-10 01:00:00 | 11.334 |
| 2015-09-10 01:15:00 | 11.334 |
| 2015-09-10 01:30:00 | 11.334 |
| 2015-09-10 01:45:00 | 11.334 |
| 2015-09-10 02:00:00 | 11.334 |
| 2015-09-10 02:15:00 | 11.334 |
| 2015-09-10 02:30:00 | 11.236 |
| 2015-09-10 02:45:00 | 11.334 |
| 2015-09-10 03:00:00 | 11.236 |
| 2015-09-10 03:15:00 | 11.236 |
| 2015-09-10 03:30:00 | 11.236 |
| 2015-09-10 03:45:00 | 11.236 |
| 2015-09-10 04:00:00 | 11.236 |
| 2015-09-10 04:15:00 | 11.236 |
| 2015-09-10 04:30:00 | 11.236 |
| 2015-09-10 04:45:00 | 11.236 |
| 2015-09-10 05:00:00 | 11.236 |
| 2015-09-10 05:15:00 | 11.236 |
| 2015-09-10 05:30:00 | 11.236 |
| 2015-09-10 05:45:00 | 11.236 |
| 2015-09-10 06:00:00 | 11.236 |
| 2015-09-10 06:15:00 | 11.236 |
| 2015-09-10 06:30:00 | 11.236 |
| 2015-09-10 06:45:00 | 11.236 |
| 2015-09-10 07:00:00 | 11.236 |
| 2015-09-10 07:15:00 | 11.236 |
| 2015-09-10 07:30:00 | 11.236 |
| 2015-09-10 07:45:00 | 11.236 |
| 2015-09-10 08:00:00 | 11.236 |
| 2015-09-10 08:15:00 | 11.334 |
| 2015-09-10 08:30:00 | 11.334 |
| 2015-09-10 08:45:00 | 11.334 |
| 2015-09-10 09:00:00 | 11.334 |
| 2015-09-10 09:15:00 | 11.334 |
| 2015-09-10 09:30:00 | 11.334 |
| 2015-09-10 09:45:00 | 11.334 |
| 2015-09-10 10:00:00 | 11.431 |
| 2015-09-10 10:15:00 | 11.431 |
| 2015-09-10 10:30:00 | 11.431 |
| 2015-09-10 10:45:00 | 11.431 |
| 2015-09-10 11:00:00 | 11.431 |
| 2015-09-10 11:15:00 | 11.431 |
| 2015-09-10 11:30:00 | 11.528 |
| 2015-09-10 11:45:00 | 11.528 |
| 2015-09-10 12:00:00 | 11.528 |
| 2015-09-10 12:15:00 | 11.528 |
| 2015-09-10 12:30:00 | 11.528 |
| 2015-09-10 12:45:00 | 11.625 |
| 2015-09-10 13:00:00 | 11.625 |
| 2015-09-10 13:15:00 | 11.625 |
| 2015-09-10 13:30:00 | 11.625 |
| 2015-09-10 13:45:00 | 11.625 |
| 2015-09-10 14:00:00 | 11.625 |
| 2015-09-10 14:15:00 | 11.625 |
| 2015-09-10 14:30:00 | 11.722 |
| 2015-09-10 14:45:00 | 11.722 |
| 2015-09-10 15:00:00 | 11.722 |
| 2015-09-10 15:15:00 | 11.722 |
| 2015-09-10 15:30:00 | 11.722 |
| 2015-09-10 15:45:00 | 11.722 |
| 2015-09-10 16:00:00 | 11.722 |
| 2015-09-10 16:15:00 | 11.722 |
| 2015-09-10 16:30:00 | 11.625 |
| 2015-09-10 16:45:00 | 11.625 |
| 2015-09-10 17:00:00 | 11.625 |
| 2015-09-10 17:15:00 | 11.625 |
| 2015-09-10 17:30:00 | 11.625 |
| 2015-09-10 17:45:00 | 11.625 |
| 2015-09-10 18:00:00 | 11.625 |
| 2015-09-10 18:15:00 | 11.625 |
| 2015-09-10 18:30:00 | 11.625 |
| 2015-09-10 18:45:00 | 11.625 |
| 2015-09-10 19:00:00 | 11.625 |
| 2015-09-10 19:15:00 | 11.528 |
| 2015-09-10 19:30:00 | 11.528 |
| 2015-09-10 19:45:00 | 11.528 |
| 2015-09-10 20:00:00 | 11.528 |
| 2015-09-10 20:15:00 | 11.528 |
| 2015-09-10 20:30:00 | 11.528 |
| 2015-09-10 20:45:00 | 11.431 |
| 2015-09-10 21:00:00 | 11.431 |
| 2015-09-10 21:15:00 | 11.431 |
| 2015-09-10 21:30:00 | 11.431 |
| 2015-09-10 21:45:00 | 11.431 |
| 2015-09-10 22:00:00 | 11.431 |
| 2015-09-10 22:15:00 | 11.431 |
| 2015-09-10 22:30:00 | 11.334 |
| 2015-09-10 22:45:00 | 11.334 |
| 2015-09-10 23:00:00 | 11.334 |
| 2015-09-10 23:15:00 | 11.334 |
| 2015-09-10 23:30:00 | 11.334 |
| 2015-09-10 23:45:00 | 11.334 |
| 2015-09-11 | 11.334 |
| 2015-09-11 00:15:00 | 11.334 |
| 2015-09-11 00:30:00 | 11.236 |
| 2015-09-11 00:45:00 | 11.236 |
| 2015-09-11 01:00:00 | 11.236 |
| 2015-09-11 01:15:00 | 11.236 |
| 2015-09-11 01:30:00 | 11.236 |
| 2015-09-11 01:45:00 | 11.236 |
| 2015-09-11 02:00:00 | 11.236 |
| 2015-09-11 02:15:00 | 11.236 |
| 2015-09-11 02:30:00 | 11.236 |
| 2015-09-11 02:45:00 | 11.236 |
| 2015-09-11 03:00:00 | 11.236 |
| 2015-09-11 03:15:00 | 11.236 |
| 2015-09-11 03:30:00 | 11.236 |
| 2015-09-11 03:45:00 | 11.236 |
| 2015-09-11 04:00:00 | 11.236 |
| 2015-09-11 04:15:00 | 11.236 |
| 2015-09-11 04:30:00 | 11.236 |
| 2015-09-11 04:45:00 | 11.236 |
| 2015-09-11 05:00:00 | 11.236 |
| 2015-09-11 05:15:00 | 11.236 |
| 2015-09-11 05:30:00 | 11.236 |
| 2015-09-11 05:45:00 | 11.236 |
| 2015-09-11 06:00:00 | 11.236 |
| 2015-09-11 06:15:00 | 11.236 |
| 2015-09-11 06:30:00 | 11.236 |
| 2015-09-11 06:45:00 | 11.236 |
| 2015-09-11 07:00:00 | 11.236 |
| 2015-09-11 07:15:00 | 11.236 |
| 2015-09-11 07:30:00 | 11.236 |
| 2015-09-11 07:45:00 | 11.236 |
| 2015-09-11 08:00:00 | 11.236 |
| 2015-09-11 08:15:00 | 11.334 |
| 2015-09-11 08:30:00 | 11.334 |
| 2015-09-11 08:45:00 | 11.334 |
| 2015-09-11 09:00:00 | 11.334 |
| 2015-09-11 09:15:00 | 11.334 |
| 2015-09-11 09:30:00 | 11.431 |
| 2015-09-11 09:45:00 | 11.431 |
| 2015-09-11 10:00:00 | 11.431 |
| 2015-09-11 10:15:00 | 11.431 |
| 2015-09-11 10:30:00 | 11.431 |
| 2015-09-11 10:45:00 | 11.431 |
| 2015-09-11 11:00:00 | 11.528 |
| 2015-09-11 11:15:00 | 11.528 |
| 2015-09-11 11:30:00 | 11.528 |
| 2015-09-11 11:45:00 | 11.528 |
| 2015-09-11 12:00:00 | 11.528 |
| 2015-09-11 12:15:00 | 11.528 |
| 2015-09-11 12:30:00 | 11.625 |
| 2015-09-11 12:45:00 | 11.625 |
| 2015-09-11 13:00:00 | 11.625 |
| 2015-09-11 13:15:00 | 11.625 |
| 2015-09-11 13:30:00 | 11.625 |
| 2015-09-11 13:45:00 | 11.625 |
| 2015-09-11 14:00:00 | 11.625 |
| 2015-09-11 14:15:00 | 11.625 |
| 2015-09-11 14:30:00 | 11.722 |
| 2015-09-11 14:45:00 | 11.722 |
| 2015-09-11 15:00:00 | 11.625 |
| 2015-09-11 15:15:00 | 11.625 |
| 2015-09-11 15:30:00 | 11.625 |
| 2015-09-11 15:45:00 | 11.625 |
| 2015-09-11 16:00:00 | 11.625 |
| 2015-09-11 16:15:00 | 11.625 |
| 2015-09-11 16:30:00 | 11.625 |
| 2015-09-11 16:45:00 | 11.625 |
| 2015-09-11 17:00:00 | 11.625 |
| 2015-09-11 17:15:00 | 11.625 |
| 2015-09-11 17:30:00 | 11.625 |
| 2015-09-11 17:45:00 | 11.625 |
| 2015-09-11 18:00:00 | 11.528 |
| 2015-09-11 18:15:00 | 11.528 |
| 2015-09-11 18:30:00 | 11.528 |
| 2015-09-11 18:45:00 | 11.528 |
| 2015-09-11 19:00:00 | 11.528 |
| 2015-09-11 19:15:00 | 11.528 |
| 2015-09-11 19:30:00 | 11.528 |
| 2015-09-11 19:45:00 | 11.528 |
| 2015-09-11 20:00:00 | 11.528 |
| 2015-09-11 20:15:00 | 11.528 |
| 2015-09-11 20:30:00 | 11.528 |
| 2015-09-11 20:45:00 | 11.528 |
| 2015-09-11 21:00:00 | 11.528 |
| 2015-09-11 21:15:00 | 11.528 |
| 2015-09-11 21:30:00 | 11.431 |
| 2015-09-11 21:45:00 | 11.431 |
| 2015-09-11 22:00:00 | 11.431 |
| 2015-09-11 22:15:00 | 11.431 |
| 2015-09-11 22:30:00 | 11.431 |
| 2015-09-11 22:45:00 | 11.431 |
| 2015-09-11 23:00:00 | 11.431 |
| 2015-09-11 23:15:00 | 11.431 |
| 2015-09-11 23:30:00 | 11.431 |
| 2015-09-11 23:45:00 | 11.431 |
| 2015-09-12 | 11.431 |
| 2015-09-12 00:15:00 | 11.431 |
| 2015-09-12 00:30:00 | 11.431 |
| 2015-09-12 00:45:00 | 11.431 |
| 2015-09-12 01:00:00 | 11.431 |
| 2015-09-12 01:15:00 | 11.431 |
| 2015-09-12 01:30:00 | 11.431 |
| 2015-09-12 01:45:00 | 11.431 |
| 2015-09-12 02:00:00 | 11.431 |
| 2015-09-12 02:15:00 | 11.431 |
| 2015-09-12 02:30:00 | 11.431 |
| 2015-09-12 02:45:00 | 11.431 |
| 2015-09-12 03:00:00 | 11.431 |
| 2015-09-12 03:15:00 | 11.431 |
| 2015-09-12 03:30:00 | 11.431 |
| 2015-09-12 03:45:00 | 11.431 |
| 2015-09-12 04:00:00 | 11.431 |
| 2015-09-12 04:15:00 | 11.431 |
| 2015-09-12 04:30:00 | 11.431 |
| 2015-09-12 04:45:00 | 11.431 |
| 2015-09-12 05:00:00 | 11.431 |
| 2015-09-12 05:15:00 | 11.431 |
| 2015-09-12 05:30:00 | 11.431 |
| 2015-09-12 05:45:00 | 11.431 |
| 2015-09-12 06:00:00 | 11.431 |
| 2015-09-12 06:15:00 | 11.431 |
| 2015-09-12 06:30:00 | 11.431 |
| 2015-09-12 06:45:00 | 11.431 |
| 2015-09-12 07:00:00 | 11.431 |
| 2015-09-12 07:15:00 | 11.431 |
| 2015-09-12 07:30:00 | 11.528 |
| 2015-09-12 07:45:00 | 11.528 |
| 2015-09-12 08:00:00 | 11.431 |
| 2015-09-12 08:15:00 | 11.431 |
| 2015-09-12 08:30:00 | 11.528 |
| 2015-09-12 08:45:00 | 11.528 |
| 2015-09-12 09:00:00 | 11.528 |
| 2015-09-12 09:15:00 | 11.528 |
| 2015-09-12 09:30:00 | 11.528 |
| 2015-09-12 09:45:00 | 11.528 |
| 2015-09-12 10:00:00 | 11.528 |
| 2015-09-12 10:15:00 | 11.528 |
| 2015-09-12 10:30:00 | 11.528 |
| 2015-09-12 10:45:00 | 11.528 |
| 2015-09-12 11:00:00 | 11.528 |
| 2015-09-12 11:15:00 | 11.528 |
| 2015-09-12 11:30:00 | 11.528 |
| 2015-09-12 11:45:00 | 11.528 |
| 2015-09-12 12:00:00 | 11.625 |
| 2015-09-12 12:15:00 | 11.625 |
| 2015-09-12 12:30:00 | 11.625 |
| 2015-09-12 12:45:00 | 11.625 |
| 2015-09-12 13:00:00 | 11.625 |
| 2015-09-12 13:15:00 | 11.625 |
| 2015-09-12 13:30:00 | 11.625 |
| 2015-09-12 13:45:00 | 11.625 |
| 2015-09-12 14:00:00 | 11.625 |
| 2015-09-12 14:15:00 | 11.625 |
| 2015-09-12 14:30:00 | 11.625 |
| 2015-09-12 14:45:00 | 11.625 |
| 2015-09-12 15:00:00 | 11.625 |
| 2015-09-12 15:15:00 | 11.625 |
| 2015-09-12 15:30:00 | 11.625 |
| 2015-09-12 15:45:00 | 11.625 |
| 2015-09-12 16:00:00 | 11.625 |
| 2015-09-12 16:15:00 | 11.625 |
| 2015-09-12 16:30:00 | 11.625 |
| 2015-09-12 16:45:00 | 11.625 |
| 2015-09-12 17:00:00 | 11.625 |
| 2015-09-12 17:15:00 | 11.625 |
| 2015-09-12 17:30:00 | 11.625 |
| 2015-09-12 17:45:00 | 11.625 |
| 2015-09-12 18:00:00 | 11.625 |
| 2015-09-12 18:15:00 | 11.625 |
| 2015-09-12 18:30:00 | 11.625 |
| 2015-09-12 18:45:00 | 11.528 |
| 2015-09-12 19:00:00 | 11.528 |
| 2015-09-12 19:15:00 | 11.528 |
| 2015-09-12 19:30:00 | 11.528 |
| 2015-09-12 19:45:00 | 11.528 |
| 2015-09-12 20:00:00 | 11.528 |
| 2015-09-12 20:15:00 | 11.528 |
| 2015-09-12 20:30:00 | 11.528 |
| 2015-09-12 20:45:00 | 11.431 |
| 2015-09-12 21:00:00 | 11.431 |
| 2015-09-12 21:15:00 | 11.431 |
| 2015-09-12 21:30:00 | 11.431 |
| 2015-09-12 21:45:00 | 11.431 |
| 2015-09-12 22:00:00 | 11.431 |
| 2015-09-12 22:15:00 | 11.334 |
| 2015-09-12 22:30:00 | 11.334 |
| 2015-09-12 22:45:00 | 11.334 |
| 2015-09-12 23:00:00 | 11.334 |
| 2015-09-12 23:15:00 | 11.334 |
| 2015-09-12 23:30:00 | 11.334 |
| 2015-09-12 23:45:00 | 11.334 |
| 2015-09-13 | 11.334 |
| 2015-09-13 00:15:00 | 11.334 |
| 2015-09-13 00:30:00 | 11.334 |
| 2015-09-13 00:45:00 | 11.334 |
| 2015-09-13 01:00:00 | 11.334 |
| 2015-09-13 01:15:00 | 11.334 |
| 2015-09-13 01:30:00 | 11.236 |
| 2015-09-13 01:45:00 | 11.236 |
| 2015-09-13 02:00:00 | 11.334 |
| 2015-09-13 02:15:00 | 11.334 |
| 2015-09-13 02:30:00 | 11.334 |
| 2015-09-13 02:45:00 | 11.236 |
| 2015-09-13 03:00:00 | 11.334 |
| 2015-09-13 03:15:00 | 11.334 |
| 2015-09-13 03:30:00 | 11.334 |
| 2015-09-13 03:45:00 | 11.236 |
| 2015-09-13 04:00:00 | 11.236 |
| 2015-09-13 04:15:00 | 11.236 |
| 2015-09-13 04:30:00 | 11.236 |
| 2015-09-13 04:45:00 | 11.236 |
| 2015-09-13 05:00:00 | 11.236 |
| 2015-09-13 05:15:00 | 11.236 |
| 2015-09-13 05:30:00 | 11.236 |
| 2015-09-13 05:45:00 | 11.236 |
| 2015-09-13 06:00:00 | 11.334 |
| 2015-09-13 06:15:00 | 11.236 |
| 2015-09-13 06:30:00 | 11.236 |
| 2015-09-13 06:45:00 | 11.236 |
| 2015-09-13 07:00:00 | 11.236 |
| 2015-09-13 07:15:00 | 11.236 |
| 2015-09-13 07:30:00 | 11.236 |
| 2015-09-13 07:45:00 | 11.334 |
| 2015-09-13 08:00:00 | 11.236 |
| 2015-09-13 08:15:00 | 11.334 |
| 2015-09-13 08:30:00 | 11.334 |
| 2015-09-13 08:45:00 | 11.334 |
| 2015-09-13 09:00:00 | 11.334 |
| 2015-09-13 09:15:00 | 11.334 |
| 2015-09-13 09:30:00 | 11.334 |
| 2015-09-13 09:45:00 | 11.334 |
| 2015-09-13 10:00:00 | 11.334 |
| 2015-09-13 10:15:00 | 11.431 |
| 2015-09-13 10:30:00 | 11.431 |
| 2015-09-13 10:45:00 | 11.431 |
| 2015-09-13 11:00:00 | 11.431 |
| 2015-09-13 11:15:00 | 11.431 |
| 2015-09-13 11:30:00 | 11.431 |
| 2015-09-13 11:45:00 | 11.528 |
| 2015-09-13 12:00:00 | 11.528 |
| 2015-09-13 12:15:00 | 11.528 |
| 2015-09-13 12:30:00 | 11.528 |
| 2015-09-13 12:45:00 | 11.528 |
| 2015-09-13 13:00:00 | 11.528 |
| 2015-09-13 13:15:00 | 11.528 |
| 2015-09-13 13:30:00 | 11.528 |
| 2015-09-13 13:45:00 | 11.528 |
| 2015-09-13 14:00:00 | 11.528 |
| 2015-09-13 14:15:00 | 11.528 |
| 2015-09-13 14:30:00 | 11.528 |
| 2015-09-13 14:45:00 | 11.528 |
| 2015-09-13 15:00:00 | 11.528 |
| 2015-09-13 15:15:00 | 11.528 |
| 2015-09-13 15:30:00 | 11.528 |
| 2015-09-13 15:45:00 | 11.528 |
| 2015-09-13 16:00:00 | 11.528 |
| 2015-09-13 16:15:00 | 11.528 |
| 2015-09-13 16:30:00 | 11.528 |
| 2015-09-13 16:45:00 | 11.528 |
| 2015-09-13 17:00:00 | 11.528 |
| 2015-09-13 17:15:00 | 11.528 |
| 2015-09-13 17:30:00 | 11.528 |
| 2015-09-13 17:45:00 | 11.528 |
| 2015-09-13 18:00:00 | 11.528 |
| 2015-09-13 18:15:00 | 11.528 |
| 2015-09-13 18:30:00 | 11.528 |
| 2015-09-13 18:45:00 | 11.528 |
| 2015-09-13 19:00:00 | 11.528 |
| 2015-09-13 19:15:00 | 11.528 |
| 2015-09-13 19:30:00 | 11.431 |
| 2015-09-13 19:45:00 | 11.431 |
| 2015-09-13 20:00:00 | 11.431 |
| 2015-09-13 20:15:00 | 11.431 |
| 2015-09-13 20:30:00 | 11.431 |
| 2015-09-13 20:45:00 | 11.431 |
| 2015-09-13 21:00:00 | 11.431 |
| 2015-09-13 21:15:00 | 11.431 |
| 2015-09-13 21:30:00 | 11.431 |
| 2015-09-13 21:45:00 | 11.431 |
| 2015-09-13 22:00:00 | 11.431 |
| 2015-09-13 22:15:00 | 11.431 |
| 2015-09-13 22:30:00 | 11.431 |
| 2015-09-13 22:45:00 | 11.431 |
| 2015-09-13 23:00:00 | 11.431 |
| 2015-09-13 23:15:00 | 11.431 |
| 2015-09-13 23:30:00 | 11.431 |
| 2015-09-13 23:45:00 | 11.431 |
| 2015-09-14 | 11.431 |
| 2015-09-14 00:15:00 | 11.431 |
| 2015-09-14 00:30:00 | 11.431 |
| 2015-09-14 00:45:00 | 11.431 |
| 2015-09-14 01:00:00 | 11.431 |
| 2015-09-14 01:15:00 | 11.431 |
| 2015-09-14 01:30:00 | 11.431 |
| 2015-09-14 01:45:00 | 11.431 |
| 2015-09-14 02:00:00 | 11.431 |
| 2015-09-14 02:15:00 | 11.431 |
| 2015-09-14 02:30:00 | 11.431 |
| 2015-09-14 02:45:00 | 11.431 |
| 2015-09-14 03:00:00 | 11.431 |
| 2015-09-14 03:15:00 | 11.431 |
| 2015-09-14 03:30:00 | 11.431 |
| 2015-09-14 03:45:00 | 11.431 |
| 2015-09-14 04:00:00 | 11.431 |
| 2015-09-14 04:15:00 | 11.334 |
| 2015-09-14 04:30:00 | 11.334 |
| 2015-09-14 04:45:00 | 11.334 |
| 2015-09-14 05:00:00 | 11.334 |
| 2015-09-14 05:15:00 | 11.334 |
| 2015-09-14 05:30:00 | 11.334 |
| 2015-09-14 05:45:00 | 11.334 |
| 2015-09-14 06:00:00 | 11.334 |
| 2015-09-14 06:15:00 | 11.334 |
| 2015-09-14 06:30:00 | 11.334 |
| 2015-09-14 06:45:00 | 11.334 |
| 2015-09-14 07:00:00 | 11.334 |
| 2015-09-14 07:15:00 | 11.334 |
| 2015-09-14 07:30:00 | 11.334 |
| 2015-09-14 07:45:00 | 11.334 |
| 2015-09-14 08:00:00 | 11.431 |
| 2015-09-14 08:15:00 | 11.431 |
| 2015-09-14 08:30:00 | 11.431 |
| 2015-09-14 08:45:00 | 11.431 |
| 2015-09-14 09:00:00 | 11.431 |
| 2015-09-14 09:15:00 | 11.431 |
| 2015-09-14 09:30:00 | 11.431 |
| 2015-09-14 09:45:00 | 11.431 |
| 2015-09-14 10:00:00 | 11.431 |
| 2015-09-14 10:15:00 | 11.528 |
| 2015-09-14 10:30:00 | 11.528 |
| 2015-09-14 10:45:00 | 11.528 |
| 2015-09-14 11:00:00 | 11.528 |
| 2015-09-14 11:15:00 | 11.528 |
| 2015-09-14 11:30:00 | 11.528 |
| 2015-09-14 11:45:00 | 11.528 |
| 2015-09-14 12:00:00 | 11.528 |
| 2015-09-14 12:15:00 | 11.528 |
| 2015-09-14 12:30:00 | 11.528 |
| 2015-09-14 12:45:00 | 11.625 |
| 2015-09-14 13:00:00 | 11.625 |
| 2015-09-14 13:15:00 | 11.625 |
| 2015-09-14 13:30:00 | 11.625 |
| 2015-09-14 13:45:00 | 11.625 |
| 2015-09-14 14:00:00 | 11.625 |
| 2015-09-14 14:15:00 | 11.625 |
| 2015-09-14 14:30:00 | 11.625 |
| 2015-09-14 14:45:00 | 11.625 |
| 2015-09-14 15:00:00 | 11.625 |
| 2015-09-14 15:15:00 | 11.625 |
| 2015-09-14 15:30:00 | 11.625 |
| 2015-09-14 15:45:00 | 11.625 |
| 2015-09-14 16:00:00 | 11.625 |
| 2015-09-14 16:15:00 | 11.528 |
| 2015-09-14 16:30:00 | 11.625 |
| 2015-09-14 16:45:00 | 11.625 |
| 2015-09-14 17:00:00 | 11.528 |
| 2015-09-14 17:15:00 | 11.528 |
| 2015-09-14 17:30:00 | 11.528 |
| 2015-09-14 17:45:00 | 11.528 |
| 2015-09-14 18:00:00 | 11.528 |
| 2015-09-14 18:15:00 | 11.528 |
| 2015-09-14 18:30:00 | 11.528 |
| 2015-09-14 18:45:00 | 11.528 |
| 2015-09-14 19:00:00 | 11.528 |
| 2015-09-14 19:15:00 | 11.528 |
| 2015-09-14 19:30:00 | 11.431 |
| 2015-09-14 19:45:00 | 11.431 |
| 2015-09-14 20:00:00 | 11.431 |
| 2015-09-14 20:15:00 | 11.431 |
| 2015-09-14 20:30:00 | 11.431 |
| 2015-09-14 20:45:00 | 11.431 |
| 2015-09-14 21:00:00 | 11.334 |
| 2015-09-14 21:15:00 | 11.334 |
| 2015-09-14 21:30:00 | 11.334 |
| 2015-09-14 21:45:00 | 11.334 |
| 2015-09-14 22:00:00 | 11.334 |
| 2015-09-14 22:15:00 | 11.334 |
| 2015-09-14 22:30:00 | 11.334 |
| 2015-09-14 22:45:00 | 11.334 |
| 2015-09-14 23:00:00 | 11.334 |
| 2015-09-14 23:15:00 | 11.334 |
| 2015-09-14 23:30:00 | 11.334 |
| 2015-09-14 23:45:00 | 11.334 |
| 2015-09-15 | 11.334 |
| 2015-09-15 00:15:00 | 11.334 |
| 2015-09-15 00:30:00 | 11.334 |
| 2015-09-15 00:45:00 | 11.334 |
| 2015-09-15 01:00:00 | 11.334 |
| 2015-09-15 01:15:00 | 11.236 |
| 2015-09-15 01:30:00 | 11.236 |
| 2015-09-15 01:45:00 | 11.334 |
| 2015-09-15 02:00:00 | 11.334 |
| 2015-09-15 02:15:00 | 11.334 |
| 2015-09-15 02:30:00 | 11.334 |
| 2015-09-15 02:45:00 | 11.334 |
| 2015-09-15 03:00:00 | 11.334 |
| 2015-09-15 03:15:00 | 11.334 |
| 2015-09-15 03:30:00 | 11.334 |
| 2015-09-15 03:45:00 | 11.334 |
| 2015-09-15 04:00:00 | 11.334 |
| 2015-09-15 04:15:00 | 11.334 |
| 2015-09-15 04:30:00 | 11.334 |
| 2015-09-15 04:45:00 | 11.334 |
| 2015-09-15 05:00:00 | 11.334 |
| 2015-09-15 05:15:00 | 11.334 |
| 2015-09-15 05:30:00 | 11.334 |
| 2015-09-15 05:45:00 | 11.334 |
| 2015-09-15 06:00:00 | 11.334 |
| 2015-09-15 06:15:00 | 11.334 |
| 2015-09-15 06:30:00 | 11.334 |
| 2015-09-15 06:45:00 | 11.334 |
| 2015-09-15 07:00:00 | 11.334 |
| 2015-09-15 07:15:00 | 11.334 |
| 2015-09-15 07:30:00 | 11.334 |
| 2015-09-15 07:45:00 | 11.334 |
| 2015-09-15 08:00:00 | 11.334 |
| 2015-09-15 08:15:00 | 11.334 |
| 2015-09-15 08:30:00 | 11.431 |
| 2015-09-15 08:45:00 | 11.431 |
| 2015-09-15 09:00:00 | 11.431 |
| 2015-09-15 09:15:00 | 11.431 |
| 2015-09-15 09:30:00 | 11.431 |
| 2015-09-15 09:45:00 | 11.431 |
| 2015-09-15 10:00:00 | 11.431 |
| 2015-09-15 10:15:00 | 11.431 |
| 2015-09-15 10:30:00 | 11.431 |
| 2015-09-15 10:45:00 | 11.431 |
| 2015-09-15 11:00:00 | 11.431 |
| 2015-09-15 11:15:00 | 11.431 |
| 2015-09-15 11:30:00 | 11.431 |
| 2015-09-15 11:45:00 | 11.431 |
| 2015-09-15 12:00:00 | 11.528 |
| 2015-09-15 12:15:00 | 11.528 |
| 2015-09-15 12:30:00 | 11.528 |
| 2015-09-15 12:45:00 | 11.528 |
| 2015-09-15 13:00:00 | 11.528 |
| 2015-09-15 13:15:00 | 11.528 |
| 2015-09-15 13:30:00 | 11.528 |
| 2015-09-15 13:45:00 | 11.528 |
| 2015-09-15 14:00:00 | 11.528 |
| 2015-09-15 14:15:00 | 11.528 |
| 2015-09-15 14:30:00 | 11.625 |
| 2015-09-15 14:45:00 | 11.528 |
| 2015-09-15 15:00:00 | 11.625 |
| 2015-09-15 15:15:00 | 11.528 |
| 2015-09-15 15:30:00 | 11.625 |
| 2015-09-15 15:45:00 | 11.528 |
| 2015-09-15 16:00:00 | 11.528 |
| 2015-09-15 16:15:00 | 11.528 |
| 2015-09-15 16:30:00 | 11.528 |
| 2015-09-15 16:45:00 | 11.528 |
| 2015-09-15 17:00:00 | 11.528 |
| 2015-09-15 17:15:00 | 11.528 |
| 2015-09-15 17:30:00 | 11.528 |
| 2015-09-15 17:45:00 | 11.528 |
| 2015-09-15 18:00:00 | 11.528 |
| 2015-09-15 18:15:00 | 11.528 |
| 2015-09-15 18:30:00 | 11.528 |
| 2015-09-15 18:45:00 | 11.528 |
| 2015-09-15 19:00:00 | 11.528 |
| 2015-09-15 19:15:00 | 11.528 |
| 2015-09-15 19:30:00 | 11.431 |
| 2015-09-15 19:45:00 | 11.431 |
| 2015-09-15 20:00:00 | 11.431 |
| 2015-09-15 20:15:00 | 11.431 |
| 2015-09-15 20:30:00 | 11.431 |
| 2015-09-15 20:45:00 | 11.431 |
| 2015-09-15 21:00:00 | 11.431 |
| 2015-09-15 21:15:00 | 11.431 |
| 2015-09-15 21:30:00 | 11.431 |
| 2015-09-15 21:45:00 | 11.431 |
| 2015-09-15 22:00:00 | 11.431 |
| 2015-09-15 22:15:00 | 11.431 |
| 2015-09-15 22:30:00 | 11.334 |
| 2015-09-15 22:45:00 | 11.334 |
| 2015-09-15 23:00:00 | 11.334 |
| 2015-09-15 23:15:00 | 11.334 |
| 2015-09-15 23:30:00 | 11.334 |
| 2015-09-15 23:45:00 | 11.334 |
| 2015-09-16 | 11.334 |
| 2015-09-16 00:15:00 | 11.334 |
| 2015-09-16 00:30:00 | 11.334 |
| 2015-09-16 00:45:00 | 11.334 |
| 2015-09-16 01:00:00 | 11.334 |
| 2015-09-16 01:15:00 | 11.334 |
| 2015-09-16 01:30:00 | 11.334 |
| 2015-09-16 01:45:00 | 11.334 |
| 2015-09-16 02:00:00 | 11.334 |
| 2015-09-16 02:15:00 | 11.334 |
| 2015-09-16 02:30:00 | 11.334 |
| 2015-09-16 02:45:00 | 11.334 |
| 2015-09-16 03:00:00 | 11.334 |
| 2015-09-16 03:15:00 | 11.334 |
| 2015-09-16 03:30:00 | 11.334 |
| 2015-09-16 03:45:00 | 11.334 |
| 2015-09-16 04:00:00 | 11.334 |
| 2015-09-16 04:15:00 | 11.334 |
| 2015-09-16 04:30:00 | 11.334 |
| 2015-09-16 04:45:00 | 11.334 |
| 2015-09-16 05:00:00 | 11.334 |
| 2015-09-16 05:15:00 | 11.334 |
| 2015-09-16 05:30:00 | 11.334 |
| 2015-09-16 05:45:00 | 11.334 |
| 2015-09-16 06:00:00 | 11.334 |
| 2015-09-16 06:15:00 | 11.334 |
| 2015-09-16 06:30:00 | 11.334 |
| 2015-09-16 06:45:00 | 11.334 |
| 2015-09-16 07:00:00 | 11.334 |
| 2015-09-16 07:15:00 | 11.334 |
| 2015-09-16 07:30:00 | 11.334 |
| 2015-09-16 07:45:00 | 11.334 |
| 2015-09-16 08:00:00 | 11.334 |
| 2015-09-16 08:15:00 | 11.334 |
| 2015-09-16 08:30:00 | 11.334 |
| 2015-09-16 08:45:00 | 11.334 |
| 2015-09-16 09:00:00 | 11.431 |
| 2015-09-16 09:15:00 | 11.431 |
| 2015-09-16 09:30:00 | 11.431 |
| 2015-09-16 09:45:00 | 11.431 |
| 2015-09-16 10:00:00 | 11.431 |
| 2015-09-16 10:15:00 | 11.431 |
| 2015-09-16 10:30:00 | 11.431 |
| 2015-09-16 10:45:00 | 11.431 |
| 2015-09-16 11:00:00 | 11.431 |
| 2015-09-16 11:15:00 | 11.431 |
| 2015-09-16 11:30:00 | 11.431 |
| 2015-09-16 11:45:00 | 11.431 |
| 2015-09-16 12:00:00 | 11.431 |
| 2015-09-16 12:15:00 | 11.431 |
| 2015-09-16 12:30:00 | 11.431 |
| 2015-09-16 12:45:00 | 11.431 |
| 2015-09-16 13:00:00 | 11.431 |
| 2015-09-16 13:15:00 | 11.528 |
| 2015-09-16 13:30:00 | 11.431 |
| 2015-09-16 13:45:00 | 11.431 |
| 2015-09-16 14:00:00 | 11.431 |
| 2015-09-16 14:15:00 | 11.431 |
| 2015-09-16 14:30:00 | 11.528 |
| 2015-09-16 14:45:00 | 11.431 |
| 2015-09-16 15:00:00 | 11.528 |
| 2015-09-16 15:15:00 | 11.528 |
| 2015-09-16 15:30:00 | 11.431 |
| 2015-09-16 15:45:00 | 11.528 |
| 2015-09-16 16:00:00 | 11.528 |
| 2015-09-16 16:15:00 | 11.528 |
| 2015-09-16 16:30:00 | 11.431 |
| 2015-09-16 16:45:00 | 11.431 |
| 2015-09-16 17:00:00 | 11.431 |
| 2015-09-16 17:15:00 | 11.431 |
| 2015-09-16 17:30:00 | 11.431 |
| 2015-09-16 17:45:00 | 11.431 |
| 2015-09-16 18:00:00 | 11.528 |
| 2015-09-16 18:15:00 | 11.431 |
| 2015-09-16 18:30:00 | 11.431 |
| 2015-09-16 18:45:00 | 11.431 |
| 2015-09-16 19:00:00 | 11.431 |
| 2015-09-16 19:15:00 | 11.431 |
| 2015-09-16 19:30:00 | 11.431 |
| 2015-09-16 19:45:00 | 11.431 |
| 2015-09-16 20:00:00 | 11.431 |
| 2015-09-16 20:15:00 | 11.431 |
| 2015-09-16 20:30:00 | 11.431 |
| 2015-09-16 20:45:00 | 11.431 |
| 2015-09-16 21:00:00 | 11.431 |
| 2015-09-16 21:15:00 | 11.431 |
| 2015-09-16 21:30:00 | 11.431 |
| 2015-09-16 21:45:00 | 11.431 |
| 2015-09-16 22:00:00 | 11.431 |
| 2015-09-16 22:15:00 | 11.431 |
| 2015-09-16 22:30:00 | 11.431 |
| 2015-09-16 22:45:00 | 11.431 |
| 2015-09-16 23:00:00 | 11.431 |
| 2015-09-16 23:15:00 | 11.431 |
| 2015-09-16 23:30:00 | 11.431 |
| 2015-09-16 23:45:00 | 11.431 |
| 2015-09-17 | 11.431 |
| 2015-09-17 00:15:00 | 11.431 |
| 2015-09-17 00:30:00 | 11.431 |
| 2015-09-17 00:45:00 | 11.431 |
| 2015-09-17 01:00:00 | 11.431 |
| 2015-09-17 01:15:00 | 11.431 |
| 2015-09-17 01:30:00 | 11.431 |
| 2015-09-17 01:45:00 | 11.431 |
| 2015-09-17 02:00:00 | 11.431 |
| 2015-09-17 02:15:00 | 11.431 |
| 2015-09-17 02:30:00 | 11.431 |
| 2015-09-17 02:45:00 | 11.431 |
| 2015-09-17 03:00:00 | 11.431 |
| 2015-09-17 03:15:00 | 11.431 |
| 2015-09-17 03:30:00 | 11.334 |
| 2015-09-17 03:45:00 | 11.334 |
| 2015-09-17 04:00:00 | 11.334 |
| 2015-09-17 04:15:00 | 11.334 |
| 2015-09-17 04:30:00 | 11.334 |
| 2015-09-17 04:45:00 | 11.334 |
| 2015-09-17 05:00:00 | 11.334 |
| 2015-09-17 05:15:00 | 11.334 |
| 2015-09-17 05:30:00 | 11.334 |
| 2015-09-17 05:45:00 | 11.334 |
| 2015-09-17 06:00:00 | 11.334 |
| 2015-09-17 06:15:00 | 11.236 |
| 2015-09-17 06:30:00 | 11.236 |
| 2015-09-17 06:45:00 | 11.236 |
| 2015-09-17 07:00:00 | 11.236 |
| 2015-09-17 07:15:00 | 11.236 |
| 2015-09-17 07:30:00 | 11.236 |
| 2015-09-17 07:45:00 | 11.236 |
| 2015-09-17 08:00:00 | 11.236 |
| 2015-09-17 08:15:00 | 11.236 |
| 2015-09-17 08:30:00 | 11.236 |
| 2015-09-17 08:45:00 | 11.236 |
| 2015-09-17 09:00:00 | 11.236 |
| 2015-09-17 09:15:00 | 11.334 |
| 2015-09-17 09:30:00 | 11.334 |
| 2015-09-17 09:45:00 | 11.334 |
| 2015-09-17 10:00:00 | 11.334 |
| 2015-09-17 10:15:00 | 11.334 |
| 2015-09-17 10:30:00 | 11.431 |
| 2015-09-17 10:45:00 | 11.431 |
| 2015-09-17 11:00:00 | 11.431 |
| 2015-09-17 11:15:00 | 11.431 |
| 2015-09-17 11:30:00 | 11.431 |
| 2015-09-17 11:45:00 | 11.431 |
| 2015-09-17 12:00:00 | 11.431 |
| 2015-09-17 12:15:00 | 11.528 |
| 2015-09-17 12:30:00 | 11.528 |
| 2015-09-17 12:45:00 | 11.528 |
| 2015-09-17 13:00:00 | 11.528 |
| 2015-09-17 13:15:00 | 11.528 |
| 2015-09-17 13:30:00 | 11.528 |
| 2015-09-17 13:45:00 | 11.528 |
| 2015-09-17 14:00:00 | 11.625 |
| 2015-09-17 14:15:00 | 11.625 |
| 2015-09-17 14:30:00 | 11.625 |
| 2015-09-17 14:45:00 | 11.625 |
| 2015-09-17 15:00:00 | 11.625 |
| 2015-09-17 15:15:00 | 11.528 |
| 2015-09-17 15:30:00 | 11.625 |
| 2015-09-17 15:45:00 | 11.625 |
| 2015-09-17 16:00:00 | 11.625 |
| 2015-09-17 16:15:00 | 11.625 |
| 2015-09-17 16:30:00 | 11.625 |
| 2015-09-17 16:45:00 | 11.625 |
| 2015-09-17 17:00:00 | 11.625 |
| 2015-09-17 17:15:00 | 11.625 |
| 2015-09-17 17:30:00 | 11.528 |
| 2015-09-17 17:45:00 | 11.528 |
| 2015-09-17 18:00:00 | 11.528 |
| 2015-09-17 18:15:00 | 11.528 |
| 2015-09-17 18:30:00 | 11.528 |
| 2015-09-17 18:45:00 | 11.528 |
| 2015-09-17 19:00:00 | 11.528 |
| 2015-09-17 19:15:00 | 11.528 |
| 2015-09-17 19:30:00 | 11.528 |
| 2015-09-17 19:45:00 | 11.528 |
| 2015-09-17 20:00:00 | 11.431 |
| 2015-09-17 20:15:00 | 11.431 |
| 2015-09-17 20:30:00 | 11.431 |
| 2015-09-17 20:45:00 | 11.431 |
| 2015-09-17 21:00:00 | 11.431 |
| 2015-09-17 21:15:00 | 11.431 |
| 2015-09-17 21:30:00 | 11.431 |
| 2015-09-17 21:45:00 | 11.431 |
| 2015-09-17 22:00:00 | 11.431 |
| 2015-09-17 22:15:00 | 11.431 |
| 2015-09-17 22:30:00 | 11.431 |
| 2015-09-17 22:45:00 | 11.334 |
| 2015-09-17 23:00:00 | 11.334 |
| 2015-09-17 23:15:00 | 11.334 |
| 2015-09-17 23:30:00 | 11.334 |
| 2015-09-17 23:45:00 | 11.334 |
| 2015-09-18 | 11.334 |
| 2015-09-18 00:15:00 | 11.334 |
| 2015-09-18 00:30:00 | 11.334 |
| 2015-09-18 00:45:00 | 11.334 |
| 2015-09-18 01:00:00 | 11.334 |
| 2015-09-18 01:15:00 | 11.334 |
| 2015-09-18 01:30:00 | 11.334 |
| 2015-09-18 01:45:00 | 11.334 |
| 2015-09-18 02:00:00 | 11.334 |
| 2015-09-18 02:15:00 | 11.334 |
| 2015-09-18 02:30:00 | 11.334 |
| 2015-09-18 02:45:00 | 11.334 |
| 2015-09-18 03:00:00 | 11.334 |
| 2015-09-18 03:15:00 | 11.334 |
| 2015-09-18 03:30:00 | 11.236 |
| 2015-09-18 03:45:00 | 11.236 |
| 2015-09-18 04:00:00 | 11.236 |
| 2015-09-18 04:15:00 | 11.236 |
| 2015-09-18 04:30:00 | 11.236 |
| 2015-09-18 04:45:00 | 11.236 |
| 2015-09-18 05:00:00 | 11.236 |
| 2015-09-18 05:15:00 | 11.236 |
| 2015-09-18 05:30:00 | 11.236 |
| 2015-09-18 05:45:00 | 11.236 |
| 2015-09-18 06:00:00 | 11.236 |
| 2015-09-18 06:15:00 | 11.236 |
| 2015-09-18 06:30:00 | 11.236 |
| 2015-09-18 06:45:00 | 11.236 |
| 2015-09-18 07:00:00 | 11.236 |
| 2015-09-18 07:15:00 | 11.236 |
| 2015-09-18 07:30:00 | 11.236 |
| 2015-09-18 07:45:00 | 11.236 |
| 2015-09-18 08:00:00 | 11.236 |
| 2015-09-18 08:15:00 | 11.236 |
| 2015-09-18 08:30:00 | 11.236 |
| 2015-09-18 08:45:00 | 11.334 |
| 2015-09-18 09:00:00 | 11.334 |
| 2015-09-18 09:15:00 | 11.334 |
| 2015-09-18 09:30:00 | 11.334 |
| 2015-09-18 09:45:00 | 11.334 |
| 2015-09-18 10:00:00 | 11.334 |
| 2015-09-18 10:15:00 | 11.431 |
| 2015-09-18 10:30:00 | 11.431 |
| 2015-09-18 10:45:00 | 11.431 |
| 2015-09-18 11:00:00 | 11.431 |
| 2015-09-18 11:15:00 | 11.431 |
| 2015-09-18 11:30:00 | 11.431 |
| 2015-09-18 11:45:00 | 11.431 |
| 2015-09-18 12:00:00 | 11.528 |
| 2015-09-18 12:15:00 | 11.528 |
| 2015-09-18 12:30:00 | 11.528 |
| 2015-09-18 12:45:00 | 11.528 |
| 2015-09-18 13:00:00 | 11.528 |
| 2015-09-18 13:15:00 | 11.528 |
| 2015-09-18 13:30:00 | 11.528 |
| 2015-09-18 13:45:00 | 11.528 |
| 2015-09-18 14:00:00 | 11.528 |
| 2015-09-18 14:15:00 | 11.528 |
| 2015-09-18 14:30:00 | 11.528 |
| 2015-09-18 14:45:00 | 11.528 |
| 2015-09-18 15:00:00 | 11.528 |
| 2015-09-18 15:15:00 | 11.528 |
| 2015-09-18 15:30:00 | 11.528 |
| 2015-09-18 15:45:00 | 11.625 |
| 2015-09-18 16:00:00 | 11.625 |
| 2015-09-18 16:15:00 | 11.528 |
| 2015-09-18 16:30:00 | 11.528 |
| 2015-09-18 16:45:00 | 11.528 |
| 2015-09-18 17:00:00 | 11.528 |
| 2015-09-18 17:15:00 | 11.528 |
| 2015-09-18 17:30:00 | 11.528 |
| 2015-09-18 17:45:00 | 11.528 |
| 2015-09-18 18:00:00 | 11.528 |
| 2015-09-18 18:15:00 | 11.528 |
| 2015-09-18 18:30:00 | 11.528 |
| 2015-09-18 18:45:00 | 11.528 |
| 2015-09-18 19:00:00 | 11.528 |
| 2015-09-18 19:15:00 | 11.528 |
| 2015-09-18 19:30:00 | 11.528 |
| 2015-09-18 19:45:00 | 11.528 |
| 2015-09-18 20:00:00 | 11.528 |
| 2015-09-18 20:15:00 | 11.528 |
| 2015-09-18 20:30:00 | 11.431 |
| 2015-09-18 20:45:00 | 11.431 |
| 2015-09-18 21:00:00 | 11.431 |
| 2015-09-18 21:15:00 | 11.431 |
| 2015-09-18 21:30:00 | 11.431 |
| 2015-09-18 21:45:00 | 11.431 |
| 2015-09-18 22:00:00 | 11.431 |
| 2015-09-18 22:15:00 | 11.431 |
| 2015-09-18 22:30:00 | 11.431 |
| 2015-09-18 22:45:00 | 11.431 |
| 2015-09-18 23:00:00 | 11.334 |
| 2015-09-18 23:15:00 | 11.334 |
| 2015-09-18 23:30:00 | 11.334 |
| 2015-09-18 23:45:00 | 11.334 |
| 2015-09-19 | 11.334 |
| 2015-09-19 00:15:00 | 11.334 |
| 2015-09-19 00:30:00 | 11.334 |
| 2015-09-19 00:45:00 | 11.334 |
| 2015-09-19 01:00:00 | 11.236 |
| 2015-09-19 01:15:00 | 11.236 |
| 2015-09-19 01:30:00 | 11.236 |
| 2015-09-19 01:45:00 | 11.236 |
| 2015-09-19 02:00:00 | 11.236 |
| 2015-09-19 02:15:00 | 11.236 |
| 2015-09-19 02:30:00 | 11.236 |
| 2015-09-19 02:45:00 | 11.236 |
| 2015-09-19 03:00:00 | 11.236 |
| 2015-09-19 03:15:00 | 11.236 |
| 2015-09-19 03:30:00 | 11.236 |
| 2015-09-19 03:45:00 | 11.236 |
| 2015-09-19 04:00:00 | 11.236 |
| 2015-09-19 04:15:00 | 11.139 |
| 2015-09-19 04:30:00 | 11.236 |
| 2015-09-19 04:45:00 | 11.139 |
| 2015-09-19 05:00:00 | 11.139 |
| 2015-09-19 05:15:00 | 11.139 |
| 2015-09-19 05:30:00 | 11.139 |
| 2015-09-19 05:45:00 | 11.139 |
| 2015-09-19 06:00:00 | 11.139 |
| 2015-09-19 06:15:00 | 11.139 |
| 2015-09-19 06:30:00 | 11.139 |
| 2015-09-19 06:45:00 | 11.139 |
| 2015-09-19 07:00:00 | 11.139 |
| 2015-09-19 07:15:00 | 11.139 |
| 2015-09-19 07:30:00 | 11.139 |
| 2015-09-19 07:45:00 | 11.139 |
| 2015-09-19 08:00:00 | 11.139 |
| 2015-09-19 08:15:00 | 11.236 |
| 2015-09-19 08:30:00 | 11.236 |
| 2015-09-19 08:45:00 | 11.236 |
| 2015-09-19 09:00:00 | 11.236 |
| 2015-09-19 09:15:00 | 11.236 |
| 2015-09-19 09:30:00 | 11.334 |
| 2015-09-19 09:45:00 | 11.334 |
| 2015-09-19 10:00:00 | 11.334 |
| 2015-09-19 10:15:00 | 11.334 |
| 2015-09-19 10:30:00 | 11.334 |
| 2015-09-19 10:45:00 | 11.431 |
| 2015-09-19 11:00:00 | 11.431 |
| 2015-09-19 11:15:00 | 11.431 |
| 2015-09-19 11:30:00 | 11.431 |
| 2015-09-19 11:45:00 | 11.431 |
| 2015-09-19 12:00:00 | 11.431 |
| 2015-09-19 12:15:00 | 11.431 |
| 2015-09-19 12:30:00 | 11.528 |
| 2015-09-19 12:45:00 | 11.528 |
| 2015-09-19 13:00:00 | 11.528 |
| 2015-09-19 13:15:00 | 11.528 |
| 2015-09-19 13:30:00 | 11.528 |
| 2015-09-19 13:45:00 | 11.528 |
| 2015-09-19 14:00:00 | 11.528 |
| 2015-09-19 14:15:00 | 11.528 |
| 2015-09-19 14:30:00 | 11.625 |
| 2015-09-19 14:45:00 | 11.625 |
| 2015-09-19 15:00:00 | 11.625 |
| 2015-09-19 15:15:00 | 11.625 |
| 2015-09-19 15:30:00 | 11.625 |
| 2015-09-19 15:45:00 | 11.625 |
| 2015-09-19 16:00:00 | 11.625 |
| 2015-09-19 16:15:00 | 11.625 |
| 2015-09-19 16:30:00 | 11.625 |
| 2015-09-19 16:45:00 | 11.625 |
| 2015-09-19 17:00:00 | 11.625 |
| 2015-09-19 17:15:00 | 11.625 |
| 2015-09-19 17:30:00 | 11.528 |
| 2015-09-19 17:45:00 | 11.528 |
| 2015-09-19 18:00:00 | 11.528 |
| 2015-09-19 18:15:00 | 11.625 |
| 2015-09-19 18:30:00 | 11.528 |
| 2015-09-19 18:45:00 | 11.528 |
| 2015-09-19 19:00:00 | 11.528 |
| 2015-09-19 19:15:00 | 11.528 |
| 2015-09-19 19:30:00 | 11.528 |
| 2015-09-19 19:45:00 | 11.528 |
| 2015-09-19 20:00:00 | 11.528 |
| 2015-09-19 20:15:00 | 11.528 |
| 2015-09-19 20:30:00 | 11.431 |
| 2015-09-19 20:45:00 | 11.431 |
| 2015-09-19 21:00:00 | 11.431 |
| 2015-09-19 21:15:00 | 11.431 |
| 2015-09-19 21:30:00 | 11.431 |
| 2015-09-19 21:45:00 | 11.431 |
| 2015-09-19 22:00:00 | 11.334 |
| 2015-09-19 22:15:00 | 11.334 |
| 2015-09-19 22:30:00 | 11.334 |
| 2015-09-19 22:45:00 | 11.334 |
| 2015-09-19 23:00:00 | 11.334 |
| 2015-09-19 23:15:00 | 11.334 |
| 2015-09-19 23:30:00 | 11.236 |
| 2015-09-19 23:45:00 | 11.236 |
| 2015-09-20 | 11.236 |
| 2015-09-20 00:15:00 | 11.236 |
| 2015-09-20 00:30:00 | 11.236 |
| 2015-09-20 00:45:00 | 11.236 |
| 2015-09-20 01:00:00 | 11.236 |
| 2015-09-20 01:15:00 | 11.236 |
| 2015-09-20 01:30:00 | 11.236 |
| 2015-09-20 01:45:00 | 11.236 |
| 2015-09-20 02:00:00 | 11.236 |
| 2015-09-20 02:15:00 | 11.236 |
| 2015-09-20 02:30:00 | 11.236 |
| 2015-09-20 02:45:00 | 11.236 |
| 2015-09-20 03:00:00 | 11.236 |
| 2015-09-20 03:15:00 | 11.139 |
| 2015-09-20 03:30:00 | 11.236 |
| 2015-09-20 03:45:00 | 11.236 |
| 2015-09-20 04:00:00 | 11.236 |
| 2015-09-20 04:15:00 | 11.236 |
| 2015-09-20 04:30:00 | 11.236 |
| 2015-09-20 04:45:00 | 11.236 |
| 2015-09-20 05:00:00 | 11.236 |
| 2015-09-20 05:15:00 | 11.236 |
| 2015-09-20 05:30:00 | 11.236 |
| 2015-09-20 05:45:00 | 11.236 |
| 2015-09-20 06:00:00 | 11.236 |
| 2015-09-20 06:15:00 | 11.236 |
| 2015-09-20 06:30:00 | 11.236 |
| 2015-09-20 06:45:00 | 11.236 |
| 2015-09-20 07:00:00 | 11.236 |
| 2015-09-20 07:15:00 | 11.236 |
| 2015-09-20 07:30:00 | 11.236 |
| 2015-09-20 07:45:00 | 11.236 |
| 2015-09-20 08:00:00 | 11.236 |
| 2015-09-20 08:15:00 | 11.334 |
| 2015-09-20 08:30:00 | 11.334 |
| 2015-09-20 08:45:00 | 11.334 |
| 2015-09-20 09:00:00 | 11.334 |
| 2015-09-20 09:15:00 | 11.334 |
| 2015-09-20 09:30:00 | 11.334 |
| 2015-09-20 09:45:00 | 11.334 |
| 2015-09-20 10:00:00 | 11.334 |
| 2015-09-20 10:15:00 | 11.431 |
| 2015-09-20 10:30:00 | 11.431 |
| 2015-09-20 10:45:00 | 11.431 |
| 2015-09-20 11:00:00 | 11.431 |
| 2015-09-20 11:15:00 | 11.431 |
| 2015-09-20 11:30:00 | 11.431 |
| 2015-09-20 11:45:00 | 11.431 |
| 2015-09-20 12:00:00 | 11.528 |
| 2015-09-20 12:15:00 | 11.528 |
| 2015-09-20 12:30:00 | 11.528 |
| 2015-09-20 12:45:00 | 11.528 |
| 2015-09-20 13:00:00 | 11.528 |
| 2015-09-20 13:15:00 | 11.528 |
| 2015-09-20 13:30:00 | 11.528 |
| 2015-09-20 13:45:00 | 11.528 |
| 2015-09-20 14:00:00 | 11.528 |
| 2015-09-20 14:15:00 | 11.528 |
| 2015-09-20 14:30:00 | 11.528 |
| 2015-09-20 14:45:00 | 11.528 |
| 2015-09-20 15:00:00 | 11.625 |
| 2015-09-20 15:15:00 | 11.625 |
| 2015-09-20 15:30:00 | 11.625 |
| 2015-09-20 15:45:00 | 11.528 |
| 2015-09-20 16:00:00 | 11.625 |
| 2015-09-20 16:15:00 | 11.528 |
| 2015-09-20 16:30:00 | 11.528 |
| 2015-09-20 16:45:00 | 11.528 |
| 2015-09-20 17:00:00 | 11.625 |
| 2015-09-20 17:15:00 | 11.528 |
| 2015-09-20 17:30:00 | 11.528 |
| 2015-09-20 17:45:00 | 11.528 |
| 2015-09-20 18:00:00 | 11.528 |
| 2015-09-20 18:15:00 | 11.528 |
| 2015-09-20 18:30:00 | 11.528 |
| 2015-09-20 18:45:00 | 11.528 |
| 2015-09-20 19:00:00 | 11.528 |
| 2015-09-20 19:15:00 | 11.528 |
| 2015-09-20 19:30:00 | 11.528 |
| 2015-09-20 19:45:00 | 11.431 |
| 2015-09-20 20:00:00 | 11.431 |
| 2015-09-20 20:15:00 | 11.431 |
| 2015-09-20 20:30:00 | 11.431 |
| 2015-09-20 20:45:00 | 11.431 |
| 2015-09-20 21:00:00 | 11.431 |
| 2015-09-20 21:15:00 | 11.431 |
| 2015-09-20 21:30:00 | 11.334 |
| 2015-09-20 21:45:00 | 11.334 |
| 2015-09-20 22:00:00 | 11.334 |
| 2015-09-20 22:15:00 | 11.334 |
| 2015-09-20 22:30:00 | 11.334 |
| 2015-09-20 22:45:00 | 11.334 |
| 2015-09-20 23:00:00 | 11.334 |
| 2015-09-20 23:15:00 | 11.334 |
| 2015-09-20 23:30:00 | 11.334 |
| 2015-09-20 23:45:00 | 11.334 |
| 2015-09-21 | 11.334 |
| 2015-09-21 00:15:00 | 11.334 |
| 2015-09-21 00:30:00 | 11.334 |
| 2015-09-21 00:45:00 | 11.334 |
| 2015-09-21 01:00:00 | 11.334 |
| 2015-09-21 01:15:00 | 11.334 |
| 2015-09-21 01:30:00 | 11.334 |
| 2015-09-21 01:45:00 | 11.334 |
| 2015-09-21 02:00:00 | 11.334 |
| 2015-09-21 02:15:00 | 11.334 |
| 2015-09-21 02:30:00 | 11.334 |
| 2015-09-21 02:45:00 | 11.334 |
| 2015-09-21 03:00:00 | 11.334 |
| 2015-09-21 03:15:00 | 11.334 |
| 2015-09-21 03:30:00 | 11.334 |
| 2015-09-21 03:45:00 | 11.334 |
| 2015-09-21 04:00:00 | 11.334 |
| 2015-09-21 04:15:00 | 11.334 |
| 2015-09-21 04:30:00 | 11.334 |
| 2015-09-21 04:45:00 | 11.334 |
| 2015-09-21 05:00:00 | 11.334 |
| 2015-09-21 05:15:00 | 11.334 |
| 2015-09-21 05:30:00 | 11.334 |
| 2015-09-21 05:45:00 | 11.334 |
| 2015-09-21 06:00:00 | 11.334 |
| 2015-09-21 06:15:00 | 11.334 |
| 2015-09-21 06:30:00 | 11.334 |
| 2015-09-21 06:45:00 | 11.334 |
| 2015-09-21 07:00:00 | 11.334 |
| 2015-09-21 07:15:00 | 11.334 |
| 2015-09-21 07:30:00 | 11.334 |
| 2015-09-21 07:45:00 | 11.334 |
| 2015-09-21 08:00:00 | 11.334 |
| 2015-09-21 08:15:00 | 11.334 |
| 2015-09-21 08:30:00 | 11.334 |
| 2015-09-21 08:45:00 | 11.334 |
| 2015-09-21 09:00:00 | 11.431 |
| 2015-09-21 09:15:00 | 11.334 |
| 2015-09-21 09:30:00 | 11.431 |
| 2015-09-21 09:45:00 | 11.431 |
| 2015-09-21 10:00:00 | 11.431 |
| 2015-09-21 10:15:00 | 11.431 |
| 2015-09-21 10:30:00 | 11.431 |
| 2015-09-21 10:45:00 | 11.431 |
| 2015-09-21 11:00:00 | 11.431 |
| 2015-09-21 11:15:00 | 11.431 |
| 2015-09-21 11:30:00 | 11.431 |
| 2015-09-21 11:45:00 | 11.431 |
| 2015-09-21 12:00:00 | 11.431 |
| 2015-09-21 12:15:00 | 11.431 |
| 2015-09-21 12:30:00 | 11.431 |
| 2015-09-21 12:45:00 | 11.431 |
| 2015-09-21 13:00:00 | 11.431 |
| 2015-09-21 13:15:00 | 11.431 |
| 2015-09-21 13:30:00 | 11.431 |
| 2015-09-21 13:45:00 | 11.528 |
| 2015-09-21 14:00:00 | 11.528 |
| 2015-09-21 14:15:00 | 11.528 |
| 2015-09-21 14:30:00 | 11.528 |
| 2015-09-21 14:45:00 | 11.528 |
| 2015-09-21 15:00:00 | 11.431 |
| 2015-09-21 15:15:00 | 11.431 |
| 2015-09-21 15:30:00 | 11.528 |
| 2015-09-21 15:45:00 | 11.528 |
| 2015-09-21 16:00:00 | 11.528 |
| 2015-09-21 16:15:00 | 11.528 |
| 2015-09-21 16:30:00 | 11.528 |
| 2015-09-21 16:45:00 | 11.528 |
| 2015-09-21 17:00:00 | 11.528 |
| 2015-09-21 17:15:00 | 11.528 |
| 2015-09-21 17:30:00 | 11.431 |
| 2015-09-21 17:45:00 | 11.528 |
| 2015-09-21 18:00:00 | 11.431 |
| 2015-09-21 18:15:00 | 11.431 |
| 2015-09-21 18:30:00 | 11.431 |
| 2015-09-21 18:45:00 | 11.431 |
| 2015-09-21 19:00:00 | 11.431 |
| 2015-09-21 19:15:00 | 11.431 |
| 2015-09-21 19:30:00 | 11.431 |
| 2015-09-21 19:45:00 | 11.431 |
| 2015-09-21 20:00:00 | 11.431 |
| 2015-09-21 20:15:00 | 11.334 |
| 2015-09-21 20:30:00 | 11.334 |
| 2015-09-21 20:45:00 | 11.334 |
| 2015-09-21 21:00:00 | 11.334 |
| 2015-09-21 21:15:00 | 11.334 |
| 2015-09-21 21:30:00 | 11.236 |
| 2015-09-21 21:45:00 | 11.236 |
| 2015-09-21 22:00:00 | 11.236 |
| 2015-09-21 22:15:00 | 11.236 |
| 2015-09-21 22:30:00 | 11.236 |
| 2015-09-21 22:45:00 | 11.236 |
| 2015-09-21 23:00:00 | 11.236 |
| 2015-09-21 23:15:00 | 11.236 |
| 2015-09-21 23:30:00 | 11.236 |
| 2015-09-21 23:45:00 | 11.236 |
| 2015-09-22 | 11.236 |
| 2015-09-22 00:15:00 | 11.236 |
| 2015-09-22 00:30:00 | 11.236 |
| 2015-09-22 00:45:00 | 11.236 |
| 2015-09-22 01:00:00 | 11.236 |
| 2015-09-22 01:15:00 | 11.236 |
| 2015-09-22 01:30:00 | 11.236 |
| 2015-09-22 01:45:00 | 11.236 |
| 2015-09-22 02:00:00 | 11.236 |
| 2015-09-22 02:15:00 | 11.139 |
| 2015-09-22 02:30:00 | 11.236 |
| 2015-09-22 02:45:00 | 11.236 |
| 2015-09-22 03:00:00 | 11.236 |
| 2015-09-22 03:15:00 | 11.236 |
| 2015-09-22 03:30:00 | 11.236 |
| 2015-09-22 03:45:00 | 11.236 |
| 2015-09-22 04:00:00 | 11.236 |
| 2015-09-22 04:15:00 | 11.236 |
| 2015-09-22 04:30:00 | 11.236 |
| 2015-09-22 04:45:00 | 11.334 |
| 2015-09-22 05:00:00 | 11.334 |
| 2015-09-22 05:15:00 | 11.334 |
| 2015-09-22 05:30:00 | 11.334 |
| 2015-09-22 05:45:00 | 11.334 |
| 2015-09-22 06:00:00 | 11.334 |
| 2015-09-22 06:15:00 | 11.334 |
| 2015-09-22 06:30:00 | 11.334 |
| 2015-09-22 06:45:00 | 11.334 |
| 2015-09-22 07:00:00 | 11.334 |
| 2015-09-22 07:15:00 | 11.334 |
| 2015-09-22 07:30:00 | 11.334 |
| 2015-09-22 07:45:00 | 11.334 |
| 2015-09-22 08:00:00 | 11.334 |
| 2015-09-22 08:15:00 | 11.334 |
| 2015-09-22 08:30:00 | 11.334 |
| 2015-09-22 08:45:00 | 11.334 |
| 2015-09-22 09:00:00 | 11.334 |
| 2015-09-22 09:15:00 | 11.334 |
| 2015-09-22 09:30:00 | 11.334 |
| 2015-09-22 09:45:00 | 11.334 |
| 2015-09-22 10:00:00 | 11.431 |
| 2015-09-22 10:15:00 | 11.431 |
| 2015-09-22 10:30:00 | 11.431 |
| 2015-09-22 10:45:00 | 11.431 |
| 2015-09-22 11:00:00 | 11.431 |
| 2015-09-22 11:15:00 | 11.431 |
| 2015-09-22 11:30:00 | 11.431 |
| 2015-09-22 11:45:00 | 11.431 |
| 2015-09-22 12:00:00 | 11.431 |
| 2015-09-22 12:15:00 | 11.431 |
| 2015-09-22 12:30:00 | 11.528 |
| 2015-09-22 12:45:00 | 11.528 |
| 2015-09-22 13:00:00 | 11.528 |
| 2015-09-22 13:15:00 | 11.528 |
| 2015-09-22 13:30:00 | 11.528 |
| 2015-09-22 13:45:00 | 11.528 |
| 2015-09-22 14:00:00 | 11.528 |
| 2015-09-22 14:15:00 | 11.528 |
| 2015-09-22 14:30:00 | 11.528 |
| 2015-09-22 14:45:00 | 11.528 |
| 2015-09-22 15:00:00 | 11.528 |
| 2015-09-22 15:15:00 | 11.528 |
| 2015-09-22 15:30:00 | 11.528 |
| 2015-09-22 15:45:00 | 11.528 |
| 2015-09-22 16:00:00 | 11.528 |
| 2015-09-22 16:15:00 | 11.528 |
| 2015-09-22 16:30:00 | 11.528 |
| 2015-09-22 16:45:00 | 11.528 |
| 2015-09-22 17:00:00 | 11.528 |
| 2015-09-22 17:15:00 | 11.528 |
| 2015-09-22 17:30:00 | 11.528 |
| 2015-09-22 17:45:00 | 11.528 |
| 2015-09-22 18:00:00 | 11.431 |
| 2015-09-22 18:15:00 | 11.431 |
| 2015-09-22 18:30:00 | 11.431 |
| 2015-09-22 18:45:00 | 11.431 |
| 2015-09-22 19:00:00 | 11.431 |
| 2015-09-22 19:15:00 | 11.431 |
| 2015-09-22 19:30:00 | 11.431 |
| 2015-09-22 19:45:00 | 11.431 |
| 2015-09-22 20:00:00 | 11.431 |
| 2015-09-22 20:15:00 | 11.334 |
| 2015-09-22 20:30:00 | 11.334 |
| 2015-09-22 20:45:00 | 11.334 |
| 2015-09-22 21:00:00 | 11.334 |
| 2015-09-22 21:15:00 | 11.334 |
| 2015-09-22 21:30:00 | 11.334 |
| 2015-09-22 21:45:00 | 11.236 |
| 2015-09-22 22:00:00 | 11.236 |
| 2015-09-22 22:15:00 | 11.236 |
| 2015-09-22 22:30:00 | 11.236 |
| 2015-09-22 22:45:00 | 11.236 |
| 2015-09-22 23:00:00 | 11.236 |
| 2015-09-22 23:15:00 | 11.236 |
| 2015-09-22 23:30:00 | 11.236 |
| 2015-09-22 23:45:00 | 11.236 |
| 2015-09-23 | 11.236 |
| 2015-09-23 00:15:00 | 11.236 |
| 2015-09-23 00:30:00 | 11.236 |
| 2015-09-23 00:45:00 | 11.236 |
| 2015-09-23 01:00:00 | 11.236 |
| 2015-09-23 01:15:00 | 11.236 |
| 2015-09-23 01:30:00 | 11.236 |
| 2015-09-23 01:45:00 | 11.236 |
| 2015-09-23 02:00:00 | 11.139 |
| 2015-09-23 02:15:00 | 11.139 |
| 2015-09-23 02:30:00 | 11.139 |
| 2015-09-23 02:45:00 | 11.139 |
| 2015-09-23 03:00:00 | 11.139 |
| 2015-09-23 03:15:00 | 11.139 |
| 2015-09-23 03:30:00 | 11.139 |
| 2015-09-23 03:45:00 | 11.139 |
| 2015-09-23 04:00:00 | 11.139 |
| 2015-09-23 04:15:00 | 11.139 |
| 2015-09-23 04:30:00 | 11.139 |
| 2015-09-23 04:45:00 | 11.139 |
| 2015-09-23 05:00:00 | 11.139 |
| 2015-09-23 05:15:00 | 11.139 |
| 2015-09-23 05:30:00 | 11.139 |
| 2015-09-23 05:45:00 | 11.139 |
| 2015-09-23 06:00:00 | 11.139 |
| 2015-09-23 06:15:00 | 11.139 |
| 2015-09-23 06:30:00 | 11.139 |
| 2015-09-23 06:45:00 | 11.139 |
| 2015-09-23 07:00:00 | 11.139 |
| 2015-09-23 07:15:00 | 11.041 |
| 2015-09-23 07:30:00 | 11.139 |
| 2015-09-23 07:45:00 | 11.139 |
| 2015-09-23 08:00:00 | 11.139 |
| 2015-09-23 08:15:00 | 11.139 |
| 2015-09-23 08:30:00 | 11.139 |
| 2015-09-23 08:45:00 | 11.139 |
| 2015-09-23 09:00:00 | 11.139 |
| 2015-09-23 09:15:00 | 11.139 |
| 2015-09-23 09:30:00 | 11.236 |
| 2015-09-23 09:45:00 | 11.236 |
| 2015-09-23 10:00:00 | 11.236 |
| 2015-09-23 10:15:00 | 11.236 |
| 2015-09-23 10:30:00 | 11.334 |
| 2015-09-23 10:45:00 | 11.334 |
| 2015-09-23 11:00:00 | 11.334 |
| 2015-09-23 11:15:00 | 11.334 |
| 2015-09-23 11:30:00 | 11.431 |
| 2015-09-23 11:45:00 | 11.431 |
| 2015-09-23 12:00:00 | 11.431 |
| 2015-09-23 12:15:00 | 11.431 |
| 2015-09-23 12:30:00 | 11.431 |
| 2015-09-23 12:45:00 | 11.528 |
| 2015-09-23 13:00:00 | 11.528 |
| 2015-09-23 13:15:00 | 11.528 |
| 2015-09-23 13:30:00 | 11.528 |
| 2015-09-23 13:45:00 | 11.528 |
| 2015-09-23 14:00:00 | 11.528 |
| 2015-09-23 14:15:00 | 11.528 |
| 2015-09-23 14:30:00 | 11.528 |
| 2015-09-23 14:45:00 | 11.528 |
| 2015-09-23 15:00:00 | 11.528 |
| 2015-09-23 15:15:00 | 11.528 |
| 2015-09-23 15:30:00 | 11.528 |
| 2015-09-23 15:45:00 | 11.528 |
| 2015-09-23 16:00:00 | 11.528 |
| 2015-09-23 16:15:00 | 11.528 |
| 2015-09-23 16:30:00 | 11.528 |
| 2015-09-23 16:45:00 | 11.528 |
| 2015-09-23 17:00:00 | 11.528 |
| 2015-09-23 17:15:00 | 11.528 |
| 2015-09-23 17:30:00 | 11.528 |
| 2015-09-23 17:45:00 | 11.528 |
| 2015-09-23 18:00:00 | 11.528 |
| 2015-09-23 18:15:00 | 11.528 |
| 2015-09-23 18:30:00 | 11.528 |
| 2015-09-23 18:45:00 | 11.528 |
| 2015-09-23 19:00:00 | 11.528 |
| 2015-09-23 19:15:00 | 11.528 |
| 2015-09-23 19:30:00 | 11.528 |
| 2015-09-23 19:45:00 | 11.431 |
| 2015-09-23 20:00:00 | 11.528 |
| 2015-09-23 20:15:00 | 11.431 |
| 2015-09-23 20:30:00 | 11.431 |
| 2015-09-23 20:45:00 | 11.431 |
| 2015-09-23 21:00:00 | 11.431 |
| 2015-09-23 21:15:00 | 11.431 |
| 2015-09-23 21:30:00 | 11.431 |
| 2015-09-23 21:45:00 | 11.431 |
| 2015-09-23 22:00:00 | 11.431 |
| 2015-09-23 22:15:00 | 11.431 |
| 2015-09-23 22:30:00 | 11.431 |
| 2015-09-23 22:45:00 | 11.431 |
| 2015-09-23 23:00:00 | 11.431 |
| 2015-09-23 23:15:00 | 11.431 |
| 2015-09-23 23:30:00 | 11.431 |
| 2015-09-23 23:45:00 | 11.431 |
| 2015-09-24 | 11.431 |
| 2015-09-24 00:15:00 | 11.431 |
| 2015-09-24 00:30:00 | 11.431 |
| 2015-09-24 00:45:00 | 11.431 |
| 2015-09-24 01:00:00 | 11.431 |
| 2015-09-24 01:15:00 | 11.431 |
| 2015-09-24 01:30:00 | 11.431 |
| 2015-09-24 01:45:00 | 11.431 |
| 2015-09-24 02:00:00 | 11.431 |
| 2015-09-24 02:15:00 | 11.431 |
| 2015-09-24 02:30:00 | 11.431 |
| 2015-09-24 02:45:00 | 11.431 |
| 2015-09-24 03:00:00 | 11.431 |
| 2015-09-24 03:15:00 | 11.431 |
| 2015-09-24 03:30:00 | 11.431 |
| 2015-09-24 03:45:00 | 11.431 |
| 2015-09-24 04:00:00 | 11.431 |
| 2015-09-24 04:15:00 | 11.431 |
| 2015-09-24 04:30:00 | 11.431 |
| 2015-09-24 04:45:00 | 11.431 |
| 2015-09-24 05:00:00 | 11.431 |
| 2015-09-24 05:15:00 | 11.431 |
| 2015-09-24 05:30:00 | 11.431 |
| 2015-09-24 05:45:00 | 11.431 |
| 2015-09-24 06:00:00 | 11.431 |
| 2015-09-24 06:15:00 | 11.431 |
| 2015-09-24 06:30:00 | 11.431 |
| 2015-09-24 06:45:00 | 11.431 |
| 2015-09-24 07:00:00 | 11.431 |
| 2015-09-24 07:15:00 | 11.431 |
| 2015-09-24 07:30:00 | 11.431 |
| 2015-09-24 07:45:00 | 11.431 |
| 2015-09-24 08:00:00 | 11.431 |
| 2015-09-24 08:15:00 | 11.431 |
| 2015-09-24 08:30:00 | 11.431 |
| 2015-09-24 08:45:00 | 11.431 |
| 2015-09-24 09:00:00 | 11.431 |
| 2015-09-24 09:15:00 | 11.431 |
| 2015-09-24 09:30:00 | 11.431 |
| 2015-09-24 09:45:00 | 11.431 |
| 2015-09-24 10:00:00 | 11.431 |
| 2015-09-24 10:15:00 | 11.431 |
| 2015-09-24 10:30:00 | 11.431 |
| 2015-09-24 10:45:00 | 11.431 |
| 2015-09-24 11:00:00 | 11.528 |
| 2015-09-24 11:15:00 | 11.431 |
| 2015-09-24 11:30:00 | 11.528 |
| 2015-09-24 11:45:00 | 11.528 |
| 2015-09-24 12:00:00 | 11.528 |
| 2015-09-24 12:15:00 | 11.528 |
| 2015-09-24 12:30:00 | 11.528 |
| 2015-09-24 12:45:00 | 11.528 |
| 2015-09-24 13:00:00 | 11.528 |
| 2015-09-24 13:15:00 | 11.528 |
| 2015-09-24 13:30:00 | 11.625 |
| 2015-09-24 13:45:00 | 11.625 |
| 2015-09-24 14:00:00 | 11.625 |
| 2015-09-24 14:15:00 | 11.625 |
| 2015-09-24 14:30:00 | 11.625 |
| 2015-09-24 14:45:00 | 11.625 |
| 2015-09-24 15:00:00 | 11.625 |
| 2015-09-24 15:15:00 | 11.625 |
| 2015-09-24 15:30:00 | 11.625 |
| 2015-09-24 15:45:00 | 11.625 |
| 2015-09-24 16:00:00 | 11.625 |
| 2015-09-24 16:15:00 | 11.625 |
| 2015-09-24 16:30:00 | 11.528 |
| 2015-09-24 16:45:00 | 11.528 |
| 2015-09-24 17:00:00 | 11.528 |
| 2015-09-24 17:15:00 | 11.528 |
| 2015-09-24 17:30:00 | 11.528 |
| 2015-09-24 17:45:00 | 11.528 |
| 2015-09-24 18:00:00 | 11.528 |
| 2015-09-24 18:15:00 | 11.528 |
| 2015-09-24 18:30:00 | 11.528 |
| 2015-09-24 18:45:00 | 11.528 |
| 2015-09-24 19:00:00 | 11.528 |
| 2015-09-24 19:15:00 | 11.528 |
| 2015-09-24 19:30:00 | 11.431 |
| 2015-09-24 19:45:00 | 11.431 |
| 2015-09-24 20:00:00 | 11.431 |
| 2015-09-24 20:15:00 | 11.431 |
| 2015-09-24 20:30:00 | 11.431 |
| 2015-09-24 20:45:00 | 11.431 |
| 2015-09-24 21:00:00 | 11.334 |
| 2015-09-24 21:15:00 | 11.334 |
| 2015-09-24 21:30:00 | 11.334 |
| 2015-09-24 21:45:00 | 11.334 |
| 2015-09-24 22:00:00 | 11.334 |
| 2015-09-24 22:15:00 | 11.334 |
| 2015-09-24 22:30:00 | 11.236 |
| 2015-09-24 22:45:00 | 11.236 |
| 2015-09-24 23:00:00 | 11.236 |
| 2015-09-24 23:15:00 | 11.236 |
| 2015-09-24 23:30:00 | 11.236 |
| 2015-09-24 23:45:00 | 11.236 |
| 2015-09-25 | 11.236 |
| 2015-09-25 00:15:00 | 11.139 |
| 2015-09-25 00:30:00 | 11.139 |
| 2015-09-25 00:45:00 | 11.139 |
| 2015-09-25 01:00:00 | 11.139 |
| 2015-09-25 01:15:00 | 11.139 |
| 2015-09-25 01:30:00 | 11.139 |
| 2015-09-25 01:45:00 | 11.139 |
| 2015-09-25 02:00:00 | 11.139 |
| 2015-09-25 02:15:00 | 11.139 |
| 2015-09-25 02:30:00 | 11.139 |
| 2015-09-25 02:45:00 | 11.139 |
| 2015-09-25 03:00:00 | 11.236 |
| 2015-09-25 03:15:00 | 11.236 |
| 2015-09-25 03:30:00 | 11.236 |
| 2015-09-25 03:45:00 | 11.236 |
| 2015-09-25 04:00:00 | 11.236 |
| 2015-09-25 04:15:00 | 11.236 |
| 2015-09-25 04:30:00 | 11.236 |
| 2015-09-25 04:45:00 | 11.236 |
| 2015-09-25 05:00:00 | 11.236 |
| 2015-09-25 05:15:00 | 11.236 |
| 2015-09-25 05:30:00 | 11.236 |
| 2015-09-25 05:45:00 | 11.236 |
| 2015-09-25 06:00:00 | 11.236 |
| 2015-09-25 06:15:00 | 11.236 |
| 2015-09-25 06:30:00 | 11.236 |
| 2015-09-25 06:45:00 | 11.139 |
| 2015-09-25 07:00:00 | 11.139 |
| 2015-09-25 07:15:00 | 11.139 |
| 2015-09-25 07:30:00 | 11.139 |
| 2015-09-25 07:45:00 | 11.139 |
| 2015-09-25 08:00:00 | 11.139 |
| 2015-09-25 08:15:00 | 11.139 |
| 2015-09-25 08:30:00 | 11.139 |
| 2015-09-25 08:45:00 | 11.236 |
| 2015-09-25 09:00:00 | 11.236 |
| 2015-09-25 09:15:00 | 11.236 |
| 2015-09-25 09:30:00 | 11.236 |
| 2015-09-25 09:45:00 | 11.236 |
| 2015-09-25 10:00:00 | 11.334 |
| 2015-09-25 10:15:00 | 11.334 |
| 2015-09-25 10:30:00 | 11.334 |
| 2015-09-25 10:45:00 | 11.334 |
| 2015-09-25 11:00:00 | 11.334 |
| 2015-09-25 11:15:00 | 11.431 |
| 2015-09-25 11:30:00 | 11.431 |
| 2015-09-25 11:45:00 | 11.431 |
| 2015-09-25 12:00:00 | 11.431 |
| 2015-09-25 12:15:00 | 11.431 |
| 2015-09-25 12:30:00 | 11.431 |
| 2015-09-25 12:45:00 | 11.431 |
| 2015-09-25 13:00:00 | 11.528 |
| 2015-09-25 13:15:00 | 11.528 |
| 2015-09-25 13:30:00 | 11.528 |
| 2015-09-25 13:45:00 | 11.528 |
| 2015-09-25 14:00:00 | 11.528 |
| 2015-09-25 14:15:00 | 11.528 |
| 2015-09-25 14:30:00 | 11.528 |
| 2015-09-25 14:45:00 | 11.528 |
| 2015-09-25 15:00:00 | 11.528 |
| 2015-09-25 15:15:00 | 11.528 |
| 2015-09-25 15:30:00 | 11.528 |
| 2015-09-25 15:45:00 | 11.528 |
| 2015-09-25 16:00:00 | 11.528 |
| 2015-09-25 16:15:00 | 11.528 |
| 2015-09-25 16:30:00 | 11.528 |
| 2015-09-25 16:45:00 | 11.528 |
| 2015-09-25 17:00:00 | 11.528 |
| 2015-09-25 17:15:00 | 11.528 |
| 2015-09-25 17:30:00 | 11.528 |
| 2015-09-25 17:45:00 | 11.528 |
| 2015-09-25 18:00:00 | 11.528 |
| 2015-09-25 18:15:00 | 11.528 |
| 2015-09-25 18:30:00 | 11.528 |
| 2015-09-25 18:45:00 | 11.528 |
| 2015-09-25 19:00:00 | 11.431 |
| 2015-09-25 19:15:00 | 11.431 |
| 2015-09-25 19:30:00 | 11.431 |
| 2015-09-25 19:45:00 | 11.431 |
| 2015-09-25 20:00:00 | 11.431 |
| 2015-09-25 20:15:00 | 11.431 |
| 2015-09-25 20:30:00 | 11.334 |
| 2015-09-25 20:45:00 | 11.334 |
| 2015-09-25 21:00:00 | 11.334 |
| 2015-09-25 21:15:00 | 11.334 |
| 2015-09-25 21:30:00 | 11.236 |
| 2015-09-25 21:45:00 | 11.236 |
| 2015-09-25 22:00:00 | 11.236 |
| 2015-09-25 22:15:00 | 11.236 |
| 2015-09-25 22:30:00 | 11.236 |
| 2015-09-25 22:45:00 | 11.236 |
| 2015-09-25 23:00:00 | 11.139 |
| 2015-09-25 23:15:00 | 11.139 |
| 2015-09-25 23:30:00 | 11.139 |
| 2015-09-25 23:45:00 | 11.139 |
| 2015-09-26 | 11.139 |
| 2015-09-26 00:15:00 | 11.139 |
| 2015-09-26 00:30:00 | 11.139 |
| 2015-09-26 00:45:00 | 11.139 |
| 2015-09-26 01:00:00 | 11.139 |
| 2015-09-26 01:15:00 | 11.139 |
| 2015-09-26 01:30:00 | 11.139 |
| 2015-09-26 01:45:00 | 11.139 |
| 2015-09-26 02:00:00 | 11.139 |
| 2015-09-26 02:15:00 | 11.139 |
| 2015-09-26 02:30:00 | 11.139 |
| 2015-09-26 02:45:00 | 11.041 |
| 2015-09-26 03:00:00 | 11.139 |
| 2015-09-26 03:15:00 | 11.139 |
| 2015-09-26 03:30:00 | 11.139 |
| 2015-09-26 03:45:00 | 11.041 |
| 2015-09-26 04:00:00 | 11.041 |
| 2015-09-26 04:15:00 | 11.041 |
| 2015-09-26 04:30:00 | 11.041 |
| 2015-09-26 04:45:00 | 11.139 |
| 2015-09-26 05:00:00 | 11.041 |
| 2015-09-26 05:15:00 | 11.041 |
| 2015-09-26 05:30:00 | 11.041 |
| 2015-09-26 05:45:00 | 11.041 |
| 2015-09-26 06:00:00 | 11.041 |
| 2015-09-26 06:15:00 | 11.041 |
| 2015-09-26 06:30:00 | 11.041 |
| 2015-09-26 06:45:00 | 11.041 |
| 2015-09-26 07:00:00 | 11.041 |
| 2015-09-26 07:15:00 | 11.139 |
| 2015-09-26 07:30:00 | 11.041 |
| 2015-09-26 07:45:00 | 11.139 |
| 2015-09-26 08:00:00 | 11.139 |
| 2015-09-26 08:15:00 | 11.139 |
| 2015-09-26 08:30:00 | 11.139 |
| 2015-09-26 08:45:00 | 11.139 |
| 2015-09-26 09:00:00 | 11.139 |
| 2015-09-26 09:15:00 | 11.139 |
| 2015-09-26 09:30:00 | 11.236 |
| 2015-09-26 09:45:00 | 11.236 |
| 2015-09-26 10:00:00 | 11.236 |
| 2015-09-26 10:15:00 | 11.236 |
| 2015-09-26 10:30:00 | 11.236 |
| 2015-09-26 10:45:00 | 11.334 |
| 2015-09-26 11:00:00 | 11.334 |
| 2015-09-26 11:15:00 | 11.334 |
| 2015-09-26 11:30:00 | 11.334 |
| 2015-09-26 11:45:00 | 11.431 |
| 2015-09-26 12:00:00 | 11.431 |
| 2015-09-26 12:15:00 | 11.431 |
| 2015-09-26 12:30:00 | 11.431 |
| 2015-09-26 12:45:00 | 11.528 |
| 2015-09-26 13:00:00 | 11.528 |
| 2015-09-26 13:15:00 | 11.528 |
| 2015-09-26 13:30:00 | 11.528 |
| 2015-09-26 13:45:00 | 11.528 |
| 2015-09-26 14:00:00 | 11.528 |
| 2015-09-26 14:15:00 | 11.625 |
| 2015-09-26 14:30:00 | 11.625 |
| 2015-09-26 14:45:00 | 11.625 |
| 2015-09-26 15:00:00 | 11.625 |
| 2015-09-26 15:15:00 | 11.625 |
| 2015-09-26 15:30:00 | 11.625 |
| 2015-09-26 15:45:00 | 11.625 |
| 2015-09-26 16:00:00 | 11.625 |
| 2015-09-26 16:15:00 | 11.528 |
| 2015-09-26 16:30:00 | 11.528 |
| 2015-09-26 16:45:00 | 11.528 |
| 2015-09-26 17:00:00 | 11.528 |
| 2015-09-26 17:15:00 | 11.528 |
| 2015-09-26 17:30:00 | 11.528 |
| 2015-09-26 17:45:00 | 11.528 |
| 2015-09-26 18:00:00 | 11.528 |
| 2015-09-26 18:15:00 | 11.528 |
| 2015-09-26 18:30:00 | 11.528 |
| 2015-09-26 18:45:00 | 11.431 |
| 2015-09-26 19:00:00 | 11.431 |
| 2015-09-26 19:15:00 | 11.431 |
| 2015-09-26 19:30:00 | 11.431 |
| 2015-09-26 19:45:00 | 11.431 |
| 2015-09-26 20:00:00 | 11.431 |
| 2015-09-26 20:15:00 | 11.334 |
| 2015-09-26 20:30:00 | 11.334 |
| 2015-09-26 20:45:00 | 11.334 |
| 2015-09-26 21:00:00 | 11.334 |
| 2015-09-26 21:15:00 | 11.334 |
| 2015-09-26 21:30:00 | 11.334 |
| 2015-09-26 21:45:00 | 11.236 |
| 2015-09-26 22:00:00 | 11.236 |
| 2015-09-26 22:15:00 | 11.236 |
| 2015-09-26 22:30:00 | 11.236 |
| 2015-09-26 22:45:00 | 11.236 |
| 2015-09-26 23:00:00 | 11.236 |
| 2015-09-26 23:15:00 | 11.139 |
| 2015-09-26 23:30:00 | 11.139 |
| 2015-09-26 23:45:00 | 11.139 |
| 2015-09-27 | 11.139 |
| 2015-09-27 00:15:00 | 11.139 |
| 2015-09-27 00:30:00 | 11.139 |
| 2015-09-27 00:45:00 | 11.139 |
| 2015-09-27 01:00:00 | 11.139 |
| 2015-09-27 01:15:00 | 11.139 |
| 2015-09-27 01:30:00 | 11.139 |
| 2015-09-27 01:45:00 | 11.139 |
| 2015-09-27 02:00:00 | 11.139 |
| 2015-09-27 02:15:00 | 11.139 |
| 2015-09-27 02:30:00 | 11.139 |
| 2015-09-27 02:45:00 | 11.139 |
| 2015-09-27 03:00:00 | 11.139 |
| 2015-09-27 03:15:00 | 11.139 |
| 2015-09-27 03:30:00 | 11.139 |
| 2015-09-27 03:45:00 | 11.139 |
| 2015-09-27 04:00:00 | 11.139 |
| 2015-09-27 04:15:00 | 11.139 |
| 2015-09-27 04:30:00 | 11.139 |
| 2015-09-27 04:45:00 | 11.139 |
| 2015-09-27 05:00:00 | 11.139 |
| 2015-09-27 05:15:00 | 11.139 |
| 2015-09-27 05:30:00 | 11.139 |
| 2015-09-27 05:45:00 | 11.139 |
| 2015-09-27 06:00:00 | 11.139 |
| 2015-09-27 06:15:00 | 11.139 |
| 2015-09-27 06:30:00 | 11.139 |
| 2015-09-27 06:45:00 | 11.139 |
| 2015-09-27 07:00:00 | 11.139 |
| 2015-09-27 07:15:00 | 11.139 |
| 2015-09-27 07:30:00 | 11.139 |
| 2015-09-27 07:45:00 | 11.139 |
| 2015-09-27 08:00:00 | 11.139 |
| 2015-09-27 08:15:00 | 11.139 |
| 2015-09-27 08:30:00 | 11.139 |
| 2015-09-27 08:45:00 | 11.236 |
| 2015-09-27 09:00:00 | 11.236 |
| 2015-09-27 09:15:00 | 11.236 |
| 2015-09-27 09:30:00 | 11.236 |
| 2015-09-27 09:45:00 | 11.236 |
| 2015-09-27 10:00:00 | 11.236 |
| 2015-09-27 10:15:00 | 11.334 |
| 2015-09-27 10:30:00 | 11.334 |
| 2015-09-27 10:45:00 | 11.334 |
| 2015-09-27 11:00:00 | 11.334 |
| 2015-09-27 11:15:00 | 11.431 |
| 2015-09-27 11:30:00 | 11.431 |
| 2015-09-27 11:45:00 | 11.431 |
| 2015-09-27 12:00:00 | 11.431 |
| 2015-09-27 12:15:00 | 11.431 |
| 2015-09-27 12:30:00 | 11.528 |
| 2015-09-27 12:45:00 | 11.528 |
| 2015-09-27 13:00:00 | 11.528 |
| 2015-09-27 13:15:00 | 11.528 |
| 2015-09-27 13:30:00 | 11.528 |
| 2015-09-27 13:45:00 | 11.528 |
| 2015-09-27 14:00:00 | 11.528 |
| 2015-09-27 14:15:00 | 11.625 |
| 2015-09-27 14:30:00 | 11.625 |
| 2015-09-27 14:45:00 | 11.625 |
| 2015-09-27 15:00:00 | 11.625 |
| 2015-09-27 15:15:00 | 11.625 |
| 2015-09-27 15:30:00 | 11.625 |
| 2015-09-27 15:45:00 | 11.625 |
| 2015-09-27 16:00:00 | 11.528 |
| 2015-09-27 16:15:00 | 11.528 |
| 2015-09-27 16:30:00 | 11.625 |
| 2015-09-27 16:45:00 | 11.528 |
| 2015-09-27 17:00:00 | 11.528 |
| 2015-09-27 17:15:00 | 11.528 |
| 2015-09-27 17:30:00 | 11.528 |
| 2015-09-27 17:45:00 | 11.528 |
| 2015-09-27 18:00:00 | 11.528 |
| 2015-09-27 18:15:00 | 11.528 |
| 2015-09-27 18:30:00 | 11.528 |
| 2015-09-27 18:45:00 | 11.528 |
| 2015-09-27 19:00:00 | 11.431 |
| 2015-09-27 19:15:00 | 11.431 |
| 2015-09-27 19:30:00 | 11.431 |
| 2015-09-27 19:45:00 | 11.431 |
| 2015-09-27 20:00:00 | 11.431 |
| 2015-09-27 20:15:00 | 11.431 |
| 2015-09-27 20:30:00 | 11.334 |
| 2015-09-27 20:45:00 | 11.334 |
| 2015-09-27 21:00:00 | 11.334 |
| 2015-09-27 21:15:00 | 11.334 |
| 2015-09-27 21:30:00 | 11.334 |
| 2015-09-27 21:45:00 | 11.334 |
| 2015-09-27 22:00:00 | 11.334 |
| 2015-09-27 22:15:00 | 11.334 |
| 2015-09-27 22:30:00 | 11.334 |
| 2015-09-27 22:45:00 | 11.236 |
| 2015-09-27 23:00:00 | 11.236 |
| 2015-09-27 23:15:00 | 11.236 |
| 2015-09-27 23:30:00 | 11.236 |
| 2015-09-27 23:45:00 | 11.236 |
| 2015-09-28 | 11.236 |
| 2015-09-28 00:15:00 | 11.236 |
| 2015-09-28 00:30:00 | 11.236 |
| 2015-09-28 00:45:00 | 11.236 |
| 2015-09-28 01:00:00 | 11.236 |
| 2015-09-28 01:15:00 | 11.236 |
| 2015-09-28 01:30:00 | 11.236 |
| 2015-09-28 01:45:00 | 11.236 |
| 2015-09-28 02:00:00 | 11.236 |
| 2015-09-28 02:15:00 | 11.236 |
| 2015-09-28 02:30:00 | 11.139 |
| 2015-09-28 02:45:00 | 11.139 |
| 2015-09-28 03:00:00 | 11.139 |
| 2015-09-28 03:15:00 | 11.139 |
| 2015-09-28 03:30:00 | 11.139 |
| 2015-09-28 03:45:00 | 11.139 |
| 2015-09-28 04:00:00 | 11.139 |
| 2015-09-28 04:15:00 | 11.139 |
| 2015-09-28 04:30:00 | 11.139 |
| 2015-09-28 04:45:00 | 11.139 |
| 2015-09-28 05:00:00 | 11.139 |
| 2015-09-28 05:15:00 | 11.139 |
| 2015-09-28 05:30:00 | 11.139 |
| 2015-09-28 05:45:00 | 11.139 |
| 2015-09-28 06:00:00 | 11.139 |
| 2015-09-28 06:15:00 | 11.139 |
| 2015-09-28 06:30:00 | 11.139 |
| 2015-09-28 06:45:00 | 11.139 |
| 2015-09-28 07:00:00 | 11.139 |
| 2015-09-28 07:15:00 | 11.139 |
| 2015-09-28 07:30:00 | 11.139 |
| 2015-09-28 07:45:00 | 11.139 |
| 2015-09-28 08:00:00 | 11.236 |
| 2015-09-28 08:15:00 | 11.236 |
| 2015-09-28 08:30:00 | 11.236 |
| 2015-09-28 08:45:00 | 11.236 |
| 2015-09-28 09:00:00 | 11.236 |
| 2015-09-28 09:15:00 | 11.236 |
| 2015-09-28 09:30:00 | 11.236 |
| 2015-09-28 09:45:00 | 11.236 |
| 2015-09-28 10:00:00 | 11.334 |
| 2015-09-28 10:15:00 | 11.334 |
| 2015-09-28 10:30:00 | 11.334 |
| 2015-09-28 10:45:00 | 11.334 |
| 2015-09-28 11:00:00 | 11.431 |
| 2015-09-28 11:15:00 | 11.431 |
| 2015-09-28 11:30:00 | 11.431 |
| 2015-09-28 11:45:00 | 11.431 |
| 2015-09-28 12:00:00 | 11.431 |
| 2015-09-28 12:15:00 | 11.431 |
| 2015-09-28 12:30:00 | 11.528 |
| 2015-09-28 12:45:00 | 11.528 |
| 2015-09-28 13:00:00 | 11.528 |
| 2015-09-28 13:15:00 | 11.528 |
| 2015-09-28 13:30:00 | 11.528 |
| 2015-09-28 13:45:00 | 11.528 |
| 2015-09-28 14:00:00 | 11.528 |
| 2015-09-28 14:15:00 | 11.625 |
| 2015-09-28 14:30:00 | 11.625 |
| 2015-09-28 14:45:00 | 11.625 |
| 2015-09-28 15:00:00 | 11.625 |
| 2015-09-28 15:15:00 | 11.625 |
| 2015-09-28 15:30:00 | 11.625 |
| 2015-09-28 15:45:00 | 11.625 |
| 2015-09-28 16:00:00 | 11.625 |
| 2015-09-28 16:15:00 | 11.625 |
| 2015-09-28 16:30:00 | 11.625 |
| 2015-09-28 16:45:00 | 11.625 |
| 2015-09-28 17:00:00 | 11.528 |
| 2015-09-28 17:15:00 | 11.528 |
| 2015-09-28 17:30:00 | 11.528 |
| 2015-09-28 17:45:00 | 11.528 |
| 2015-09-28 18:00:00 | 11.528 |
| 2015-09-28 18:15:00 | 11.528 |
| 2015-09-28 18:30:00 | 11.528 |
| 2015-09-28 18:45:00 | 11.528 |
| 2015-09-28 19:00:00 | 11.528 |
| 2015-09-28 19:15:00 | 11.528 |
| 2015-09-28 19:30:00 | 11.431 |
| 2015-09-28 19:45:00 | 11.431 |
| 2015-09-28 20:00:00 | 11.431 |
| 2015-09-28 20:15:00 | 11.431 |
| 2015-09-28 20:30:00 | 11.431 |
| 2015-09-28 20:45:00 | 11.431 |
| 2015-09-28 21:00:00 | 11.431 |
| 2015-09-28 21:15:00 | 11.334 |
| 2015-09-28 21:30:00 | 11.334 |
| 2015-09-28 21:45:00 | 11.334 |
| 2015-09-28 22:00:00 | 11.334 |
| 2015-09-28 22:15:00 | 11.334 |
| 2015-09-28 22:30:00 | 11.334 |
| 2015-09-28 22:45:00 | 11.334 |
| 2015-09-28 23:00:00 | 11.334 |
| 2015-09-28 23:15:00 | 11.334 |
| 2015-09-28 23:30:00 | 11.334 |
| 2015-09-28 23:45:00 | 11.334 |
| 2015-09-29 | 11.334 |
| 2015-09-29 00:15:00 | 11.334 |
| 2015-09-29 00:30:00 | 11.334 |
| 2015-09-29 00:45:00 | 11.334 |
| 2015-09-29 01:00:00 | 11.334 |
| 2015-09-29 01:15:00 | 11.334 |
| 2015-09-29 01:30:00 | 11.334 |
| 2015-09-29 01:45:00 | 11.236 |
| 2015-09-29 02:00:00 | 11.236 |
| 2015-09-29 02:15:00 | 11.236 |
| 2015-09-29 02:30:00 | 11.236 |
| 2015-09-29 02:45:00 | 11.236 |
| 2015-09-29 03:00:00 | 11.236 |
| 2015-09-29 03:15:00 | 11.236 |
| 2015-09-29 03:30:00 | 11.139 |
| 2015-09-29 03:45:00 | 11.139 |
| 2015-09-29 04:00:00 | 11.139 |
| 2015-09-29 04:15:00 | 11.139 |
| 2015-09-29 04:30:00 | 11.139 |
| 2015-09-29 04:45:00 | 11.139 |
| 2015-09-29 05:00:00 | 11.139 |
| 2015-09-29 05:15:00 | 11.139 |
| 2015-09-29 05:30:00 | 11.139 |
| 2015-09-29 05:45:00 | 11.139 |
| 2015-09-29 06:00:00 | 11.236 |
| 2015-09-29 06:15:00 | 11.236 |
| 2015-09-29 06:30:00 | 11.139 |
| 2015-09-29 06:45:00 | 11.139 |
| 2015-09-29 07:00:00 | 11.139 |
| 2015-09-29 07:15:00 | 11.139 |
| 2015-09-29 07:30:00 | 11.139 |
| 2015-09-29 07:45:00 | 11.139 |
| 2015-09-29 08:00:00 | 11.139 |
| 2015-09-29 08:15:00 | 11.236 |
| 2015-09-29 08:30:00 | 11.236 |
| 2015-09-29 08:45:00 | 11.236 |
| 2015-09-29 09:00:00 | 11.236 |
| 2015-09-29 09:15:00 | 11.236 |
| 2015-09-29 09:30:00 | 11.236 |
| 2015-09-29 09:45:00 | 11.334 |
| 2015-09-29 10:00:00 | 11.334 |
| 2015-09-29 10:15:00 | 11.334 |
| 2015-09-29 10:30:00 | 11.334 |
| 2015-09-29 10:45:00 | 11.334 |
| 2015-09-29 11:00:00 | 11.431 |
| 2015-09-29 11:15:00 | 11.431 |
| 2015-09-29 11:30:00 | 11.431 |
| 2015-09-29 11:45:00 | 11.431 |
| 2015-09-29 12:00:00 | 11.431 |
| 2015-09-29 12:15:00 | 11.431 |
| 2015-09-29 12:30:00 | 11.528 |
| 2015-09-29 12:45:00 | 11.528 |
| 2015-09-29 13:00:00 | 11.528 |
| 2015-09-29 13:15:00 | 11.528 |
| 2015-09-29 13:30:00 | 11.528 |
| 2015-09-29 13:45:00 | 11.528 |
| 2015-09-29 14:00:00 | 11.625 |
| 2015-09-29 14:15:00 | 11.625 |
| 2015-09-29 14:30:00 | 11.625 |
| 2015-09-29 14:45:00 | 11.625 |
| 2015-09-29 15:00:00 | 11.625 |
| 2015-09-29 15:15:00 | 11.625 |
| 2015-09-29 15:30:00 | 11.625 |
| 2015-09-29 15:45:00 | 11.625 |
| 2015-09-29 16:00:00 | 11.625 |
| 2015-09-29 16:15:00 | 11.625 |
| 2015-09-29 16:30:00 | 11.528 |
| 2015-09-29 16:45:00 | 11.528 |
| 2015-09-29 17:00:00 | 11.528 |
| 2015-09-29 17:15:00 | 11.528 |
| 2015-09-29 17:30:00 | 11.528 |
| 2015-09-29 17:45:00 | 11.528 |
| 2015-09-29 18:00:00 | 11.528 |
| 2015-09-29 18:15:00 | 11.528 |
| 2015-09-29 18:30:00 | 11.528 |
| 2015-09-29 18:45:00 | 11.528 |
| 2015-09-29 19:00:00 | 11.528 |
| 2015-09-29 19:15:00 | 11.431 |
| 2015-09-29 19:30:00 | 11.431 |
| 2015-09-29 19:45:00 | 11.431 |
| 2015-09-29 20:00:00 | 11.431 |
| 2015-09-29 20:15:00 | 11.431 |
| 2015-09-29 20:30:00 | 11.431 |
| 2015-09-29 20:45:00 | 11.334 |
| 2015-09-29 21:00:00 | 11.334 |
| 2015-09-29 21:15:00 | 11.334 |
| 2015-09-29 21:30:00 | 11.334 |
| 2015-09-29 21:45:00 | 11.334 |
| 2015-09-29 22:00:00 | 11.334 |
| 2015-09-29 22:15:00 | 11.334 |
| 2015-09-29 22:30:00 | 11.334 |
| 2015-09-29 22:45:00 | 11.334 |
| 2015-09-29 23:00:00 | 11.334 |
| 2015-09-29 23:15:00 | 11.334 |
| 2015-09-29 23:30:00 | 11.334 |
| 2015-09-29 23:45:00 | 11.334 |
| 2015-09-30 | 11.334 |
| 2015-09-30 00:15:00 | 11.334 |
| 2015-09-30 00:30:00 | 11.334 |
| 2015-09-30 00:45:00 | 11.334 |
| 2015-09-30 01:00:00 | 11.334 |
| 2015-09-30 01:15:00 | 11.334 |
| 2015-09-30 01:30:00 | 11.334 |
| 2015-09-30 01:45:00 | 11.236 |
| 2015-09-30 02:00:00 | 11.236 |
| 2015-09-30 02:15:00 | 11.334 |
| 2015-09-30 02:30:00 | 11.236 |
| 2015-09-30 02:45:00 | 11.236 |
| 2015-09-30 03:00:00 | 11.236 |
| 2015-09-30 03:15:00 | 11.236 |
| 2015-09-30 03:30:00 | 11.236 |
| 2015-09-30 03:45:00 | 11.236 |
| 2015-09-30 04:00:00 | 11.236 |
| 2015-09-30 04:15:00 | 11.236 |
| 2015-09-30 04:30:00 | 11.236 |
| 2015-09-30 04:45:00 | 11.236 |
| 2015-09-30 05:00:00 | 11.236 |
| 2015-09-30 05:15:00 | 11.236 |
| 2015-09-30 05:30:00 | 11.236 |
| 2015-09-30 05:45:00 | 11.236 |
| 2015-09-30 06:00:00 | 11.236 |
| 2015-09-30 06:15:00 | 11.236 |
| 2015-09-30 06:30:00 | 11.236 |
| 2015-09-30 06:45:00 | 11.236 |
| 2015-09-30 07:00:00 | 11.236 |
| 2015-09-30 07:15:00 | 11.236 |
| 2015-09-30 07:30:00 | 11.236 |
| 2015-09-30 07:45:00 | 11.236 |
| 2015-09-30 08:00:00 | 11.236 |
| 2015-09-30 08:15:00 | 11.236 |
| 2015-09-30 08:30:00 | 11.236 |
| 2015-09-30 08:45:00 | 11.236 |
| 2015-09-30 09:00:00 | 11.236 |
| 2015-09-30 09:15:00 | 11.236 |
| 2015-09-30 09:30:00 | 11.334 |
| 2015-09-30 09:45:00 | 11.334 |
| 2015-09-30 10:00:00 | 11.334 |
| 2015-09-30 10:15:00 | 11.334 |
| 2015-09-30 10:30:00 | 11.334 |
| 2015-09-30 10:45:00 | 11.431 |
| 2015-09-30 11:00:00 | 11.431 |
| 2015-09-30 11:15:00 | 11.431 |
| 2015-09-30 11:30:00 | 11.431 |
| 2015-09-30 11:45:00 | 11.431 |
| 2015-09-30 12:00:00 | 11.431 |
| 2015-09-30 12:15:00 | 11.431 |
| 2015-09-30 12:30:00 | 11.528 |
| 2015-09-30 12:45:00 | 11.528 |
| 2015-09-30 13:00:00 | 11.528 |
| 2015-09-30 13:15:00 | 11.528 |
| 2015-09-30 13:30:00 | 11.528 |
| 2015-09-30 13:45:00 | 11.528 |
| 2015-09-30 14:00:00 | 11.528 |
| 2015-09-30 14:15:00 | 11.625 |
| 2015-09-30 14:30:00 | 11.625 |
| 2015-09-30 14:45:00 | 11.625 |
| 2015-09-30 15:00:00 | 11.625 |
| 2015-09-30 15:15:00 | 11.625 |
| 2015-09-30 15:30:00 | 11.625 |
| 2015-09-30 15:45:00 | 11.625 |
| 2015-09-30 16:00:00 | 11.528 |
| 2015-09-30 16:15:00 | 11.528 |
| 2015-09-30 16:30:00 | 11.528 |
| 2015-09-30 16:45:00 | 11.528 |
| 2015-09-30 17:00:00 | 11.528 |
| 2015-09-30 17:15:00 | 11.528 |
| 2015-09-30 17:30:00 | 11.528 |
| 2015-09-30 17:45:00 | 11.528 |
| 2015-09-30 18:00:00 | 11.528 |
| 2015-09-30 18:15:00 | 11.528 |
| 2015-09-30 18:30:00 | 11.528 |
| 2015-09-30 18:45:00 | 11.431 |
| 2015-09-30 19:00:00 | 11.431 |
| 2015-09-30 19:15:00 | 11.431 |
| 2015-09-30 19:30:00 | 11.431 |
| 2015-09-30 19:45:00 | 11.431 |
| 2015-09-30 20:00:00 | 11.334 |
| 2015-09-30 20:15:00 | 11.334 |
| 2015-09-30 20:30:00 | 11.334 |
| 2015-09-30 20:45:00 | 11.334 |
| 2015-09-30 21:00:00 | 11.334 |
| 2015-09-30 21:15:00 | 11.334 |
| 2015-09-30 21:30:00 | 11.334 |
| 2015-09-30 21:45:00 | 11.334 |
| 2015-09-30 22:00:00 | 11.236 |
| 2015-09-30 22:15:00 | 11.236 |
| 2015-09-30 22:30:00 | 11.236 |
| 2015-09-30 22:45:00 | 11.236 |
| 2015-09-30 23:00:00 | 11.236 |
| 2015-09-30 23:15:00 | 11.236 |
| 2015-09-30 23:30:00 | 11.236 |
| 2015-09-30 23:45:00 | 11.236 |
| 2015-10-01 | 11.236 |
| 2015-10-01 00:15:00 | 11.236 |
| 2015-10-01 00:30:00 | 11.236 |
| 2015-10-01 00:45:00 | 11.236 |
| 2015-10-01 01:00:00 | 11.236 |
| 2015-10-01 01:15:00 | 11.236 |
| 2015-10-01 01:30:00 | 11.236 |
| 2015-10-01 01:45:00 | 11.236 |
| 2015-10-01 02:00:00 | 11.236 |
| 2015-10-01 02:15:00 | 11.236 |
| 2015-10-01 02:30:00 | 11.236 |
| 2015-10-01 02:45:00 | 11.236 |
| 2015-10-01 03:00:00 | 11.236 |
| 2015-10-01 03:15:00 | 11.236 |
| 2015-10-01 03:30:00 | 11.236 |
| 2015-10-01 03:45:00 | 11.236 |
| 2015-10-01 04:00:00 | 11.236 |
| 2015-10-01 04:15:00 | 11.139 |
| 2015-10-01 04:30:00 | 11.236 |
| 2015-10-01 04:45:00 | 11.236 |
| 2015-10-01 05:00:00 | 11.236 |
| 2015-10-01 05:15:00 | 11.236 |
| 2015-10-01 05:30:00 | 11.236 |
| 2015-10-01 05:45:00 | 11.236 |
| 2015-10-01 06:00:00 | 11.236 |
| 2015-10-01 06:15:00 | 11.236 |
| 2015-10-01 06:30:00 | 11.139 |
| 2015-10-01 06:45:00 | 11.139 |
| 2015-10-01 07:00:00 | 11.139 |
| 2015-10-01 07:15:00 | 11.139 |
| 2015-10-01 07:30:00 | 11.139 |
| 2015-10-01 07:45:00 | 11.139 |
| 2015-10-01 08:00:00 | 11.139 |
| 2015-10-01 08:15:00 | 11.139 |
| 2015-10-01 08:30:00 | 11.236 |
| 2015-10-01 08:45:00 | 11.236 |
| 2015-10-01 09:00:00 | 11.236 |
| 2015-10-01 09:15:00 | 11.236 |
| 2015-10-01 09:30:00 | 11.236 |
| 2015-10-01 09:45:00 | 11.236 |
| 2015-10-01 10:00:00 | 11.334 |
| 2015-10-01 10:15:00 | 11.334 |
| 2015-10-01 10:30:00 | 11.334 |
| 2015-10-01 10:45:00 | 11.334 |
| 2015-10-01 11:00:00 | 11.334 |
| 2015-10-01 11:15:00 | 11.431 |
| 2015-10-01 11:30:00 | 11.431 |
| 2015-10-01 11:45:00 | 11.431 |
| 2015-10-01 12:00:00 | 11.431 |
| 2015-10-01 12:15:00 | 11.431 |
| 2015-10-01 12:30:00 | 11.431 |
| 2015-10-01 12:45:00 | 11.528 |
| 2015-10-01 13:00:00 | 11.528 |
| 2015-10-01 13:15:00 | 11.528 |
| 2015-10-01 13:30:00 | 11.528 |
| 2015-10-01 13:45:00 | 11.528 |
| 2015-10-01 14:00:00 | 11.528 |
| 2015-10-01 14:15:00 | 11.528 |
| 2015-10-01 14:30:00 | 11.528 |
| 2015-10-01 14:45:00 | 11.625 |
| 2015-10-01 15:00:00 | 11.625 |
| 2015-10-01 15:15:00 | 11.625 |
| 2015-10-01 15:30:00 | 11.625 |
| 2015-10-01 15:45:00 | 11.528 |
| 2015-10-01 16:00:00 | 11.528 |
| 2015-10-01 16:15:00 | 11.528 |
| 2015-10-01 16:30:00 | 11.528 |
| 2015-10-01 16:45:00 | 11.528 |
| 2015-10-01 17:00:00 | 11.528 |
| 2015-10-01 17:15:00 | 11.528 |
| 2015-10-01 17:30:00 | 11.528 |
| 2015-10-01 17:45:00 | 11.528 |
| 2015-10-01 18:00:00 | 11.528 |
| 2015-10-01 18:15:00 | 11.528 |
| 2015-10-01 18:30:00 | 11.528 |
| 2015-10-01 18:45:00 | 11.431 |
| 2015-10-01 19:00:00 | 11.431 |
| 2015-10-01 19:15:00 | 11.431 |
| 2015-10-01 19:30:00 | 11.431 |
| 2015-10-01 19:45:00 | 11.431 |
| 2015-10-01 20:00:00 | 11.334 |
| 2015-10-01 20:15:00 | 11.334 |
| 2015-10-01 20:30:00 | 11.334 |
| 2015-10-01 20:45:00 | 11.334 |
| 2015-10-01 21:00:00 | 11.334 |
| 2015-10-01 21:15:00 | 11.236 |
| 2015-10-01 21:30:00 | 11.236 |
| 2015-10-01 21:45:00 | 11.236 |
| 2015-10-01 22:00:00 | 11.236 |
| 2015-10-01 22:15:00 | 11.236 |
| 2015-10-01 22:30:00 | 11.236 |
| 2015-10-01 22:45:00 | 11.236 |
| 2015-10-01 23:00:00 | 11.236 |
| 2015-10-01 23:15:00 | 11.236 |
| 2015-10-01 23:30:00 | 11.236 |
| 2015-10-01 23:45:00 | 11.236 |
| 2015-10-02 | 11.236 |
| 2015-10-02 00:15:00 | 11.236 |
| 2015-10-02 00:30:00 | 11.236 |
| 2015-10-02 00:45:00 | 11.236 |
| 2015-10-02 01:00:00 | 11.236 |
| 2015-10-02 01:15:00 | 11.236 |
| 2015-10-02 01:30:00 | 11.236 |
| 2015-10-02 01:45:00 | 11.139 |
| 2015-10-02 02:00:00 | 11.139 |
| 2015-10-02 02:15:00 | 11.139 |
| 2015-10-02 02:30:00 | 11.139 |
| 2015-10-02 02:45:00 | 11.139 |
| 2015-10-02 03:00:00 | 11.139 |
| 2015-10-02 03:15:00 | 11.139 |
| 2015-10-02 03:30:00 | 11.139 |
| 2015-10-02 03:45:00 | 11.139 |
| 2015-10-02 04:00:00 | 11.139 |
| 2015-10-02 04:15:00 | 11.139 |
| 2015-10-02 04:30:00 | 11.139 |
| 2015-10-02 04:45:00 | 11.139 |
| 2015-10-02 05:00:00 | 11.139 |
| 2015-10-02 05:15:00 | 11.139 |
| 2015-10-02 05:30:00 | 11.139 |
| 2015-10-02 05:45:00 | 11.139 |
| 2015-10-02 06:00:00 | 11.139 |
| 2015-10-02 06:15:00 | 11.139 |
| 2015-10-02 06:30:00 | 11.139 |
| 2015-10-02 06:45:00 | 11.139 |
| 2015-10-02 07:00:00 | 11.139 |
| 2015-10-02 07:15:00 | 11.139 |
| 2015-10-02 07:30:00 | 11.139 |
| 2015-10-02 07:45:00 | 11.139 |
| 2015-10-02 08:00:00 | 11.139 |
| 2015-10-02 08:15:00 | 11.236 |
| 2015-10-02 08:30:00 | 11.236 |
| 2015-10-02 08:45:00 | 11.236 |
| 2015-10-02 09:00:00 | 11.236 |
| 2015-10-02 09:15:00 | 11.236 |
| 2015-10-02 09:30:00 | 11.236 |
| 2015-10-02 09:45:00 | 11.236 |
| 2015-10-02 10:00:00 | 11.334 |
| 2015-10-02 10:15:00 | 11.334 |
| 2015-10-02 10:30:00 | 11.334 |
| 2015-10-02 10:45:00 | 11.334 |
| 2015-10-02 11:00:00 | 11.334 |
| 2015-10-02 11:15:00 | 11.431 |
| 2015-10-02 11:30:00 | 11.431 |
| 2015-10-02 11:45:00 | 11.431 |
| 2015-10-02 12:00:00 | 11.431 |
| 2015-10-02 12:15:00 | 11.431 |
| 2015-10-02 12:30:00 | 11.431 |
| 2015-10-02 12:45:00 | 11.528 |
| 2015-10-02 13:00:00 | 11.528 |
| 2015-10-02 13:15:00 | 11.528 |
| 2015-10-02 13:30:00 | 11.528 |
| 2015-10-02 13:45:00 | 11.528 |
| 2015-10-02 14:00:00 | 11.528 |
| 2015-10-02 14:15:00 | 11.528 |
| 2015-10-02 14:30:00 | 11.625 |
| 2015-10-02 14:45:00 | 11.528 |
| 2015-10-02 15:00:00 | 11.625 |
| 2015-10-02 15:15:00 | 11.625 |
| 2015-10-02 15:30:00 | 11.625 |
| 2015-10-02 15:45:00 | 11.528 |
| 2015-10-02 16:00:00 | 11.625 |
| 2015-10-02 16:15:00 | 11.528 |
| 2015-10-02 16:30:00 | 11.528 |
| 2015-10-02 16:45:00 | 11.528 |
| 2015-10-02 17:00:00 | 11.528 |
| 2015-10-02 17:15:00 | 11.528 |
| 2015-10-02 17:30:00 | 11.528 |
| 2015-10-02 17:45:00 | 11.528 |
| 2015-10-02 18:00:00 | 11.528 |
| 2015-10-02 18:15:00 | 11.528 |
| 2015-10-02 18:30:00 | 11.528 |
| 2015-10-02 18:45:00 | 11.528 |
| 2015-10-02 19:00:00 | 11.431 |
| 2015-10-02 19:15:00 | 11.431 |
| 2015-10-02 19:30:00 | 11.431 |
| 2015-10-02 19:45:00 | 11.431 |
| 2015-10-02 20:00:00 | 11.334 |
| 2015-10-02 20:15:00 | 11.334 |
| 2015-10-02 20:30:00 | 11.334 |
| 2015-10-02 20:45:00 | 11.334 |
| 2015-10-02 21:00:00 | 11.334 |
| 2015-10-02 21:15:00 | 11.236 |
| 2015-10-02 21:30:00 | 11.236 |
| 2015-10-02 21:45:00 | 11.236 |
| 2015-10-02 22:00:00 | 11.236 |
| 2015-10-02 22:15:00 | 11.236 |
| 2015-10-02 22:30:00 | 11.236 |
| 2015-10-02 22:45:00 | 11.236 |
| 2015-10-02 23:00:00 | 11.139 |
| 2015-10-02 23:15:00 | 11.139 |
| 2015-10-02 23:30:00 | 11.139 |
| 2015-10-02 23:45:00 | 11.139 |
| 2015-10-03 | 11.139 |
| 2015-10-03 00:15:00 | 11.139 |
| 2015-10-03 00:30:00 | 11.139 |
| 2015-10-03 00:45:00 | 11.139 |
| 2015-10-03 01:00:00 | 11.139 |
| 2015-10-03 01:15:00 | 11.139 |
| 2015-10-03 01:30:00 | 11.139 |
| 2015-10-03 01:45:00 | 11.139 |
| 2015-10-03 02:00:00 | 11.139 |
| 2015-10-03 02:15:00 | 11.139 |
| 2015-10-03 02:30:00 | 11.139 |
| 2015-10-03 02:45:00 | 11.139 |
| 2015-10-03 03:00:00 | 11.139 |
| 2015-10-03 03:15:00 | 11.139 |
| 2015-10-03 03:30:00 | 11.139 |
| 2015-10-03 03:45:00 | 11.139 |
| 2015-10-03 04:00:00 | 11.139 |
| 2015-10-03 04:15:00 | 11.139 |
| 2015-10-03 04:30:00 | 11.041 |
| 2015-10-03 04:45:00 | 11.041 |
| 2015-10-03 05:00:00 | 11.041 |
| 2015-10-03 05:15:00 | 11.041 |
| 2015-10-03 05:30:00 | 11.041 |
| 2015-10-03 05:45:00 | 11.041 |
| 2015-10-03 06:00:00 | 11.041 |
| 2015-10-03 06:15:00 | 11.041 |
| 2015-10-03 06:30:00 | 11.139 |
| 2015-10-03 06:45:00 | 11.139 |
| 2015-10-03 07:00:00 | 11.139 |
| 2015-10-03 07:15:00 | 11.139 |
| 2015-10-03 07:30:00 | 11.139 |
| 2015-10-03 07:45:00 | 11.139 |
| 2015-10-03 08:00:00 | 11.139 |
| 2015-10-03 08:15:00 | 11.139 |
| 2015-10-03 08:30:00 | 11.139 |
| 2015-10-03 08:45:00 | 11.139 |
| 2015-10-03 09:00:00 | 11.139 |
| 2015-10-03 09:15:00 | 11.139 |
| 2015-10-03 09:30:00 | 11.236 |
| 2015-10-03 09:45:00 | 11.236 |
| 2015-10-03 10:00:00 | 11.236 |
| 2015-10-03 10:15:00 | 11.236 |
| 2015-10-03 10:30:00 | 11.334 |
| 2015-10-03 10:45:00 | 11.334 |
| 2015-10-03 11:00:00 | 11.334 |
| 2015-10-03 11:15:00 | 11.334 |
| 2015-10-03 11:30:00 | 11.334 |
| 2015-10-03 11:45:00 | 11.431 |
| 2015-10-03 12:00:00 | 11.431 |
| 2015-10-03 12:15:00 | 11.431 |
| 2015-10-03 12:30:00 | 11.431 |
| 2015-10-03 12:45:00 | 11.431 |
| 2015-10-03 13:00:00 | 11.431 |
| 2015-10-03 13:15:00 | 11.431 |
| 2015-10-03 13:30:00 | 11.431 |
| 2015-10-03 13:45:00 | 11.528 |
| 2015-10-03 14:00:00 | 11.528 |
| 2015-10-03 14:15:00 | 11.528 |
| 2015-10-03 14:30:00 | 11.528 |
| 2015-10-03 14:45:00 | 11.528 |
| 2015-10-03 15:00:00 | 11.528 |
| 2015-10-03 15:15:00 | 11.528 |
| 2015-10-03 15:30:00 | 11.528 |
| 2015-10-03 15:45:00 | 11.528 |
| 2015-10-03 16:00:00 | 11.528 |
| 2015-10-03 16:15:00 | 11.528 |
| 2015-10-03 16:30:00 | 11.528 |
| 2015-10-03 16:45:00 | 11.528 |
| 2015-10-03 17:00:00 | 11.528 |
| 2015-10-03 17:15:00 | 11.528 |
| 2015-10-03 17:30:00 | 11.528 |
| 2015-10-03 17:45:00 | 11.431 |
| 2015-10-03 18:00:00 | 11.431 |
| 2015-10-03 18:15:00 | 11.431 |
| 2015-10-03 18:30:00 | 11.431 |
| 2015-10-03 18:45:00 | 11.431 |
| 2015-10-03 19:00:00 | 11.431 |
| 2015-10-03 19:15:00 | 11.334 |
| 2015-10-03 19:30:00 | 11.334 |
| 2015-10-03 19:45:00 | 11.334 |
| 2015-10-03 20:00:00 | 11.334 |
| 2015-10-03 20:15:00 | 11.236 |
| 2015-10-03 20:30:00 | 11.236 |
| 2015-10-03 20:45:00 | 11.236 |
| 2015-10-03 21:00:00 | 11.236 |
| 2015-10-03 21:15:00 | 11.236 |
| 2015-10-03 21:30:00 | 11.139 |
| 2015-10-03 21:45:00 | 11.139 |
| 2015-10-03 22:00:00 | 11.139 |
| 2015-10-03 22:15:00 | 11.139 |
| 2015-10-03 22:30:00 | 11.139 |
| 2015-10-03 22:45:00 | 11.139 |
| 2015-10-03 23:00:00 | 11.139 |
| 2015-10-03 23:15:00 | 11.139 |
| 2015-10-03 23:30:00 | 11.139 |
| 2015-10-03 23:45:00 | 11.139 |
| 2015-10-04 | 11.139 |
| 2015-10-04 00:15:00 | 11.139 |
| 2015-10-04 00:30:00 | 11.139 |
| 2015-10-04 00:45:00 | 11.139 |
| 2015-10-04 01:00:00 | 11.139 |
| 2015-10-04 01:15:00 | 11.139 |
| 2015-10-04 01:30:00 | 11.139 |
| 2015-10-04 01:45:00 | 11.139 |
| 2015-10-04 02:00:00 | 11.139 |
| 2015-10-04 02:15:00 | 11.139 |
| 2015-10-04 02:30:00 | 11.139 |
| 2015-10-04 02:45:00 | 11.139 |
| 2015-10-04 03:00:00 | 11.139 |
| 2015-10-04 03:15:00 | 11.139 |
| 2015-10-04 03:30:00 | 11.139 |
| 2015-10-04 03:45:00 | 11.139 |
| 2015-10-04 04:00:00 | 11.139 |
| 2015-10-04 04:15:00 | 11.139 |
| 2015-10-04 04:30:00 | 11.139 |
| 2015-10-04 04:45:00 | 11.139 |
| 2015-10-04 05:00:00 | 11.139 |
| 2015-10-04 05:15:00 | 11.139 |
| 2015-10-04 05:30:00 | 11.139 |
| 2015-10-04 05:45:00 | 11.139 |
| 2015-10-04 06:00:00 | 11.139 |
| 2015-10-04 06:15:00 | 11.041 |
| 2015-10-04 06:30:00 | 11.041 |
| 2015-10-04 06:45:00 | 11.139 |
| 2015-10-04 07:00:00 | 11.139 |
| 2015-10-04 07:15:00 | 11.139 |
| 2015-10-04 07:30:00 | 11.041 |
| 2015-10-04 07:45:00 | 11.041 |
| 2015-10-04 08:00:00 | 11.139 |
| 2015-10-04 08:15:00 | 11.139 |
| 2015-10-04 08:30:00 | 11.139 |
| 2015-10-04 08:45:00 | 11.139 |
| 2015-10-04 09:00:00 | 11.139 |
| 2015-10-04 09:15:00 | 11.139 |
| 2015-10-04 09:30:00 | 11.139 |
| 2015-10-04 09:45:00 | 11.236 |
| 2015-10-04 10:00:00 | 11.236 |
| 2015-10-04 10:15:00 | 11.236 |
| 2015-10-04 10:30:00 | 11.236 |
| 2015-10-04 10:45:00 | 11.334 |
| 2015-10-04 11:00:00 | 11.334 |
| 2015-10-04 11:15:00 | 11.334 |
| 2015-10-04 11:30:00 | 11.334 |
| 2015-10-04 11:45:00 | 11.431 |
| 2015-10-04 12:00:00 | 11.431 |
| 2015-10-04 12:15:00 | 11.431 |
| 2015-10-04 12:30:00 | 11.431 |
| 2015-10-04 12:45:00 | 11.431 |
| 2015-10-04 13:00:00 | 11.528 |
| 2015-10-04 13:15:00 | 11.528 |
| 2015-10-04 13:30:00 | 11.528 |
| 2015-10-04 13:45:00 | 11.528 |
| 2015-10-04 14:00:00 | 11.528 |
| 2015-10-04 14:15:00 | 11.528 |
| 2015-10-04 14:30:00 | 11.528 |
| 2015-10-04 14:45:00 | 11.528 |
| 2015-10-04 15:00:00 | 11.528 |
| 2015-10-04 15:15:00 | 11.528 |
| 2015-10-04 15:30:00 | 11.528 |
| 2015-10-04 15:45:00 | 11.528 |
| 2015-10-04 16:00:00 | 11.528 |
| 2015-10-04 16:15:00 | 11.528 |
| 2015-10-04 16:30:00 | 11.528 |
| 2015-10-04 16:45:00 | 11.528 |
| 2015-10-04 17:00:00 | 11.528 |
| 2015-10-04 17:15:00 | 11.528 |
| 2015-10-04 17:30:00 | 11.528 |
| 2015-10-04 17:45:00 | 11.528 |
| 2015-10-04 18:00:00 | 11.528 |
| 2015-10-04 18:15:00 | 11.528 |
| 2015-10-04 18:30:00 | 11.431 |
| 2015-10-04 18:45:00 | 11.431 |
| 2015-10-04 19:00:00 | 11.431 |
| 2015-10-04 19:15:00 | 11.431 |
| 2015-10-04 19:30:00 | 11.431 |
| 2015-10-04 19:45:00 | 11.431 |
| 2015-10-04 20:00:00 | 11.431 |
| 2015-10-04 20:15:00 | 11.431 |
| 2015-10-04 20:30:00 | 11.431 |
| 2015-10-04 20:45:00 | 11.431 |
| 2015-10-04 21:00:00 | 11.431 |
| 2015-10-04 21:15:00 | 11.431 |
| 2015-10-04 21:30:00 | 11.431 |
| 2015-10-04 21:45:00 | 11.431 |
| 2015-10-04 22:00:00 | 11.431 |
| 2015-10-04 22:15:00 | 11.431 |
| 2015-10-04 22:30:00 | 11.431 |
| 2015-10-04 22:45:00 | 11.431 |
| 2015-10-04 23:00:00 | 11.431 |
| 2015-10-04 23:15:00 | 11.431 |
| 2015-10-04 23:30:00 | 11.431 |
| 2015-10-04 23:45:00 | 11.431 |
| 2015-10-05 | 11.431 |
| 2015-10-05 00:15:00 | 11.431 |
| 2015-10-05 00:30:00 | 11.431 |
| 2015-10-05 00:45:00 | 11.431 |
| 2015-10-05 01:00:00 | 11.431 |
| 2015-10-05 01:15:00 | 11.431 |
| 2015-10-05 01:30:00 | 11.431 |
| 2015-10-05 01:45:00 | 11.431 |
| 2015-10-05 02:00:00 | 11.431 |
| 2015-10-05 02:15:00 | 11.431 |
| 2015-10-05 02:30:00 | 11.431 |
| 2015-10-05 02:45:00 | 11.431 |
| 2015-10-05 03:00:00 | 11.431 |
| 2015-10-05 03:15:00 | 11.431 |
| 2015-10-05 03:30:00 | 11.431 |
| 2015-10-05 03:45:00 | 11.431 |
| 2015-10-05 04:00:00 | 11.431 |
| 2015-10-05 04:15:00 | 11.431 |
| 2015-10-05 04:30:00 | 11.431 |
| 2015-10-05 04:45:00 | 11.431 |
| 2015-10-05 05:00:00 | 11.431 |
| 2015-10-05 05:15:00 | 11.431 |
| 2015-10-05 05:30:00 | 11.431 |
| 2015-10-05 05:45:00 | 11.431 |
| 2015-10-05 06:00:00 | 11.431 |
| 2015-10-05 06:15:00 | 11.431 |
| 2015-10-05 06:30:00 | 11.431 |
| 2015-10-05 06:45:00 | 11.431 |
| 2015-10-05 07:00:00 | 11.431 |
| 2015-10-05 07:15:00 | 11.431 |
| 2015-10-05 07:30:00 | 11.431 |
| 2015-10-05 07:45:00 | 11.431 |
| 2015-10-05 08:00:00 | 11.431 |
| 2015-10-05 08:15:00 | 11.431 |
| 2015-10-05 08:30:00 | 11.528 |
| 2015-10-05 08:45:00 | 11.528 |
| 2015-10-05 09:00:00 | 11.431 |
| 2015-10-05 09:15:00 | 11.528 |
| 2015-10-05 09:30:00 | 11.528 |
| 2015-10-05 09:45:00 | 11.528 |
| 2015-10-05 10:00:00 | 11.528 |
| 2015-10-05 10:15:00 | 11.528 |
| 2015-10-05 10:30:00 | 11.528 |
| 2015-10-05 10:45:00 | 11.528 |
| 2015-10-05 11:00:00 | 11.528 |
| 2015-10-05 11:15:00 | 11.528 |
| 2015-10-05 11:30:00 | 11.528 |
| 2015-10-05 11:45:00 | 11.528 |
| 2015-10-05 12:00:00 | 11.528 |
| 2015-10-05 12:15:00 | 11.528 |
| 2015-10-05 12:30:00 | 11.528 |
| 2015-10-05 12:45:00 | 11.528 |
| 2015-10-05 13:00:00 | 11.528 |
| 2015-10-05 13:15:00 | 11.528 |
| 2015-10-05 13:30:00 | 11.528 |
| 2015-10-05 13:45:00 | 11.528 |
| 2015-10-05 14:00:00 | 11.528 |
| 2015-10-05 14:15:00 | 11.528 |
| 2015-10-05 14:30:00 | 11.528 |
| 2015-10-05 14:45:00 | 11.528 |
| 2015-10-05 15:00:00 | 11.528 |
| 2015-10-05 15:15:00 | 11.528 |
| 2015-10-05 15:30:00 | 11.528 |
| 2015-10-05 15:45:00 | 11.528 |
| 2015-10-05 16:00:00 | 11.528 |
| 2015-10-05 16:15:00 | 11.528 |
| 2015-10-05 16:30:00 | 11.528 |
| 2015-10-05 16:45:00 | 11.528 |
| 2015-10-05 17:00:00 | 11.528 |
| 2015-10-05 17:15:00 | 11.528 |
| 2015-10-05 17:30:00 | 11.528 |
| 2015-10-05 17:45:00 | 11.528 |
| 2015-10-05 18:00:00 | 11.528 |
| 2015-10-05 18:15:00 | 11.528 |
| 2015-10-05 18:30:00 | 11.528 |
| 2015-10-05 18:45:00 | 11.528 |
| 2015-10-05 19:00:00 | 11.528 |
| 2015-10-05 19:15:00 | 11.528 |
| 2015-10-05 19:30:00 | 11.528 |
| 2015-10-05 19:45:00 | 11.528 |
| 2015-10-05 20:00:00 | 11.528 |
| 2015-10-05 20:15:00 | 11.528 |
| 2015-10-05 20:30:00 | 11.528 |
| 2015-10-05 20:45:00 | 11.528 |
| 2015-10-05 21:00:00 | 11.528 |
| 2015-10-05 21:15:00 | 11.528 |
| 2015-10-05 21:30:00 | 11.528 |
| 2015-10-05 21:45:00 | 11.528 |
| 2015-10-05 22:00:00 | 11.528 |
| 2015-10-05 22:15:00 | 11.528 |
| 2015-10-05 22:30:00 | 11.528 |
| 2015-10-05 22:45:00 | 11.528 |
| 2015-10-05 23:00:00 | 11.528 |
| 2015-10-05 23:15:00 | 11.528 |
| 2015-10-05 23:30:00 | 11.528 |
| 2015-10-05 23:45:00 | 11.528 |
| 2015-10-06 | 11.528 |
| 2015-10-06 00:15:00 | 11.528 |
| 2015-10-06 00:30:00 | 11.528 |
| 2015-10-06 00:45:00 | 11.528 |
| 2015-10-06 01:00:00 | 11.528 |
| 2015-10-06 01:15:00 | 11.528 |
| 2015-10-06 01:30:00 | 11.528 |
| 2015-10-06 01:45:00 | 11.528 |
| 2015-10-06 02:00:00 | 11.528 |
| 2015-10-06 02:15:00 | 11.528 |
| 2015-10-06 02:30:00 | 11.528 |
| 2015-10-06 02:45:00 | 11.528 |
| 2015-10-06 03:00:00 | 11.528 |
| 2015-10-06 03:15:00 | 11.528 |
| 2015-10-06 03:30:00 | 11.431 |
| 2015-10-06 03:45:00 | 11.528 |
| 2015-10-06 04:00:00 | 11.528 |
| 2015-10-06 04:15:00 | 11.528 |
| 2015-10-06 04:30:00 | 11.431 |
| 2015-10-06 04:45:00 | 11.431 |
| 2015-10-06 05:00:00 | 11.431 |
| 2015-10-06 05:15:00 | 11.431 |
| 2015-10-06 05:30:00 | 11.431 |
| 2015-10-06 05:45:00 | 11.431 |
| 2015-10-06 06:00:00 | 11.431 |
| 2015-10-06 06:15:00 | 11.431 |
| 2015-10-06 06:30:00 | 11.431 |
| 2015-10-06 06:45:00 | 11.431 |
| 2015-10-06 07:00:00 | 11.431 |
| 2015-10-06 07:15:00 | 11.431 |
| 2015-10-06 07:30:00 | 11.431 |
| 2015-10-06 07:45:00 | 11.431 |
| 2015-10-06 08:00:00 | 11.431 |
| 2015-10-06 08:15:00 | 11.431 |
| 2015-10-06 08:30:00 | 11.431 |
| 2015-10-06 08:45:00 | 11.431 |
| 2015-10-06 09:00:00 | 11.528 |
| 2015-10-06 09:15:00 | 11.431 |
| 2015-10-06 09:30:00 | 11.431 |
| 2015-10-06 09:45:00 | 11.528 |
| 2015-10-06 10:00:00 | 11.528 |
| 2015-10-06 10:15:00 | 11.528 |
| 2015-10-06 10:30:00 | 11.528 |
| 2015-10-06 10:45:00 | 11.528 |
| 2015-10-06 11:00:00 | 11.528 |
| 2015-10-06 11:15:00 | 11.528 |
| 2015-10-06 11:30:00 | 11.528 |
| 2015-10-06 11:45:00 | 11.528 |
| 2015-10-06 12:00:00 | 11.528 |
| 2015-10-06 12:15:00 | 11.528 |
| 2015-10-06 12:30:00 | 11.528 |
| 2015-10-06 12:45:00 | 11.528 |
| 2015-10-06 13:00:00 | 11.528 |
| 2015-10-06 13:15:00 | 11.528 |
| 2015-10-06 13:30:00 | 11.625 |
| 2015-10-06 13:45:00 | 11.625 |
| 2015-10-06 14:00:00 | 11.625 |
| 2015-10-06 14:15:00 | 11.625 |
| 2015-10-06 14:30:00 | 11.625 |
| 2015-10-06 14:45:00 | 11.625 |
| 2015-10-06 15:00:00 | 11.625 |
| 2015-10-06 15:15:00 | 11.625 |
| 2015-10-06 15:30:00 | 11.625 |
| 2015-10-06 15:45:00 | 11.625 |
| 2015-10-06 16:00:00 | 11.625 |
| 2015-10-06 16:15:00 | 11.625 |
| 2015-10-06 16:30:00 | 11.528 |
| 2015-10-06 16:45:00 | 11.528 |
| 2015-10-06 17:00:00 | 11.528 |
| 2015-10-06 17:15:00 | 11.528 |
| 2015-10-06 17:30:00 | 11.528 |
| 2015-10-06 17:45:00 | 11.528 |
| 2015-10-06 18:00:00 | 11.528 |
| 2015-10-06 18:15:00 | 11.528 |
| 2015-10-06 18:30:00 | 11.528 |
| 2015-10-06 18:45:00 | 11.528 |
| 2015-10-06 19:00:00 | 11.528 |
| 2015-10-06 19:15:00 | 11.528 |
| 2015-10-06 19:30:00 | 11.528 |
| 2015-10-06 19:45:00 | 11.528 |
| 2015-10-06 20:00:00 | 11.528 |
| 2015-10-06 20:15:00 | 11.431 |
| 2015-10-06 20:30:00 | 11.431 |
| 2015-10-06 20:45:00 | 11.431 |
| 2015-10-06 21:00:00 | 11.431 |
| 2015-10-06 21:15:00 | 11.431 |
| 2015-10-06 21:30:00 | 11.431 |
| 2015-10-06 21:45:00 | 11.431 |
| 2015-10-06 22:00:00 | 11.431 |
| 2015-10-06 22:15:00 | 11.431 |
| 2015-10-06 22:30:00 | 11.431 |
| 2015-10-06 22:45:00 | 11.431 |
| 2015-10-06 23:00:00 | 11.431 |
| 2015-10-06 23:15:00 | 11.431 |
| 2015-10-06 23:30:00 | 11.431 |
| 2015-10-06 23:45:00 | 11.431 |
| 2015-10-07 | 11.431 |
| 2015-10-07 00:15:00 | 11.431 |
| 2015-10-07 00:30:00 | 11.431 |
| 2015-10-07 00:45:00 | 11.431 |
| 2015-10-07 01:00:00 | 11.431 |
| 2015-10-07 01:15:00 | 11.431 |
| 2015-10-07 01:30:00 | 11.431 |
| 2015-10-07 01:45:00 | 11.431 |
| 2015-10-07 02:00:00 | 11.431 |
| 2015-10-07 02:15:00 | 11.431 |
| 2015-10-07 02:30:00 | 11.431 |
| 2015-10-07 02:45:00 | 11.431 |
| 2015-10-07 03:00:00 | 11.431 |
| 2015-10-07 03:15:00 | 11.431 |
| 2015-10-07 03:30:00 | 11.431 |
| 2015-10-07 03:45:00 | 11.431 |
| 2015-10-07 04:00:00 | 11.431 |
| 2015-10-07 04:15:00 | 11.431 |
| 2015-10-07 04:30:00 | 11.431 |
| 2015-10-07 04:45:00 | 11.431 |
| 2015-10-07 05:00:00 | 11.431 |
| 2015-10-07 05:15:00 | 11.431 |
| 2015-10-07 05:30:00 | 11.431 |
| 2015-10-07 05:45:00 | 11.431 |
| 2015-10-07 06:00:00 | 11.431 |
| 2015-10-07 06:15:00 | 11.431 |
| 2015-10-07 06:30:00 | 11.431 |
| 2015-10-07 06:45:00 | 11.431 |
| 2015-10-07 07:00:00 | 11.431 |
| 2015-10-07 07:15:00 | 11.431 |
| 2015-10-07 07:30:00 | 11.431 |
| 2015-10-07 07:45:00 | 11.431 |
| 2015-10-07 08:00:00 | 11.431 |
| 2015-10-07 08:15:00 | 11.431 |
| 2015-10-07 08:30:00 | 11.431 |
| 2015-10-07 08:45:00 | 11.431 |
| 2015-10-07 09:00:00 | 11.431 |
| 2015-10-07 09:15:00 | 11.431 |
| 2015-10-07 09:30:00 | 11.431 |
| 2015-10-07 09:45:00 | 11.431 |
| 2015-10-07 10:00:00 | 11.431 |
| 2015-10-07 10:15:00 | 11.431 |
| 2015-10-07 10:30:00 | 11.431 |
| 2015-10-07 10:45:00 | 11.431 |
| 2015-10-07 11:00:00 | 11.431 |
| 2015-10-07 11:15:00 | 11.431 |
| 2015-10-07 11:30:00 | 11.431 |
| 2015-10-07 11:45:00 | 11.431 |
| 2015-10-07 12:00:00 | 11.431 |
| 2015-10-07 12:15:00 | 11.431 |
| 2015-10-07 12:30:00 | 11.431 |
| 2015-10-07 12:45:00 | 11.431 |
| 2015-10-07 13:00:00 | 11.431 |
| 2015-10-07 13:15:00 | 11.431 |
| 2015-10-07 13:30:00 | 11.431 |
| 2015-10-07 13:45:00 | 11.431 |
| 2015-10-07 14:00:00 | 11.431 |
| 2015-10-07 14:15:00 | 11.431 |
| 2015-10-07 14:30:00 | 11.528 |
| 2015-10-07 14:45:00 | 11.528 |
| 2015-10-07 15:00:00 | 11.528 |
| 2015-10-07 15:15:00 | 11.528 |
| 2015-10-07 15:30:00 | 11.528 |
| 2015-10-07 15:45:00 | 11.528 |
| 2015-10-07 16:00:00 | 11.431 |
| 2015-10-07 16:15:00 | 11.431 |
| 2015-10-07 16:30:00 | 11.528 |
| 2015-10-07 16:45:00 | 11.528 |
| 2015-10-07 17:00:00 | 11.431 |
| 2015-10-07 17:15:00 | 11.528 |
| 2015-10-07 17:30:00 | 11.431 |
| 2015-10-07 17:45:00 | 11.431 |
| 2015-10-07 18:00:00 | 11.431 |
| 2015-10-07 18:15:00 | 11.431 |
| 2015-10-07 18:30:00 | 11.431 |
| 2015-10-07 18:45:00 | 11.431 |
| 2015-10-07 19:00:00 | 11.431 |
| 2015-10-07 19:15:00 | 11.431 |
| 2015-10-07 19:30:00 | 11.431 |
| 2015-10-07 19:45:00 | 11.431 |
| 2015-10-07 20:00:00 | 11.431 |
| 2015-10-07 20:15:00 | 11.431 |
| 2015-10-07 20:30:00 | 11.431 |
| 2015-10-07 20:45:00 | 11.431 |
| 2015-10-07 21:00:00 | 11.431 |
| 2015-10-07 21:15:00 | 11.334 |
| 2015-10-07 21:30:00 | 11.334 |
| 2015-10-07 21:45:00 | 11.334 |
| 2015-10-07 22:00:00 | 11.334 |
| 2015-10-07 22:15:00 | 11.334 |
| 2015-10-07 22:30:00 | 11.334 |
| 2015-10-07 22:45:00 | 11.236 |
| 2015-10-07 23:00:00 | 11.236 |
| 2015-10-07 23:15:00 | 11.236 |
| 2015-10-07 23:30:00 | 11.236 |
| 2015-10-07 23:45:00 | 11.236 |
| 2015-10-08 | 11.236 |
| 2015-10-08 00:15:00 | 11.139 |
| 2015-10-08 00:30:00 | 11.139 |
| 2015-10-08 00:45:00 | 11.139 |
| 2015-10-08 01:00:00 | 11.139 |
| 2015-10-08 01:15:00 | 11.139 |
| 2015-10-08 01:30:00 | 11.139 |
| 2015-10-08 01:45:00 | 11.139 |
| 2015-10-08 02:00:00 | 11.139 |
| 2015-10-08 02:15:00 | 11.139 |
| 2015-10-08 02:30:00 | 11.139 |
| 2015-10-08 02:45:00 | 11.139 |
| 2015-10-08 03:00:00 | 11.139 |
| 2015-10-08 03:15:00 | 11.139 |
| 2015-10-08 03:30:00 | 11.041 |
| 2015-10-08 03:45:00 | 11.041 |
| 2015-10-08 04:00:00 | 11.041 |
| 2015-10-08 04:15:00 | 11.041 |
| 2015-10-08 04:30:00 | 11.041 |
| 2015-10-08 04:45:00 | 11.041 |
| 2015-10-08 05:00:00 | 11.041 |
| 2015-10-08 05:15:00 | 11.041 |
| 2015-10-08 05:30:00 | 11.041 |
| 2015-10-08 05:45:00 | 11.041 |
| 2015-10-08 06:00:00 | 11.041 |
| 2015-10-08 06:15:00 | 11.041 |
| 2015-10-08 06:30:00 | 11.041 |
| 2015-10-08 06:45:00 | 11.041 |
| 2015-10-08 07:00:00 | 11.041 |
| 2015-10-08 07:15:00 | 11.041 |
| 2015-10-08 07:30:00 | 11.041 |
| 2015-10-08 07:45:00 | 11.041 |
| 2015-10-08 08:00:00 | 11.139 |
| 2015-10-08 08:15:00 | 11.139 |
| 2015-10-08 08:30:00 | 11.139 |
| 2015-10-08 08:45:00 | 11.139 |
| 2015-10-08 09:00:00 | 11.139 |
| 2015-10-08 09:15:00 | 11.139 |
| 2015-10-08 09:30:00 | 11.139 |
| 2015-10-08 09:45:00 | 11.139 |
| 2015-10-08 10:00:00 | 11.139 |
| 2015-10-08 10:15:00 | 11.236 |
| 2015-10-08 10:30:00 | 11.236 |
| 2015-10-08 10:45:00 | 11.236 |
| 2015-10-08 11:00:00 | 11.236 |
| 2015-10-08 11:15:00 | 11.334 |
| 2015-10-08 11:30:00 | 11.334 |
| 2015-10-08 11:45:00 | 11.334 |
| 2015-10-08 12:00:00 | 11.334 |
| 2015-10-08 12:15:00 | 11.431 |
| 2015-10-08 12:30:00 | 11.431 |
| 2015-10-08 12:45:00 | 11.431 |
| 2015-10-08 13:00:00 | 11.431 |
| 2015-10-08 13:15:00 | 11.431 |
| 2015-10-08 13:30:00 | 11.431 |
| 2015-10-08 13:45:00 | 11.431 |
| 2015-10-08 14:00:00 | 11.431 |
| 2015-10-08 14:15:00 | 11.431 |
| 2015-10-08 14:30:00 | 11.431 |
| 2015-10-08 14:45:00 | 11.431 |
| 2015-10-08 15:00:00 | 11.528 |
| 2015-10-08 15:15:00 | 11.528 |
| 2015-10-08 15:30:00 | 11.528 |
| 2015-10-08 15:45:00 | 11.431 |
| 2015-10-08 16:00:00 | 11.528 |
| 2015-10-08 16:15:00 | 11.528 |
| 2015-10-08 16:30:00 | 11.528 |
| 2015-10-08 16:45:00 | 11.528 |
| 2015-10-08 17:00:00 | 11.431 |
| 2015-10-08 17:15:00 | 11.528 |
| 2015-10-08 17:30:00 | 11.431 |
| 2015-10-08 17:45:00 | 11.431 |
| 2015-10-08 18:00:00 | 11.431 |
| 2015-10-08 18:15:00 | 11.431 |
| 2015-10-08 18:30:00 | 11.431 |
| 2015-10-08 18:45:00 | 11.431 |
| 2015-10-08 19:00:00 | 11.431 |
| 2015-10-08 19:15:00 | 11.431 |
| 2015-10-08 19:30:00 | 11.431 |
| 2015-10-08 19:45:00 | 11.431 |
| 2015-10-08 20:00:00 | 11.431 |
| 2015-10-08 20:15:00 | 11.431 |
| 2015-10-08 20:30:00 | 11.334 |
| 2015-10-08 20:45:00 | 11.431 |
| 2015-10-08 21:00:00 | 11.334 |
| 2015-10-08 21:15:00 | 11.334 |
| 2015-10-08 21:30:00 | 11.334 |
| 2015-10-08 21:45:00 | 11.334 |
| 2015-10-08 22:00:00 | 11.334 |
| 2015-10-08 22:15:00 | 11.334 |
| 2015-10-08 22:30:00 | 11.334 |
| 2015-10-08 22:45:00 | 11.334 |
| 2015-10-08 23:00:00 | 11.334 |
| 2015-10-08 23:15:00 | 11.236 |
| 2015-10-08 23:30:00 | 11.236 |
| 2015-10-08 23:45:00 | 11.236 |